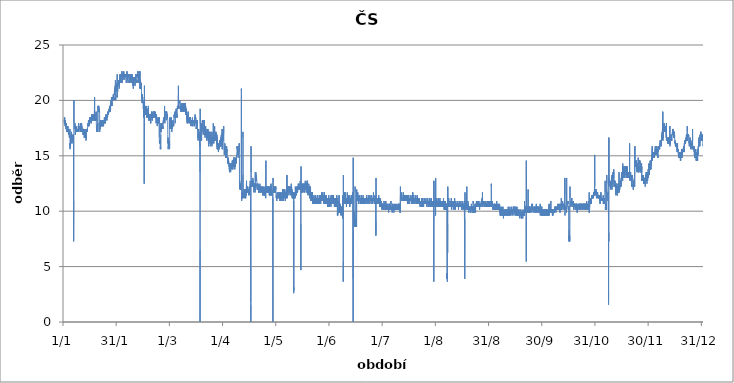
| Category | Series 0 |
|---|---|
| 2012-01-01 01:00:00 | 18.2 |
| 2012-01-01 02:00:00 | 18.2 |
| 2012-01-01 03:00:00 | 18.2 |
| 2012-01-01 04:00:00 | 18.2 |
| 2012-01-01 05:00:00 | 18.2 |
| 2012-01-01 06:00:00 | 17.94 |
| 2012-01-01 07:00:00 | 18.46 |
| 2012-01-01 08:00:00 | 18.46 |
| 2012-01-01 09:00:00 | 17.94 |
| 2012-01-01 10:00:00 | 18.46 |
| 2012-01-01 11:00:00 | 17.94 |
| 2012-01-01 12:00:00 | 17.94 |
| 2012-01-01 13:00:00 | 17.94 |
| 2012-01-01 14:00:00 | 18.2 |
| 2012-01-01 15:00:00 | 17.94 |
| 2012-01-01 16:00:00 | 17.68 |
| 2012-01-01 17:00:00 | 18.2 |
| 2012-01-01 18:00:00 | 17.94 |
| 2012-01-01 19:00:00 | 18.2 |
| 2012-01-01 20:00:00 | 17.94 |
| 2012-01-01 21:00:00 | 17.94 |
| 2012-01-01 22:00:00 | 17.68 |
| 2012-01-01 23:00:00 | 17.68 |
| 2012-01-02 | 17.94 |
| 2012-01-02 01:00:00 | 17.68 |
| 2012-01-02 02:00:00 | 17.94 |
| 2012-01-02 03:00:00 | 17.68 |
| 2012-01-02 04:00:00 | 17.42 |
| 2012-01-02 05:00:00 | 17.68 |
| 2012-01-02 06:00:00 | 17.94 |
| 2012-01-02 07:00:00 | 17.68 |
| 2012-01-02 08:00:00 | 17.68 |
| 2012-01-02 09:00:00 | 17.42 |
| 2012-01-02 10:00:00 | 17.42 |
| 2012-01-02 11:00:00 | 17.42 |
| 2012-01-02 12:00:00 | 17.16 |
| 2012-01-02 13:00:00 | 17.42 |
| 2012-01-02 14:00:00 | 17.16 |
| 2012-01-02 15:00:00 | 17.16 |
| 2012-01-02 16:00:00 | 17.16 |
| 2012-01-02 17:00:00 | 17.16 |
| 2012-01-02 18:00:00 | 17.42 |
| 2012-01-02 19:00:00 | 17.42 |
| 2012-01-02 20:00:00 | 17.42 |
| 2012-01-02 21:00:00 | 17.42 |
| 2012-01-02 22:00:00 | 17.16 |
| 2012-01-02 23:00:00 | 17.68 |
| 2012-01-03 | 17.42 |
| 2012-01-03 01:00:00 | 17.42 |
| 2012-01-03 02:00:00 | 17.68 |
| 2012-01-03 03:00:00 | 17.16 |
| 2012-01-03 04:00:00 | 17.42 |
| 2012-01-03 05:00:00 | 17.42 |
| 2012-01-03 06:00:00 | 17.42 |
| 2012-01-03 07:00:00 | 17.68 |
| 2012-01-03 08:00:00 | 17.42 |
| 2012-01-03 09:00:00 | 17.42 |
| 2012-01-03 10:00:00 | 17.42 |
| 2012-01-03 11:00:00 | 17.16 |
| 2012-01-03 12:00:00 | 17.16 |
| 2012-01-03 13:00:00 | 17.16 |
| 2012-01-03 14:00:00 | 17.16 |
| 2012-01-03 15:00:00 | 16.9 |
| 2012-01-03 16:00:00 | 16.9 |
| 2012-01-03 17:00:00 | 17.16 |
| 2012-01-03 18:00:00 | 17.16 |
| 2012-01-03 19:00:00 | 17.42 |
| 2012-01-03 20:00:00 | 17.42 |
| 2012-01-03 21:00:00 | 16.9 |
| 2012-01-03 22:00:00 | 17.16 |
| 2012-01-03 23:00:00 | 16.9 |
| 2012-01-04 | 17.16 |
| 2012-01-04 01:00:00 | 16.9 |
| 2012-01-04 02:00:00 | 17.16 |
| 2012-01-04 03:00:00 | 16.64 |
| 2012-01-04 04:00:00 | 16.9 |
| 2012-01-04 05:00:00 | 16.64 |
| 2012-01-04 06:00:00 | 16.64 |
| 2012-01-04 07:00:00 | 16.64 |
| 2012-01-04 08:00:00 | 16.9 |
| 2012-01-04 09:00:00 | 16.9 |
| 2012-01-04 10:00:00 | 17.42 |
| 2012-01-04 11:00:00 | 16.9 |
| 2012-01-04 12:00:00 | 15.6 |
| 2012-01-04 13:00:00 | 16.12 |
| 2012-01-04 14:00:00 | 15.86 |
| 2012-01-04 15:00:00 | 16.12 |
| 2012-01-04 16:00:00 | 15.86 |
| 2012-01-04 17:00:00 | 16.12 |
| 2012-01-04 18:00:00 | 15.86 |
| 2012-01-04 19:00:00 | 16.38 |
| 2012-01-04 20:00:00 | 16.38 |
| 2012-01-04 21:00:00 | 16.38 |
| 2012-01-04 22:00:00 | 16.38 |
| 2012-01-04 23:00:00 | 16.12 |
| 2012-01-05 | 16.9 |
| 2012-01-05 01:00:00 | 16.38 |
| 2012-01-05 02:00:00 | 16.64 |
| 2012-01-05 03:00:00 | 16.64 |
| 2012-01-05 04:00:00 | 16.38 |
| 2012-01-05 05:00:00 | 16.64 |
| 2012-01-05 06:00:00 | 16.38 |
| 2012-01-05 07:00:00 | 17.16 |
| 2012-01-05 08:00:00 | 16.9 |
| 2012-01-05 09:00:00 | 16.38 |
| 2012-01-05 10:00:00 | 16.64 |
| 2012-01-05 11:00:00 | 16.38 |
| 2012-01-05 12:00:00 | 16.38 |
| 2012-01-05 13:00:00 | 16.38 |
| 2012-01-05 14:00:00 | 16.9 |
| 2012-01-05 15:00:00 | 16.38 |
| 2012-01-05 16:00:00 | 16.12 |
| 2012-01-05 17:00:00 | 16.38 |
| 2012-01-05 18:00:00 | 16.38 |
| 2012-01-05 19:00:00 | 16.64 |
| 2012-01-05 20:00:00 | 16.38 |
| 2012-01-05 21:00:00 | 16.38 |
| 2012-01-05 22:00:00 | 16.38 |
| 2012-01-05 23:00:00 | 16.38 |
| 2012-01-06 | 16.64 |
| 2012-01-06 01:00:00 | 16.64 |
| 2012-01-06 02:00:00 | 16.9 |
| 2012-01-06 03:00:00 | 16.38 |
| 2012-01-06 04:00:00 | 16.64 |
| 2012-01-06 05:00:00 | 16.64 |
| 2012-01-06 06:00:00 | 16.38 |
| 2012-01-06 07:00:00 | 16.9 |
| 2012-01-06 08:00:00 | 16.64 |
| 2012-01-06 09:00:00 | 16.64 |
| 2012-01-06 10:00:00 | 16.64 |
| 2012-01-06 11:00:00 | 16.38 |
| 2012-01-06 12:00:00 | 16.64 |
| 2012-01-06 13:00:00 | 7.28 |
| 2012-01-06 14:00:00 | 7.28 |
| 2012-01-06 15:00:00 | 10.92 |
| 2012-01-06 16:00:00 | 13.52 |
| 2012-01-06 17:00:00 | 20.02 |
| 2012-01-06 18:00:00 | 17.94 |
| 2012-01-06 19:00:00 | 17.68 |
| 2012-01-06 20:00:00 | 17.68 |
| 2012-01-06 21:00:00 | 17.68 |
| 2012-01-06 22:00:00 | 17.42 |
| 2012-01-06 23:00:00 | 17.42 |
| 2012-01-07 | 17.42 |
| 2012-01-07 01:00:00 | 17.42 |
| 2012-01-07 02:00:00 | 17.68 |
| 2012-01-07 03:00:00 | 17.42 |
| 2012-01-07 04:00:00 | 17.42 |
| 2012-01-07 05:00:00 | 17.68 |
| 2012-01-07 06:00:00 | 17.68 |
| 2012-01-07 07:00:00 | 17.42 |
| 2012-01-07 08:00:00 | 17.68 |
| 2012-01-07 09:00:00 | 17.94 |
| 2012-01-07 10:00:00 | 17.42 |
| 2012-01-07 11:00:00 | 17.42 |
| 2012-01-07 12:00:00 | 17.68 |
| 2012-01-07 13:00:00 | 16.9 |
| 2012-01-07 14:00:00 | 17.42 |
| 2012-01-07 15:00:00 | 16.9 |
| 2012-01-07 16:00:00 | 17.16 |
| 2012-01-07 17:00:00 | 17.42 |
| 2012-01-07 18:00:00 | 17.16 |
| 2012-01-07 19:00:00 | 17.16 |
| 2012-01-07 20:00:00 | 17.42 |
| 2012-01-07 21:00:00 | 17.16 |
| 2012-01-07 22:00:00 | 17.42 |
| 2012-01-07 23:00:00 | 17.16 |
| 2012-01-08 | 17.42 |
| 2012-01-08 01:00:00 | 17.42 |
| 2012-01-08 02:00:00 | 17.42 |
| 2012-01-08 03:00:00 | 17.16 |
| 2012-01-08 04:00:00 | 17.16 |
| 2012-01-08 05:00:00 | 17.42 |
| 2012-01-08 06:00:00 | 17.42 |
| 2012-01-08 07:00:00 | 17.68 |
| 2012-01-08 08:00:00 | 17.42 |
| 2012-01-08 09:00:00 | 17.16 |
| 2012-01-08 10:00:00 | 17.42 |
| 2012-01-08 11:00:00 | 17.16 |
| 2012-01-08 12:00:00 | 17.16 |
| 2012-01-08 13:00:00 | 17.16 |
| 2012-01-08 14:00:00 | 17.16 |
| 2012-01-08 15:00:00 | 17.16 |
| 2012-01-08 16:00:00 | 17.16 |
| 2012-01-08 17:00:00 | 17.42 |
| 2012-01-08 18:00:00 | 17.16 |
| 2012-01-08 19:00:00 | 17.42 |
| 2012-01-08 20:00:00 | 17.42 |
| 2012-01-08 21:00:00 | 17.16 |
| 2012-01-08 22:00:00 | 17.42 |
| 2012-01-08 23:00:00 | 17.42 |
| 2012-01-09 | 17.42 |
| 2012-01-09 01:00:00 | 17.42 |
| 2012-01-09 02:00:00 | 17.42 |
| 2012-01-09 03:00:00 | 17.42 |
| 2012-01-09 04:00:00 | 17.42 |
| 2012-01-09 05:00:00 | 17.16 |
| 2012-01-09 06:00:00 | 17.42 |
| 2012-01-09 07:00:00 | 17.42 |
| 2012-01-09 08:00:00 | 17.94 |
| 2012-01-09 09:00:00 | 17.42 |
| 2012-01-09 10:00:00 | 17.94 |
| 2012-01-09 11:00:00 | 17.42 |
| 2012-01-09 12:00:00 | 17.16 |
| 2012-01-09 13:00:00 | 17.16 |
| 2012-01-09 14:00:00 | 17.16 |
| 2012-01-09 15:00:00 | 17.16 |
| 2012-01-09 16:00:00 | 17.16 |
| 2012-01-09 17:00:00 | 17.42 |
| 2012-01-09 18:00:00 | 17.68 |
| 2012-01-09 19:00:00 | 17.42 |
| 2012-01-09 20:00:00 | 17.68 |
| 2012-01-09 21:00:00 | 17.42 |
| 2012-01-09 22:00:00 | 17.42 |
| 2012-01-09 23:00:00 | 17.42 |
| 2012-01-10 | 17.42 |
| 2012-01-10 01:00:00 | 17.42 |
| 2012-01-10 02:00:00 | 17.68 |
| 2012-01-10 03:00:00 | 17.42 |
| 2012-01-10 04:00:00 | 17.42 |
| 2012-01-10 05:00:00 | 17.42 |
| 2012-01-10 06:00:00 | 17.42 |
| 2012-01-10 07:00:00 | 17.68 |
| 2012-01-10 08:00:00 | 17.42 |
| 2012-01-10 09:00:00 | 17.68 |
| 2012-01-10 10:00:00 | 17.16 |
| 2012-01-10 11:00:00 | 17.16 |
| 2012-01-10 12:00:00 | 17.94 |
| 2012-01-10 13:00:00 | 17.16 |
| 2012-01-10 14:00:00 | 17.42 |
| 2012-01-10 15:00:00 | 17.42 |
| 2012-01-10 16:00:00 | 17.42 |
| 2012-01-10 17:00:00 | 17.42 |
| 2012-01-10 18:00:00 | 17.68 |
| 2012-01-10 19:00:00 | 17.42 |
| 2012-01-10 20:00:00 | 17.68 |
| 2012-01-10 21:00:00 | 17.42 |
| 2012-01-10 22:00:00 | 17.68 |
| 2012-01-10 23:00:00 | 17.16 |
| 2012-01-11 | 17.68 |
| 2012-01-11 01:00:00 | 17.42 |
| 2012-01-11 02:00:00 | 17.68 |
| 2012-01-11 03:00:00 | 17.94 |
| 2012-01-11 04:00:00 | 17.42 |
| 2012-01-11 05:00:00 | 17.68 |
| 2012-01-11 06:00:00 | 17.68 |
| 2012-01-11 07:00:00 | 17.68 |
| 2012-01-11 08:00:00 | 17.42 |
| 2012-01-11 09:00:00 | 17.42 |
| 2012-01-11 10:00:00 | 17.42 |
| 2012-01-11 11:00:00 | 17.42 |
| 2012-01-11 12:00:00 | 17.16 |
| 2012-01-11 13:00:00 | 17.16 |
| 2012-01-11 14:00:00 | 17.42 |
| 2012-01-11 15:00:00 | 17.16 |
| 2012-01-11 16:00:00 | 17.42 |
| 2012-01-11 17:00:00 | 17.42 |
| 2012-01-11 18:00:00 | 17.16 |
| 2012-01-11 19:00:00 | 17.42 |
| 2012-01-11 20:00:00 | 17.42 |
| 2012-01-11 21:00:00 | 17.16 |
| 2012-01-11 22:00:00 | 17.42 |
| 2012-01-11 23:00:00 | 16.9 |
| 2012-01-12 | 17.42 |
| 2012-01-12 01:00:00 | 17.16 |
| 2012-01-12 02:00:00 | 17.42 |
| 2012-01-12 03:00:00 | 17.16 |
| 2012-01-12 04:00:00 | 17.42 |
| 2012-01-12 05:00:00 | 17.16 |
| 2012-01-12 06:00:00 | 17.16 |
| 2012-01-12 07:00:00 | 17.42 |
| 2012-01-12 08:00:00 | 17.16 |
| 2012-01-12 09:00:00 | 16.9 |
| 2012-01-12 10:00:00 | 16.9 |
| 2012-01-12 11:00:00 | 17.42 |
| 2012-01-12 12:00:00 | 16.9 |
| 2012-01-12 13:00:00 | 17.16 |
| 2012-01-12 14:00:00 | 16.9 |
| 2012-01-12 15:00:00 | 16.64 |
| 2012-01-12 16:00:00 | 16.64 |
| 2012-01-12 17:00:00 | 17.42 |
| 2012-01-12 18:00:00 | 16.9 |
| 2012-01-12 19:00:00 | 17.16 |
| 2012-01-12 20:00:00 | 16.9 |
| 2012-01-12 21:00:00 | 16.9 |
| 2012-01-12 22:00:00 | 16.9 |
| 2012-01-12 23:00:00 | 16.64 |
| 2012-01-13 | 16.64 |
| 2012-01-13 01:00:00 | 16.64 |
| 2012-01-13 02:00:00 | 16.9 |
| 2012-01-13 03:00:00 | 16.9 |
| 2012-01-13 04:00:00 | 16.64 |
| 2012-01-13 05:00:00 | 16.9 |
| 2012-01-13 06:00:00 | 16.64 |
| 2012-01-13 07:00:00 | 17.16 |
| 2012-01-13 08:00:00 | 16.9 |
| 2012-01-13 09:00:00 | 16.64 |
| 2012-01-13 10:00:00 | 16.64 |
| 2012-01-13 11:00:00 | 16.9 |
| 2012-01-13 12:00:00 | 16.64 |
| 2012-01-13 13:00:00 | 17.42 |
| 2012-01-13 14:00:00 | 16.9 |
| 2012-01-13 15:00:00 | 16.9 |
| 2012-01-13 16:00:00 | 16.38 |
| 2012-01-13 17:00:00 | 16.9 |
| 2012-01-13 18:00:00 | 16.9 |
| 2012-01-13 19:00:00 | 17.42 |
| 2012-01-13 20:00:00 | 17.16 |
| 2012-01-13 21:00:00 | 16.9 |
| 2012-01-13 22:00:00 | 17.16 |
| 2012-01-13 23:00:00 | 17.16 |
| 2012-01-14 | 17.16 |
| 2012-01-14 01:00:00 | 17.16 |
| 2012-01-14 02:00:00 | 17.42 |
| 2012-01-14 03:00:00 | 17.16 |
| 2012-01-14 04:00:00 | 17.42 |
| 2012-01-14 05:00:00 | 17.42 |
| 2012-01-14 06:00:00 | 17.42 |
| 2012-01-14 07:00:00 | 17.42 |
| 2012-01-14 08:00:00 | 17.42 |
| 2012-01-14 09:00:00 | 17.42 |
| 2012-01-14 10:00:00 | 17.16 |
| 2012-01-14 11:00:00 | 17.42 |
| 2012-01-14 12:00:00 | 17.42 |
| 2012-01-14 13:00:00 | 17.42 |
| 2012-01-14 14:00:00 | 17.42 |
| 2012-01-14 15:00:00 | 17.42 |
| 2012-01-14 16:00:00 | 17.68 |
| 2012-01-14 17:00:00 | 17.68 |
| 2012-01-14 18:00:00 | 17.68 |
| 2012-01-14 19:00:00 | 17.94 |
| 2012-01-14 20:00:00 | 17.68 |
| 2012-01-14 21:00:00 | 17.68 |
| 2012-01-14 22:00:00 | 17.94 |
| 2012-01-14 23:00:00 | 17.68 |
| 2012-01-15 | 17.68 |
| 2012-01-15 01:00:00 | 18.2 |
| 2012-01-15 02:00:00 | 17.94 |
| 2012-01-15 03:00:00 | 18.2 |
| 2012-01-15 04:00:00 | 17.94 |
| 2012-01-15 05:00:00 | 17.68 |
| 2012-01-15 06:00:00 | 18.2 |
| 2012-01-15 07:00:00 | 18.2 |
| 2012-01-15 08:00:00 | 17.94 |
| 2012-01-15 09:00:00 | 17.94 |
| 2012-01-15 10:00:00 | 17.68 |
| 2012-01-15 11:00:00 | 17.68 |
| 2012-01-15 12:00:00 | 17.94 |
| 2012-01-15 13:00:00 | 18.2 |
| 2012-01-15 14:00:00 | 17.94 |
| 2012-01-15 15:00:00 | 17.94 |
| 2012-01-15 16:00:00 | 17.94 |
| 2012-01-15 17:00:00 | 17.94 |
| 2012-01-15 18:00:00 | 18.2 |
| 2012-01-15 19:00:00 | 18.2 |
| 2012-01-15 20:00:00 | 18.46 |
| 2012-01-15 21:00:00 | 18.2 |
| 2012-01-15 22:00:00 | 18.46 |
| 2012-01-15 23:00:00 | 18.2 |
| 2012-01-16 | 18.2 |
| 2012-01-16 01:00:00 | 18.46 |
| 2012-01-16 02:00:00 | 18.46 |
| 2012-01-16 03:00:00 | 18.46 |
| 2012-01-16 04:00:00 | 18.2 |
| 2012-01-16 05:00:00 | 18.2 |
| 2012-01-16 06:00:00 | 18.2 |
| 2012-01-16 07:00:00 | 18.46 |
| 2012-01-16 08:00:00 | 18.46 |
| 2012-01-16 09:00:00 | 18.2 |
| 2012-01-16 10:00:00 | 18.2 |
| 2012-01-16 11:00:00 | 18.2 |
| 2012-01-16 12:00:00 | 17.94 |
| 2012-01-16 13:00:00 | 18.46 |
| 2012-01-16 14:00:00 | 18.46 |
| 2012-01-16 15:00:00 | 18.2 |
| 2012-01-16 16:00:00 | 17.94 |
| 2012-01-16 17:00:00 | 18.2 |
| 2012-01-16 18:00:00 | 18.2 |
| 2012-01-16 19:00:00 | 18.72 |
| 2012-01-16 20:00:00 | 18.46 |
| 2012-01-16 21:00:00 | 18.46 |
| 2012-01-16 22:00:00 | 18.2 |
| 2012-01-16 23:00:00 | 18.46 |
| 2012-01-17 | 18.46 |
| 2012-01-17 01:00:00 | 18.72 |
| 2012-01-17 02:00:00 | 18.72 |
| 2012-01-17 03:00:00 | 18.46 |
| 2012-01-17 04:00:00 | 18.46 |
| 2012-01-17 05:00:00 | 18.46 |
| 2012-01-17 06:00:00 | 18.72 |
| 2012-01-17 07:00:00 | 18.72 |
| 2012-01-17 08:00:00 | 18.72 |
| 2012-01-17 09:00:00 | 18.2 |
| 2012-01-17 10:00:00 | 18.2 |
| 2012-01-17 11:00:00 | 18.46 |
| 2012-01-17 12:00:00 | 18.2 |
| 2012-01-17 13:00:00 | 18.46 |
| 2012-01-17 14:00:00 | 18.2 |
| 2012-01-17 15:00:00 | 18.2 |
| 2012-01-17 16:00:00 | 18.2 |
| 2012-01-17 17:00:00 | 18.46 |
| 2012-01-17 18:00:00 | 18.2 |
| 2012-01-17 19:00:00 | 18.46 |
| 2012-01-17 20:00:00 | 18.46 |
| 2012-01-17 21:00:00 | 18.46 |
| 2012-01-17 22:00:00 | 18.46 |
| 2012-01-17 23:00:00 | 18.46 |
| 2012-01-18 | 18.46 |
| 2012-01-18 01:00:00 | 18.46 |
| 2012-01-18 02:00:00 | 18.72 |
| 2012-01-18 03:00:00 | 18.46 |
| 2012-01-18 04:00:00 | 18.72 |
| 2012-01-18 05:00:00 | 18.46 |
| 2012-01-18 06:00:00 | 18.46 |
| 2012-01-18 07:00:00 | 18.46 |
| 2012-01-18 08:00:00 | 18.46 |
| 2012-01-18 09:00:00 | 18.2 |
| 2012-01-18 10:00:00 | 18.2 |
| 2012-01-18 11:00:00 | 18.2 |
| 2012-01-18 12:00:00 | 19.76 |
| 2012-01-18 13:00:00 | 20.28 |
| 2012-01-18 14:00:00 | 18.2 |
| 2012-01-18 15:00:00 | 18.46 |
| 2012-01-18 16:00:00 | 18.2 |
| 2012-01-18 17:00:00 | 18.46 |
| 2012-01-18 18:00:00 | 18.46 |
| 2012-01-18 19:00:00 | 18.46 |
| 2012-01-18 20:00:00 | 18.72 |
| 2012-01-18 21:00:00 | 18.46 |
| 2012-01-18 22:00:00 | 18.46 |
| 2012-01-18 23:00:00 | 18.72 |
| 2012-01-19 | 18.2 |
| 2012-01-19 01:00:00 | 18.72 |
| 2012-01-19 02:00:00 | 18.72 |
| 2012-01-19 03:00:00 | 18.46 |
| 2012-01-19 04:00:00 | 18.2 |
| 2012-01-19 05:00:00 | 18.72 |
| 2012-01-19 06:00:00 | 18.2 |
| 2012-01-19 07:00:00 | 18.46 |
| 2012-01-19 08:00:00 | 18.46 |
| 2012-01-19 09:00:00 | 18.2 |
| 2012-01-19 10:00:00 | 18.98 |
| 2012-01-19 11:00:00 | 18.72 |
| 2012-01-19 12:00:00 | 18.2 |
| 2012-01-19 13:00:00 | 17.94 |
| 2012-01-19 14:00:00 | 17.68 |
| 2012-01-19 15:00:00 | 17.42 |
| 2012-01-19 16:00:00 | 17.16 |
| 2012-01-19 17:00:00 | 17.68 |
| 2012-01-19 18:00:00 | 17.68 |
| 2012-01-19 19:00:00 | 17.68 |
| 2012-01-19 20:00:00 | 17.42 |
| 2012-01-19 21:00:00 | 17.68 |
| 2012-01-19 22:00:00 | 17.68 |
| 2012-01-19 23:00:00 | 17.42 |
| 2012-01-20 | 17.68 |
| 2012-01-20 01:00:00 | 17.68 |
| 2012-01-20 02:00:00 | 17.68 |
| 2012-01-20 03:00:00 | 17.42 |
| 2012-01-20 04:00:00 | 17.42 |
| 2012-01-20 05:00:00 | 17.94 |
| 2012-01-20 06:00:00 | 17.68 |
| 2012-01-20 07:00:00 | 17.68 |
| 2012-01-20 08:00:00 | 17.94 |
| 2012-01-20 09:00:00 | 17.16 |
| 2012-01-20 10:00:00 | 19.24 |
| 2012-01-20 11:00:00 | 19.24 |
| 2012-01-20 12:00:00 | 19.24 |
| 2012-01-20 13:00:00 | 19.5 |
| 2012-01-20 14:00:00 | 19.24 |
| 2012-01-20 15:00:00 | 19.5 |
| 2012-01-20 16:00:00 | 19.24 |
| 2012-01-20 17:00:00 | 18.98 |
| 2012-01-20 18:00:00 | 19.5 |
| 2012-01-20 19:00:00 | 19.5 |
| 2012-01-20 20:00:00 | 19.5 |
| 2012-01-20 21:00:00 | 19.24 |
| 2012-01-20 22:00:00 | 19.5 |
| 2012-01-20 23:00:00 | 19.24 |
| 2012-01-21 | 18.98 |
| 2012-01-21 01:00:00 | 19.24 |
| 2012-01-21 02:00:00 | 19.24 |
| 2012-01-21 03:00:00 | 19.24 |
| 2012-01-21 04:00:00 | 19.24 |
| 2012-01-21 05:00:00 | 19.24 |
| 2012-01-21 06:00:00 | 19.24 |
| 2012-01-21 07:00:00 | 18.98 |
| 2012-01-21 08:00:00 | 19.24 |
| 2012-01-21 09:00:00 | 18.98 |
| 2012-01-21 10:00:00 | 18.72 |
| 2012-01-21 11:00:00 | 17.16 |
| 2012-01-21 12:00:00 | 17.42 |
| 2012-01-21 13:00:00 | 17.42 |
| 2012-01-21 14:00:00 | 17.94 |
| 2012-01-21 15:00:00 | 17.42 |
| 2012-01-21 16:00:00 | 17.68 |
| 2012-01-21 17:00:00 | 17.68 |
| 2012-01-21 18:00:00 | 17.94 |
| 2012-01-21 19:00:00 | 17.94 |
| 2012-01-21 20:00:00 | 18.2 |
| 2012-01-21 21:00:00 | 17.68 |
| 2012-01-21 22:00:00 | 17.94 |
| 2012-01-21 23:00:00 | 17.94 |
| 2012-01-22 | 17.94 |
| 2012-01-22 01:00:00 | 17.68 |
| 2012-01-22 02:00:00 | 18.2 |
| 2012-01-22 03:00:00 | 17.94 |
| 2012-01-22 04:00:00 | 17.94 |
| 2012-01-22 05:00:00 | 17.94 |
| 2012-01-22 06:00:00 | 17.68 |
| 2012-01-22 07:00:00 | 18.2 |
| 2012-01-22 08:00:00 | 17.94 |
| 2012-01-22 09:00:00 | 17.94 |
| 2012-01-22 10:00:00 | 17.68 |
| 2012-01-22 11:00:00 | 17.94 |
| 2012-01-22 12:00:00 | 17.94 |
| 2012-01-22 13:00:00 | 17.94 |
| 2012-01-22 14:00:00 | 17.94 |
| 2012-01-22 15:00:00 | 17.68 |
| 2012-01-22 16:00:00 | 17.68 |
| 2012-01-22 17:00:00 | 17.94 |
| 2012-01-22 18:00:00 | 17.68 |
| 2012-01-22 19:00:00 | 17.94 |
| 2012-01-22 20:00:00 | 18.2 |
| 2012-01-22 21:00:00 | 17.68 |
| 2012-01-22 22:00:00 | 17.94 |
| 2012-01-22 23:00:00 | 17.68 |
| 2012-01-23 | 17.94 |
| 2012-01-23 01:00:00 | 17.94 |
| 2012-01-23 02:00:00 | 17.94 |
| 2012-01-23 03:00:00 | 17.94 |
| 2012-01-23 04:00:00 | 17.68 |
| 2012-01-23 05:00:00 | 17.94 |
| 2012-01-23 06:00:00 | 17.68 |
| 2012-01-23 07:00:00 | 17.94 |
| 2012-01-23 08:00:00 | 18.2 |
| 2012-01-23 09:00:00 | 17.94 |
| 2012-01-23 10:00:00 | 17.94 |
| 2012-01-23 11:00:00 | 18.2 |
| 2012-01-23 12:00:00 | 17.68 |
| 2012-01-23 13:00:00 | 18.2 |
| 2012-01-23 14:00:00 | 17.94 |
| 2012-01-23 15:00:00 | 17.94 |
| 2012-01-23 16:00:00 | 17.68 |
| 2012-01-23 17:00:00 | 18.2 |
| 2012-01-23 18:00:00 | 18.2 |
| 2012-01-23 19:00:00 | 17.94 |
| 2012-01-23 20:00:00 | 17.94 |
| 2012-01-23 21:00:00 | 17.94 |
| 2012-01-23 22:00:00 | 17.94 |
| 2012-01-23 23:00:00 | 17.94 |
| 2012-01-24 | 17.94 |
| 2012-01-24 01:00:00 | 18.2 |
| 2012-01-24 02:00:00 | 18.2 |
| 2012-01-24 03:00:00 | 18.46 |
| 2012-01-24 04:00:00 | 18.2 |
| 2012-01-24 05:00:00 | 18.2 |
| 2012-01-24 06:00:00 | 18.2 |
| 2012-01-24 07:00:00 | 18.2 |
| 2012-01-24 08:00:00 | 18.2 |
| 2012-01-24 09:00:00 | 17.94 |
| 2012-01-24 10:00:00 | 17.94 |
| 2012-01-24 11:00:00 | 18.46 |
| 2012-01-24 12:00:00 | 17.94 |
| 2012-01-24 13:00:00 | 17.94 |
| 2012-01-24 14:00:00 | 18.2 |
| 2012-01-24 15:00:00 | 17.94 |
| 2012-01-24 16:00:00 | 17.94 |
| 2012-01-24 17:00:00 | 17.94 |
| 2012-01-24 18:00:00 | 18.46 |
| 2012-01-24 19:00:00 | 18.2 |
| 2012-01-24 20:00:00 | 18.46 |
| 2012-01-24 21:00:00 | 18.46 |
| 2012-01-24 22:00:00 | 18.46 |
| 2012-01-24 23:00:00 | 18.46 |
| 2012-01-25 | 18.2 |
| 2012-01-25 01:00:00 | 18.46 |
| 2012-01-25 02:00:00 | 18.72 |
| 2012-01-25 03:00:00 | 18.46 |
| 2012-01-25 04:00:00 | 18.72 |
| 2012-01-25 05:00:00 | 18.46 |
| 2012-01-25 06:00:00 | 18.46 |
| 2012-01-25 07:00:00 | 18.46 |
| 2012-01-25 08:00:00 | 18.46 |
| 2012-01-25 09:00:00 | 18.46 |
| 2012-01-25 10:00:00 | 18.46 |
| 2012-01-25 11:00:00 | 18.46 |
| 2012-01-25 12:00:00 | 18.46 |
| 2012-01-25 13:00:00 | 18.46 |
| 2012-01-25 14:00:00 | 18.46 |
| 2012-01-25 15:00:00 | 18.2 |
| 2012-01-25 16:00:00 | 18.46 |
| 2012-01-25 17:00:00 | 18.46 |
| 2012-01-25 18:00:00 | 18.46 |
| 2012-01-25 19:00:00 | 18.72 |
| 2012-01-25 20:00:00 | 18.72 |
| 2012-01-25 21:00:00 | 18.72 |
| 2012-01-25 22:00:00 | 18.72 |
| 2012-01-25 23:00:00 | 18.46 |
| 2012-01-26 | 18.72 |
| 2012-01-26 01:00:00 | 18.98 |
| 2012-01-26 02:00:00 | 18.98 |
| 2012-01-26 03:00:00 | 18.72 |
| 2012-01-26 04:00:00 | 18.72 |
| 2012-01-26 05:00:00 | 18.72 |
| 2012-01-26 06:00:00 | 18.72 |
| 2012-01-26 07:00:00 | 18.72 |
| 2012-01-26 08:00:00 | 18.98 |
| 2012-01-26 09:00:00 | 18.72 |
| 2012-01-26 10:00:00 | 18.72 |
| 2012-01-26 11:00:00 | 18.72 |
| 2012-01-26 12:00:00 | 18.72 |
| 2012-01-26 13:00:00 | 18.72 |
| 2012-01-26 14:00:00 | 18.72 |
| 2012-01-26 15:00:00 | 18.72 |
| 2012-01-26 16:00:00 | 18.72 |
| 2012-01-26 17:00:00 | 18.72 |
| 2012-01-26 18:00:00 | 18.98 |
| 2012-01-26 19:00:00 | 19.24 |
| 2012-01-26 20:00:00 | 18.98 |
| 2012-01-26 21:00:00 | 18.98 |
| 2012-01-26 22:00:00 | 18.98 |
| 2012-01-26 23:00:00 | 18.98 |
| 2012-01-27 | 19.24 |
| 2012-01-27 01:00:00 | 19.24 |
| 2012-01-27 02:00:00 | 19.5 |
| 2012-01-27 03:00:00 | 19.24 |
| 2012-01-27 04:00:00 | 19.24 |
| 2012-01-27 05:00:00 | 19.5 |
| 2012-01-27 06:00:00 | 19.24 |
| 2012-01-27 07:00:00 | 19.5 |
| 2012-01-27 08:00:00 | 19.5 |
| 2012-01-27 09:00:00 | 19.24 |
| 2012-01-27 10:00:00 | 19.5 |
| 2012-01-27 11:00:00 | 19.5 |
| 2012-01-27 12:00:00 | 19.24 |
| 2012-01-27 13:00:00 | 19.24 |
| 2012-01-27 14:00:00 | 19.24 |
| 2012-01-27 15:00:00 | 18.98 |
| 2012-01-27 16:00:00 | 19.24 |
| 2012-01-27 17:00:00 | 19.24 |
| 2012-01-27 18:00:00 | 19.5 |
| 2012-01-27 19:00:00 | 19.5 |
| 2012-01-27 20:00:00 | 19.76 |
| 2012-01-27 21:00:00 | 19.5 |
| 2012-01-27 22:00:00 | 19.76 |
| 2012-01-27 23:00:00 | 19.5 |
| 2012-01-28 | 20.02 |
| 2012-01-28 01:00:00 | 19.76 |
| 2012-01-28 02:00:00 | 20.02 |
| 2012-01-28 03:00:00 | 20.02 |
| 2012-01-28 04:00:00 | 20.02 |
| 2012-01-28 05:00:00 | 20.02 |
| 2012-01-28 06:00:00 | 20.28 |
| 2012-01-28 07:00:00 | 20.02 |
| 2012-01-28 08:00:00 | 20.02 |
| 2012-01-28 09:00:00 | 20.02 |
| 2012-01-28 10:00:00 | 19.76 |
| 2012-01-28 11:00:00 | 19.76 |
| 2012-01-28 12:00:00 | 19.76 |
| 2012-01-28 13:00:00 | 19.76 |
| 2012-01-28 14:00:00 | 19.5 |
| 2012-01-28 15:00:00 | 19.5 |
| 2012-01-28 16:00:00 | 19.76 |
| 2012-01-28 17:00:00 | 19.76 |
| 2012-01-28 18:00:00 | 20.02 |
| 2012-01-28 19:00:00 | 20.02 |
| 2012-01-28 20:00:00 | 20.28 |
| 2012-01-28 21:00:00 | 20.02 |
| 2012-01-28 22:00:00 | 20.28 |
| 2012-01-28 23:00:00 | 20.02 |
| 2012-01-29 | 20.02 |
| 2012-01-29 01:00:00 | 20.02 |
| 2012-01-29 02:00:00 | 20.28 |
| 2012-01-29 03:00:00 | 20.28 |
| 2012-01-29 04:00:00 | 20.28 |
| 2012-01-29 05:00:00 | 20.28 |
| 2012-01-29 06:00:00 | 20.54 |
| 2012-01-29 07:00:00 | 20.28 |
| 2012-01-29 08:00:00 | 20.54 |
| 2012-01-29 09:00:00 | 20.54 |
| 2012-01-29 10:00:00 | 20.28 |
| 2012-01-29 11:00:00 | 20.28 |
| 2012-01-29 12:00:00 | 20.28 |
| 2012-01-29 13:00:00 | 20.02 |
| 2012-01-29 14:00:00 | 20.28 |
| 2012-01-29 15:00:00 | 20.02 |
| 2012-01-29 16:00:00 | 20.02 |
| 2012-01-29 17:00:00 | 20.28 |
| 2012-01-29 18:00:00 | 20.54 |
| 2012-01-29 19:00:00 | 20.54 |
| 2012-01-29 20:00:00 | 20.54 |
| 2012-01-29 21:00:00 | 20.8 |
| 2012-01-29 22:00:00 | 20.54 |
| 2012-01-29 23:00:00 | 20.8 |
| 2012-01-30 | 20.54 |
| 2012-01-30 01:00:00 | 21.06 |
| 2012-01-30 02:00:00 | 21.06 |
| 2012-01-30 03:00:00 | 20.8 |
| 2012-01-30 04:00:00 | 21.06 |
| 2012-01-30 05:00:00 | 21.06 |
| 2012-01-30 06:00:00 | 21.06 |
| 2012-01-30 07:00:00 | 21.32 |
| 2012-01-30 08:00:00 | 21.06 |
| 2012-01-30 09:00:00 | 21.06 |
| 2012-01-30 10:00:00 | 20.8 |
| 2012-01-30 11:00:00 | 21.84 |
| 2012-01-30 12:00:00 | 21.32 |
| 2012-01-30 13:00:00 | 20.54 |
| 2012-01-30 14:00:00 | 20.28 |
| 2012-01-30 15:00:00 | 20.02 |
| 2012-01-30 16:00:00 | 20.54 |
| 2012-01-30 17:00:00 | 20.28 |
| 2012-01-30 18:00:00 | 20.54 |
| 2012-01-30 19:00:00 | 20.8 |
| 2012-01-30 20:00:00 | 21.06 |
| 2012-01-30 21:00:00 | 20.8 |
| 2012-01-30 22:00:00 | 21.32 |
| 2012-01-30 23:00:00 | 21.06 |
| 2012-01-31 | 21.06 |
| 2012-01-31 01:00:00 | 21.06 |
| 2012-01-31 02:00:00 | 21.32 |
| 2012-01-31 03:00:00 | 21.06 |
| 2012-01-31 04:00:00 | 21.32 |
| 2012-01-31 05:00:00 | 21.32 |
| 2012-01-31 06:00:00 | 21.32 |
| 2012-01-31 07:00:00 | 21.58 |
| 2012-01-31 08:00:00 | 21.32 |
| 2012-01-31 09:00:00 | 21.06 |
| 2012-01-31 10:00:00 | 21.32 |
| 2012-01-31 11:00:00 | 22.36 |
| 2012-01-31 12:00:00 | 21.06 |
| 2012-01-31 13:00:00 | 20.54 |
| 2012-01-31 14:00:00 | 20.8 |
| 2012-01-31 15:00:00 | 20.28 |
| 2012-01-31 16:00:00 | 21.06 |
| 2012-01-31 17:00:00 | 20.8 |
| 2012-01-31 18:00:00 | 21.06 |
| 2012-01-31 19:00:00 | 21.06 |
| 2012-01-31 20:00:00 | 21.32 |
| 2012-01-31 21:00:00 | 21.32 |
| 2012-01-31 22:00:00 | 21.32 |
| 2012-01-31 23:00:00 | 21.32 |
| 2012-02-01 | 21.32 |
| 2012-02-01 01:00:00 | 21.58 |
| 2012-02-01 02:00:00 | 21.58 |
| 2012-02-01 03:00:00 | 21.84 |
| 2012-02-01 04:00:00 | 21.32 |
| 2012-02-01 05:00:00 | 21.84 |
| 2012-02-01 06:00:00 | 21.58 |
| 2012-02-01 07:00:00 | 21.58 |
| 2012-02-01 08:00:00 | 21.58 |
| 2012-02-01 09:00:00 | 21.32 |
| 2012-02-01 10:00:00 | 21.84 |
| 2012-02-01 11:00:00 | 21.32 |
| 2012-02-01 12:00:00 | 21.58 |
| 2012-02-01 13:00:00 | 21.32 |
| 2012-02-01 14:00:00 | 21.32 |
| 2012-02-01 15:00:00 | 21.06 |
| 2012-02-01 16:00:00 | 21.58 |
| 2012-02-01 17:00:00 | 21.32 |
| 2012-02-01 18:00:00 | 21.58 |
| 2012-02-01 19:00:00 | 21.84 |
| 2012-02-01 20:00:00 | 21.84 |
| 2012-02-01 21:00:00 | 22.1 |
| 2012-02-01 22:00:00 | 21.84 |
| 2012-02-01 23:00:00 | 21.58 |
| 2012-02-02 | 22.1 |
| 2012-02-02 01:00:00 | 22.1 |
| 2012-02-02 02:00:00 | 22.36 |
| 2012-02-02 03:00:00 | 21.84 |
| 2012-02-02 04:00:00 | 22.1 |
| 2012-02-02 05:00:00 | 22.36 |
| 2012-02-02 06:00:00 | 22.1 |
| 2012-02-02 07:00:00 | 22.1 |
| 2012-02-02 08:00:00 | 21.58 |
| 2012-02-02 09:00:00 | 21.84 |
| 2012-02-02 10:00:00 | 21.58 |
| 2012-02-02 11:00:00 | 21.84 |
| 2012-02-02 12:00:00 | 21.84 |
| 2012-02-02 13:00:00 | 21.84 |
| 2012-02-02 14:00:00 | 21.84 |
| 2012-02-02 15:00:00 | 21.58 |
| 2012-02-02 16:00:00 | 21.58 |
| 2012-02-02 17:00:00 | 21.84 |
| 2012-02-02 18:00:00 | 22.1 |
| 2012-02-02 19:00:00 | 22.1 |
| 2012-02-02 20:00:00 | 22.1 |
| 2012-02-02 21:00:00 | 22.1 |
| 2012-02-02 22:00:00 | 22.1 |
| 2012-02-02 23:00:00 | 22.1 |
| 2012-02-03 | 22.1 |
| 2012-02-03 01:00:00 | 22.62 |
| 2012-02-03 02:00:00 | 22.1 |
| 2012-02-03 03:00:00 | 22.1 |
| 2012-02-03 04:00:00 | 22.36 |
| 2012-02-03 05:00:00 | 22.36 |
| 2012-02-03 06:00:00 | 22.1 |
| 2012-02-03 07:00:00 | 22.1 |
| 2012-02-03 08:00:00 | 21.84 |
| 2012-02-03 09:00:00 | 22.1 |
| 2012-02-03 10:00:00 | 21.58 |
| 2012-02-03 11:00:00 | 22.1 |
| 2012-02-03 12:00:00 | 22.1 |
| 2012-02-03 13:00:00 | 22.1 |
| 2012-02-03 14:00:00 | 21.84 |
| 2012-02-03 15:00:00 | 21.84 |
| 2012-02-03 16:00:00 | 21.84 |
| 2012-02-03 17:00:00 | 22.36 |
| 2012-02-03 18:00:00 | 22.1 |
| 2012-02-03 19:00:00 | 22.36 |
| 2012-02-03 20:00:00 | 22.1 |
| 2012-02-03 21:00:00 | 22.62 |
| 2012-02-03 22:00:00 | 22.62 |
| 2012-02-03 23:00:00 | 22.1 |
| 2012-02-04 | 22.36 |
| 2012-02-04 01:00:00 | 22.62 |
| 2012-02-04 02:00:00 | 22.62 |
| 2012-02-04 03:00:00 | 22.36 |
| 2012-02-04 04:00:00 | 22.62 |
| 2012-02-04 05:00:00 | 22.62 |
| 2012-02-04 06:00:00 | 22.62 |
| 2012-02-04 07:00:00 | 22.62 |
| 2012-02-04 08:00:00 | 22.62 |
| 2012-02-04 09:00:00 | 22.36 |
| 2012-02-04 10:00:00 | 21.84 |
| 2012-02-04 11:00:00 | 22.36 |
| 2012-02-04 12:00:00 | 22.1 |
| 2012-02-04 13:00:00 | 22.1 |
| 2012-02-04 14:00:00 | 22.1 |
| 2012-02-04 15:00:00 | 22.1 |
| 2012-02-04 16:00:00 | 22.1 |
| 2012-02-04 17:00:00 | 22.1 |
| 2012-02-04 18:00:00 | 22.1 |
| 2012-02-04 19:00:00 | 22.36 |
| 2012-02-04 20:00:00 | 22.36 |
| 2012-02-04 21:00:00 | 22.36 |
| 2012-02-04 22:00:00 | 22.36 |
| 2012-02-04 23:00:00 | 22.36 |
| 2012-02-05 | 22.1 |
| 2012-02-05 01:00:00 | 22.36 |
| 2012-02-05 02:00:00 | 22.36 |
| 2012-02-05 03:00:00 | 22.36 |
| 2012-02-05 04:00:00 | 22.1 |
| 2012-02-05 05:00:00 | 22.1 |
| 2012-02-05 06:00:00 | 22.36 |
| 2012-02-05 07:00:00 | 22.36 |
| 2012-02-05 08:00:00 | 22.1 |
| 2012-02-05 09:00:00 | 22.1 |
| 2012-02-05 10:00:00 | 22.1 |
| 2012-02-05 11:00:00 | 22.1 |
| 2012-02-05 12:00:00 | 21.84 |
| 2012-02-05 13:00:00 | 21.84 |
| 2012-02-05 14:00:00 | 21.84 |
| 2012-02-05 15:00:00 | 21.84 |
| 2012-02-05 16:00:00 | 21.58 |
| 2012-02-05 17:00:00 | 21.84 |
| 2012-02-05 18:00:00 | 22.1 |
| 2012-02-05 19:00:00 | 22.36 |
| 2012-02-05 20:00:00 | 22.1 |
| 2012-02-05 21:00:00 | 22.36 |
| 2012-02-05 22:00:00 | 22.36 |
| 2012-02-05 23:00:00 | 22.36 |
| 2012-02-06 | 22.1 |
| 2012-02-06 01:00:00 | 22.62 |
| 2012-02-06 02:00:00 | 22.62 |
| 2012-02-06 03:00:00 | 22.36 |
| 2012-02-06 04:00:00 | 22.36 |
| 2012-02-06 05:00:00 | 22.36 |
| 2012-02-06 06:00:00 | 22.36 |
| 2012-02-06 07:00:00 | 22.1 |
| 2012-02-06 08:00:00 | 22.1 |
| 2012-02-06 09:00:00 | 21.84 |
| 2012-02-06 10:00:00 | 22.1 |
| 2012-02-06 11:00:00 | 21.84 |
| 2012-02-06 12:00:00 | 21.84 |
| 2012-02-06 13:00:00 | 21.84 |
| 2012-02-06 14:00:00 | 21.84 |
| 2012-02-06 15:00:00 | 21.84 |
| 2012-02-06 16:00:00 | 21.58 |
| 2012-02-06 17:00:00 | 21.84 |
| 2012-02-06 18:00:00 | 22.36 |
| 2012-02-06 19:00:00 | 22.1 |
| 2012-02-06 20:00:00 | 22.1 |
| 2012-02-06 21:00:00 | 22.1 |
| 2012-02-06 22:00:00 | 22.36 |
| 2012-02-06 23:00:00 | 22.1 |
| 2012-02-07 | 22.1 |
| 2012-02-07 01:00:00 | 22.36 |
| 2012-02-07 02:00:00 | 22.36 |
| 2012-02-07 03:00:00 | 22.1 |
| 2012-02-07 04:00:00 | 22.1 |
| 2012-02-07 05:00:00 | 22.36 |
| 2012-02-07 06:00:00 | 22.1 |
| 2012-02-07 07:00:00 | 22.1 |
| 2012-02-07 08:00:00 | 21.84 |
| 2012-02-07 09:00:00 | 21.84 |
| 2012-02-07 10:00:00 | 21.58 |
| 2012-02-07 11:00:00 | 21.84 |
| 2012-02-07 12:00:00 | 21.58 |
| 2012-02-07 13:00:00 | 21.84 |
| 2012-02-07 14:00:00 | 21.84 |
| 2012-02-07 15:00:00 | 21.58 |
| 2012-02-07 16:00:00 | 21.58 |
| 2012-02-07 17:00:00 | 21.58 |
| 2012-02-07 18:00:00 | 21.84 |
| 2012-02-07 19:00:00 | 22.1 |
| 2012-02-07 20:00:00 | 21.84 |
| 2012-02-07 21:00:00 | 21.84 |
| 2012-02-07 22:00:00 | 22.1 |
| 2012-02-07 23:00:00 | 22.1 |
| 2012-02-08 | 21.84 |
| 2012-02-08 01:00:00 | 22.1 |
| 2012-02-08 02:00:00 | 22.36 |
| 2012-02-08 03:00:00 | 22.1 |
| 2012-02-08 04:00:00 | 22.1 |
| 2012-02-08 05:00:00 | 21.84 |
| 2012-02-08 06:00:00 | 22.1 |
| 2012-02-08 07:00:00 | 22.36 |
| 2012-02-08 08:00:00 | 21.84 |
| 2012-02-08 09:00:00 | 21.58 |
| 2012-02-08 10:00:00 | 21.58 |
| 2012-02-08 11:00:00 | 21.58 |
| 2012-02-08 12:00:00 | 21.84 |
| 2012-02-08 13:00:00 | 22.1 |
| 2012-02-08 14:00:00 | 22.1 |
| 2012-02-08 15:00:00 | 21.84 |
| 2012-02-08 16:00:00 | 21.84 |
| 2012-02-08 17:00:00 | 22.1 |
| 2012-02-08 18:00:00 | 21.58 |
| 2012-02-08 19:00:00 | 22.1 |
| 2012-02-08 20:00:00 | 22.1 |
| 2012-02-08 21:00:00 | 22.1 |
| 2012-02-08 22:00:00 | 22.1 |
| 2012-02-08 23:00:00 | 21.84 |
| 2012-02-09 | 22.36 |
| 2012-02-09 01:00:00 | 22.1 |
| 2012-02-09 02:00:00 | 22.1 |
| 2012-02-09 03:00:00 | 22.1 |
| 2012-02-09 04:00:00 | 21.84 |
| 2012-02-09 05:00:00 | 22.1 |
| 2012-02-09 06:00:00 | 21.84 |
| 2012-02-09 07:00:00 | 22.1 |
| 2012-02-09 08:00:00 | 21.58 |
| 2012-02-09 09:00:00 | 21.58 |
| 2012-02-09 10:00:00 | 21.84 |
| 2012-02-09 11:00:00 | 21.32 |
| 2012-02-09 12:00:00 | 21.32 |
| 2012-02-09 13:00:00 | 21.32 |
| 2012-02-09 14:00:00 | 21.58 |
| 2012-02-09 15:00:00 | 21.32 |
| 2012-02-09 16:00:00 | 21.06 |
| 2012-02-09 17:00:00 | 21.32 |
| 2012-02-09 18:00:00 | 21.58 |
| 2012-02-09 19:00:00 | 21.84 |
| 2012-02-09 20:00:00 | 21.84 |
| 2012-02-09 21:00:00 | 21.58 |
| 2012-02-09 22:00:00 | 21.32 |
| 2012-02-09 23:00:00 | 21.84 |
| 2012-02-10 | 22.1 |
| 2012-02-10 01:00:00 | 22.1 |
| 2012-02-10 02:00:00 | 21.84 |
| 2012-02-10 03:00:00 | 21.84 |
| 2012-02-10 04:00:00 | 22.1 |
| 2012-02-10 05:00:00 | 22.1 |
| 2012-02-10 06:00:00 | 21.84 |
| 2012-02-10 07:00:00 | 22.1 |
| 2012-02-10 08:00:00 | 21.58 |
| 2012-02-10 09:00:00 | 21.84 |
| 2012-02-10 10:00:00 | 21.58 |
| 2012-02-10 11:00:00 | 21.58 |
| 2012-02-10 12:00:00 | 21.84 |
| 2012-02-10 13:00:00 | 21.58 |
| 2012-02-10 14:00:00 | 21.58 |
| 2012-02-10 15:00:00 | 21.58 |
| 2012-02-10 16:00:00 | 21.58 |
| 2012-02-10 17:00:00 | 21.32 |
| 2012-02-10 18:00:00 | 21.84 |
| 2012-02-10 19:00:00 | 21.84 |
| 2012-02-10 20:00:00 | 22.1 |
| 2012-02-10 21:00:00 | 21.84 |
| 2012-02-10 22:00:00 | 21.84 |
| 2012-02-10 23:00:00 | 22.1 |
| 2012-02-11 | 22.1 |
| 2012-02-11 01:00:00 | 22.1 |
| 2012-02-11 02:00:00 | 22.1 |
| 2012-02-11 03:00:00 | 22.1 |
| 2012-02-11 04:00:00 | 22.36 |
| 2012-02-11 05:00:00 | 22.1 |
| 2012-02-11 06:00:00 | 22.1 |
| 2012-02-11 07:00:00 | 22.36 |
| 2012-02-11 08:00:00 | 22.1 |
| 2012-02-11 09:00:00 | 21.84 |
| 2012-02-11 10:00:00 | 21.84 |
| 2012-02-11 11:00:00 | 21.84 |
| 2012-02-11 12:00:00 | 21.58 |
| 2012-02-11 13:00:00 | 21.58 |
| 2012-02-11 14:00:00 | 21.58 |
| 2012-02-11 15:00:00 | 21.58 |
| 2012-02-11 16:00:00 | 21.84 |
| 2012-02-11 17:00:00 | 21.58 |
| 2012-02-11 18:00:00 | 21.84 |
| 2012-02-11 19:00:00 | 22.1 |
| 2012-02-11 20:00:00 | 22.1 |
| 2012-02-11 21:00:00 | 22.1 |
| 2012-02-11 22:00:00 | 22.36 |
| 2012-02-11 23:00:00 | 22.1 |
| 2012-02-12 | 22.1 |
| 2012-02-12 01:00:00 | 22.36 |
| 2012-02-12 02:00:00 | 22.36 |
| 2012-02-12 03:00:00 | 22.36 |
| 2012-02-12 04:00:00 | 22.62 |
| 2012-02-12 05:00:00 | 22.1 |
| 2012-02-12 06:00:00 | 22.36 |
| 2012-02-12 07:00:00 | 22.62 |
| 2012-02-12 08:00:00 | 22.36 |
| 2012-02-12 09:00:00 | 22.1 |
| 2012-02-12 10:00:00 | 21.84 |
| 2012-02-12 11:00:00 | 21.84 |
| 2012-02-12 12:00:00 | 21.58 |
| 2012-02-12 13:00:00 | 21.58 |
| 2012-02-12 14:00:00 | 21.58 |
| 2012-02-12 15:00:00 | 21.84 |
| 2012-02-12 16:00:00 | 21.58 |
| 2012-02-12 17:00:00 | 21.58 |
| 2012-02-12 18:00:00 | 21.84 |
| 2012-02-12 19:00:00 | 22.1 |
| 2012-02-12 20:00:00 | 22.36 |
| 2012-02-12 21:00:00 | 21.84 |
| 2012-02-12 22:00:00 | 22.36 |
| 2012-02-12 23:00:00 | 22.36 |
| 2012-02-13 | 22.1 |
| 2012-02-13 01:00:00 | 22.36 |
| 2012-02-13 02:00:00 | 22.62 |
| 2012-02-13 03:00:00 | 22.36 |
| 2012-02-13 04:00:00 | 22.1 |
| 2012-02-13 05:00:00 | 22.1 |
| 2012-02-13 06:00:00 | 22.36 |
| 2012-02-13 07:00:00 | 22.1 |
| 2012-02-13 08:00:00 | 21.58 |
| 2012-02-13 09:00:00 | 21.58 |
| 2012-02-13 10:00:00 | 21.58 |
| 2012-02-13 11:00:00 | 22.62 |
| 2012-02-13 12:00:00 | 21.06 |
| 2012-02-13 13:00:00 | 21.32 |
| 2012-02-13 14:00:00 | 21.58 |
| 2012-02-13 15:00:00 | 21.32 |
| 2012-02-13 16:00:00 | 21.06 |
| 2012-02-13 17:00:00 | 21.32 |
| 2012-02-13 18:00:00 | 21.32 |
| 2012-02-13 19:00:00 | 21.84 |
| 2012-02-13 20:00:00 | 21.58 |
| 2012-02-13 21:00:00 | 21.32 |
| 2012-02-13 22:00:00 | 21.32 |
| 2012-02-13 23:00:00 | 21.58 |
| 2012-02-14 | 21.32 |
| 2012-02-14 01:00:00 | 21.32 |
| 2012-02-14 02:00:00 | 21.58 |
| 2012-02-14 03:00:00 | 21.58 |
| 2012-02-14 04:00:00 | 21.06 |
| 2012-02-14 05:00:00 | 21.06 |
| 2012-02-14 06:00:00 | 21.32 |
| 2012-02-14 07:00:00 | 21.06 |
| 2012-02-14 08:00:00 | 21.06 |
| 2012-02-14 09:00:00 | 20.8 |
| 2012-02-14 10:00:00 | 20.8 |
| 2012-02-14 11:00:00 | 20.28 |
| 2012-02-14 12:00:00 | 20.28 |
| 2012-02-14 13:00:00 | 20.54 |
| 2012-02-14 14:00:00 | 20.02 |
| 2012-02-14 15:00:00 | 19.76 |
| 2012-02-14 16:00:00 | 19.76 |
| 2012-02-14 17:00:00 | 19.76 |
| 2012-02-14 18:00:00 | 20.02 |
| 2012-02-14 19:00:00 | 20.28 |
| 2012-02-14 20:00:00 | 20.54 |
| 2012-02-14 21:00:00 | 20.02 |
| 2012-02-14 22:00:00 | 20.02 |
| 2012-02-14 23:00:00 | 20.02 |
| 2012-02-15 | 20.02 |
| 2012-02-15 01:00:00 | 20.28 |
| 2012-02-15 02:00:00 | 20.28 |
| 2012-02-15 03:00:00 | 19.76 |
| 2012-02-15 04:00:00 | 19.76 |
| 2012-02-15 05:00:00 | 20.02 |
| 2012-02-15 06:00:00 | 20.02 |
| 2012-02-15 07:00:00 | 19.76 |
| 2012-02-15 08:00:00 | 19.76 |
| 2012-02-15 09:00:00 | 19.5 |
| 2012-02-15 10:00:00 | 19.24 |
| 2012-02-15 11:00:00 | 19.5 |
| 2012-02-15 12:00:00 | 19.76 |
| 2012-02-15 13:00:00 | 19.76 |
| 2012-02-15 14:00:00 | 18.72 |
| 2012-02-15 15:00:00 | 18.46 |
| 2012-02-15 16:00:00 | 18.72 |
| 2012-02-15 17:00:00 | 18.46 |
| 2012-02-15 18:00:00 | 18.72 |
| 2012-02-15 19:00:00 | 19.24 |
| 2012-02-15 20:00:00 | 18.98 |
| 2012-02-15 21:00:00 | 12.74 |
| 2012-02-15 22:00:00 | 12.48 |
| 2012-02-15 23:00:00 | 12.48 |
| 2012-02-16 | 12.48 |
| 2012-02-16 01:00:00 | 21.32 |
| 2012-02-16 02:00:00 | 20.28 |
| 2012-02-16 03:00:00 | 19.76 |
| 2012-02-16 04:00:00 | 18.98 |
| 2012-02-16 05:00:00 | 19.24 |
| 2012-02-16 06:00:00 | 18.98 |
| 2012-02-16 07:00:00 | 19.24 |
| 2012-02-16 08:00:00 | 18.98 |
| 2012-02-16 09:00:00 | 18.98 |
| 2012-02-16 10:00:00 | 18.72 |
| 2012-02-16 11:00:00 | 18.98 |
| 2012-02-16 12:00:00 | 18.72 |
| 2012-02-16 13:00:00 | 18.98 |
| 2012-02-16 14:00:00 | 19.24 |
| 2012-02-16 15:00:00 | 18.98 |
| 2012-02-16 16:00:00 | 18.72 |
| 2012-02-16 17:00:00 | 18.98 |
| 2012-02-16 18:00:00 | 18.98 |
| 2012-02-16 19:00:00 | 19.5 |
| 2012-02-16 20:00:00 | 19.5 |
| 2012-02-16 21:00:00 | 18.98 |
| 2012-02-16 22:00:00 | 19.24 |
| 2012-02-16 23:00:00 | 18.98 |
| 2012-02-17 | 19.24 |
| 2012-02-17 01:00:00 | 19.5 |
| 2012-02-17 02:00:00 | 18.98 |
| 2012-02-17 03:00:00 | 19.24 |
| 2012-02-17 04:00:00 | 19.24 |
| 2012-02-17 05:00:00 | 18.98 |
| 2012-02-17 06:00:00 | 18.98 |
| 2012-02-17 07:00:00 | 19.24 |
| 2012-02-17 08:00:00 | 18.98 |
| 2012-02-17 09:00:00 | 18.72 |
| 2012-02-17 10:00:00 | 18.72 |
| 2012-02-17 11:00:00 | 18.98 |
| 2012-02-17 12:00:00 | 18.46 |
| 2012-02-17 13:00:00 | 18.98 |
| 2012-02-17 14:00:00 | 18.98 |
| 2012-02-17 15:00:00 | 18.46 |
| 2012-02-17 16:00:00 | 18.72 |
| 2012-02-17 17:00:00 | 18.72 |
| 2012-02-17 18:00:00 | 18.72 |
| 2012-02-17 19:00:00 | 19.24 |
| 2012-02-17 20:00:00 | 18.98 |
| 2012-02-17 21:00:00 | 18.72 |
| 2012-02-17 22:00:00 | 18.98 |
| 2012-02-17 23:00:00 | 18.98 |
| 2012-02-18 | 18.72 |
| 2012-02-18 01:00:00 | 19.24 |
| 2012-02-18 02:00:00 | 19.24 |
| 2012-02-18 03:00:00 | 18.98 |
| 2012-02-18 04:00:00 | 18.72 |
| 2012-02-18 05:00:00 | 18.98 |
| 2012-02-18 06:00:00 | 18.72 |
| 2012-02-18 07:00:00 | 19.5 |
| 2012-02-18 08:00:00 | 18.98 |
| 2012-02-18 09:00:00 | 18.46 |
| 2012-02-18 10:00:00 | 18.46 |
| 2012-02-18 11:00:00 | 18.46 |
| 2012-02-18 12:00:00 | 18.46 |
| 2012-02-18 13:00:00 | 18.2 |
| 2012-02-18 14:00:00 | 18.72 |
| 2012-02-18 15:00:00 | 18.2 |
| 2012-02-18 16:00:00 | 18.2 |
| 2012-02-18 17:00:00 | 18.46 |
| 2012-02-18 18:00:00 | 18.2 |
| 2012-02-18 19:00:00 | 18.72 |
| 2012-02-18 20:00:00 | 18.72 |
| 2012-02-18 21:00:00 | 18.72 |
| 2012-02-18 22:00:00 | 18.46 |
| 2012-02-18 23:00:00 | 18.46 |
| 2012-02-19 | 18.72 |
| 2012-02-19 01:00:00 | 18.72 |
| 2012-02-19 02:00:00 | 18.72 |
| 2012-02-19 03:00:00 | 18.46 |
| 2012-02-19 04:00:00 | 18.72 |
| 2012-02-19 05:00:00 | 18.46 |
| 2012-02-19 06:00:00 | 18.72 |
| 2012-02-19 07:00:00 | 18.46 |
| 2012-02-19 08:00:00 | 18.46 |
| 2012-02-19 09:00:00 | 18.46 |
| 2012-02-19 10:00:00 | 18.46 |
| 2012-02-19 11:00:00 | 18.2 |
| 2012-02-19 12:00:00 | 17.94 |
| 2012-02-19 13:00:00 | 18.46 |
| 2012-02-19 14:00:00 | 18.46 |
| 2012-02-19 15:00:00 | 17.94 |
| 2012-02-19 16:00:00 | 18.2 |
| 2012-02-19 17:00:00 | 18.2 |
| 2012-02-19 18:00:00 | 18.2 |
| 2012-02-19 19:00:00 | 18.72 |
| 2012-02-19 20:00:00 | 18.46 |
| 2012-02-19 21:00:00 | 18.72 |
| 2012-02-19 22:00:00 | 18.46 |
| 2012-02-19 23:00:00 | 18.46 |
| 2012-02-20 | 18.46 |
| 2012-02-20 01:00:00 | 18.46 |
| 2012-02-20 02:00:00 | 18.98 |
| 2012-02-20 03:00:00 | 18.46 |
| 2012-02-20 04:00:00 | 18.46 |
| 2012-02-20 05:00:00 | 18.46 |
| 2012-02-20 06:00:00 | 18.46 |
| 2012-02-20 07:00:00 | 18.72 |
| 2012-02-20 08:00:00 | 18.46 |
| 2012-02-20 09:00:00 | 18.46 |
| 2012-02-20 10:00:00 | 18.46 |
| 2012-02-20 11:00:00 | 18.2 |
| 2012-02-20 12:00:00 | 18.2 |
| 2012-02-20 13:00:00 | 18.46 |
| 2012-02-20 14:00:00 | 18.2 |
| 2012-02-20 15:00:00 | 18.2 |
| 2012-02-20 16:00:00 | 18.2 |
| 2012-02-20 17:00:00 | 18.2 |
| 2012-02-20 18:00:00 | 18.2 |
| 2012-02-20 19:00:00 | 18.72 |
| 2012-02-20 20:00:00 | 18.72 |
| 2012-02-20 21:00:00 | 18.72 |
| 2012-02-20 22:00:00 | 18.46 |
| 2012-02-20 23:00:00 | 18.98 |
| 2012-02-21 | 18.46 |
| 2012-02-21 01:00:00 | 18.72 |
| 2012-02-21 02:00:00 | 18.72 |
| 2012-02-21 03:00:00 | 18.98 |
| 2012-02-21 04:00:00 | 18.72 |
| 2012-02-21 05:00:00 | 18.72 |
| 2012-02-21 06:00:00 | 18.72 |
| 2012-02-21 07:00:00 | 18.72 |
| 2012-02-21 08:00:00 | 18.98 |
| 2012-02-21 09:00:00 | 18.72 |
| 2012-02-21 10:00:00 | 18.72 |
| 2012-02-21 11:00:00 | 18.46 |
| 2012-02-21 12:00:00 | 18.46 |
| 2012-02-21 13:00:00 | 18.72 |
| 2012-02-21 14:00:00 | 18.72 |
| 2012-02-21 15:00:00 | 18.46 |
| 2012-02-21 16:00:00 | 18.46 |
| 2012-02-21 17:00:00 | 18.46 |
| 2012-02-21 18:00:00 | 18.72 |
| 2012-02-21 19:00:00 | 18.72 |
| 2012-02-21 20:00:00 | 18.98 |
| 2012-02-21 21:00:00 | 18.98 |
| 2012-02-21 22:00:00 | 18.72 |
| 2012-02-21 23:00:00 | 18.98 |
| 2012-02-22 | 18.46 |
| 2012-02-22 01:00:00 | 18.98 |
| 2012-02-22 02:00:00 | 18.98 |
| 2012-02-22 03:00:00 | 18.72 |
| 2012-02-22 04:00:00 | 18.72 |
| 2012-02-22 05:00:00 | 18.46 |
| 2012-02-22 06:00:00 | 18.72 |
| 2012-02-22 07:00:00 | 18.46 |
| 2012-02-22 08:00:00 | 18.72 |
| 2012-02-22 09:00:00 | 18.46 |
| 2012-02-22 10:00:00 | 18.46 |
| 2012-02-22 11:00:00 | 18.46 |
| 2012-02-22 12:00:00 | 18.72 |
| 2012-02-22 13:00:00 | 18.72 |
| 2012-02-22 14:00:00 | 18.72 |
| 2012-02-22 15:00:00 | 18.46 |
| 2012-02-22 16:00:00 | 18.2 |
| 2012-02-22 17:00:00 | 17.94 |
| 2012-02-22 18:00:00 | 18.46 |
| 2012-02-22 19:00:00 | 18.72 |
| 2012-02-22 20:00:00 | 18.72 |
| 2012-02-22 21:00:00 | 18.46 |
| 2012-02-22 22:00:00 | 18.2 |
| 2012-02-22 23:00:00 | 18.72 |
| 2012-02-23 | 18.2 |
| 2012-02-23 01:00:00 | 18.46 |
| 2012-02-23 02:00:00 | 18.46 |
| 2012-02-23 03:00:00 | 18.46 |
| 2012-02-23 04:00:00 | 18.2 |
| 2012-02-23 05:00:00 | 18.2 |
| 2012-02-23 06:00:00 | 18.2 |
| 2012-02-23 07:00:00 | 18.2 |
| 2012-02-23 08:00:00 | 18.2 |
| 2012-02-23 09:00:00 | 17.68 |
| 2012-02-23 10:00:00 | 17.94 |
| 2012-02-23 11:00:00 | 17.94 |
| 2012-02-23 12:00:00 | 17.94 |
| 2012-02-23 13:00:00 | 18.2 |
| 2012-02-23 14:00:00 | 17.94 |
| 2012-02-23 15:00:00 | 17.94 |
| 2012-02-23 16:00:00 | 17.94 |
| 2012-02-23 17:00:00 | 18.2 |
| 2012-02-23 18:00:00 | 17.94 |
| 2012-02-23 19:00:00 | 18.2 |
| 2012-02-23 20:00:00 | 18.46 |
| 2012-02-23 21:00:00 | 17.94 |
| 2012-02-23 22:00:00 | 18.2 |
| 2012-02-23 23:00:00 | 18.2 |
| 2012-02-24 | 18.46 |
| 2012-02-24 01:00:00 | 18.46 |
| 2012-02-24 02:00:00 | 18.46 |
| 2012-02-24 03:00:00 | 18.2 |
| 2012-02-24 04:00:00 | 18.2 |
| 2012-02-24 05:00:00 | 18.46 |
| 2012-02-24 06:00:00 | 18.46 |
| 2012-02-24 07:00:00 | 18.2 |
| 2012-02-24 08:00:00 | 17.94 |
| 2012-02-24 09:00:00 | 17.94 |
| 2012-02-24 10:00:00 | 17.94 |
| 2012-02-24 11:00:00 | 18.2 |
| 2012-02-24 12:00:00 | 18.46 |
| 2012-02-24 13:00:00 | 16.64 |
| 2012-02-24 14:00:00 | 16.38 |
| 2012-02-24 15:00:00 | 16.12 |
| 2012-02-24 16:00:00 | 16.12 |
| 2012-02-24 17:00:00 | 16.12 |
| 2012-02-24 18:00:00 | 16.38 |
| 2012-02-24 19:00:00 | 16.38 |
| 2012-02-24 20:00:00 | 16.38 |
| 2012-02-24 21:00:00 | 16.12 |
| 2012-02-24 22:00:00 | 16.12 |
| 2012-02-24 23:00:00 | 16.12 |
| 2012-02-25 | 16.38 |
| 2012-02-25 01:00:00 | 16.12 |
| 2012-02-25 02:00:00 | 15.6 |
| 2012-02-25 03:00:00 | 15.6 |
| 2012-02-25 04:00:00 | 15.6 |
| 2012-02-25 05:00:00 | 15.6 |
| 2012-02-25 06:00:00 | 15.86 |
| 2012-02-25 07:00:00 | 15.86 |
| 2012-02-25 08:00:00 | 15.6 |
| 2012-02-25 09:00:00 | 16.9 |
| 2012-02-25 10:00:00 | 17.94 |
| 2012-02-25 11:00:00 | 17.42 |
| 2012-02-25 12:00:00 | 17.68 |
| 2012-02-25 13:00:00 | 17.16 |
| 2012-02-25 14:00:00 | 17.68 |
| 2012-02-25 15:00:00 | 17.16 |
| 2012-02-25 16:00:00 | 17.42 |
| 2012-02-25 17:00:00 | 17.42 |
| 2012-02-25 18:00:00 | 17.68 |
| 2012-02-25 19:00:00 | 17.68 |
| 2012-02-25 20:00:00 | 17.68 |
| 2012-02-25 21:00:00 | 17.42 |
| 2012-02-25 22:00:00 | 17.68 |
| 2012-02-25 23:00:00 | 17.42 |
| 2012-02-26 | 17.42 |
| 2012-02-26 01:00:00 | 17.94 |
| 2012-02-26 02:00:00 | 17.42 |
| 2012-02-26 03:00:00 | 17.42 |
| 2012-02-26 04:00:00 | 17.94 |
| 2012-02-26 05:00:00 | 17.68 |
| 2012-02-26 06:00:00 | 17.68 |
| 2012-02-26 07:00:00 | 17.68 |
| 2012-02-26 08:00:00 | 17.68 |
| 2012-02-26 09:00:00 | 17.68 |
| 2012-02-26 10:00:00 | 17.68 |
| 2012-02-26 11:00:00 | 17.42 |
| 2012-02-26 12:00:00 | 17.42 |
| 2012-02-26 13:00:00 | 17.68 |
| 2012-02-26 14:00:00 | 17.68 |
| 2012-02-26 15:00:00 | 17.68 |
| 2012-02-26 16:00:00 | 17.42 |
| 2012-02-26 17:00:00 | 17.68 |
| 2012-02-26 18:00:00 | 17.94 |
| 2012-02-26 19:00:00 | 17.94 |
| 2012-02-26 20:00:00 | 18.2 |
| 2012-02-26 21:00:00 | 17.94 |
| 2012-02-26 22:00:00 | 18.2 |
| 2012-02-26 23:00:00 | 18.2 |
| 2012-02-27 | 18.2 |
| 2012-02-27 01:00:00 | 18.2 |
| 2012-02-27 02:00:00 | 18.46 |
| 2012-02-27 03:00:00 | 18.46 |
| 2012-02-27 04:00:00 | 18.46 |
| 2012-02-27 05:00:00 | 18.2 |
| 2012-02-27 06:00:00 | 18.46 |
| 2012-02-27 07:00:00 | 18.46 |
| 2012-02-27 08:00:00 | 18.2 |
| 2012-02-27 09:00:00 | 18.46 |
| 2012-02-27 10:00:00 | 18.2 |
| 2012-02-27 11:00:00 | 18.2 |
| 2012-02-27 12:00:00 | 18.46 |
| 2012-02-27 13:00:00 | 19.5 |
| 2012-02-27 14:00:00 | 18.2 |
| 2012-02-27 15:00:00 | 18.2 |
| 2012-02-27 16:00:00 | 18.2 |
| 2012-02-27 17:00:00 | 17.94 |
| 2012-02-27 18:00:00 | 18.46 |
| 2012-02-27 19:00:00 | 18.72 |
| 2012-02-27 20:00:00 | 18.72 |
| 2012-02-27 21:00:00 | 18.72 |
| 2012-02-27 22:00:00 | 18.72 |
| 2012-02-27 23:00:00 | 18.72 |
| 2012-02-28 | 18.72 |
| 2012-02-28 01:00:00 | 18.72 |
| 2012-02-28 02:00:00 | 18.98 |
| 2012-02-28 03:00:00 | 18.72 |
| 2012-02-28 04:00:00 | 18.98 |
| 2012-02-28 05:00:00 | 18.72 |
| 2012-02-28 06:00:00 | 18.72 |
| 2012-02-28 07:00:00 | 18.72 |
| 2012-02-28 08:00:00 | 18.72 |
| 2012-02-28 09:00:00 | 18.46 |
| 2012-02-28 10:00:00 | 18.46 |
| 2012-02-28 11:00:00 | 18.2 |
| 2012-02-28 12:00:00 | 18.72 |
| 2012-02-28 13:00:00 | 18.72 |
| 2012-02-28 14:00:00 | 18.98 |
| 2012-02-28 15:00:00 | 18.46 |
| 2012-02-28 16:00:00 | 18.46 |
| 2012-02-28 17:00:00 | 18.46 |
| 2012-02-28 18:00:00 | 18.46 |
| 2012-02-28 19:00:00 | 18.98 |
| 2012-02-28 20:00:00 | 18.72 |
| 2012-02-28 21:00:00 | 18.72 |
| 2012-02-28 22:00:00 | 18.46 |
| 2012-02-28 23:00:00 | 18.72 |
| 2012-02-29 | 18.72 |
| 2012-02-29 01:00:00 | 18.46 |
| 2012-02-29 02:00:00 | 18.72 |
| 2012-02-29 03:00:00 | 18.46 |
| 2012-02-29 04:00:00 | 18.72 |
| 2012-02-29 05:00:00 | 18.46 |
| 2012-02-29 06:00:00 | 18.46 |
| 2012-02-29 07:00:00 | 18.46 |
| 2012-02-29 08:00:00 | 18.46 |
| 2012-02-29 09:00:00 | 18.2 |
| 2012-02-29 10:00:00 | 16.9 |
| 2012-02-29 11:00:00 | 16.12 |
| 2012-02-29 12:00:00 | 16.38 |
| 2012-02-29 13:00:00 | 16.64 |
| 2012-02-29 14:00:00 | 16.12 |
| 2012-02-29 15:00:00 | 15.6 |
| 2012-02-29 16:00:00 | 15.86 |
| 2012-02-29 17:00:00 | 15.86 |
| 2012-02-29 18:00:00 | 16.12 |
| 2012-02-29 19:00:00 | 16.12 |
| 2012-02-29 20:00:00 | 15.86 |
| 2012-02-29 21:00:00 | 16.12 |
| 2012-02-29 22:00:00 | 16.12 |
| 2012-02-29 23:00:00 | 16.12 |
| 2012-03-01 | 15.86 |
| 2012-03-01 01:00:00 | 16.38 |
| 2012-03-01 02:00:00 | 15.86 |
| 2012-03-01 03:00:00 | 15.86 |
| 2012-03-01 04:00:00 | 16.12 |
| 2012-03-01 05:00:00 | 15.86 |
| 2012-03-01 06:00:00 | 15.86 |
| 2012-03-01 07:00:00 | 15.86 |
| 2012-03-01 08:00:00 | 15.86 |
| 2012-03-01 09:00:00 | 15.86 |
| 2012-03-01 10:00:00 | 15.6 |
| 2012-03-01 11:00:00 | 16.12 |
| 2012-03-01 12:00:00 | 18.2 |
| 2012-03-01 13:00:00 | 17.68 |
| 2012-03-01 14:00:00 | 17.42 |
| 2012-03-01 15:00:00 | 18.46 |
| 2012-03-01 16:00:00 | 17.68 |
| 2012-03-01 17:00:00 | 17.68 |
| 2012-03-01 18:00:00 | 17.94 |
| 2012-03-01 19:00:00 | 17.94 |
| 2012-03-01 20:00:00 | 17.94 |
| 2012-03-01 21:00:00 | 17.94 |
| 2012-03-01 22:00:00 | 17.68 |
| 2012-03-01 23:00:00 | 17.94 |
| 2012-03-02 | 17.68 |
| 2012-03-02 01:00:00 | 17.68 |
| 2012-03-02 02:00:00 | 17.68 |
| 2012-03-02 03:00:00 | 17.94 |
| 2012-03-02 04:00:00 | 17.42 |
| 2012-03-02 05:00:00 | 17.68 |
| 2012-03-02 06:00:00 | 17.68 |
| 2012-03-02 07:00:00 | 17.68 |
| 2012-03-02 08:00:00 | 17.42 |
| 2012-03-02 09:00:00 | 18.46 |
| 2012-03-02 10:00:00 | 17.68 |
| 2012-03-02 11:00:00 | 17.94 |
| 2012-03-02 12:00:00 | 17.42 |
| 2012-03-02 13:00:00 | 17.68 |
| 2012-03-02 14:00:00 | 17.42 |
| 2012-03-02 15:00:00 | 17.42 |
| 2012-03-02 16:00:00 | 17.16 |
| 2012-03-02 17:00:00 | 17.42 |
| 2012-03-02 18:00:00 | 17.68 |
| 2012-03-02 19:00:00 | 17.42 |
| 2012-03-02 20:00:00 | 17.68 |
| 2012-03-02 21:00:00 | 17.94 |
| 2012-03-02 22:00:00 | 17.94 |
| 2012-03-02 23:00:00 | 17.68 |
| 2012-03-03 | 17.94 |
| 2012-03-03 01:00:00 | 17.94 |
| 2012-03-03 02:00:00 | 17.94 |
| 2012-03-03 03:00:00 | 17.94 |
| 2012-03-03 04:00:00 | 17.94 |
| 2012-03-03 05:00:00 | 17.94 |
| 2012-03-03 06:00:00 | 18.2 |
| 2012-03-03 07:00:00 | 18.2 |
| 2012-03-03 08:00:00 | 17.94 |
| 2012-03-03 09:00:00 | 17.94 |
| 2012-03-03 10:00:00 | 17.68 |
| 2012-03-03 11:00:00 | 17.68 |
| 2012-03-03 12:00:00 | 17.94 |
| 2012-03-03 13:00:00 | 17.68 |
| 2012-03-03 14:00:00 | 17.94 |
| 2012-03-03 15:00:00 | 17.68 |
| 2012-03-03 16:00:00 | 17.68 |
| 2012-03-03 17:00:00 | 17.94 |
| 2012-03-03 18:00:00 | 17.68 |
| 2012-03-03 19:00:00 | 18.2 |
| 2012-03-03 20:00:00 | 18.2 |
| 2012-03-03 21:00:00 | 18.2 |
| 2012-03-03 22:00:00 | 18.2 |
| 2012-03-03 23:00:00 | 18.46 |
| 2012-03-04 | 18.46 |
| 2012-03-04 01:00:00 | 18.72 |
| 2012-03-04 02:00:00 | 18.46 |
| 2012-03-04 03:00:00 | 18.46 |
| 2012-03-04 04:00:00 | 18.46 |
| 2012-03-04 05:00:00 | 18.72 |
| 2012-03-04 06:00:00 | 18.46 |
| 2012-03-04 07:00:00 | 18.46 |
| 2012-03-04 08:00:00 | 18.46 |
| 2012-03-04 09:00:00 | 18.72 |
| 2012-03-04 10:00:00 | 18.98 |
| 2012-03-04 11:00:00 | 18.46 |
| 2012-03-04 12:00:00 | 18.72 |
| 2012-03-04 13:00:00 | 18.46 |
| 2012-03-04 14:00:00 | 18.2 |
| 2012-03-04 15:00:00 | 18.2 |
| 2012-03-04 16:00:00 | 17.94 |
| 2012-03-04 17:00:00 | 18.2 |
| 2012-03-04 18:00:00 | 18.46 |
| 2012-03-04 19:00:00 | 18.46 |
| 2012-03-04 20:00:00 | 18.72 |
| 2012-03-04 21:00:00 | 18.98 |
| 2012-03-04 22:00:00 | 18.72 |
| 2012-03-04 23:00:00 | 18.98 |
| 2012-03-05 | 18.98 |
| 2012-03-05 01:00:00 | 18.72 |
| 2012-03-05 02:00:00 | 18.98 |
| 2012-03-05 03:00:00 | 19.24 |
| 2012-03-05 04:00:00 | 19.24 |
| 2012-03-05 05:00:00 | 18.98 |
| 2012-03-05 06:00:00 | 18.98 |
| 2012-03-05 07:00:00 | 18.98 |
| 2012-03-05 08:00:00 | 18.72 |
| 2012-03-05 09:00:00 | 18.98 |
| 2012-03-05 10:00:00 | 19.24 |
| 2012-03-05 11:00:00 | 18.72 |
| 2012-03-05 12:00:00 | 18.72 |
| 2012-03-05 13:00:00 | 18.72 |
| 2012-03-05 14:00:00 | 18.46 |
| 2012-03-05 15:00:00 | 18.72 |
| 2012-03-05 16:00:00 | 18.46 |
| 2012-03-05 17:00:00 | 18.72 |
| 2012-03-05 18:00:00 | 18.98 |
| 2012-03-05 19:00:00 | 19.24 |
| 2012-03-05 20:00:00 | 19.24 |
| 2012-03-05 21:00:00 | 19.24 |
| 2012-03-05 22:00:00 | 19.5 |
| 2012-03-05 23:00:00 | 19.24 |
| 2012-03-06 | 19.24 |
| 2012-03-06 01:00:00 | 19.5 |
| 2012-03-06 02:00:00 | 19.5 |
| 2012-03-06 03:00:00 | 19.5 |
| 2012-03-06 04:00:00 | 19.5 |
| 2012-03-06 05:00:00 | 19.5 |
| 2012-03-06 06:00:00 | 19.24 |
| 2012-03-06 07:00:00 | 19.5 |
| 2012-03-06 08:00:00 | 19.5 |
| 2012-03-06 09:00:00 | 19.24 |
| 2012-03-06 10:00:00 | 20.54 |
| 2012-03-06 11:00:00 | 21.32 |
| 2012-03-06 12:00:00 | 20.8 |
| 2012-03-06 13:00:00 | 19.5 |
| 2012-03-06 14:00:00 | 19.5 |
| 2012-03-06 15:00:00 | 19.24 |
| 2012-03-06 16:00:00 | 19.24 |
| 2012-03-06 17:00:00 | 19.5 |
| 2012-03-06 18:00:00 | 19.5 |
| 2012-03-06 19:00:00 | 19.76 |
| 2012-03-06 20:00:00 | 19.76 |
| 2012-03-06 21:00:00 | 19.76 |
| 2012-03-06 22:00:00 | 19.76 |
| 2012-03-06 23:00:00 | 19.76 |
| 2012-03-07 | 19.76 |
| 2012-03-07 01:00:00 | 20.02 |
| 2012-03-07 02:00:00 | 20.02 |
| 2012-03-07 03:00:00 | 20.02 |
| 2012-03-07 04:00:00 | 19.76 |
| 2012-03-07 05:00:00 | 20.02 |
| 2012-03-07 06:00:00 | 20.02 |
| 2012-03-07 07:00:00 | 19.76 |
| 2012-03-07 08:00:00 | 19.76 |
| 2012-03-07 09:00:00 | 19.76 |
| 2012-03-07 10:00:00 | 19.5 |
| 2012-03-07 11:00:00 | 19.24 |
| 2012-03-07 12:00:00 | 19.5 |
| 2012-03-07 13:00:00 | 19.24 |
| 2012-03-07 14:00:00 | 19.24 |
| 2012-03-07 15:00:00 | 19.24 |
| 2012-03-07 16:00:00 | 19.24 |
| 2012-03-07 17:00:00 | 18.98 |
| 2012-03-07 18:00:00 | 18.98 |
| 2012-03-07 19:00:00 | 19.24 |
| 2012-03-07 20:00:00 | 19.5 |
| 2012-03-07 21:00:00 | 19.5 |
| 2012-03-07 22:00:00 | 19.5 |
| 2012-03-07 23:00:00 | 19.5 |
| 2012-03-08 | 19.5 |
| 2012-03-08 01:00:00 | 19.5 |
| 2012-03-08 02:00:00 | 19.76 |
| 2012-03-08 03:00:00 | 19.24 |
| 2012-03-08 04:00:00 | 19.76 |
| 2012-03-08 05:00:00 | 19.5 |
| 2012-03-08 06:00:00 | 19.5 |
| 2012-03-08 07:00:00 | 19.5 |
| 2012-03-08 08:00:00 | 19.24 |
| 2012-03-08 09:00:00 | 18.98 |
| 2012-03-08 10:00:00 | 19.76 |
| 2012-03-08 11:00:00 | 19.5 |
| 2012-03-08 12:00:00 | 19.24 |
| 2012-03-08 13:00:00 | 19.5 |
| 2012-03-08 14:00:00 | 19.24 |
| 2012-03-08 15:00:00 | 18.98 |
| 2012-03-08 16:00:00 | 19.24 |
| 2012-03-08 17:00:00 | 19.24 |
| 2012-03-08 18:00:00 | 19.24 |
| 2012-03-08 19:00:00 | 19.24 |
| 2012-03-08 20:00:00 | 19.5 |
| 2012-03-08 21:00:00 | 19.24 |
| 2012-03-08 22:00:00 | 19.24 |
| 2012-03-08 23:00:00 | 19.5 |
| 2012-03-09 | 19.24 |
| 2012-03-09 01:00:00 | 19.76 |
| 2012-03-09 02:00:00 | 19.5 |
| 2012-03-09 03:00:00 | 19.24 |
| 2012-03-09 04:00:00 | 19.5 |
| 2012-03-09 05:00:00 | 19.24 |
| 2012-03-09 06:00:00 | 19.24 |
| 2012-03-09 07:00:00 | 19.24 |
| 2012-03-09 08:00:00 | 19.5 |
| 2012-03-09 09:00:00 | 18.98 |
| 2012-03-09 10:00:00 | 19.24 |
| 2012-03-09 11:00:00 | 18.98 |
| 2012-03-09 12:00:00 | 18.98 |
| 2012-03-09 13:00:00 | 19.24 |
| 2012-03-09 14:00:00 | 19.76 |
| 2012-03-09 15:00:00 | 19.5 |
| 2012-03-09 16:00:00 | 19.24 |
| 2012-03-09 17:00:00 | 19.24 |
| 2012-03-09 18:00:00 | 18.98 |
| 2012-03-09 19:00:00 | 19.76 |
| 2012-03-09 20:00:00 | 19.5 |
| 2012-03-09 21:00:00 | 19.5 |
| 2012-03-09 22:00:00 | 19.5 |
| 2012-03-09 23:00:00 | 19.24 |
| 2012-03-10 | 19.5 |
| 2012-03-10 01:00:00 | 19.76 |
| 2012-03-10 02:00:00 | 19.76 |
| 2012-03-10 03:00:00 | 19.5 |
| 2012-03-10 04:00:00 | 19.5 |
| 2012-03-10 05:00:00 | 19.24 |
| 2012-03-10 06:00:00 | 19.76 |
| 2012-03-10 07:00:00 | 19.5 |
| 2012-03-10 08:00:00 | 19.5 |
| 2012-03-10 09:00:00 | 19.5 |
| 2012-03-10 10:00:00 | 19.24 |
| 2012-03-10 11:00:00 | 18.98 |
| 2012-03-10 12:00:00 | 19.24 |
| 2012-03-10 13:00:00 | 18.98 |
| 2012-03-10 14:00:00 | 19.5 |
| 2012-03-10 15:00:00 | 18.72 |
| 2012-03-10 16:00:00 | 18.98 |
| 2012-03-10 17:00:00 | 18.72 |
| 2012-03-10 18:00:00 | 18.98 |
| 2012-03-10 19:00:00 | 19.24 |
| 2012-03-10 20:00:00 | 18.98 |
| 2012-03-10 21:00:00 | 19.24 |
| 2012-03-10 22:00:00 | 18.72 |
| 2012-03-10 23:00:00 | 18.98 |
| 2012-03-11 | 18.98 |
| 2012-03-11 01:00:00 | 18.98 |
| 2012-03-11 02:00:00 | 19.24 |
| 2012-03-11 03:00:00 | 18.98 |
| 2012-03-11 04:00:00 | 18.72 |
| 2012-03-11 05:00:00 | 18.72 |
| 2012-03-11 06:00:00 | 18.46 |
| 2012-03-11 07:00:00 | 18.72 |
| 2012-03-11 08:00:00 | 18.46 |
| 2012-03-11 09:00:00 | 18.72 |
| 2012-03-11 10:00:00 | 18.2 |
| 2012-03-11 11:00:00 | 18.46 |
| 2012-03-11 12:00:00 | 17.94 |
| 2012-03-11 13:00:00 | 18.72 |
| 2012-03-11 14:00:00 | 18.2 |
| 2012-03-11 15:00:00 | 18.46 |
| 2012-03-11 16:00:00 | 17.94 |
| 2012-03-11 17:00:00 | 18.2 |
| 2012-03-11 18:00:00 | 18.2 |
| 2012-03-11 19:00:00 | 18.72 |
| 2012-03-11 20:00:00 | 18.72 |
| 2012-03-11 21:00:00 | 18.46 |
| 2012-03-11 22:00:00 | 18.46 |
| 2012-03-11 23:00:00 | 18.46 |
| 2012-03-12 | 18.46 |
| 2012-03-12 01:00:00 | 18.98 |
| 2012-03-12 02:00:00 | 18.46 |
| 2012-03-12 03:00:00 | 18.46 |
| 2012-03-12 04:00:00 | 18.46 |
| 2012-03-12 05:00:00 | 18.46 |
| 2012-03-12 06:00:00 | 18.46 |
| 2012-03-12 07:00:00 | 18.46 |
| 2012-03-12 08:00:00 | 18.46 |
| 2012-03-12 09:00:00 | 18.2 |
| 2012-03-12 10:00:00 | 18.2 |
| 2012-03-12 11:00:00 | 18.2 |
| 2012-03-12 12:00:00 | 17.94 |
| 2012-03-12 13:00:00 | 18.46 |
| 2012-03-12 14:00:00 | 18.46 |
| 2012-03-12 15:00:00 | 18.2 |
| 2012-03-12 16:00:00 | 18.2 |
| 2012-03-12 17:00:00 | 17.94 |
| 2012-03-12 18:00:00 | 18.46 |
| 2012-03-12 19:00:00 | 18.46 |
| 2012-03-12 20:00:00 | 18.46 |
| 2012-03-12 21:00:00 | 18.46 |
| 2012-03-12 22:00:00 | 18.46 |
| 2012-03-12 23:00:00 | 18.2 |
| 2012-03-13 | 18.46 |
| 2012-03-13 01:00:00 | 18.46 |
| 2012-03-13 02:00:00 | 18.46 |
| 2012-03-13 03:00:00 | 18.46 |
| 2012-03-13 04:00:00 | 18.2 |
| 2012-03-13 05:00:00 | 18.2 |
| 2012-03-13 06:00:00 | 18.2 |
| 2012-03-13 07:00:00 | 18.2 |
| 2012-03-13 08:00:00 | 18.46 |
| 2012-03-13 09:00:00 | 18.2 |
| 2012-03-13 10:00:00 | 17.94 |
| 2012-03-13 11:00:00 | 17.94 |
| 2012-03-13 12:00:00 | 17.94 |
| 2012-03-13 13:00:00 | 18.2 |
| 2012-03-13 14:00:00 | 18.2 |
| 2012-03-13 15:00:00 | 17.68 |
| 2012-03-13 16:00:00 | 17.94 |
| 2012-03-13 17:00:00 | 17.94 |
| 2012-03-13 18:00:00 | 17.94 |
| 2012-03-13 19:00:00 | 18.2 |
| 2012-03-13 20:00:00 | 18.2 |
| 2012-03-13 21:00:00 | 17.94 |
| 2012-03-13 22:00:00 | 18.2 |
| 2012-03-13 23:00:00 | 17.94 |
| 2012-03-14 | 18.2 |
| 2012-03-14 01:00:00 | 18.2 |
| 2012-03-14 02:00:00 | 18.2 |
| 2012-03-14 03:00:00 | 18.2 |
| 2012-03-14 04:00:00 | 18.2 |
| 2012-03-14 05:00:00 | 17.94 |
| 2012-03-14 06:00:00 | 18.2 |
| 2012-03-14 07:00:00 | 18.2 |
| 2012-03-14 08:00:00 | 17.94 |
| 2012-03-14 09:00:00 | 17.68 |
| 2012-03-14 10:00:00 | 18.2 |
| 2012-03-14 11:00:00 | 18.46 |
| 2012-03-14 12:00:00 | 17.68 |
| 2012-03-14 13:00:00 | 18.2 |
| 2012-03-14 14:00:00 | 17.94 |
| 2012-03-14 15:00:00 | 17.94 |
| 2012-03-14 16:00:00 | 17.68 |
| 2012-03-14 17:00:00 | 17.68 |
| 2012-03-14 18:00:00 | 17.94 |
| 2012-03-14 19:00:00 | 18.2 |
| 2012-03-14 20:00:00 | 18.2 |
| 2012-03-14 21:00:00 | 17.94 |
| 2012-03-14 22:00:00 | 17.94 |
| 2012-03-14 23:00:00 | 18.2 |
| 2012-03-15 | 18.2 |
| 2012-03-15 01:00:00 | 18.2 |
| 2012-03-15 02:00:00 | 18.2 |
| 2012-03-15 03:00:00 | 18.2 |
| 2012-03-15 04:00:00 | 18.2 |
| 2012-03-15 05:00:00 | 18.2 |
| 2012-03-15 06:00:00 | 18.2 |
| 2012-03-15 07:00:00 | 18.2 |
| 2012-03-15 08:00:00 | 18.2 |
| 2012-03-15 09:00:00 | 17.94 |
| 2012-03-15 10:00:00 | 17.94 |
| 2012-03-15 11:00:00 | 17.94 |
| 2012-03-15 12:00:00 | 17.68 |
| 2012-03-15 13:00:00 | 17.94 |
| 2012-03-15 14:00:00 | 17.94 |
| 2012-03-15 15:00:00 | 17.68 |
| 2012-03-15 16:00:00 | 17.94 |
| 2012-03-15 17:00:00 | 17.68 |
| 2012-03-15 18:00:00 | 17.68 |
| 2012-03-15 19:00:00 | 17.94 |
| 2012-03-15 20:00:00 | 18.46 |
| 2012-03-15 21:00:00 | 17.94 |
| 2012-03-15 22:00:00 | 18.2 |
| 2012-03-15 23:00:00 | 18.46 |
| 2012-03-16 | 18.2 |
| 2012-03-16 01:00:00 | 18.72 |
| 2012-03-16 02:00:00 | 18.46 |
| 2012-03-16 03:00:00 | 18.46 |
| 2012-03-16 04:00:00 | 18.2 |
| 2012-03-16 05:00:00 | 18.46 |
| 2012-03-16 06:00:00 | 18.46 |
| 2012-03-16 07:00:00 | 18.2 |
| 2012-03-16 08:00:00 | 18.46 |
| 2012-03-16 09:00:00 | 18.2 |
| 2012-03-16 10:00:00 | 17.94 |
| 2012-03-16 11:00:00 | 17.94 |
| 2012-03-16 12:00:00 | 18.2 |
| 2012-03-16 13:00:00 | 17.94 |
| 2012-03-16 14:00:00 | 17.68 |
| 2012-03-16 15:00:00 | 17.42 |
| 2012-03-16 16:00:00 | 17.42 |
| 2012-03-16 17:00:00 | 17.68 |
| 2012-03-16 18:00:00 | 17.68 |
| 2012-03-16 19:00:00 | 17.94 |
| 2012-03-16 20:00:00 | 17.94 |
| 2012-03-16 21:00:00 | 17.94 |
| 2012-03-16 22:00:00 | 17.68 |
| 2012-03-16 23:00:00 | 17.94 |
| 2012-03-17 | 17.94 |
| 2012-03-17 01:00:00 | 17.68 |
| 2012-03-17 02:00:00 | 18.2 |
| 2012-03-17 03:00:00 | 17.94 |
| 2012-03-17 04:00:00 | 17.94 |
| 2012-03-17 05:00:00 | 18.2 |
| 2012-03-17 06:00:00 | 17.94 |
| 2012-03-17 07:00:00 | 17.94 |
| 2012-03-17 08:00:00 | 17.94 |
| 2012-03-17 09:00:00 | 17.42 |
| 2012-03-17 10:00:00 | 17.16 |
| 2012-03-17 11:00:00 | 17.16 |
| 2012-03-17 12:00:00 | 17.16 |
| 2012-03-17 13:00:00 | 17.16 |
| 2012-03-17 14:00:00 | 16.64 |
| 2012-03-17 15:00:00 | 16.9 |
| 2012-03-17 16:00:00 | 16.64 |
| 2012-03-17 17:00:00 | 16.38 |
| 2012-03-17 18:00:00 | 16.38 |
| 2012-03-17 19:00:00 | 16.9 |
| 2012-03-17 20:00:00 | 16.9 |
| 2012-03-17 21:00:00 | 16.9 |
| 2012-03-17 22:00:00 | 16.64 |
| 2012-03-17 23:00:00 | 16.9 |
| 2012-03-18 | 16.9 |
| 2012-03-18 01:00:00 | 17.16 |
| 2012-03-18 02:00:00 | 17.42 |
| 2012-03-18 03:00:00 | 16.9 |
| 2012-03-18 04:00:00 | 17.16 |
| 2012-03-18 05:00:00 | 17.16 |
| 2012-03-18 06:00:00 | 17.16 |
| 2012-03-18 07:00:00 | 17.16 |
| 2012-03-18 08:00:00 | 17.16 |
| 2012-03-18 09:00:00 | 16.9 |
| 2012-03-18 10:00:00 | 16.9 |
| 2012-03-18 11:00:00 | 16.38 |
| 2012-03-18 12:00:00 | 16.9 |
| 2012-03-18 13:00:00 | 16.38 |
| 2012-03-18 14:00:00 | 16.12 |
| 2012-03-18 15:00:00 | 16.38 |
| 2012-03-18 16:00:00 | 16.12 |
| 2012-03-18 17:00:00 | 15.86 |
| 2012-03-18 18:00:00 | 16.12 |
| 2012-03-18 19:00:00 | 13.52 |
| 2012-03-18 20:00:00 | 0 |
| 2012-03-18 21:00:00 | 6.5 |
| 2012-03-18 22:00:00 | 19.24 |
| 2012-03-18 23:00:00 | 17.94 |
| 2012-03-19 | 17.68 |
| 2012-03-19 01:00:00 | 17.16 |
| 2012-03-19 02:00:00 | 16.64 |
| 2012-03-19 03:00:00 | 16.9 |
| 2012-03-19 04:00:00 | 16.64 |
| 2012-03-19 05:00:00 | 16.64 |
| 2012-03-19 06:00:00 | 16.64 |
| 2012-03-19 07:00:00 | 16.64 |
| 2012-03-19 08:00:00 | 16.64 |
| 2012-03-19 09:00:00 | 16.38 |
| 2012-03-19 10:00:00 | 17.94 |
| 2012-03-19 11:00:00 | 16.38 |
| 2012-03-19 12:00:00 | 16.9 |
| 2012-03-19 13:00:00 | 16.64 |
| 2012-03-19 14:00:00 | 16.9 |
| 2012-03-19 15:00:00 | 16.64 |
| 2012-03-19 16:00:00 | 16.64 |
| 2012-03-19 17:00:00 | 16.38 |
| 2012-03-19 18:00:00 | 16.64 |
| 2012-03-19 19:00:00 | 16.9 |
| 2012-03-19 20:00:00 | 17.42 |
| 2012-03-19 21:00:00 | 17.16 |
| 2012-03-19 22:00:00 | 17.16 |
| 2012-03-19 23:00:00 | 17.42 |
| 2012-03-20 | 17.42 |
| 2012-03-20 01:00:00 | 17.94 |
| 2012-03-20 02:00:00 | 17.94 |
| 2012-03-20 03:00:00 | 17.42 |
| 2012-03-20 04:00:00 | 18.2 |
| 2012-03-20 05:00:00 | 18.2 |
| 2012-03-20 06:00:00 | 17.94 |
| 2012-03-20 07:00:00 | 17.94 |
| 2012-03-20 08:00:00 | 18.2 |
| 2012-03-20 09:00:00 | 17.94 |
| 2012-03-20 10:00:00 | 18.2 |
| 2012-03-20 11:00:00 | 17.42 |
| 2012-03-20 12:00:00 | 17.42 |
| 2012-03-20 13:00:00 | 17.42 |
| 2012-03-20 14:00:00 | 17.42 |
| 2012-03-20 15:00:00 | 17.16 |
| 2012-03-20 16:00:00 | 16.9 |
| 2012-03-20 17:00:00 | 17.16 |
| 2012-03-20 18:00:00 | 17.16 |
| 2012-03-20 19:00:00 | 17.42 |
| 2012-03-20 20:00:00 | 17.42 |
| 2012-03-20 21:00:00 | 17.16 |
| 2012-03-20 22:00:00 | 17.68 |
| 2012-03-20 23:00:00 | 17.42 |
| 2012-03-21 | 17.68 |
| 2012-03-21 01:00:00 | 17.68 |
| 2012-03-21 02:00:00 | 17.94 |
| 2012-03-21 03:00:00 | 17.94 |
| 2012-03-21 04:00:00 | 17.94 |
| 2012-03-21 05:00:00 | 18.2 |
| 2012-03-21 06:00:00 | 17.94 |
| 2012-03-21 07:00:00 | 17.68 |
| 2012-03-21 08:00:00 | 18.2 |
| 2012-03-21 09:00:00 | 17.68 |
| 2012-03-21 10:00:00 | 17.42 |
| 2012-03-21 11:00:00 | 17.42 |
| 2012-03-21 12:00:00 | 16.9 |
| 2012-03-21 13:00:00 | 17.42 |
| 2012-03-21 14:00:00 | 17.16 |
| 2012-03-21 15:00:00 | 16.9 |
| 2012-03-21 16:00:00 | 16.9 |
| 2012-03-21 17:00:00 | 16.64 |
| 2012-03-21 18:00:00 | 16.64 |
| 2012-03-21 19:00:00 | 17.42 |
| 2012-03-21 20:00:00 | 17.16 |
| 2012-03-21 21:00:00 | 17.42 |
| 2012-03-21 22:00:00 | 17.16 |
| 2012-03-21 23:00:00 | 16.9 |
| 2012-03-22 | 17.42 |
| 2012-03-22 01:00:00 | 17.68 |
| 2012-03-22 02:00:00 | 17.16 |
| 2012-03-22 03:00:00 | 17.42 |
| 2012-03-22 04:00:00 | 17.16 |
| 2012-03-22 05:00:00 | 16.9 |
| 2012-03-22 06:00:00 | 17.42 |
| 2012-03-22 07:00:00 | 17.42 |
| 2012-03-22 08:00:00 | 16.9 |
| 2012-03-22 09:00:00 | 16.9 |
| 2012-03-22 10:00:00 | 16.9 |
| 2012-03-22 11:00:00 | 16.9 |
| 2012-03-22 12:00:00 | 16.64 |
| 2012-03-22 13:00:00 | 16.9 |
| 2012-03-22 14:00:00 | 16.64 |
| 2012-03-22 15:00:00 | 16.64 |
| 2012-03-22 16:00:00 | 16.38 |
| 2012-03-22 17:00:00 | 16.38 |
| 2012-03-22 18:00:00 | 16.38 |
| 2012-03-22 19:00:00 | 16.64 |
| 2012-03-22 20:00:00 | 16.9 |
| 2012-03-22 21:00:00 | 16.9 |
| 2012-03-22 22:00:00 | 16.64 |
| 2012-03-22 23:00:00 | 17.16 |
| 2012-03-23 | 16.64 |
| 2012-03-23 01:00:00 | 17.16 |
| 2012-03-23 02:00:00 | 17.42 |
| 2012-03-23 03:00:00 | 17.16 |
| 2012-03-23 04:00:00 | 16.9 |
| 2012-03-23 05:00:00 | 17.16 |
| 2012-03-23 06:00:00 | 17.16 |
| 2012-03-23 07:00:00 | 16.9 |
| 2012-03-23 08:00:00 | 17.42 |
| 2012-03-23 09:00:00 | 16.9 |
| 2012-03-23 10:00:00 | 16.9 |
| 2012-03-23 11:00:00 | 16.64 |
| 2012-03-23 12:00:00 | 16.38 |
| 2012-03-23 13:00:00 | 17.16 |
| 2012-03-23 14:00:00 | 16.64 |
| 2012-03-23 15:00:00 | 16.12 |
| 2012-03-23 16:00:00 | 16.12 |
| 2012-03-23 17:00:00 | 15.86 |
| 2012-03-23 18:00:00 | 16.12 |
| 2012-03-23 19:00:00 | 16.64 |
| 2012-03-23 20:00:00 | 16.64 |
| 2012-03-23 21:00:00 | 16.64 |
| 2012-03-23 22:00:00 | 16.38 |
| 2012-03-23 23:00:00 | 16.64 |
| 2012-03-24 | 16.38 |
| 2012-03-24 01:00:00 | 16.9 |
| 2012-03-24 02:00:00 | 16.9 |
| 2012-03-24 03:00:00 | 17.16 |
| 2012-03-24 04:00:00 | 16.38 |
| 2012-03-24 05:00:00 | 17.16 |
| 2012-03-24 06:00:00 | 16.64 |
| 2012-03-24 07:00:00 | 16.9 |
| 2012-03-24 08:00:00 | 16.9 |
| 2012-03-24 09:00:00 | 16.64 |
| 2012-03-24 10:00:00 | 16.38 |
| 2012-03-24 11:00:00 | 16.38 |
| 2012-03-24 12:00:00 | 16.12 |
| 2012-03-24 13:00:00 | 16.38 |
| 2012-03-24 14:00:00 | 16.12 |
| 2012-03-24 15:00:00 | 16.12 |
| 2012-03-24 16:00:00 | 16.12 |
| 2012-03-24 17:00:00 | 15.86 |
| 2012-03-24 18:00:00 | 15.86 |
| 2012-03-24 19:00:00 | 16.38 |
| 2012-03-24 20:00:00 | 16.64 |
| 2012-03-24 21:00:00 | 16.38 |
| 2012-03-24 22:00:00 | 16.12 |
| 2012-03-24 23:00:00 | 16.38 |
| 2012-03-25 | 16.64 |
| 2012-03-25 01:00:00 | 16.64 |
| 2012-03-25 03:00:00 | 17.16 |
| 2012-03-25 04:00:00 | 16.64 |
| 2012-03-25 05:00:00 | 16.64 |
| 2012-03-25 06:00:00 | 16.9 |
| 2012-03-25 07:00:00 | 17.16 |
| 2012-03-25 08:00:00 | 16.9 |
| 2012-03-25 09:00:00 | 16.64 |
| 2012-03-25 10:00:00 | 16.38 |
| 2012-03-25 11:00:00 | 16.38 |
| 2012-03-25 12:00:00 | 16.12 |
| 2012-03-25 13:00:00 | 16.64 |
| 2012-03-25 14:00:00 | 16.12 |
| 2012-03-25 15:00:00 | 16.12 |
| 2012-03-25 16:00:00 | 15.86 |
| 2012-03-25 17:00:00 | 16.12 |
| 2012-03-25 18:00:00 | 16.12 |
| 2012-03-25 19:00:00 | 16.38 |
| 2012-03-25 20:00:00 | 16.38 |
| 2012-03-25 21:00:00 | 16.12 |
| 2012-03-25 22:00:00 | 16.38 |
| 2012-03-25 23:00:00 | 16.12 |
| 2012-03-26 | 16.12 |
| 2012-03-26 01:00:00 | 16.64 |
| 2012-03-26 02:00:00 | 16.64 |
| 2012-03-26 03:00:00 | 16.38 |
| 2012-03-26 04:00:00 | 16.38 |
| 2012-03-26 05:00:00 | 16.64 |
| 2012-03-26 06:00:00 | 16.64 |
| 2012-03-26 07:00:00 | 16.64 |
| 2012-03-26 08:00:00 | 17.16 |
| 2012-03-26 09:00:00 | 16.38 |
| 2012-03-26 10:00:00 | 16.9 |
| 2012-03-26 11:00:00 | 17.94 |
| 2012-03-26 12:00:00 | 17.16 |
| 2012-03-26 13:00:00 | 16.64 |
| 2012-03-26 14:00:00 | 16.64 |
| 2012-03-26 15:00:00 | 16.38 |
| 2012-03-26 16:00:00 | 16.64 |
| 2012-03-26 17:00:00 | 16.12 |
| 2012-03-26 18:00:00 | 16.38 |
| 2012-03-26 19:00:00 | 16.38 |
| 2012-03-26 20:00:00 | 16.9 |
| 2012-03-26 21:00:00 | 16.64 |
| 2012-03-26 22:00:00 | 16.64 |
| 2012-03-26 23:00:00 | 16.9 |
| 2012-03-27 | 16.9 |
| 2012-03-27 01:00:00 | 17.42 |
| 2012-03-27 02:00:00 | 17.42 |
| 2012-03-27 03:00:00 | 17.16 |
| 2012-03-27 04:00:00 | 17.42 |
| 2012-03-27 05:00:00 | 17.68 |
| 2012-03-27 06:00:00 | 17.42 |
| 2012-03-27 07:00:00 | 17.42 |
| 2012-03-27 08:00:00 | 17.42 |
| 2012-03-27 09:00:00 | 17.16 |
| 2012-03-27 10:00:00 | 17.16 |
| 2012-03-27 11:00:00 | 16.38 |
| 2012-03-27 12:00:00 | 16.9 |
| 2012-03-27 13:00:00 | 17.16 |
| 2012-03-27 14:00:00 | 16.38 |
| 2012-03-27 15:00:00 | 16.64 |
| 2012-03-27 16:00:00 | 16.38 |
| 2012-03-27 17:00:00 | 16.38 |
| 2012-03-27 18:00:00 | 16.38 |
| 2012-03-27 19:00:00 | 16.38 |
| 2012-03-27 20:00:00 | 16.9 |
| 2012-03-27 21:00:00 | 16.64 |
| 2012-03-27 22:00:00 | 16.38 |
| 2012-03-27 23:00:00 | 16.64 |
| 2012-03-28 | 16.64 |
| 2012-03-28 01:00:00 | 17.16 |
| 2012-03-28 02:00:00 | 17.16 |
| 2012-03-28 03:00:00 | 16.64 |
| 2012-03-28 04:00:00 | 16.9 |
| 2012-03-28 05:00:00 | 16.64 |
| 2012-03-28 06:00:00 | 16.9 |
| 2012-03-28 07:00:00 | 16.64 |
| 2012-03-28 08:00:00 | 16.9 |
| 2012-03-28 09:00:00 | 16.64 |
| 2012-03-28 10:00:00 | 16.12 |
| 2012-03-28 11:00:00 | 16.9 |
| 2012-03-28 12:00:00 | 16.12 |
| 2012-03-28 13:00:00 | 16.64 |
| 2012-03-28 14:00:00 | 16.12 |
| 2012-03-28 15:00:00 | 15.86 |
| 2012-03-28 16:00:00 | 16.12 |
| 2012-03-28 17:00:00 | 15.6 |
| 2012-03-28 18:00:00 | 15.86 |
| 2012-03-28 19:00:00 | 15.86 |
| 2012-03-28 20:00:00 | 15.6 |
| 2012-03-28 21:00:00 | 16.12 |
| 2012-03-28 22:00:00 | 15.6 |
| 2012-03-28 23:00:00 | 16.12 |
| 2012-03-29 | 15.86 |
| 2012-03-29 01:00:00 | 16.12 |
| 2012-03-29 02:00:00 | 16.12 |
| 2012-03-29 03:00:00 | 15.86 |
| 2012-03-29 04:00:00 | 16.12 |
| 2012-03-29 05:00:00 | 15.86 |
| 2012-03-29 06:00:00 | 15.86 |
| 2012-03-29 07:00:00 | 16.12 |
| 2012-03-29 08:00:00 | 15.86 |
| 2012-03-29 09:00:00 | 15.34 |
| 2012-03-29 10:00:00 | 15.86 |
| 2012-03-29 11:00:00 | 15.6 |
| 2012-03-29 12:00:00 | 15.6 |
| 2012-03-29 13:00:00 | 16.12 |
| 2012-03-29 14:00:00 | 15.6 |
| 2012-03-29 15:00:00 | 15.6 |
| 2012-03-29 16:00:00 | 15.86 |
| 2012-03-29 17:00:00 | 15.6 |
| 2012-03-29 18:00:00 | 15.6 |
| 2012-03-29 19:00:00 | 15.86 |
| 2012-03-29 20:00:00 | 15.86 |
| 2012-03-29 21:00:00 | 16.12 |
| 2012-03-29 22:00:00 | 16.12 |
| 2012-03-29 23:00:00 | 15.6 |
| 2012-03-30 | 16.12 |
| 2012-03-30 01:00:00 | 16.12 |
| 2012-03-30 02:00:00 | 16.38 |
| 2012-03-30 03:00:00 | 16.12 |
| 2012-03-30 04:00:00 | 16.12 |
| 2012-03-30 05:00:00 | 16.38 |
| 2012-03-30 06:00:00 | 16.38 |
| 2012-03-30 07:00:00 | 16.38 |
| 2012-03-30 08:00:00 | 16.38 |
| 2012-03-30 09:00:00 | 16.12 |
| 2012-03-30 10:00:00 | 16.12 |
| 2012-03-30 11:00:00 | 16.12 |
| 2012-03-30 12:00:00 | 16.12 |
| 2012-03-30 13:00:00 | 16.38 |
| 2012-03-30 14:00:00 | 16.38 |
| 2012-03-30 15:00:00 | 15.86 |
| 2012-03-30 16:00:00 | 16.12 |
| 2012-03-30 17:00:00 | 15.86 |
| 2012-03-30 18:00:00 | 16.12 |
| 2012-03-30 19:00:00 | 15.86 |
| 2012-03-30 20:00:00 | 16.64 |
| 2012-03-30 21:00:00 | 16.38 |
| 2012-03-30 22:00:00 | 16.38 |
| 2012-03-30 23:00:00 | 16.38 |
| 2012-03-31 | 16.38 |
| 2012-03-31 01:00:00 | 16.38 |
| 2012-03-31 02:00:00 | 16.9 |
| 2012-03-31 03:00:00 | 16.64 |
| 2012-03-31 04:00:00 | 16.12 |
| 2012-03-31 05:00:00 | 16.64 |
| 2012-03-31 06:00:00 | 16.38 |
| 2012-03-31 07:00:00 | 16.64 |
| 2012-03-31 08:00:00 | 16.12 |
| 2012-03-31 09:00:00 | 16.38 |
| 2012-03-31 10:00:00 | 16.38 |
| 2012-03-31 11:00:00 | 16.12 |
| 2012-03-31 12:00:00 | 16.12 |
| 2012-03-31 13:00:00 | 17.42 |
| 2012-03-31 14:00:00 | 15.6 |
| 2012-03-31 15:00:00 | 16.12 |
| 2012-03-31 16:00:00 | 15.86 |
| 2012-03-31 17:00:00 | 15.6 |
| 2012-03-31 18:00:00 | 16.12 |
| 2012-03-31 19:00:00 | 16.12 |
| 2012-03-31 20:00:00 | 16.64 |
| 2012-03-31 21:00:00 | 16.38 |
| 2012-03-31 22:00:00 | 16.9 |
| 2012-03-31 23:00:00 | 16.38 |
| 2012-04-01 | 16.9 |
| 2012-04-01 01:00:00 | 16.9 |
| 2012-04-01 02:00:00 | 16.9 |
| 2012-04-01 03:00:00 | 17.16 |
| 2012-04-01 04:00:00 | 16.64 |
| 2012-04-01 05:00:00 | 17.16 |
| 2012-04-01 06:00:00 | 17.16 |
| 2012-04-01 07:00:00 | 17.42 |
| 2012-04-01 08:00:00 | 17.16 |
| 2012-04-01 09:00:00 | 17.68 |
| 2012-04-01 10:00:00 | 16.9 |
| 2012-04-01 11:00:00 | 16.64 |
| 2012-04-01 12:00:00 | 15.6 |
| 2012-04-01 13:00:00 | 15.6 |
| 2012-04-01 14:00:00 | 15.6 |
| 2012-04-01 15:00:00 | 15.6 |
| 2012-04-01 16:00:00 | 15.34 |
| 2012-04-01 17:00:00 | 15.34 |
| 2012-04-01 18:00:00 | 15.08 |
| 2012-04-01 19:00:00 | 15.34 |
| 2012-04-01 20:00:00 | 15.6 |
| 2012-04-01 21:00:00 | 15.6 |
| 2012-04-01 22:00:00 | 15.6 |
| 2012-04-01 23:00:00 | 15.6 |
| 2012-04-02 | 15.34 |
| 2012-04-02 01:00:00 | 15.86 |
| 2012-04-02 02:00:00 | 16.12 |
| 2012-04-02 03:00:00 | 15.6 |
| 2012-04-02 04:00:00 | 15.6 |
| 2012-04-02 05:00:00 | 15.6 |
| 2012-04-02 06:00:00 | 15.6 |
| 2012-04-02 07:00:00 | 15.86 |
| 2012-04-02 08:00:00 | 15.08 |
| 2012-04-02 09:00:00 | 15.6 |
| 2012-04-02 10:00:00 | 15.86 |
| 2012-04-02 11:00:00 | 15.34 |
| 2012-04-02 12:00:00 | 15.34 |
| 2012-04-02 13:00:00 | 15.86 |
| 2012-04-02 14:00:00 | 15.6 |
| 2012-04-02 15:00:00 | 15.34 |
| 2012-04-02 16:00:00 | 14.82 |
| 2012-04-02 17:00:00 | 15.34 |
| 2012-04-02 18:00:00 | 14.82 |
| 2012-04-02 19:00:00 | 15.34 |
| 2012-04-02 20:00:00 | 15.34 |
| 2012-04-02 21:00:00 | 15.34 |
| 2012-04-02 22:00:00 | 15.08 |
| 2012-04-02 23:00:00 | 15.34 |
| 2012-04-03 | 15.08 |
| 2012-04-03 01:00:00 | 15.6 |
| 2012-04-03 02:00:00 | 15.86 |
| 2012-04-03 03:00:00 | 15.34 |
| 2012-04-03 04:00:00 | 15.34 |
| 2012-04-03 05:00:00 | 15.34 |
| 2012-04-03 06:00:00 | 15.34 |
| 2012-04-03 07:00:00 | 15.6 |
| 2012-04-03 08:00:00 | 15.08 |
| 2012-04-03 09:00:00 | 15.08 |
| 2012-04-03 10:00:00 | 15.08 |
| 2012-04-03 11:00:00 | 15.08 |
| 2012-04-03 12:00:00 | 15.08 |
| 2012-04-03 13:00:00 | 15.08 |
| 2012-04-03 14:00:00 | 15.08 |
| 2012-04-03 15:00:00 | 14.82 |
| 2012-04-03 16:00:00 | 14.3 |
| 2012-04-03 17:00:00 | 14.56 |
| 2012-04-03 18:00:00 | 14.56 |
| 2012-04-03 19:00:00 | 14.82 |
| 2012-04-03 20:00:00 | 14.3 |
| 2012-04-03 21:00:00 | 14.3 |
| 2012-04-03 22:00:00 | 14.56 |
| 2012-04-03 23:00:00 | 14.56 |
| 2012-04-04 | 14.3 |
| 2012-04-04 01:00:00 | 14.82 |
| 2012-04-04 02:00:00 | 14.82 |
| 2012-04-04 03:00:00 | 14.56 |
| 2012-04-04 04:00:00 | 14.3 |
| 2012-04-04 05:00:00 | 14.56 |
| 2012-04-04 06:00:00 | 14.56 |
| 2012-04-04 07:00:00 | 14.56 |
| 2012-04-04 08:00:00 | 14.3 |
| 2012-04-04 09:00:00 | 14.3 |
| 2012-04-04 10:00:00 | 14.3 |
| 2012-04-04 11:00:00 | 14.04 |
| 2012-04-04 12:00:00 | 14.04 |
| 2012-04-04 13:00:00 | 14.3 |
| 2012-04-04 14:00:00 | 13.78 |
| 2012-04-04 15:00:00 | 13.78 |
| 2012-04-04 16:00:00 | 13.78 |
| 2012-04-04 17:00:00 | 13.52 |
| 2012-04-04 18:00:00 | 13.78 |
| 2012-04-04 19:00:00 | 13.78 |
| 2012-04-04 20:00:00 | 14.04 |
| 2012-04-04 21:00:00 | 13.78 |
| 2012-04-04 22:00:00 | 14.04 |
| 2012-04-04 23:00:00 | 13.78 |
| 2012-04-05 | 13.78 |
| 2012-04-05 01:00:00 | 14.3 |
| 2012-04-05 02:00:00 | 14.3 |
| 2012-04-05 03:00:00 | 14.04 |
| 2012-04-05 04:00:00 | 13.78 |
| 2012-04-05 05:00:00 | 13.78 |
| 2012-04-05 06:00:00 | 13.78 |
| 2012-04-05 07:00:00 | 14.04 |
| 2012-04-05 08:00:00 | 13.78 |
| 2012-04-05 09:00:00 | 13.52 |
| 2012-04-05 10:00:00 | 13.78 |
| 2012-04-05 11:00:00 | 13.78 |
| 2012-04-05 12:00:00 | 13.78 |
| 2012-04-05 13:00:00 | 14.3 |
| 2012-04-05 14:00:00 | 13.78 |
| 2012-04-05 15:00:00 | 13.78 |
| 2012-04-05 16:00:00 | 13.78 |
| 2012-04-05 17:00:00 | 13.78 |
| 2012-04-05 18:00:00 | 13.78 |
| 2012-04-05 19:00:00 | 14.3 |
| 2012-04-05 20:00:00 | 14.3 |
| 2012-04-05 21:00:00 | 14.04 |
| 2012-04-05 22:00:00 | 14.04 |
| 2012-04-05 23:00:00 | 14.04 |
| 2012-04-06 | 14.3 |
| 2012-04-06 01:00:00 | 14.3 |
| 2012-04-06 02:00:00 | 14.04 |
| 2012-04-06 03:00:00 | 14.3 |
| 2012-04-06 04:00:00 | 14.04 |
| 2012-04-06 05:00:00 | 14.3 |
| 2012-04-06 06:00:00 | 14.3 |
| 2012-04-06 07:00:00 | 14.56 |
| 2012-04-06 08:00:00 | 14.3 |
| 2012-04-06 09:00:00 | 13.78 |
| 2012-04-06 10:00:00 | 14.3 |
| 2012-04-06 11:00:00 | 14.04 |
| 2012-04-06 12:00:00 | 14.04 |
| 2012-04-06 13:00:00 | 14.56 |
| 2012-04-06 14:00:00 | 14.56 |
| 2012-04-06 15:00:00 | 13.78 |
| 2012-04-06 16:00:00 | 14.3 |
| 2012-04-06 17:00:00 | 14.04 |
| 2012-04-06 18:00:00 | 14.56 |
| 2012-04-06 19:00:00 | 14.3 |
| 2012-04-06 20:00:00 | 14.3 |
| 2012-04-06 21:00:00 | 14.3 |
| 2012-04-06 22:00:00 | 14.3 |
| 2012-04-06 23:00:00 | 14.3 |
| 2012-04-07 | 14.3 |
| 2012-04-07 01:00:00 | 14.82 |
| 2012-04-07 02:00:00 | 14.82 |
| 2012-04-07 03:00:00 | 14.56 |
| 2012-04-07 04:00:00 | 14.04 |
| 2012-04-07 05:00:00 | 14.56 |
| 2012-04-07 06:00:00 | 14.3 |
| 2012-04-07 07:00:00 | 14.82 |
| 2012-04-07 08:00:00 | 14.56 |
| 2012-04-07 09:00:00 | 14.3 |
| 2012-04-07 10:00:00 | 14.04 |
| 2012-04-07 11:00:00 | 14.04 |
| 2012-04-07 12:00:00 | 14.82 |
| 2012-04-07 13:00:00 | 14.56 |
| 2012-04-07 14:00:00 | 14.56 |
| 2012-04-07 15:00:00 | 14.3 |
| 2012-04-07 16:00:00 | 14.04 |
| 2012-04-07 17:00:00 | 14.04 |
| 2012-04-07 18:00:00 | 13.78 |
| 2012-04-07 19:00:00 | 14.56 |
| 2012-04-07 20:00:00 | 14.04 |
| 2012-04-07 21:00:00 | 14.3 |
| 2012-04-07 22:00:00 | 14.04 |
| 2012-04-07 23:00:00 | 14.56 |
| 2012-04-08 | 14.3 |
| 2012-04-08 01:00:00 | 14.56 |
| 2012-04-08 02:00:00 | 14.56 |
| 2012-04-08 03:00:00 | 14.56 |
| 2012-04-08 04:00:00 | 14.56 |
| 2012-04-08 05:00:00 | 14.3 |
| 2012-04-08 06:00:00 | 14.56 |
| 2012-04-08 07:00:00 | 14.82 |
| 2012-04-08 08:00:00 | 14.56 |
| 2012-04-08 09:00:00 | 14.56 |
| 2012-04-08 10:00:00 | 14.82 |
| 2012-04-08 11:00:00 | 14.3 |
| 2012-04-08 12:00:00 | 14.56 |
| 2012-04-08 13:00:00 | 14.82 |
| 2012-04-08 14:00:00 | 14.56 |
| 2012-04-08 15:00:00 | 14.56 |
| 2012-04-08 16:00:00 | 14.56 |
| 2012-04-08 17:00:00 | 14.82 |
| 2012-04-08 18:00:00 | 14.82 |
| 2012-04-08 19:00:00 | 15.08 |
| 2012-04-08 20:00:00 | 15.08 |
| 2012-04-08 21:00:00 | 15.08 |
| 2012-04-08 22:00:00 | 15.08 |
| 2012-04-08 23:00:00 | 15.08 |
| 2012-04-09 | 15.34 |
| 2012-04-09 01:00:00 | 15.6 |
| 2012-04-09 02:00:00 | 15.86 |
| 2012-04-09 03:00:00 | 15.6 |
| 2012-04-09 04:00:00 | 15.6 |
| 2012-04-09 05:00:00 | 15.86 |
| 2012-04-09 06:00:00 | 15.6 |
| 2012-04-09 07:00:00 | 15.86 |
| 2012-04-09 08:00:00 | 15.6 |
| 2012-04-09 09:00:00 | 15.6 |
| 2012-04-09 10:00:00 | 15.6 |
| 2012-04-09 11:00:00 | 15.08 |
| 2012-04-09 12:00:00 | 15.34 |
| 2012-04-09 13:00:00 | 15.86 |
| 2012-04-09 14:00:00 | 15.34 |
| 2012-04-09 15:00:00 | 15.34 |
| 2012-04-09 16:00:00 | 15.08 |
| 2012-04-09 17:00:00 | 14.82 |
| 2012-04-09 18:00:00 | 15.08 |
| 2012-04-09 19:00:00 | 15.08 |
| 2012-04-09 20:00:00 | 15.08 |
| 2012-04-09 21:00:00 | 15.08 |
| 2012-04-09 22:00:00 | 15.34 |
| 2012-04-09 23:00:00 | 15.34 |
| 2012-04-10 | 15.34 |
| 2012-04-10 01:00:00 | 15.6 |
| 2012-04-10 02:00:00 | 15.34 |
| 2012-04-10 03:00:00 | 15.6 |
| 2012-04-10 04:00:00 | 15.6 |
| 2012-04-10 05:00:00 | 15.6 |
| 2012-04-10 06:00:00 | 15.34 |
| 2012-04-10 07:00:00 | 16.12 |
| 2012-04-10 08:00:00 | 15.6 |
| 2012-04-10 09:00:00 | 15.08 |
| 2012-04-10 10:00:00 | 12.48 |
| 2012-04-10 11:00:00 | 12.22 |
| 2012-04-10 12:00:00 | 12.48 |
| 2012-04-10 13:00:00 | 12.74 |
| 2012-04-10 14:00:00 | 12.48 |
| 2012-04-10 15:00:00 | 12.22 |
| 2012-04-10 16:00:00 | 12.22 |
| 2012-04-10 17:00:00 | 12.22 |
| 2012-04-10 18:00:00 | 11.96 |
| 2012-04-10 19:00:00 | 12.48 |
| 2012-04-10 20:00:00 | 11.96 |
| 2012-04-10 21:00:00 | 11.96 |
| 2012-04-10 22:00:00 | 12.22 |
| 2012-04-10 23:00:00 | 12.22 |
| 2012-04-11 | 12.22 |
| 2012-04-11 01:00:00 | 12.48 |
| 2012-04-11 02:00:00 | 12.48 |
| 2012-04-11 03:00:00 | 11.96 |
| 2012-04-11 04:00:00 | 12.22 |
| 2012-04-11 05:00:00 | 12.22 |
| 2012-04-11 06:00:00 | 12.22 |
| 2012-04-11 07:00:00 | 12.22 |
| 2012-04-11 08:00:00 | 12.22 |
| 2012-04-11 09:00:00 | 12.48 |
| 2012-04-11 10:00:00 | 14.56 |
| 2012-04-11 11:00:00 | 20.02 |
| 2012-04-11 12:00:00 | 21.06 |
| 2012-04-11 13:00:00 | 20.8 |
| 2012-04-11 14:00:00 | 13.78 |
| 2012-04-11 15:00:00 | 11.44 |
| 2012-04-11 16:00:00 | 10.92 |
| 2012-04-11 17:00:00 | 11.18 |
| 2012-04-11 18:00:00 | 11.44 |
| 2012-04-11 19:00:00 | 11.44 |
| 2012-04-11 20:00:00 | 11.18 |
| 2012-04-11 21:00:00 | 11.44 |
| 2012-04-11 22:00:00 | 11.44 |
| 2012-04-11 23:00:00 | 11.44 |
| 2012-04-12 | 11.44 |
| 2012-04-12 01:00:00 | 11.7 |
| 2012-04-12 02:00:00 | 11.7 |
| 2012-04-12 03:00:00 | 11.18 |
| 2012-04-12 04:00:00 | 11.7 |
| 2012-04-12 05:00:00 | 11.44 |
| 2012-04-12 06:00:00 | 11.44 |
| 2012-04-12 07:00:00 | 11.7 |
| 2012-04-12 08:00:00 | 11.18 |
| 2012-04-12 09:00:00 | 13.26 |
| 2012-04-12 10:00:00 | 17.16 |
| 2012-04-12 11:00:00 | 16.64 |
| 2012-04-12 12:00:00 | 15.08 |
| 2012-04-12 13:00:00 | 12.48 |
| 2012-04-12 14:00:00 | 11.7 |
| 2012-04-12 15:00:00 | 11.7 |
| 2012-04-12 16:00:00 | 11.18 |
| 2012-04-12 17:00:00 | 11.18 |
| 2012-04-12 18:00:00 | 11.18 |
| 2012-04-12 19:00:00 | 11.7 |
| 2012-04-12 20:00:00 | 11.44 |
| 2012-04-12 21:00:00 | 11.44 |
| 2012-04-12 22:00:00 | 11.7 |
| 2012-04-12 23:00:00 | 11.44 |
| 2012-04-13 | 11.7 |
| 2012-04-13 01:00:00 | 11.7 |
| 2012-04-13 02:00:00 | 11.7 |
| 2012-04-13 03:00:00 | 11.44 |
| 2012-04-13 04:00:00 | 11.96 |
| 2012-04-13 05:00:00 | 11.44 |
| 2012-04-13 06:00:00 | 11.44 |
| 2012-04-13 07:00:00 | 11.7 |
| 2012-04-13 08:00:00 | 11.7 |
| 2012-04-13 09:00:00 | 11.44 |
| 2012-04-13 10:00:00 | 11.18 |
| 2012-04-13 11:00:00 | 11.96 |
| 2012-04-13 12:00:00 | 11.44 |
| 2012-04-13 13:00:00 | 11.44 |
| 2012-04-13 14:00:00 | 11.44 |
| 2012-04-13 15:00:00 | 11.44 |
| 2012-04-13 16:00:00 | 11.18 |
| 2012-04-13 17:00:00 | 11.44 |
| 2012-04-13 18:00:00 | 11.18 |
| 2012-04-13 19:00:00 | 11.7 |
| 2012-04-13 20:00:00 | 11.44 |
| 2012-04-13 21:00:00 | 11.44 |
| 2012-04-13 22:00:00 | 11.96 |
| 2012-04-13 23:00:00 | 11.18 |
| 2012-04-14 | 11.44 |
| 2012-04-14 01:00:00 | 11.7 |
| 2012-04-14 02:00:00 | 11.96 |
| 2012-04-14 03:00:00 | 11.44 |
| 2012-04-14 04:00:00 | 11.44 |
| 2012-04-14 05:00:00 | 11.44 |
| 2012-04-14 06:00:00 | 11.7 |
| 2012-04-14 07:00:00 | 11.44 |
| 2012-04-14 08:00:00 | 11.44 |
| 2012-04-14 09:00:00 | 11.44 |
| 2012-04-14 10:00:00 | 11.44 |
| 2012-04-14 11:00:00 | 12.74 |
| 2012-04-14 12:00:00 | 11.7 |
| 2012-04-14 13:00:00 | 12.22 |
| 2012-04-14 14:00:00 | 11.96 |
| 2012-04-14 15:00:00 | 11.7 |
| 2012-04-14 16:00:00 | 11.96 |
| 2012-04-14 17:00:00 | 11.7 |
| 2012-04-14 18:00:00 | 11.7 |
| 2012-04-14 19:00:00 | 11.7 |
| 2012-04-14 20:00:00 | 11.96 |
| 2012-04-14 21:00:00 | 11.7 |
| 2012-04-14 22:00:00 | 11.96 |
| 2012-04-14 23:00:00 | 11.96 |
| 2012-04-15 | 11.7 |
| 2012-04-15 01:00:00 | 12.22 |
| 2012-04-15 02:00:00 | 11.96 |
| 2012-04-15 03:00:00 | 11.96 |
| 2012-04-15 04:00:00 | 11.7 |
| 2012-04-15 05:00:00 | 11.7 |
| 2012-04-15 06:00:00 | 11.96 |
| 2012-04-15 07:00:00 | 11.96 |
| 2012-04-15 08:00:00 | 11.7 |
| 2012-04-15 09:00:00 | 11.7 |
| 2012-04-15 10:00:00 | 11.7 |
| 2012-04-15 11:00:00 | 11.7 |
| 2012-04-15 12:00:00 | 11.7 |
| 2012-04-15 13:00:00 | 11.96 |
| 2012-04-15 14:00:00 | 11.96 |
| 2012-04-15 15:00:00 | 11.7 |
| 2012-04-15 16:00:00 | 11.44 |
| 2012-04-15 17:00:00 | 11.7 |
| 2012-04-15 18:00:00 | 11.96 |
| 2012-04-15 19:00:00 | 11.7 |
| 2012-04-15 20:00:00 | 11.96 |
| 2012-04-15 21:00:00 | 11.96 |
| 2012-04-15 22:00:00 | 11.96 |
| 2012-04-15 23:00:00 | 11.96 |
| 2012-04-16 | 11.96 |
| 2012-04-16 01:00:00 | 12.22 |
| 2012-04-16 02:00:00 | 11.96 |
| 2012-04-16 03:00:00 | 11.96 |
| 2012-04-16 04:00:00 | 12.22 |
| 2012-04-16 05:00:00 | 11.7 |
| 2012-04-16 06:00:00 | 11.96 |
| 2012-04-16 07:00:00 | 12.22 |
| 2012-04-16 08:00:00 | 12.22 |
| 2012-04-16 09:00:00 | 11.44 |
| 2012-04-16 10:00:00 | 11.96 |
| 2012-04-16 11:00:00 | 11.7 |
| 2012-04-16 12:00:00 | 11.7 |
| 2012-04-16 13:00:00 | 12.48 |
| 2012-04-16 14:00:00 | 12.74 |
| 2012-04-16 15:00:00 | 11.96 |
| 2012-04-16 16:00:00 | 11.96 |
| 2012-04-16 17:00:00 | 11.96 |
| 2012-04-16 18:00:00 | 11.96 |
| 2012-04-16 19:00:00 | 12.22 |
| 2012-04-16 20:00:00 | 12.22 |
| 2012-04-16 21:00:00 | 1.82 |
| 2012-04-16 22:00:00 | 0 |
| 2012-04-16 23:00:00 | 1.56 |
| 2012-04-17 | 10.92 |
| 2012-04-17 01:00:00 | 15.86 |
| 2012-04-17 02:00:00 | 13.52 |
| 2012-04-17 03:00:00 | 13 |
| 2012-04-17 04:00:00 | 13 |
| 2012-04-17 05:00:00 | 12.74 |
| 2012-04-17 06:00:00 | 12.48 |
| 2012-04-17 07:00:00 | 12.74 |
| 2012-04-17 08:00:00 | 12.22 |
| 2012-04-17 09:00:00 | 12.48 |
| 2012-04-17 10:00:00 | 12.22 |
| 2012-04-17 11:00:00 | 12.48 |
| 2012-04-17 12:00:00 | 12.22 |
| 2012-04-17 13:00:00 | 12.48 |
| 2012-04-17 14:00:00 | 12.48 |
| 2012-04-17 15:00:00 | 12.22 |
| 2012-04-17 16:00:00 | 12.22 |
| 2012-04-17 17:00:00 | 12.22 |
| 2012-04-17 18:00:00 | 12.22 |
| 2012-04-17 19:00:00 | 12.48 |
| 2012-04-17 20:00:00 | 12.48 |
| 2012-04-17 21:00:00 | 12.48 |
| 2012-04-17 22:00:00 | 12.48 |
| 2012-04-17 23:00:00 | 12.74 |
| 2012-04-18 | 12.48 |
| 2012-04-18 01:00:00 | 12.74 |
| 2012-04-18 02:00:00 | 13 |
| 2012-04-18 03:00:00 | 12.22 |
| 2012-04-18 04:00:00 | 12.74 |
| 2012-04-18 05:00:00 | 12.74 |
| 2012-04-18 06:00:00 | 12.48 |
| 2012-04-18 07:00:00 | 12.48 |
| 2012-04-18 08:00:00 | 12.74 |
| 2012-04-18 09:00:00 | 12.48 |
| 2012-04-18 10:00:00 | 12.48 |
| 2012-04-18 11:00:00 | 12.74 |
| 2012-04-18 12:00:00 | 12.22 |
| 2012-04-18 13:00:00 | 12.48 |
| 2012-04-18 14:00:00 | 12.22 |
| 2012-04-18 15:00:00 | 12.22 |
| 2012-04-18 16:00:00 | 11.7 |
| 2012-04-18 17:00:00 | 11.96 |
| 2012-04-18 18:00:00 | 11.96 |
| 2012-04-18 19:00:00 | 11.96 |
| 2012-04-18 20:00:00 | 12.22 |
| 2012-04-18 21:00:00 | 11.96 |
| 2012-04-18 22:00:00 | 11.96 |
| 2012-04-18 23:00:00 | 11.96 |
| 2012-04-19 | 12.48 |
| 2012-04-19 01:00:00 | 11.96 |
| 2012-04-19 02:00:00 | 12.48 |
| 2012-04-19 03:00:00 | 12.22 |
| 2012-04-19 04:00:00 | 11.96 |
| 2012-04-19 05:00:00 | 11.96 |
| 2012-04-19 06:00:00 | 11.96 |
| 2012-04-19 07:00:00 | 12.22 |
| 2012-04-19 08:00:00 | 11.96 |
| 2012-04-19 09:00:00 | 11.7 |
| 2012-04-19 10:00:00 | 12.48 |
| 2012-04-19 11:00:00 | 12.22 |
| 2012-04-19 12:00:00 | 13.52 |
| 2012-04-19 13:00:00 | 12.74 |
| 2012-04-19 14:00:00 | 13.26 |
| 2012-04-19 15:00:00 | 13 |
| 2012-04-19 16:00:00 | 13 |
| 2012-04-19 17:00:00 | 12.74 |
| 2012-04-19 18:00:00 | 13 |
| 2012-04-19 19:00:00 | 13.52 |
| 2012-04-19 20:00:00 | 13 |
| 2012-04-19 21:00:00 | 12.74 |
| 2012-04-19 22:00:00 | 13.26 |
| 2012-04-19 23:00:00 | 13 |
| 2012-04-20 | 13 |
| 2012-04-20 01:00:00 | 13.26 |
| 2012-04-20 02:00:00 | 13.26 |
| 2012-04-20 03:00:00 | 13.26 |
| 2012-04-20 04:00:00 | 13.26 |
| 2012-04-20 05:00:00 | 13 |
| 2012-04-20 06:00:00 | 13 |
| 2012-04-20 07:00:00 | 13 |
| 2012-04-20 08:00:00 | 13 |
| 2012-04-20 09:00:00 | 13 |
| 2012-04-20 10:00:00 | 12.48 |
| 2012-04-20 11:00:00 | 12.22 |
| 2012-04-20 12:00:00 | 12.48 |
| 2012-04-20 13:00:00 | 12.48 |
| 2012-04-20 14:00:00 | 11.96 |
| 2012-04-20 15:00:00 | 11.96 |
| 2012-04-20 16:00:00 | 12.48 |
| 2012-04-20 17:00:00 | 11.96 |
| 2012-04-20 18:00:00 | 12.22 |
| 2012-04-20 19:00:00 | 12.22 |
| 2012-04-20 20:00:00 | 12.22 |
| 2012-04-20 21:00:00 | 11.96 |
| 2012-04-20 22:00:00 | 12.22 |
| 2012-04-20 23:00:00 | 12.22 |
| 2012-04-21 | 12.22 |
| 2012-04-21 01:00:00 | 12.22 |
| 2012-04-21 02:00:00 | 12.48 |
| 2012-04-21 03:00:00 | 11.96 |
| 2012-04-21 04:00:00 | 12.22 |
| 2012-04-21 05:00:00 | 11.96 |
| 2012-04-21 06:00:00 | 12.22 |
| 2012-04-21 07:00:00 | 12.22 |
| 2012-04-21 08:00:00 | 12.22 |
| 2012-04-21 09:00:00 | 11.7 |
| 2012-04-21 10:00:00 | 11.96 |
| 2012-04-21 11:00:00 | 11.96 |
| 2012-04-21 12:00:00 | 11.7 |
| 2012-04-21 13:00:00 | 12.22 |
| 2012-04-21 14:00:00 | 11.96 |
| 2012-04-21 15:00:00 | 11.96 |
| 2012-04-21 16:00:00 | 11.7 |
| 2012-04-21 17:00:00 | 11.96 |
| 2012-04-21 18:00:00 | 11.96 |
| 2012-04-21 19:00:00 | 12.22 |
| 2012-04-21 20:00:00 | 12.22 |
| 2012-04-21 21:00:00 | 11.96 |
| 2012-04-21 22:00:00 | 11.96 |
| 2012-04-21 23:00:00 | 11.96 |
| 2012-04-22 | 11.96 |
| 2012-04-22 01:00:00 | 12.22 |
| 2012-04-22 02:00:00 | 12.48 |
| 2012-04-22 03:00:00 | 11.96 |
| 2012-04-22 04:00:00 | 12.22 |
| 2012-04-22 05:00:00 | 11.96 |
| 2012-04-22 06:00:00 | 11.96 |
| 2012-04-22 07:00:00 | 11.96 |
| 2012-04-22 08:00:00 | 12.22 |
| 2012-04-22 09:00:00 | 11.7 |
| 2012-04-22 10:00:00 | 11.96 |
| 2012-04-22 11:00:00 | 11.7 |
| 2012-04-22 12:00:00 | 11.96 |
| 2012-04-22 13:00:00 | 11.96 |
| 2012-04-22 14:00:00 | 11.96 |
| 2012-04-22 15:00:00 | 11.7 |
| 2012-04-22 16:00:00 | 11.7 |
| 2012-04-22 17:00:00 | 11.7 |
| 2012-04-22 18:00:00 | 11.7 |
| 2012-04-22 19:00:00 | 12.22 |
| 2012-04-22 20:00:00 | 11.96 |
| 2012-04-22 21:00:00 | 11.96 |
| 2012-04-22 22:00:00 | 11.7 |
| 2012-04-22 23:00:00 | 11.96 |
| 2012-04-23 | 11.96 |
| 2012-04-23 01:00:00 | 12.22 |
| 2012-04-23 02:00:00 | 12.22 |
| 2012-04-23 03:00:00 | 11.96 |
| 2012-04-23 04:00:00 | 11.96 |
| 2012-04-23 05:00:00 | 11.96 |
| 2012-04-23 06:00:00 | 11.96 |
| 2012-04-23 07:00:00 | 11.96 |
| 2012-04-23 08:00:00 | 11.96 |
| 2012-04-23 09:00:00 | 11.96 |
| 2012-04-23 10:00:00 | 11.7 |
| 2012-04-23 11:00:00 | 11.7 |
| 2012-04-23 12:00:00 | 11.7 |
| 2012-04-23 13:00:00 | 11.96 |
| 2012-04-23 14:00:00 | 12.22 |
| 2012-04-23 15:00:00 | 11.44 |
| 2012-04-23 16:00:00 | 11.96 |
| 2012-04-23 17:00:00 | 11.7 |
| 2012-04-23 18:00:00 | 11.44 |
| 2012-04-23 19:00:00 | 11.96 |
| 2012-04-23 20:00:00 | 11.7 |
| 2012-04-23 21:00:00 | 11.7 |
| 2012-04-23 22:00:00 | 11.96 |
| 2012-04-23 23:00:00 | 11.7 |
| 2012-04-24 | 11.96 |
| 2012-04-24 01:00:00 | 12.22 |
| 2012-04-24 02:00:00 | 12.22 |
| 2012-04-24 03:00:00 | 11.7 |
| 2012-04-24 04:00:00 | 11.96 |
| 2012-04-24 05:00:00 | 11.7 |
| 2012-04-24 06:00:00 | 11.7 |
| 2012-04-24 07:00:00 | 11.96 |
| 2012-04-24 08:00:00 | 11.7 |
| 2012-04-24 09:00:00 | 11.44 |
| 2012-04-24 10:00:00 | 11.7 |
| 2012-04-24 11:00:00 | 11.7 |
| 2012-04-24 12:00:00 | 11.44 |
| 2012-04-24 13:00:00 | 11.7 |
| 2012-04-24 14:00:00 | 11.96 |
| 2012-04-24 15:00:00 | 11.44 |
| 2012-04-24 16:00:00 | 11.44 |
| 2012-04-24 17:00:00 | 11.7 |
| 2012-04-24 18:00:00 | 11.44 |
| 2012-04-24 19:00:00 | 11.7 |
| 2012-04-24 20:00:00 | 11.7 |
| 2012-04-24 21:00:00 | 11.7 |
| 2012-04-24 22:00:00 | 11.96 |
| 2012-04-24 23:00:00 | 11.7 |
| 2012-04-25 | 11.7 |
| 2012-04-25 01:00:00 | 12.22 |
| 2012-04-25 02:00:00 | 11.96 |
| 2012-04-25 03:00:00 | 11.7 |
| 2012-04-25 04:00:00 | 11.96 |
| 2012-04-25 05:00:00 | 11.7 |
| 2012-04-25 06:00:00 | 11.44 |
| 2012-04-25 07:00:00 | 11.96 |
| 2012-04-25 08:00:00 | 11.96 |
| 2012-04-25 09:00:00 | 11.18 |
| 2012-04-25 10:00:00 | 11.18 |
| 2012-04-25 11:00:00 | 11.7 |
| 2012-04-25 12:00:00 | 14.04 |
| 2012-04-25 13:00:00 | 14.56 |
| 2012-04-25 14:00:00 | 11.96 |
| 2012-04-25 15:00:00 | 11.7 |
| 2012-04-25 16:00:00 | 11.7 |
| 2012-04-25 17:00:00 | 11.7 |
| 2012-04-25 18:00:00 | 11.7 |
| 2012-04-25 19:00:00 | 11.96 |
| 2012-04-25 20:00:00 | 11.96 |
| 2012-04-25 21:00:00 | 11.7 |
| 2012-04-25 22:00:00 | 11.96 |
| 2012-04-25 23:00:00 | 11.96 |
| 2012-04-26 | 11.96 |
| 2012-04-26 01:00:00 | 11.96 |
| 2012-04-26 02:00:00 | 11.96 |
| 2012-04-26 03:00:00 | 12.22 |
| 2012-04-26 04:00:00 | 11.7 |
| 2012-04-26 05:00:00 | 11.96 |
| 2012-04-26 06:00:00 | 11.7 |
| 2012-04-26 07:00:00 | 12.22 |
| 2012-04-26 08:00:00 | 11.96 |
| 2012-04-26 09:00:00 | 11.7 |
| 2012-04-26 10:00:00 | 12.22 |
| 2012-04-26 11:00:00 | 12.22 |
| 2012-04-26 12:00:00 | 11.7 |
| 2012-04-26 13:00:00 | 11.96 |
| 2012-04-26 14:00:00 | 11.7 |
| 2012-04-26 15:00:00 | 11.7 |
| 2012-04-26 16:00:00 | 11.7 |
| 2012-04-26 17:00:00 | 11.7 |
| 2012-04-26 18:00:00 | 11.7 |
| 2012-04-26 19:00:00 | 11.7 |
| 2012-04-26 20:00:00 | 11.96 |
| 2012-04-26 21:00:00 | 11.96 |
| 2012-04-26 22:00:00 | 11.7 |
| 2012-04-26 23:00:00 | 11.96 |
| 2012-04-27 | 11.96 |
| 2012-04-27 01:00:00 | 11.96 |
| 2012-04-27 02:00:00 | 12.22 |
| 2012-04-27 03:00:00 | 11.7 |
| 2012-04-27 04:00:00 | 12.22 |
| 2012-04-27 05:00:00 | 11.7 |
| 2012-04-27 06:00:00 | 11.96 |
| 2012-04-27 07:00:00 | 11.7 |
| 2012-04-27 08:00:00 | 11.96 |
| 2012-04-27 09:00:00 | 11.7 |
| 2012-04-27 10:00:00 | 11.7 |
| 2012-04-27 11:00:00 | 11.7 |
| 2012-04-27 12:00:00 | 11.44 |
| 2012-04-27 13:00:00 | 11.96 |
| 2012-04-27 14:00:00 | 11.96 |
| 2012-04-27 15:00:00 | 11.44 |
| 2012-04-27 16:00:00 | 11.7 |
| 2012-04-27 17:00:00 | 11.44 |
| 2012-04-27 18:00:00 | 11.7 |
| 2012-04-27 19:00:00 | 11.44 |
| 2012-04-27 20:00:00 | 12.22 |
| 2012-04-27 21:00:00 | 11.44 |
| 2012-04-27 22:00:00 | 11.96 |
| 2012-04-27 23:00:00 | 11.96 |
| 2012-04-28 | 11.7 |
| 2012-04-28 01:00:00 | 11.96 |
| 2012-04-28 02:00:00 | 12.22 |
| 2012-04-28 03:00:00 | 11.96 |
| 2012-04-28 04:00:00 | 11.96 |
| 2012-04-28 05:00:00 | 11.7 |
| 2012-04-28 06:00:00 | 11.7 |
| 2012-04-28 07:00:00 | 12.22 |
| 2012-04-28 08:00:00 | 11.7 |
| 2012-04-28 09:00:00 | 11.7 |
| 2012-04-28 10:00:00 | 12.48 |
| 2012-04-28 11:00:00 | 11.7 |
| 2012-04-28 12:00:00 | 11.44 |
| 2012-04-28 13:00:00 | 12.22 |
| 2012-04-28 14:00:00 | 11.96 |
| 2012-04-28 15:00:00 | 11.44 |
| 2012-04-28 16:00:00 | 11.44 |
| 2012-04-28 17:00:00 | 11.7 |
| 2012-04-28 18:00:00 | 11.44 |
| 2012-04-28 19:00:00 | 11.7 |
| 2012-04-28 20:00:00 | 11.7 |
| 2012-04-28 21:00:00 | 11.44 |
| 2012-04-28 22:00:00 | 11.7 |
| 2012-04-28 23:00:00 | 11.7 |
| 2012-04-29 | 11.7 |
| 2012-04-29 01:00:00 | 11.96 |
| 2012-04-29 02:00:00 | 11.96 |
| 2012-04-29 03:00:00 | 11.7 |
| 2012-04-29 04:00:00 | 11.7 |
| 2012-04-29 05:00:00 | 11.7 |
| 2012-04-29 06:00:00 | 11.7 |
| 2012-04-29 07:00:00 | 11.7 |
| 2012-04-29 08:00:00 | 11.7 |
| 2012-04-29 09:00:00 | 11.44 |
| 2012-04-29 10:00:00 | 11.44 |
| 2012-04-29 11:00:00 | 11.44 |
| 2012-04-29 12:00:00 | 3.9 |
| 2012-04-29 13:00:00 | 0 |
| 2012-04-29 14:00:00 | 11.18 |
| 2012-04-29 15:00:00 | 13 |
| 2012-04-29 16:00:00 | 11.96 |
| 2012-04-29 17:00:00 | 11.96 |
| 2012-04-29 18:00:00 | 11.96 |
| 2012-04-29 19:00:00 | 11.7 |
| 2012-04-29 20:00:00 | 11.96 |
| 2012-04-29 21:00:00 | 11.7 |
| 2012-04-29 22:00:00 | 11.96 |
| 2012-04-29 23:00:00 | 11.96 |
| 2012-04-30 | 11.7 |
| 2012-04-30 01:00:00 | 12.22 |
| 2012-04-30 02:00:00 | 12.22 |
| 2012-04-30 03:00:00 | 11.7 |
| 2012-04-30 04:00:00 | 11.96 |
| 2012-04-30 05:00:00 | 11.96 |
| 2012-04-30 06:00:00 | 11.7 |
| 2012-04-30 07:00:00 | 11.96 |
| 2012-04-30 08:00:00 | 11.7 |
| 2012-04-30 09:00:00 | 12.22 |
| 2012-04-30 10:00:00 | 11.7 |
| 2012-04-30 11:00:00 | 11.96 |
| 2012-04-30 12:00:00 | 11.7 |
| 2012-04-30 13:00:00 | 11.96 |
| 2012-04-30 14:00:00 | 12.22 |
| 2012-04-30 15:00:00 | 11.7 |
| 2012-04-30 16:00:00 | 11.7 |
| 2012-04-30 17:00:00 | 11.7 |
| 2012-04-30 18:00:00 | 11.7 |
| 2012-04-30 19:00:00 | 11.96 |
| 2012-04-30 20:00:00 | 11.96 |
| 2012-04-30 21:00:00 | 11.7 |
| 2012-04-30 22:00:00 | 11.96 |
| 2012-04-30 23:00:00 | 11.96 |
| 2012-05-01 | 11.96 |
| 2012-05-01 01:00:00 | 12.22 |
| 2012-05-01 02:00:00 | 12.22 |
| 2012-05-01 03:00:00 | 11.96 |
| 2012-05-01 04:00:00 | 12.22 |
| 2012-05-01 05:00:00 | 11.96 |
| 2012-05-01 06:00:00 | 11.96 |
| 2012-05-01 07:00:00 | 11.96 |
| 2012-05-01 08:00:00 | 11.96 |
| 2012-05-01 09:00:00 | 11.44 |
| 2012-05-01 10:00:00 | 11.44 |
| 2012-05-01 11:00:00 | 11.18 |
| 2012-05-01 12:00:00 | 11.18 |
| 2012-05-01 13:00:00 | 11.44 |
| 2012-05-01 14:00:00 | 11.44 |
| 2012-05-01 15:00:00 | 11.18 |
| 2012-05-01 16:00:00 | 11.18 |
| 2012-05-01 17:00:00 | 11.18 |
| 2012-05-01 18:00:00 | 10.92 |
| 2012-05-01 19:00:00 | 11.44 |
| 2012-05-01 20:00:00 | 11.44 |
| 2012-05-01 21:00:00 | 11.18 |
| 2012-05-01 22:00:00 | 11.44 |
| 2012-05-01 23:00:00 | 11.44 |
| 2012-05-02 | 11.44 |
| 2012-05-02 01:00:00 | 11.7 |
| 2012-05-02 02:00:00 | 11.44 |
| 2012-05-02 03:00:00 | 11.44 |
| 2012-05-02 04:00:00 | 11.7 |
| 2012-05-02 05:00:00 | 11.44 |
| 2012-05-02 06:00:00 | 11.44 |
| 2012-05-02 07:00:00 | 11.7 |
| 2012-05-02 08:00:00 | 11.44 |
| 2012-05-02 09:00:00 | 11.18 |
| 2012-05-02 10:00:00 | 11.18 |
| 2012-05-02 11:00:00 | 11.44 |
| 2012-05-02 12:00:00 | 11.18 |
| 2012-05-02 13:00:00 | 11.44 |
| 2012-05-02 14:00:00 | 11.44 |
| 2012-05-02 15:00:00 | 11.18 |
| 2012-05-02 16:00:00 | 11.18 |
| 2012-05-02 17:00:00 | 11.18 |
| 2012-05-02 18:00:00 | 11.18 |
| 2012-05-02 19:00:00 | 11.18 |
| 2012-05-02 20:00:00 | 11.44 |
| 2012-05-02 21:00:00 | 11.18 |
| 2012-05-02 22:00:00 | 11.18 |
| 2012-05-02 23:00:00 | 11.44 |
| 2012-05-03 | 11.44 |
| 2012-05-03 01:00:00 | 11.7 |
| 2012-05-03 02:00:00 | 11.7 |
| 2012-05-03 03:00:00 | 11.44 |
| 2012-05-03 04:00:00 | 11.44 |
| 2012-05-03 05:00:00 | 11.7 |
| 2012-05-03 06:00:00 | 11.18 |
| 2012-05-03 07:00:00 | 11.7 |
| 2012-05-03 08:00:00 | 11.44 |
| 2012-05-03 09:00:00 | 11.44 |
| 2012-05-03 10:00:00 | 11.44 |
| 2012-05-03 11:00:00 | 11.18 |
| 2012-05-03 12:00:00 | 11.18 |
| 2012-05-03 13:00:00 | 11.44 |
| 2012-05-03 14:00:00 | 11.44 |
| 2012-05-03 15:00:00 | 11.18 |
| 2012-05-03 16:00:00 | 10.92 |
| 2012-05-03 17:00:00 | 11.18 |
| 2012-05-03 18:00:00 | 10.92 |
| 2012-05-03 19:00:00 | 11.18 |
| 2012-05-03 20:00:00 | 11.44 |
| 2012-05-03 21:00:00 | 11.18 |
| 2012-05-03 22:00:00 | 11.18 |
| 2012-05-03 23:00:00 | 11.44 |
| 2012-05-04 | 11.44 |
| 2012-05-04 01:00:00 | 11.7 |
| 2012-05-04 02:00:00 | 11.7 |
| 2012-05-04 03:00:00 | 11.44 |
| 2012-05-04 04:00:00 | 11.7 |
| 2012-05-04 05:00:00 | 11.44 |
| 2012-05-04 06:00:00 | 11.18 |
| 2012-05-04 07:00:00 | 11.44 |
| 2012-05-04 08:00:00 | 11.44 |
| 2012-05-04 09:00:00 | 11.44 |
| 2012-05-04 10:00:00 | 11.18 |
| 2012-05-04 11:00:00 | 11.18 |
| 2012-05-04 12:00:00 | 11.18 |
| 2012-05-04 13:00:00 | 11.44 |
| 2012-05-04 14:00:00 | 11.18 |
| 2012-05-04 15:00:00 | 11.18 |
| 2012-05-04 16:00:00 | 11.18 |
| 2012-05-04 17:00:00 | 11.44 |
| 2012-05-04 18:00:00 | 10.92 |
| 2012-05-04 19:00:00 | 11.44 |
| 2012-05-04 20:00:00 | 11.44 |
| 2012-05-04 21:00:00 | 11.44 |
| 2012-05-04 22:00:00 | 11.44 |
| 2012-05-04 23:00:00 | 11.44 |
| 2012-05-05 | 11.44 |
| 2012-05-05 01:00:00 | 11.7 |
| 2012-05-05 02:00:00 | 11.96 |
| 2012-05-05 03:00:00 | 11.7 |
| 2012-05-05 04:00:00 | 11.44 |
| 2012-05-05 05:00:00 | 11.7 |
| 2012-05-05 06:00:00 | 11.18 |
| 2012-05-05 07:00:00 | 11.96 |
| 2012-05-05 08:00:00 | 11.7 |
| 2012-05-05 09:00:00 | 11.18 |
| 2012-05-05 10:00:00 | 11.7 |
| 2012-05-05 11:00:00 | 11.44 |
| 2012-05-05 12:00:00 | 11.18 |
| 2012-05-05 13:00:00 | 11.44 |
| 2012-05-05 14:00:00 | 11.96 |
| 2012-05-05 15:00:00 | 10.92 |
| 2012-05-05 16:00:00 | 11.18 |
| 2012-05-05 17:00:00 | 11.7 |
| 2012-05-05 18:00:00 | 11.18 |
| 2012-05-05 19:00:00 | 11.7 |
| 2012-05-05 20:00:00 | 11.18 |
| 2012-05-05 21:00:00 | 11.7 |
| 2012-05-05 22:00:00 | 11.44 |
| 2012-05-05 23:00:00 | 11.44 |
| 2012-05-06 | 11.44 |
| 2012-05-06 01:00:00 | 11.96 |
| 2012-05-06 02:00:00 | 11.7 |
| 2012-05-06 03:00:00 | 11.7 |
| 2012-05-06 04:00:00 | 11.44 |
| 2012-05-06 05:00:00 | 11.7 |
| 2012-05-06 06:00:00 | 11.7 |
| 2012-05-06 07:00:00 | 11.44 |
| 2012-05-06 08:00:00 | 11.44 |
| 2012-05-06 09:00:00 | 11.44 |
| 2012-05-06 10:00:00 | 11.44 |
| 2012-05-06 11:00:00 | 11.18 |
| 2012-05-06 12:00:00 | 11.18 |
| 2012-05-06 13:00:00 | 11.7 |
| 2012-05-06 14:00:00 | 11.18 |
| 2012-05-06 15:00:00 | 11.18 |
| 2012-05-06 16:00:00 | 10.92 |
| 2012-05-06 17:00:00 | 11.44 |
| 2012-05-06 18:00:00 | 11.18 |
| 2012-05-06 19:00:00 | 11.44 |
| 2012-05-06 20:00:00 | 11.18 |
| 2012-05-06 21:00:00 | 11.44 |
| 2012-05-06 22:00:00 | 11.44 |
| 2012-05-06 23:00:00 | 11.18 |
| 2012-05-07 | 11.7 |
| 2012-05-07 01:00:00 | 11.7 |
| 2012-05-07 02:00:00 | 11.7 |
| 2012-05-07 03:00:00 | 11.44 |
| 2012-05-07 04:00:00 | 11.96 |
| 2012-05-07 05:00:00 | 11.44 |
| 2012-05-07 06:00:00 | 11.44 |
| 2012-05-07 07:00:00 | 11.96 |
| 2012-05-07 08:00:00 | 11.7 |
| 2012-05-07 09:00:00 | 11.18 |
| 2012-05-07 10:00:00 | 11.44 |
| 2012-05-07 11:00:00 | 11.7 |
| 2012-05-07 12:00:00 | 11.18 |
| 2012-05-07 13:00:00 | 13.26 |
| 2012-05-07 14:00:00 | 11.44 |
| 2012-05-07 15:00:00 | 11.7 |
| 2012-05-07 16:00:00 | 11.44 |
| 2012-05-07 17:00:00 | 11.18 |
| 2012-05-07 18:00:00 | 11.7 |
| 2012-05-07 19:00:00 | 11.44 |
| 2012-05-07 20:00:00 | 12.22 |
| 2012-05-07 21:00:00 | 11.44 |
| 2012-05-07 22:00:00 | 11.96 |
| 2012-05-07 23:00:00 | 11.44 |
| 2012-05-08 | 11.96 |
| 2012-05-08 01:00:00 | 11.96 |
| 2012-05-08 02:00:00 | 12.22 |
| 2012-05-08 03:00:00 | 11.7 |
| 2012-05-08 04:00:00 | 11.96 |
| 2012-05-08 05:00:00 | 11.7 |
| 2012-05-08 06:00:00 | 11.7 |
| 2012-05-08 07:00:00 | 12.22 |
| 2012-05-08 08:00:00 | 11.7 |
| 2012-05-08 09:00:00 | 11.7 |
| 2012-05-08 10:00:00 | 11.96 |
| 2012-05-08 11:00:00 | 11.7 |
| 2012-05-08 12:00:00 | 11.7 |
| 2012-05-08 13:00:00 | 11.96 |
| 2012-05-08 14:00:00 | 12.22 |
| 2012-05-08 15:00:00 | 11.7 |
| 2012-05-08 16:00:00 | 11.44 |
| 2012-05-08 17:00:00 | 11.44 |
| 2012-05-08 18:00:00 | 11.7 |
| 2012-05-08 19:00:00 | 11.96 |
| 2012-05-08 20:00:00 | 11.7 |
| 2012-05-08 21:00:00 | 11.96 |
| 2012-05-08 22:00:00 | 11.96 |
| 2012-05-08 23:00:00 | 11.7 |
| 2012-05-09 | 11.96 |
| 2012-05-09 01:00:00 | 12.22 |
| 2012-05-09 02:00:00 | 12.22 |
| 2012-05-09 03:00:00 | 12.22 |
| 2012-05-09 04:00:00 | 11.96 |
| 2012-05-09 05:00:00 | 11.96 |
| 2012-05-09 06:00:00 | 11.96 |
| 2012-05-09 07:00:00 | 11.96 |
| 2012-05-09 08:00:00 | 12.22 |
| 2012-05-09 09:00:00 | 11.96 |
| 2012-05-09 10:00:00 | 11.7 |
| 2012-05-09 11:00:00 | 11.7 |
| 2012-05-09 12:00:00 | 11.7 |
| 2012-05-09 13:00:00 | 11.96 |
| 2012-05-09 14:00:00 | 11.7 |
| 2012-05-09 15:00:00 | 11.7 |
| 2012-05-09 16:00:00 | 11.44 |
| 2012-05-09 17:00:00 | 11.7 |
| 2012-05-09 18:00:00 | 11.7 |
| 2012-05-09 19:00:00 | 11.96 |
| 2012-05-09 20:00:00 | 11.7 |
| 2012-05-09 21:00:00 | 11.96 |
| 2012-05-09 22:00:00 | 11.7 |
| 2012-05-09 23:00:00 | 11.7 |
| 2012-05-10 | 11.96 |
| 2012-05-10 01:00:00 | 12.48 |
| 2012-05-10 02:00:00 | 11.7 |
| 2012-05-10 03:00:00 | 12.22 |
| 2012-05-10 04:00:00 | 11.7 |
| 2012-05-10 05:00:00 | 12.22 |
| 2012-05-10 06:00:00 | 11.44 |
| 2012-05-10 07:00:00 | 11.96 |
| 2012-05-10 08:00:00 | 11.7 |
| 2012-05-10 09:00:00 | 11.96 |
| 2012-05-10 10:00:00 | 11.44 |
| 2012-05-10 11:00:00 | 11.44 |
| 2012-05-10 12:00:00 | 11.44 |
| 2012-05-10 13:00:00 | 11.7 |
| 2012-05-10 14:00:00 | 11.7 |
| 2012-05-10 15:00:00 | 11.18 |
| 2012-05-10 16:00:00 | 11.44 |
| 2012-05-10 17:00:00 | 11.18 |
| 2012-05-10 18:00:00 | 11.18 |
| 2012-05-10 19:00:00 | 11.7 |
| 2012-05-10 20:00:00 | 11.44 |
| 2012-05-10 21:00:00 | 11.18 |
| 2012-05-10 22:00:00 | 11.44 |
| 2012-05-10 23:00:00 | 11.7 |
| 2012-05-11 | 11.18 |
| 2012-05-11 01:00:00 | 11.7 |
| 2012-05-11 02:00:00 | 11.7 |
| 2012-05-11 03:00:00 | 11.7 |
| 2012-05-11 04:00:00 | 11.44 |
| 2012-05-11 05:00:00 | 11.7 |
| 2012-05-11 06:00:00 | 11.18 |
| 2012-05-11 07:00:00 | 11.44 |
| 2012-05-11 08:00:00 | 11.44 |
| 2012-05-11 09:00:00 | 7.54 |
| 2012-05-11 10:00:00 | 2.6 |
| 2012-05-11 11:00:00 | 3.12 |
| 2012-05-11 12:00:00 | 2.86 |
| 2012-05-11 13:00:00 | 10.92 |
| 2012-05-11 14:00:00 | 11.7 |
| 2012-05-11 15:00:00 | 11.18 |
| 2012-05-11 16:00:00 | 11.44 |
| 2012-05-11 17:00:00 | 11.44 |
| 2012-05-11 18:00:00 | 11.44 |
| 2012-05-11 19:00:00 | 11.44 |
| 2012-05-11 20:00:00 | 11.44 |
| 2012-05-11 21:00:00 | 11.18 |
| 2012-05-11 22:00:00 | 11.18 |
| 2012-05-11 23:00:00 | 11.44 |
| 2012-05-12 | 11.44 |
| 2012-05-12 01:00:00 | 11.7 |
| 2012-05-12 02:00:00 | 11.7 |
| 2012-05-12 03:00:00 | 11.18 |
| 2012-05-12 04:00:00 | 11.44 |
| 2012-05-12 05:00:00 | 11.44 |
| 2012-05-12 06:00:00 | 11.18 |
| 2012-05-12 07:00:00 | 11.44 |
| 2012-05-12 08:00:00 | 11.44 |
| 2012-05-12 09:00:00 | 12.22 |
| 2012-05-12 10:00:00 | 12.22 |
| 2012-05-12 11:00:00 | 11.44 |
| 2012-05-12 12:00:00 | 11.44 |
| 2012-05-12 13:00:00 | 11.44 |
| 2012-05-12 14:00:00 | 11.7 |
| 2012-05-12 15:00:00 | 11.7 |
| 2012-05-12 16:00:00 | 11.7 |
| 2012-05-12 17:00:00 | 11.44 |
| 2012-05-12 18:00:00 | 11.44 |
| 2012-05-12 19:00:00 | 11.7 |
| 2012-05-12 20:00:00 | 11.96 |
| 2012-05-12 21:00:00 | 11.44 |
| 2012-05-12 22:00:00 | 11.7 |
| 2012-05-12 23:00:00 | 11.7 |
| 2012-05-13 | 11.96 |
| 2012-05-13 01:00:00 | 11.96 |
| 2012-05-13 02:00:00 | 11.96 |
| 2012-05-13 03:00:00 | 11.96 |
| 2012-05-13 04:00:00 | 11.7 |
| 2012-05-13 05:00:00 | 11.7 |
| 2012-05-13 06:00:00 | 11.96 |
| 2012-05-13 07:00:00 | 11.7 |
| 2012-05-13 08:00:00 | 12.22 |
| 2012-05-13 09:00:00 | 11.7 |
| 2012-05-13 10:00:00 | 12.22 |
| 2012-05-13 11:00:00 | 11.7 |
| 2012-05-13 12:00:00 | 11.96 |
| 2012-05-13 13:00:00 | 11.7 |
| 2012-05-13 14:00:00 | 11.96 |
| 2012-05-13 15:00:00 | 11.7 |
| 2012-05-13 16:00:00 | 11.7 |
| 2012-05-13 17:00:00 | 11.96 |
| 2012-05-13 18:00:00 | 11.96 |
| 2012-05-13 19:00:00 | 11.96 |
| 2012-05-13 20:00:00 | 11.96 |
| 2012-05-13 21:00:00 | 12.22 |
| 2012-05-13 22:00:00 | 12.22 |
| 2012-05-13 23:00:00 | 12.22 |
| 2012-05-14 | 12.22 |
| 2012-05-14 01:00:00 | 12.48 |
| 2012-05-14 02:00:00 | 12.48 |
| 2012-05-14 03:00:00 | 12.22 |
| 2012-05-14 04:00:00 | 12.22 |
| 2012-05-14 05:00:00 | 12.22 |
| 2012-05-14 06:00:00 | 11.96 |
| 2012-05-14 07:00:00 | 12.22 |
| 2012-05-14 08:00:00 | 12.48 |
| 2012-05-14 09:00:00 | 11.96 |
| 2012-05-14 10:00:00 | 11.96 |
| 2012-05-14 11:00:00 | 12.22 |
| 2012-05-14 12:00:00 | 11.96 |
| 2012-05-14 13:00:00 | 12.22 |
| 2012-05-14 14:00:00 | 12.22 |
| 2012-05-14 15:00:00 | 11.96 |
| 2012-05-14 16:00:00 | 11.96 |
| 2012-05-14 17:00:00 | 11.96 |
| 2012-05-14 18:00:00 | 12.22 |
| 2012-05-14 19:00:00 | 12.22 |
| 2012-05-14 20:00:00 | 11.96 |
| 2012-05-14 21:00:00 | 12.22 |
| 2012-05-14 22:00:00 | 12.22 |
| 2012-05-14 23:00:00 | 11.96 |
| 2012-05-15 | 12.22 |
| 2012-05-15 01:00:00 | 12.48 |
| 2012-05-15 02:00:00 | 12.48 |
| 2012-05-15 03:00:00 | 12.48 |
| 2012-05-15 04:00:00 | 11.96 |
| 2012-05-15 05:00:00 | 12.74 |
| 2012-05-15 06:00:00 | 11.96 |
| 2012-05-15 07:00:00 | 12.22 |
| 2012-05-15 08:00:00 | 11.96 |
| 2012-05-15 09:00:00 | 12.22 |
| 2012-05-15 10:00:00 | 11.96 |
| 2012-05-15 11:00:00 | 8.06 |
| 2012-05-15 12:00:00 | 4.94 |
| 2012-05-15 13:00:00 | 4.68 |
| 2012-05-15 14:00:00 | 8.84 |
| 2012-05-15 15:00:00 | 14.04 |
| 2012-05-15 16:00:00 | 11.96 |
| 2012-05-15 17:00:00 | 11.96 |
| 2012-05-15 18:00:00 | 11.96 |
| 2012-05-15 19:00:00 | 11.96 |
| 2012-05-15 20:00:00 | 12.48 |
| 2012-05-15 21:00:00 | 11.7 |
| 2012-05-15 22:00:00 | 11.96 |
| 2012-05-15 23:00:00 | 12.22 |
| 2012-05-16 | 12.22 |
| 2012-05-16 01:00:00 | 12.22 |
| 2012-05-16 02:00:00 | 12.22 |
| 2012-05-16 03:00:00 | 11.96 |
| 2012-05-16 04:00:00 | 12.48 |
| 2012-05-16 05:00:00 | 11.96 |
| 2012-05-16 06:00:00 | 11.7 |
| 2012-05-16 07:00:00 | 12.48 |
| 2012-05-16 08:00:00 | 11.96 |
| 2012-05-16 09:00:00 | 11.7 |
| 2012-05-16 10:00:00 | 11.96 |
| 2012-05-16 11:00:00 | 11.96 |
| 2012-05-16 12:00:00 | 11.96 |
| 2012-05-16 13:00:00 | 12.22 |
| 2012-05-16 14:00:00 | 12.22 |
| 2012-05-16 15:00:00 | 11.96 |
| 2012-05-16 16:00:00 | 11.96 |
| 2012-05-16 17:00:00 | 11.7 |
| 2012-05-16 18:00:00 | 11.96 |
| 2012-05-16 19:00:00 | 12.22 |
| 2012-05-16 20:00:00 | 11.96 |
| 2012-05-16 21:00:00 | 12.22 |
| 2012-05-16 22:00:00 | 12.22 |
| 2012-05-16 23:00:00 | 12.22 |
| 2012-05-17 | 12.22 |
| 2012-05-17 01:00:00 | 12.48 |
| 2012-05-17 02:00:00 | 12.22 |
| 2012-05-17 03:00:00 | 12.22 |
| 2012-05-17 04:00:00 | 12.22 |
| 2012-05-17 05:00:00 | 12.22 |
| 2012-05-17 06:00:00 | 11.96 |
| 2012-05-17 07:00:00 | 12.48 |
| 2012-05-17 08:00:00 | 11.96 |
| 2012-05-17 09:00:00 | 11.96 |
| 2012-05-17 10:00:00 | 12.22 |
| 2012-05-17 11:00:00 | 11.7 |
| 2012-05-17 12:00:00 | 12.22 |
| 2012-05-17 13:00:00 | 12.22 |
| 2012-05-17 14:00:00 | 12.48 |
| 2012-05-17 15:00:00 | 11.96 |
| 2012-05-17 16:00:00 | 11.96 |
| 2012-05-17 17:00:00 | 11.7 |
| 2012-05-17 18:00:00 | 11.96 |
| 2012-05-17 19:00:00 | 11.96 |
| 2012-05-17 20:00:00 | 12.22 |
| 2012-05-17 21:00:00 | 12.22 |
| 2012-05-17 22:00:00 | 11.96 |
| 2012-05-17 23:00:00 | 12.22 |
| 2012-05-18 | 12.22 |
| 2012-05-18 01:00:00 | 12.74 |
| 2012-05-18 02:00:00 | 12.48 |
| 2012-05-18 03:00:00 | 12.48 |
| 2012-05-18 04:00:00 | 12.22 |
| 2012-05-18 05:00:00 | 12.48 |
| 2012-05-18 06:00:00 | 12.22 |
| 2012-05-18 07:00:00 | 12.48 |
| 2012-05-18 08:00:00 | 12.48 |
| 2012-05-18 09:00:00 | 12.22 |
| 2012-05-18 10:00:00 | 11.96 |
| 2012-05-18 11:00:00 | 11.96 |
| 2012-05-18 12:00:00 | 12.48 |
| 2012-05-18 13:00:00 | 12.22 |
| 2012-05-18 14:00:00 | 12.48 |
| 2012-05-18 15:00:00 | 11.96 |
| 2012-05-18 16:00:00 | 11.7 |
| 2012-05-18 17:00:00 | 12.48 |
| 2012-05-18 18:00:00 | 11.7 |
| 2012-05-18 19:00:00 | 12.22 |
| 2012-05-18 20:00:00 | 11.96 |
| 2012-05-18 21:00:00 | 11.96 |
| 2012-05-18 22:00:00 | 12.22 |
| 2012-05-18 23:00:00 | 11.96 |
| 2012-05-19 | 12.22 |
| 2012-05-19 01:00:00 | 12.74 |
| 2012-05-19 02:00:00 | 12.22 |
| 2012-05-19 03:00:00 | 12.22 |
| 2012-05-19 04:00:00 | 12.22 |
| 2012-05-19 05:00:00 | 12.22 |
| 2012-05-19 06:00:00 | 11.96 |
| 2012-05-19 07:00:00 | 11.7 |
| 2012-05-19 08:00:00 | 12.74 |
| 2012-05-19 09:00:00 | 11.96 |
| 2012-05-19 10:00:00 | 12.22 |
| 2012-05-19 11:00:00 | 11.7 |
| 2012-05-19 12:00:00 | 11.96 |
| 2012-05-19 13:00:00 | 11.96 |
| 2012-05-19 14:00:00 | 12.22 |
| 2012-05-19 15:00:00 | 11.44 |
| 2012-05-19 16:00:00 | 11.96 |
| 2012-05-19 17:00:00 | 11.7 |
| 2012-05-19 18:00:00 | 11.7 |
| 2012-05-19 19:00:00 | 11.96 |
| 2012-05-19 20:00:00 | 11.7 |
| 2012-05-19 21:00:00 | 11.96 |
| 2012-05-19 22:00:00 | 11.7 |
| 2012-05-19 23:00:00 | 11.96 |
| 2012-05-20 | 11.96 |
| 2012-05-20 01:00:00 | 12.48 |
| 2012-05-20 02:00:00 | 12.22 |
| 2012-05-20 03:00:00 | 11.7 |
| 2012-05-20 04:00:00 | 12.22 |
| 2012-05-20 05:00:00 | 11.96 |
| 2012-05-20 06:00:00 | 11.7 |
| 2012-05-20 07:00:00 | 12.22 |
| 2012-05-20 08:00:00 | 11.96 |
| 2012-05-20 09:00:00 | 11.7 |
| 2012-05-20 10:00:00 | 11.7 |
| 2012-05-20 11:00:00 | 11.44 |
| 2012-05-20 12:00:00 | 11.7 |
| 2012-05-20 13:00:00 | 11.44 |
| 2012-05-20 14:00:00 | 11.7 |
| 2012-05-20 15:00:00 | 11.7 |
| 2012-05-20 16:00:00 | 11.18 |
| 2012-05-20 17:00:00 | 11.44 |
| 2012-05-20 18:00:00 | 11.18 |
| 2012-05-20 19:00:00 | 11.96 |
| 2012-05-20 20:00:00 | 11.44 |
| 2012-05-20 21:00:00 | 11.44 |
| 2012-05-20 22:00:00 | 11.18 |
| 2012-05-20 23:00:00 | 11.7 |
| 2012-05-21 | 11.18 |
| 2012-05-21 01:00:00 | 12.22 |
| 2012-05-21 02:00:00 | 11.44 |
| 2012-05-21 03:00:00 | 11.44 |
| 2012-05-21 04:00:00 | 11.44 |
| 2012-05-21 05:00:00 | 11.18 |
| 2012-05-21 06:00:00 | 11.7 |
| 2012-05-21 07:00:00 | 11.18 |
| 2012-05-21 08:00:00 | 10.92 |
| 2012-05-21 09:00:00 | 11.7 |
| 2012-05-21 10:00:00 | 11.18 |
| 2012-05-21 11:00:00 | 10.92 |
| 2012-05-21 12:00:00 | 11.44 |
| 2012-05-21 13:00:00 | 11.18 |
| 2012-05-21 14:00:00 | 11.44 |
| 2012-05-21 15:00:00 | 11.18 |
| 2012-05-21 16:00:00 | 10.92 |
| 2012-05-21 17:00:00 | 11.44 |
| 2012-05-21 18:00:00 | 10.92 |
| 2012-05-21 19:00:00 | 11.44 |
| 2012-05-21 20:00:00 | 10.92 |
| 2012-05-21 21:00:00 | 11.7 |
| 2012-05-21 22:00:00 | 10.92 |
| 2012-05-21 23:00:00 | 10.92 |
| 2012-05-22 | 11.18 |
| 2012-05-22 01:00:00 | 11.18 |
| 2012-05-22 02:00:00 | 11.7 |
| 2012-05-22 03:00:00 | 11.18 |
| 2012-05-22 04:00:00 | 11.18 |
| 2012-05-22 05:00:00 | 11.18 |
| 2012-05-22 06:00:00 | 10.92 |
| 2012-05-22 07:00:00 | 11.18 |
| 2012-05-22 08:00:00 | 11.18 |
| 2012-05-22 09:00:00 | 10.66 |
| 2012-05-22 10:00:00 | 10.92 |
| 2012-05-22 11:00:00 | 10.66 |
| 2012-05-22 12:00:00 | 10.92 |
| 2012-05-22 13:00:00 | 11.44 |
| 2012-05-22 14:00:00 | 10.92 |
| 2012-05-22 15:00:00 | 10.66 |
| 2012-05-22 16:00:00 | 10.66 |
| 2012-05-22 17:00:00 | 10.66 |
| 2012-05-22 18:00:00 | 11.18 |
| 2012-05-22 19:00:00 | 10.92 |
| 2012-05-22 20:00:00 | 10.92 |
| 2012-05-22 21:00:00 | 10.92 |
| 2012-05-22 22:00:00 | 10.92 |
| 2012-05-22 23:00:00 | 10.92 |
| 2012-05-23 | 10.92 |
| 2012-05-23 01:00:00 | 11.18 |
| 2012-05-23 02:00:00 | 11.18 |
| 2012-05-23 03:00:00 | 10.92 |
| 2012-05-23 04:00:00 | 10.92 |
| 2012-05-23 05:00:00 | 10.92 |
| 2012-05-23 06:00:00 | 10.92 |
| 2012-05-23 07:00:00 | 10.92 |
| 2012-05-23 08:00:00 | 10.92 |
| 2012-05-23 09:00:00 | 10.66 |
| 2012-05-23 10:00:00 | 10.66 |
| 2012-05-23 11:00:00 | 10.92 |
| 2012-05-23 12:00:00 | 10.66 |
| 2012-05-23 13:00:00 | 11.18 |
| 2012-05-23 14:00:00 | 11.44 |
| 2012-05-23 15:00:00 | 10.66 |
| 2012-05-23 16:00:00 | 10.92 |
| 2012-05-23 17:00:00 | 10.92 |
| 2012-05-23 18:00:00 | 10.66 |
| 2012-05-23 19:00:00 | 11.18 |
| 2012-05-23 20:00:00 | 10.92 |
| 2012-05-23 21:00:00 | 10.92 |
| 2012-05-23 22:00:00 | 10.92 |
| 2012-05-23 23:00:00 | 10.92 |
| 2012-05-24 | 11.18 |
| 2012-05-24 01:00:00 | 11.44 |
| 2012-05-24 02:00:00 | 11.18 |
| 2012-05-24 03:00:00 | 11.18 |
| 2012-05-24 04:00:00 | 10.92 |
| 2012-05-24 05:00:00 | 10.92 |
| 2012-05-24 06:00:00 | 10.92 |
| 2012-05-24 07:00:00 | 11.18 |
| 2012-05-24 08:00:00 | 10.92 |
| 2012-05-24 09:00:00 | 10.92 |
| 2012-05-24 10:00:00 | 10.66 |
| 2012-05-24 11:00:00 | 10.92 |
| 2012-05-24 12:00:00 | 10.66 |
| 2012-05-24 13:00:00 | 10.92 |
| 2012-05-24 14:00:00 | 11.18 |
| 2012-05-24 15:00:00 | 10.66 |
| 2012-05-24 16:00:00 | 10.66 |
| 2012-05-24 17:00:00 | 10.92 |
| 2012-05-24 18:00:00 | 10.66 |
| 2012-05-24 19:00:00 | 11.18 |
| 2012-05-24 20:00:00 | 10.66 |
| 2012-05-24 21:00:00 | 10.92 |
| 2012-05-24 22:00:00 | 10.92 |
| 2012-05-24 23:00:00 | 10.92 |
| 2012-05-25 | 10.92 |
| 2012-05-25 01:00:00 | 11.18 |
| 2012-05-25 02:00:00 | 11.44 |
| 2012-05-25 03:00:00 | 10.92 |
| 2012-05-25 04:00:00 | 10.92 |
| 2012-05-25 05:00:00 | 10.92 |
| 2012-05-25 06:00:00 | 10.92 |
| 2012-05-25 07:00:00 | 10.92 |
| 2012-05-25 08:00:00 | 11.18 |
| 2012-05-25 09:00:00 | 10.66 |
| 2012-05-25 10:00:00 | 10.66 |
| 2012-05-25 11:00:00 | 10.92 |
| 2012-05-25 12:00:00 | 10.66 |
| 2012-05-25 13:00:00 | 10.92 |
| 2012-05-25 14:00:00 | 10.92 |
| 2012-05-25 15:00:00 | 10.66 |
| 2012-05-25 16:00:00 | 10.92 |
| 2012-05-25 17:00:00 | 10.66 |
| 2012-05-25 18:00:00 | 10.66 |
| 2012-05-25 19:00:00 | 10.92 |
| 2012-05-25 20:00:00 | 11.18 |
| 2012-05-25 21:00:00 | 10.66 |
| 2012-05-25 22:00:00 | 10.92 |
| 2012-05-25 23:00:00 | 10.92 |
| 2012-05-26 | 11.18 |
| 2012-05-26 01:00:00 | 11.44 |
| 2012-05-26 02:00:00 | 11.18 |
| 2012-05-26 03:00:00 | 10.92 |
| 2012-05-26 04:00:00 | 10.92 |
| 2012-05-26 05:00:00 | 11.18 |
| 2012-05-26 06:00:00 | 11.18 |
| 2012-05-26 07:00:00 | 10.92 |
| 2012-05-26 08:00:00 | 11.18 |
| 2012-05-26 09:00:00 | 11.18 |
| 2012-05-26 10:00:00 | 11.18 |
| 2012-05-26 11:00:00 | 10.92 |
| 2012-05-26 12:00:00 | 10.66 |
| 2012-05-26 13:00:00 | 11.44 |
| 2012-05-26 14:00:00 | 10.92 |
| 2012-05-26 15:00:00 | 10.66 |
| 2012-05-26 16:00:00 | 11.44 |
| 2012-05-26 17:00:00 | 10.66 |
| 2012-05-26 18:00:00 | 10.66 |
| 2012-05-26 19:00:00 | 11.18 |
| 2012-05-26 20:00:00 | 10.92 |
| 2012-05-26 21:00:00 | 10.66 |
| 2012-05-26 22:00:00 | 11.18 |
| 2012-05-26 23:00:00 | 10.92 |
| 2012-05-27 | 10.92 |
| 2012-05-27 01:00:00 | 11.44 |
| 2012-05-27 02:00:00 | 11.44 |
| 2012-05-27 03:00:00 | 11.18 |
| 2012-05-27 04:00:00 | 11.18 |
| 2012-05-27 05:00:00 | 11.44 |
| 2012-05-27 06:00:00 | 10.92 |
| 2012-05-27 07:00:00 | 11.18 |
| 2012-05-27 08:00:00 | 11.7 |
| 2012-05-27 09:00:00 | 10.92 |
| 2012-05-27 10:00:00 | 10.92 |
| 2012-05-27 11:00:00 | 11.18 |
| 2012-05-27 12:00:00 | 10.92 |
| 2012-05-27 13:00:00 | 11.18 |
| 2012-05-27 14:00:00 | 10.92 |
| 2012-05-27 15:00:00 | 10.92 |
| 2012-05-27 16:00:00 | 10.92 |
| 2012-05-27 17:00:00 | 10.92 |
| 2012-05-27 18:00:00 | 11.18 |
| 2012-05-27 19:00:00 | 10.92 |
| 2012-05-27 20:00:00 | 11.18 |
| 2012-05-27 21:00:00 | 10.92 |
| 2012-05-27 22:00:00 | 10.92 |
| 2012-05-27 23:00:00 | 11.44 |
| 2012-05-28 | 11.18 |
| 2012-05-28 01:00:00 | 11.18 |
| 2012-05-28 02:00:00 | 11.7 |
| 2012-05-28 03:00:00 | 11.18 |
| 2012-05-28 04:00:00 | 11.18 |
| 2012-05-28 05:00:00 | 11.44 |
| 2012-05-28 06:00:00 | 10.92 |
| 2012-05-28 07:00:00 | 11.44 |
| 2012-05-28 08:00:00 | 11.18 |
| 2012-05-28 09:00:00 | 10.92 |
| 2012-05-28 10:00:00 | 11.18 |
| 2012-05-28 11:00:00 | 10.92 |
| 2012-05-28 12:00:00 | 11.18 |
| 2012-05-28 13:00:00 | 10.92 |
| 2012-05-28 14:00:00 | 11.18 |
| 2012-05-28 15:00:00 | 10.92 |
| 2012-05-28 16:00:00 | 10.66 |
| 2012-05-28 17:00:00 | 11.44 |
| 2012-05-28 18:00:00 | 10.92 |
| 2012-05-28 19:00:00 | 10.92 |
| 2012-05-28 20:00:00 | 11.44 |
| 2012-05-28 21:00:00 | 10.66 |
| 2012-05-28 22:00:00 | 11.18 |
| 2012-05-28 23:00:00 | 11.18 |
| 2012-05-29 | 10.92 |
| 2012-05-29 01:00:00 | 11.7 |
| 2012-05-29 02:00:00 | 11.18 |
| 2012-05-29 03:00:00 | 11.18 |
| 2012-05-29 04:00:00 | 11.44 |
| 2012-05-29 05:00:00 | 11.18 |
| 2012-05-29 06:00:00 | 10.92 |
| 2012-05-29 07:00:00 | 11.44 |
| 2012-05-29 08:00:00 | 10.92 |
| 2012-05-29 09:00:00 | 11.18 |
| 2012-05-29 10:00:00 | 11.18 |
| 2012-05-29 11:00:00 | 10.92 |
| 2012-05-29 12:00:00 | 10.92 |
| 2012-05-29 13:00:00 | 11.18 |
| 2012-05-29 14:00:00 | 11.44 |
| 2012-05-29 15:00:00 | 10.66 |
| 2012-05-29 16:00:00 | 10.92 |
| 2012-05-29 17:00:00 | 10.92 |
| 2012-05-29 18:00:00 | 10.66 |
| 2012-05-29 19:00:00 | 11.18 |
| 2012-05-29 20:00:00 | 11.18 |
| 2012-05-29 21:00:00 | 10.66 |
| 2012-05-29 22:00:00 | 10.66 |
| 2012-05-29 23:00:00 | 11.44 |
| 2012-05-30 | 10.92 |
| 2012-05-30 01:00:00 | 11.18 |
| 2012-05-30 02:00:00 | 11.18 |
| 2012-05-30 03:00:00 | 11.18 |
| 2012-05-30 04:00:00 | 10.92 |
| 2012-05-30 05:00:00 | 10.66 |
| 2012-05-30 06:00:00 | 10.66 |
| 2012-05-30 07:00:00 | 10.92 |
| 2012-05-30 08:00:00 | 11.18 |
| 2012-05-30 09:00:00 | 10.92 |
| 2012-05-30 10:00:00 | 10.66 |
| 2012-05-30 11:00:00 | 10.92 |
| 2012-05-30 12:00:00 | 10.66 |
| 2012-05-30 13:00:00 | 10.92 |
| 2012-05-30 14:00:00 | 10.92 |
| 2012-05-30 15:00:00 | 10.66 |
| 2012-05-30 16:00:00 | 10.66 |
| 2012-05-30 17:00:00 | 10.92 |
| 2012-05-30 18:00:00 | 10.4 |
| 2012-05-30 19:00:00 | 10.92 |
| 2012-05-30 20:00:00 | 10.92 |
| 2012-05-30 21:00:00 | 10.66 |
| 2012-05-30 22:00:00 | 10.66 |
| 2012-05-30 23:00:00 | 11.18 |
| 2012-05-31 | 10.92 |
| 2012-05-31 01:00:00 | 11.18 |
| 2012-05-31 02:00:00 | 10.92 |
| 2012-05-31 03:00:00 | 10.92 |
| 2012-05-31 04:00:00 | 10.66 |
| 2012-05-31 05:00:00 | 10.92 |
| 2012-05-31 06:00:00 | 10.92 |
| 2012-05-31 07:00:00 | 10.92 |
| 2012-05-31 08:00:00 | 10.92 |
| 2012-05-31 09:00:00 | 10.4 |
| 2012-05-31 10:00:00 | 10.66 |
| 2012-05-31 11:00:00 | 11.44 |
| 2012-05-31 12:00:00 | 11.18 |
| 2012-05-31 13:00:00 | 10.66 |
| 2012-05-31 14:00:00 | 10.92 |
| 2012-05-31 15:00:00 | 10.4 |
| 2012-05-31 16:00:00 | 11.18 |
| 2012-05-31 17:00:00 | 10.4 |
| 2012-05-31 18:00:00 | 10.66 |
| 2012-05-31 19:00:00 | 10.92 |
| 2012-05-31 20:00:00 | 10.92 |
| 2012-05-31 21:00:00 | 10.92 |
| 2012-05-31 22:00:00 | 10.92 |
| 2012-05-31 23:00:00 | 10.66 |
| 2012-06-01 | 10.92 |
| 2012-06-01 01:00:00 | 11.18 |
| 2012-06-01 02:00:00 | 10.92 |
| 2012-06-01 03:00:00 | 11.18 |
| 2012-06-01 04:00:00 | 10.92 |
| 2012-06-01 05:00:00 | 10.92 |
| 2012-06-01 06:00:00 | 10.92 |
| 2012-06-01 07:00:00 | 10.92 |
| 2012-06-01 08:00:00 | 11.18 |
| 2012-06-01 09:00:00 | 10.66 |
| 2012-06-01 10:00:00 | 10.66 |
| 2012-06-01 11:00:00 | 10.66 |
| 2012-06-01 12:00:00 | 10.92 |
| 2012-06-01 13:00:00 | 10.92 |
| 2012-06-01 14:00:00 | 10.92 |
| 2012-06-01 15:00:00 | 10.92 |
| 2012-06-01 16:00:00 | 10.66 |
| 2012-06-01 17:00:00 | 10.4 |
| 2012-06-01 18:00:00 | 10.66 |
| 2012-06-01 19:00:00 | 11.44 |
| 2012-06-01 20:00:00 | 10.92 |
| 2012-06-01 21:00:00 | 10.92 |
| 2012-06-01 22:00:00 | 11.18 |
| 2012-06-01 23:00:00 | 10.92 |
| 2012-06-02 | 10.66 |
| 2012-06-02 01:00:00 | 11.44 |
| 2012-06-02 02:00:00 | 10.92 |
| 2012-06-02 03:00:00 | 11.18 |
| 2012-06-02 04:00:00 | 11.18 |
| 2012-06-02 05:00:00 | 10.92 |
| 2012-06-02 06:00:00 | 11.18 |
| 2012-06-02 07:00:00 | 10.92 |
| 2012-06-02 08:00:00 | 11.44 |
| 2012-06-02 09:00:00 | 10.66 |
| 2012-06-02 10:00:00 | 11.44 |
| 2012-06-02 11:00:00 | 10.66 |
| 2012-06-02 12:00:00 | 11.18 |
| 2012-06-02 13:00:00 | 10.92 |
| 2012-06-02 14:00:00 | 11.18 |
| 2012-06-02 15:00:00 | 10.92 |
| 2012-06-02 16:00:00 | 10.92 |
| 2012-06-02 17:00:00 | 10.66 |
| 2012-06-02 18:00:00 | 11.18 |
| 2012-06-02 19:00:00 | 10.92 |
| 2012-06-02 20:00:00 | 11.44 |
| 2012-06-02 21:00:00 | 10.66 |
| 2012-06-02 22:00:00 | 11.18 |
| 2012-06-02 23:00:00 | 11.18 |
| 2012-06-03 | 10.92 |
| 2012-06-03 01:00:00 | 11.44 |
| 2012-06-03 02:00:00 | 11.18 |
| 2012-06-03 03:00:00 | 11.44 |
| 2012-06-03 04:00:00 | 11.18 |
| 2012-06-03 05:00:00 | 11.44 |
| 2012-06-03 06:00:00 | 10.92 |
| 2012-06-03 07:00:00 | 11.18 |
| 2012-06-03 08:00:00 | 11.18 |
| 2012-06-03 09:00:00 | 11.18 |
| 2012-06-03 10:00:00 | 10.92 |
| 2012-06-03 11:00:00 | 10.92 |
| 2012-06-03 12:00:00 | 10.66 |
| 2012-06-03 13:00:00 | 11.18 |
| 2012-06-03 14:00:00 | 10.92 |
| 2012-06-03 15:00:00 | 11.18 |
| 2012-06-03 16:00:00 | 10.66 |
| 2012-06-03 17:00:00 | 10.4 |
| 2012-06-03 18:00:00 | 10.92 |
| 2012-06-03 19:00:00 | 10.66 |
| 2012-06-03 20:00:00 | 11.18 |
| 2012-06-03 21:00:00 | 10.66 |
| 2012-06-03 22:00:00 | 11.18 |
| 2012-06-03 23:00:00 | 10.66 |
| 2012-06-04 | 10.92 |
| 2012-06-04 01:00:00 | 11.18 |
| 2012-06-04 02:00:00 | 10.92 |
| 2012-06-04 03:00:00 | 10.92 |
| 2012-06-04 04:00:00 | 10.92 |
| 2012-06-04 05:00:00 | 10.92 |
| 2012-06-04 06:00:00 | 10.66 |
| 2012-06-04 07:00:00 | 11.18 |
| 2012-06-04 08:00:00 | 10.92 |
| 2012-06-04 09:00:00 | 10.4 |
| 2012-06-04 10:00:00 | 10.92 |
| 2012-06-04 11:00:00 | 10.4 |
| 2012-06-04 12:00:00 | 10.4 |
| 2012-06-04 13:00:00 | 11.18 |
| 2012-06-04 14:00:00 | 10.66 |
| 2012-06-04 15:00:00 | 10.66 |
| 2012-06-04 16:00:00 | 10.66 |
| 2012-06-04 17:00:00 | 10.66 |
| 2012-06-04 18:00:00 | 10.4 |
| 2012-06-04 19:00:00 | 10.92 |
| 2012-06-04 20:00:00 | 10.66 |
| 2012-06-04 21:00:00 | 10.66 |
| 2012-06-04 22:00:00 | 10.92 |
| 2012-06-04 23:00:00 | 10.92 |
| 2012-06-05 | 10.4 |
| 2012-06-05 01:00:00 | 11.44 |
| 2012-06-05 02:00:00 | 10.92 |
| 2012-06-05 03:00:00 | 10.66 |
| 2012-06-05 04:00:00 | 11.18 |
| 2012-06-05 05:00:00 | 10.92 |
| 2012-06-05 06:00:00 | 10.4 |
| 2012-06-05 07:00:00 | 11.18 |
| 2012-06-05 08:00:00 | 10.66 |
| 2012-06-05 09:00:00 | 10.66 |
| 2012-06-05 10:00:00 | 9.62 |
| 2012-06-05 11:00:00 | 9.88 |
| 2012-06-05 12:00:00 | 9.88 |
| 2012-06-05 13:00:00 | 9.88 |
| 2012-06-05 14:00:00 | 10.4 |
| 2012-06-05 15:00:00 | 9.62 |
| 2012-06-05 16:00:00 | 10.14 |
| 2012-06-05 17:00:00 | 9.88 |
| 2012-06-05 18:00:00 | 10.14 |
| 2012-06-05 19:00:00 | 10.14 |
| 2012-06-05 20:00:00 | 10.14 |
| 2012-06-05 21:00:00 | 10.66 |
| 2012-06-05 22:00:00 | 10.14 |
| 2012-06-05 23:00:00 | 10.4 |
| 2012-06-06 | 10.14 |
| 2012-06-06 01:00:00 | 10.92 |
| 2012-06-06 02:00:00 | 10.4 |
| 2012-06-06 03:00:00 | 10.66 |
| 2012-06-06 04:00:00 | 10.14 |
| 2012-06-06 05:00:00 | 10.4 |
| 2012-06-06 06:00:00 | 9.88 |
| 2012-06-06 07:00:00 | 10.66 |
| 2012-06-06 08:00:00 | 10.14 |
| 2012-06-06 09:00:00 | 11.44 |
| 2012-06-06 10:00:00 | 10.14 |
| 2012-06-06 11:00:00 | 9.88 |
| 2012-06-06 12:00:00 | 10.14 |
| 2012-06-06 13:00:00 | 10.14 |
| 2012-06-06 14:00:00 | 10.66 |
| 2012-06-06 15:00:00 | 9.88 |
| 2012-06-06 16:00:00 | 10.14 |
| 2012-06-06 17:00:00 | 10.14 |
| 2012-06-06 18:00:00 | 10.14 |
| 2012-06-06 19:00:00 | 10.4 |
| 2012-06-06 20:00:00 | 10.14 |
| 2012-06-06 21:00:00 | 10.14 |
| 2012-06-06 22:00:00 | 10.14 |
| 2012-06-06 23:00:00 | 10.4 |
| 2012-06-07 | 10.14 |
| 2012-06-07 01:00:00 | 10.66 |
| 2012-06-07 02:00:00 | 10.4 |
| 2012-06-07 03:00:00 | 10.4 |
| 2012-06-07 04:00:00 | 10.14 |
| 2012-06-07 05:00:00 | 10.4 |
| 2012-06-07 06:00:00 | 9.88 |
| 2012-06-07 07:00:00 | 10.4 |
| 2012-06-07 08:00:00 | 10.14 |
| 2012-06-07 09:00:00 | 10.14 |
| 2012-06-07 10:00:00 | 9.88 |
| 2012-06-07 11:00:00 | 10.4 |
| 2012-06-07 12:00:00 | 9.62 |
| 2012-06-07 13:00:00 | 10.4 |
| 2012-06-07 14:00:00 | 9.88 |
| 2012-06-07 15:00:00 | 9.88 |
| 2012-06-07 16:00:00 | 9.88 |
| 2012-06-07 17:00:00 | 9.88 |
| 2012-06-07 18:00:00 | 9.88 |
| 2012-06-07 19:00:00 | 9.88 |
| 2012-06-07 20:00:00 | 10.14 |
| 2012-06-07 21:00:00 | 9.88 |
| 2012-06-07 22:00:00 | 9.88 |
| 2012-06-07 23:00:00 | 10.14 |
| 2012-06-08 | 9.88 |
| 2012-06-08 01:00:00 | 10.4 |
| 2012-06-08 02:00:00 | 9.88 |
| 2012-06-08 03:00:00 | 10.14 |
| 2012-06-08 04:00:00 | 10.14 |
| 2012-06-08 05:00:00 | 9.62 |
| 2012-06-08 06:00:00 | 9.62 |
| 2012-06-08 07:00:00 | 9.88 |
| 2012-06-08 08:00:00 | 10.14 |
| 2012-06-08 09:00:00 | 9.36 |
| 2012-06-08 10:00:00 | 10.66 |
| 2012-06-08 11:00:00 | 10.92 |
| 2012-06-08 12:00:00 | 11.44 |
| 2012-06-08 13:00:00 | 10.66 |
| 2012-06-08 14:00:00 | 10.92 |
| 2012-06-08 15:00:00 | 10.66 |
| 2012-06-08 16:00:00 | 11.18 |
| 2012-06-08 17:00:00 | 10.66 |
| 2012-06-08 18:00:00 | 3.64 |
| 2012-06-08 19:00:00 | 5.46 |
| 2012-06-08 20:00:00 | 13.26 |
| 2012-06-08 21:00:00 | 11.18 |
| 2012-06-08 22:00:00 | 10.92 |
| 2012-06-08 23:00:00 | 11.18 |
| 2012-06-09 | 10.92 |
| 2012-06-09 01:00:00 | 11.44 |
| 2012-06-09 02:00:00 | 10.66 |
| 2012-06-09 03:00:00 | 10.92 |
| 2012-06-09 04:00:00 | 10.92 |
| 2012-06-09 05:00:00 | 10.92 |
| 2012-06-09 06:00:00 | 10.66 |
| 2012-06-09 07:00:00 | 11.18 |
| 2012-06-09 08:00:00 | 10.92 |
| 2012-06-09 09:00:00 | 11.7 |
| 2012-06-09 10:00:00 | 10.66 |
| 2012-06-09 11:00:00 | 10.66 |
| 2012-06-09 12:00:00 | 10.92 |
| 2012-06-09 13:00:00 | 10.66 |
| 2012-06-09 14:00:00 | 10.92 |
| 2012-06-09 15:00:00 | 10.66 |
| 2012-06-09 16:00:00 | 10.66 |
| 2012-06-09 17:00:00 | 10.66 |
| 2012-06-09 18:00:00 | 10.66 |
| 2012-06-09 19:00:00 | 11.44 |
| 2012-06-09 20:00:00 | 10.92 |
| 2012-06-09 21:00:00 | 10.66 |
| 2012-06-09 22:00:00 | 10.92 |
| 2012-06-09 23:00:00 | 10.66 |
| 2012-06-10 | 11.18 |
| 2012-06-10 01:00:00 | 11.7 |
| 2012-06-10 02:00:00 | 11.18 |
| 2012-06-10 03:00:00 | 10.92 |
| 2012-06-10 04:00:00 | 11.18 |
| 2012-06-10 05:00:00 | 10.66 |
| 2012-06-10 06:00:00 | 11.18 |
| 2012-06-10 07:00:00 | 10.92 |
| 2012-06-10 08:00:00 | 10.92 |
| 2012-06-10 09:00:00 | 10.66 |
| 2012-06-10 10:00:00 | 11.18 |
| 2012-06-10 11:00:00 | 10.66 |
| 2012-06-10 12:00:00 | 10.66 |
| 2012-06-10 13:00:00 | 10.92 |
| 2012-06-10 14:00:00 | 10.92 |
| 2012-06-10 15:00:00 | 10.4 |
| 2012-06-10 16:00:00 | 10.92 |
| 2012-06-10 17:00:00 | 10.92 |
| 2012-06-10 18:00:00 | 10.92 |
| 2012-06-10 19:00:00 | 10.92 |
| 2012-06-10 20:00:00 | 10.92 |
| 2012-06-10 21:00:00 | 11.18 |
| 2012-06-10 22:00:00 | 10.92 |
| 2012-06-10 23:00:00 | 10.92 |
| 2012-06-11 | 10.92 |
| 2012-06-11 01:00:00 | 11.18 |
| 2012-06-11 02:00:00 | 11.7 |
| 2012-06-11 03:00:00 | 10.92 |
| 2012-06-11 04:00:00 | 10.92 |
| 2012-06-11 05:00:00 | 10.92 |
| 2012-06-11 06:00:00 | 11.44 |
| 2012-06-11 07:00:00 | 10.92 |
| 2012-06-11 08:00:00 | 10.66 |
| 2012-06-11 09:00:00 | 10.66 |
| 2012-06-11 10:00:00 | 10.92 |
| 2012-06-11 11:00:00 | 10.92 |
| 2012-06-11 12:00:00 | 10.66 |
| 2012-06-11 13:00:00 | 10.92 |
| 2012-06-11 14:00:00 | 11.18 |
| 2012-06-11 15:00:00 | 10.66 |
| 2012-06-11 16:00:00 | 10.66 |
| 2012-06-11 17:00:00 | 11.18 |
| 2012-06-11 18:00:00 | 10.66 |
| 2012-06-11 19:00:00 | 11.18 |
| 2012-06-11 20:00:00 | 11.44 |
| 2012-06-11 21:00:00 | 10.66 |
| 2012-06-11 22:00:00 | 10.92 |
| 2012-06-11 23:00:00 | 11.18 |
| 2012-06-12 | 10.92 |
| 2012-06-12 01:00:00 | 11.44 |
| 2012-06-12 02:00:00 | 11.44 |
| 2012-06-12 03:00:00 | 11.18 |
| 2012-06-12 04:00:00 | 10.92 |
| 2012-06-12 05:00:00 | 11.18 |
| 2012-06-12 06:00:00 | 10.92 |
| 2012-06-12 07:00:00 | 10.92 |
| 2012-06-12 08:00:00 | 11.18 |
| 2012-06-12 09:00:00 | 10.66 |
| 2012-06-12 10:00:00 | 10.66 |
| 2012-06-12 11:00:00 | 10.92 |
| 2012-06-12 12:00:00 | 10.4 |
| 2012-06-12 13:00:00 | 11.18 |
| 2012-06-12 14:00:00 | 10.92 |
| 2012-06-12 15:00:00 | 10.66 |
| 2012-06-12 16:00:00 | 10.92 |
| 2012-06-12 17:00:00 | 10.66 |
| 2012-06-12 18:00:00 | 10.66 |
| 2012-06-12 19:00:00 | 11.18 |
| 2012-06-12 20:00:00 | 10.66 |
| 2012-06-12 21:00:00 | 11.18 |
| 2012-06-12 22:00:00 | 10.92 |
| 2012-06-12 23:00:00 | 10.66 |
| 2012-06-13 | 11.18 |
| 2012-06-13 01:00:00 | 11.18 |
| 2012-06-13 02:00:00 | 11.18 |
| 2012-06-13 03:00:00 | 11.18 |
| 2012-06-13 04:00:00 | 10.92 |
| 2012-06-13 05:00:00 | 10.92 |
| 2012-06-13 06:00:00 | 11.18 |
| 2012-06-13 07:00:00 | 11.44 |
| 2012-06-13 08:00:00 | 10.66 |
| 2012-06-13 09:00:00 | 11.18 |
| 2012-06-13 10:00:00 | 10.66 |
| 2012-06-13 11:00:00 | 10.66 |
| 2012-06-13 12:00:00 | 11.18 |
| 2012-06-13 13:00:00 | 11.44 |
| 2012-06-13 14:00:00 | 11.44 |
| 2012-06-13 15:00:00 | 10.92 |
| 2012-06-13 16:00:00 | 10.66 |
| 2012-06-13 17:00:00 | 11.18 |
| 2012-06-13 18:00:00 | 10.92 |
| 2012-06-13 19:00:00 | 10.92 |
| 2012-06-13 20:00:00 | 11.18 |
| 2012-06-13 21:00:00 | 11.18 |
| 2012-06-13 22:00:00 | 10.92 |
| 2012-06-13 23:00:00 | 11.18 |
| 2012-06-14 | 11.18 |
| 2012-06-14 01:00:00 | 11.18 |
| 2012-06-14 02:00:00 | 11.7 |
| 2012-06-14 03:00:00 | 10.92 |
| 2012-06-14 04:00:00 | 11.18 |
| 2012-06-14 05:00:00 | 11.7 |
| 2012-06-14 06:00:00 | 10.92 |
| 2012-06-14 07:00:00 | 11.18 |
| 2012-06-14 08:00:00 | 11.7 |
| 2012-06-14 09:00:00 | 3.9 |
| 2012-06-14 10:00:00 | 0 |
| 2012-06-14 11:00:00 | 0 |
| 2012-06-14 12:00:00 | 14.82 |
| 2012-06-14 13:00:00 | 11.18 |
| 2012-06-14 14:00:00 | 9.62 |
| 2012-06-14 15:00:00 | 9.36 |
| 2012-06-14 16:00:00 | 9.36 |
| 2012-06-14 17:00:00 | 8.84 |
| 2012-06-14 18:00:00 | 8.58 |
| 2012-06-14 19:00:00 | 9.62 |
| 2012-06-14 20:00:00 | 8.84 |
| 2012-06-14 21:00:00 | 9.62 |
| 2012-06-14 22:00:00 | 8.84 |
| 2012-06-14 23:00:00 | 9.1 |
| 2012-06-15 | 9.36 |
| 2012-06-15 01:00:00 | 9.1 |
| 2012-06-15 02:00:00 | 9.88 |
| 2012-06-15 03:00:00 | 8.84 |
| 2012-06-15 04:00:00 | 9.36 |
| 2012-06-15 05:00:00 | 9.1 |
| 2012-06-15 06:00:00 | 8.84 |
| 2012-06-15 07:00:00 | 9.1 |
| 2012-06-15 08:00:00 | 9.1 |
| 2012-06-15 09:00:00 | 9.36 |
| 2012-06-15 10:00:00 | 8.58 |
| 2012-06-15 11:00:00 | 9.62 |
| 2012-06-15 12:00:00 | 11.96 |
| 2012-06-15 13:00:00 | 12.22 |
| 2012-06-15 14:00:00 | 11.7 |
| 2012-06-15 15:00:00 | 9.1 |
| 2012-06-15 16:00:00 | 8.58 |
| 2012-06-15 17:00:00 | 9.1 |
| 2012-06-15 18:00:00 | 8.84 |
| 2012-06-15 19:00:00 | 8.84 |
| 2012-06-15 20:00:00 | 8.84 |
| 2012-06-15 21:00:00 | 8.58 |
| 2012-06-15 22:00:00 | 9.36 |
| 2012-06-15 23:00:00 | 8.84 |
| 2012-06-16 | 8.84 |
| 2012-06-16 01:00:00 | 9.36 |
| 2012-06-16 02:00:00 | 9.1 |
| 2012-06-16 03:00:00 | 8.84 |
| 2012-06-16 04:00:00 | 9.36 |
| 2012-06-16 05:00:00 | 8.84 |
| 2012-06-16 06:00:00 | 8.58 |
| 2012-06-16 07:00:00 | 9.36 |
| 2012-06-16 08:00:00 | 9.1 |
| 2012-06-16 09:00:00 | 8.58 |
| 2012-06-16 10:00:00 | 10.92 |
| 2012-06-16 11:00:00 | 11.96 |
| 2012-06-16 12:00:00 | 11.18 |
| 2012-06-16 13:00:00 | 11.7 |
| 2012-06-16 14:00:00 | 11.18 |
| 2012-06-16 15:00:00 | 10.92 |
| 2012-06-16 16:00:00 | 11.18 |
| 2012-06-16 17:00:00 | 11.18 |
| 2012-06-16 18:00:00 | 10.92 |
| 2012-06-16 19:00:00 | 11.18 |
| 2012-06-16 20:00:00 | 10.92 |
| 2012-06-16 21:00:00 | 11.18 |
| 2012-06-16 22:00:00 | 10.92 |
| 2012-06-16 23:00:00 | 11.18 |
| 2012-06-17 | 10.92 |
| 2012-06-17 01:00:00 | 11.7 |
| 2012-06-17 02:00:00 | 11.18 |
| 2012-06-17 03:00:00 | 11.44 |
| 2012-06-17 04:00:00 | 11.18 |
| 2012-06-17 05:00:00 | 10.92 |
| 2012-06-17 06:00:00 | 10.92 |
| 2012-06-17 07:00:00 | 10.92 |
| 2012-06-17 08:00:00 | 11.18 |
| 2012-06-17 09:00:00 | 10.92 |
| 2012-06-17 10:00:00 | 10.92 |
| 2012-06-17 11:00:00 | 10.66 |
| 2012-06-17 12:00:00 | 10.92 |
| 2012-06-17 13:00:00 | 11.18 |
| 2012-06-17 14:00:00 | 11.18 |
| 2012-06-17 15:00:00 | 10.92 |
| 2012-06-17 16:00:00 | 10.92 |
| 2012-06-17 17:00:00 | 10.66 |
| 2012-06-17 18:00:00 | 10.92 |
| 2012-06-17 19:00:00 | 11.18 |
| 2012-06-17 20:00:00 | 11.18 |
| 2012-06-17 21:00:00 | 10.92 |
| 2012-06-17 22:00:00 | 10.92 |
| 2012-06-17 23:00:00 | 11.18 |
| 2012-06-18 | 11.18 |
| 2012-06-18 01:00:00 | 11.44 |
| 2012-06-18 02:00:00 | 11.18 |
| 2012-06-18 03:00:00 | 11.18 |
| 2012-06-18 04:00:00 | 11.18 |
| 2012-06-18 05:00:00 | 10.92 |
| 2012-06-18 06:00:00 | 10.92 |
| 2012-06-18 07:00:00 | 10.92 |
| 2012-06-18 08:00:00 | 11.18 |
| 2012-06-18 09:00:00 | 10.92 |
| 2012-06-18 10:00:00 | 10.92 |
| 2012-06-18 11:00:00 | 10.92 |
| 2012-06-18 12:00:00 | 10.92 |
| 2012-06-18 13:00:00 | 11.18 |
| 2012-06-18 14:00:00 | 11.18 |
| 2012-06-18 15:00:00 | 10.92 |
| 2012-06-18 16:00:00 | 10.66 |
| 2012-06-18 17:00:00 | 10.92 |
| 2012-06-18 18:00:00 | 10.92 |
| 2012-06-18 19:00:00 | 10.92 |
| 2012-06-18 20:00:00 | 11.18 |
| 2012-06-18 21:00:00 | 10.66 |
| 2012-06-18 22:00:00 | 11.18 |
| 2012-06-18 23:00:00 | 11.18 |
| 2012-06-19 | 10.92 |
| 2012-06-19 01:00:00 | 11.44 |
| 2012-06-19 02:00:00 | 11.18 |
| 2012-06-19 03:00:00 | 11.18 |
| 2012-06-19 04:00:00 | 11.18 |
| 2012-06-19 05:00:00 | 11.18 |
| 2012-06-19 06:00:00 | 10.66 |
| 2012-06-19 07:00:00 | 11.18 |
| 2012-06-19 08:00:00 | 11.18 |
| 2012-06-19 09:00:00 | 10.66 |
| 2012-06-19 10:00:00 | 10.92 |
| 2012-06-19 11:00:00 | 10.92 |
| 2012-06-19 12:00:00 | 10.66 |
| 2012-06-19 13:00:00 | 10.92 |
| 2012-06-19 14:00:00 | 10.92 |
| 2012-06-19 15:00:00 | 10.92 |
| 2012-06-19 16:00:00 | 10.66 |
| 2012-06-19 17:00:00 | 10.92 |
| 2012-06-19 18:00:00 | 10.66 |
| 2012-06-19 19:00:00 | 11.18 |
| 2012-06-19 20:00:00 | 10.92 |
| 2012-06-19 21:00:00 | 10.92 |
| 2012-06-19 22:00:00 | 10.92 |
| 2012-06-19 23:00:00 | 10.92 |
| 2012-06-20 | 11.18 |
| 2012-06-20 01:00:00 | 11.18 |
| 2012-06-20 02:00:00 | 11.44 |
| 2012-06-20 03:00:00 | 10.92 |
| 2012-06-20 04:00:00 | 11.18 |
| 2012-06-20 05:00:00 | 10.92 |
| 2012-06-20 06:00:00 | 10.92 |
| 2012-06-20 07:00:00 | 10.92 |
| 2012-06-20 08:00:00 | 11.18 |
| 2012-06-20 09:00:00 | 10.92 |
| 2012-06-20 10:00:00 | 10.92 |
| 2012-06-20 11:00:00 | 10.66 |
| 2012-06-20 12:00:00 | 10.66 |
| 2012-06-20 13:00:00 | 10.92 |
| 2012-06-20 14:00:00 | 11.18 |
| 2012-06-20 15:00:00 | 10.66 |
| 2012-06-20 16:00:00 | 10.92 |
| 2012-06-20 17:00:00 | 10.66 |
| 2012-06-20 18:00:00 | 10.92 |
| 2012-06-20 19:00:00 | 10.92 |
| 2012-06-20 20:00:00 | 10.92 |
| 2012-06-20 21:00:00 | 10.92 |
| 2012-06-20 22:00:00 | 10.92 |
| 2012-06-20 23:00:00 | 10.92 |
| 2012-06-21 | 11.18 |
| 2012-06-21 01:00:00 | 11.18 |
| 2012-06-21 02:00:00 | 11.18 |
| 2012-06-21 03:00:00 | 11.18 |
| 2012-06-21 04:00:00 | 10.92 |
| 2012-06-21 05:00:00 | 11.18 |
| 2012-06-21 06:00:00 | 10.92 |
| 2012-06-21 07:00:00 | 11.18 |
| 2012-06-21 08:00:00 | 10.92 |
| 2012-06-21 09:00:00 | 10.92 |
| 2012-06-21 10:00:00 | 10.66 |
| 2012-06-21 11:00:00 | 10.92 |
| 2012-06-21 12:00:00 | 10.66 |
| 2012-06-21 13:00:00 | 11.18 |
| 2012-06-21 14:00:00 | 10.92 |
| 2012-06-21 15:00:00 | 10.92 |
| 2012-06-21 16:00:00 | 10.92 |
| 2012-06-21 17:00:00 | 10.66 |
| 2012-06-21 18:00:00 | 10.92 |
| 2012-06-21 19:00:00 | 11.18 |
| 2012-06-21 20:00:00 | 10.92 |
| 2012-06-21 21:00:00 | 10.92 |
| 2012-06-21 22:00:00 | 10.92 |
| 2012-06-21 23:00:00 | 11.18 |
| 2012-06-22 | 11.18 |
| 2012-06-22 01:00:00 | 11.44 |
| 2012-06-22 02:00:00 | 11.18 |
| 2012-06-22 03:00:00 | 11.18 |
| 2012-06-22 04:00:00 | 11.18 |
| 2012-06-22 05:00:00 | 11.18 |
| 2012-06-22 06:00:00 | 10.92 |
| 2012-06-22 07:00:00 | 11.18 |
| 2012-06-22 08:00:00 | 11.18 |
| 2012-06-22 09:00:00 | 10.92 |
| 2012-06-22 10:00:00 | 10.92 |
| 2012-06-22 11:00:00 | 10.92 |
| 2012-06-22 12:00:00 | 10.66 |
| 2012-06-22 13:00:00 | 11.18 |
| 2012-06-22 14:00:00 | 11.18 |
| 2012-06-22 15:00:00 | 10.92 |
| 2012-06-22 16:00:00 | 10.92 |
| 2012-06-22 17:00:00 | 10.92 |
| 2012-06-22 18:00:00 | 10.66 |
| 2012-06-22 19:00:00 | 11.18 |
| 2012-06-22 20:00:00 | 11.18 |
| 2012-06-22 21:00:00 | 10.92 |
| 2012-06-22 22:00:00 | 11.18 |
| 2012-06-22 23:00:00 | 10.92 |
| 2012-06-23 | 11.18 |
| 2012-06-23 01:00:00 | 11.44 |
| 2012-06-23 02:00:00 | 11.18 |
| 2012-06-23 03:00:00 | 11.18 |
| 2012-06-23 04:00:00 | 11.18 |
| 2012-06-23 05:00:00 | 11.18 |
| 2012-06-23 06:00:00 | 10.92 |
| 2012-06-23 07:00:00 | 11.18 |
| 2012-06-23 08:00:00 | 11.18 |
| 2012-06-23 09:00:00 | 10.92 |
| 2012-06-23 10:00:00 | 10.92 |
| 2012-06-23 11:00:00 | 10.66 |
| 2012-06-23 12:00:00 | 10.92 |
| 2012-06-23 13:00:00 | 11.18 |
| 2012-06-23 14:00:00 | 11.18 |
| 2012-06-23 15:00:00 | 10.92 |
| 2012-06-23 16:00:00 | 10.92 |
| 2012-06-23 17:00:00 | 10.92 |
| 2012-06-23 18:00:00 | 10.66 |
| 2012-06-23 19:00:00 | 11.18 |
| 2012-06-23 20:00:00 | 11.18 |
| 2012-06-23 21:00:00 | 10.92 |
| 2012-06-23 22:00:00 | 10.92 |
| 2012-06-23 23:00:00 | 11.18 |
| 2012-06-24 | 10.92 |
| 2012-06-24 01:00:00 | 11.44 |
| 2012-06-24 02:00:00 | 11.44 |
| 2012-06-24 03:00:00 | 10.92 |
| 2012-06-24 04:00:00 | 11.18 |
| 2012-06-24 05:00:00 | 11.18 |
| 2012-06-24 06:00:00 | 10.92 |
| 2012-06-24 07:00:00 | 11.18 |
| 2012-06-24 08:00:00 | 10.92 |
| 2012-06-24 09:00:00 | 10.92 |
| 2012-06-24 10:00:00 | 10.92 |
| 2012-06-24 11:00:00 | 10.92 |
| 2012-06-24 12:00:00 | 10.92 |
| 2012-06-24 13:00:00 | 10.92 |
| 2012-06-24 14:00:00 | 11.18 |
| 2012-06-24 15:00:00 | 10.92 |
| 2012-06-24 16:00:00 | 10.92 |
| 2012-06-24 17:00:00 | 10.66 |
| 2012-06-24 18:00:00 | 10.92 |
| 2012-06-24 19:00:00 | 11.18 |
| 2012-06-24 20:00:00 | 11.18 |
| 2012-06-24 21:00:00 | 10.92 |
| 2012-06-24 22:00:00 | 11.18 |
| 2012-06-24 23:00:00 | 11.18 |
| 2012-06-25 | 11.18 |
| 2012-06-25 01:00:00 | 11.44 |
| 2012-06-25 02:00:00 | 11.44 |
| 2012-06-25 03:00:00 | 11.18 |
| 2012-06-25 04:00:00 | 11.18 |
| 2012-06-25 05:00:00 | 11.18 |
| 2012-06-25 06:00:00 | 11.18 |
| 2012-06-25 07:00:00 | 11.18 |
| 2012-06-25 08:00:00 | 11.18 |
| 2012-06-25 09:00:00 | 10.92 |
| 2012-06-25 10:00:00 | 11.18 |
| 2012-06-25 11:00:00 | 10.92 |
| 2012-06-25 12:00:00 | 10.66 |
| 2012-06-25 13:00:00 | 11.18 |
| 2012-06-25 14:00:00 | 11.18 |
| 2012-06-25 15:00:00 | 11.18 |
| 2012-06-25 16:00:00 | 10.92 |
| 2012-06-25 17:00:00 | 10.92 |
| 2012-06-25 18:00:00 | 10.92 |
| 2012-06-25 19:00:00 | 11.18 |
| 2012-06-25 20:00:00 | 11.18 |
| 2012-06-25 21:00:00 | 10.92 |
| 2012-06-25 22:00:00 | 11.18 |
| 2012-06-25 23:00:00 | 10.92 |
| 2012-06-26 | 11.18 |
| 2012-06-26 01:00:00 | 11.7 |
| 2012-06-26 02:00:00 | 11.44 |
| 2012-06-26 03:00:00 | 10.92 |
| 2012-06-26 04:00:00 | 11.18 |
| 2012-06-26 05:00:00 | 11.18 |
| 2012-06-26 06:00:00 | 10.92 |
| 2012-06-26 07:00:00 | 11.44 |
| 2012-06-26 08:00:00 | 10.92 |
| 2012-06-26 09:00:00 | 10.92 |
| 2012-06-26 10:00:00 | 10.92 |
| 2012-06-26 11:00:00 | 10.92 |
| 2012-06-26 12:00:00 | 10.66 |
| 2012-06-26 13:00:00 | 11.18 |
| 2012-06-26 14:00:00 | 10.92 |
| 2012-06-26 15:00:00 | 10.66 |
| 2012-06-26 16:00:00 | 10.66 |
| 2012-06-26 17:00:00 | 10.66 |
| 2012-06-26 18:00:00 | 10.66 |
| 2012-06-26 19:00:00 | 10.92 |
| 2012-06-26 20:00:00 | 10.92 |
| 2012-06-26 21:00:00 | 10.66 |
| 2012-06-26 22:00:00 | 10.92 |
| 2012-06-26 23:00:00 | 10.66 |
| 2012-06-27 | 10.92 |
| 2012-06-27 01:00:00 | 10.92 |
| 2012-06-27 02:00:00 | 11.18 |
| 2012-06-27 03:00:00 | 10.92 |
| 2012-06-27 04:00:00 | 10.92 |
| 2012-06-27 05:00:00 | 10.92 |
| 2012-06-27 06:00:00 | 10.66 |
| 2012-06-27 07:00:00 | 10.92 |
| 2012-06-27 08:00:00 | 10.92 |
| 2012-06-27 09:00:00 | 11.44 |
| 2012-06-27 10:00:00 | 7.8 |
| 2012-06-27 11:00:00 | 9.1 |
| 2012-06-27 12:00:00 | 13 |
| 2012-06-27 13:00:00 | 11.18 |
| 2012-06-27 14:00:00 | 10.92 |
| 2012-06-27 15:00:00 | 10.66 |
| 2012-06-27 16:00:00 | 10.66 |
| 2012-06-27 17:00:00 | 10.92 |
| 2012-06-27 18:00:00 | 10.66 |
| 2012-06-27 19:00:00 | 10.92 |
| 2012-06-27 20:00:00 | 10.92 |
| 2012-06-27 21:00:00 | 10.92 |
| 2012-06-27 22:00:00 | 10.92 |
| 2012-06-27 23:00:00 | 10.92 |
| 2012-06-28 | 11.18 |
| 2012-06-28 01:00:00 | 11.18 |
| 2012-06-28 02:00:00 | 11.18 |
| 2012-06-28 03:00:00 | 11.18 |
| 2012-06-28 04:00:00 | 10.92 |
| 2012-06-28 05:00:00 | 10.92 |
| 2012-06-28 06:00:00 | 10.92 |
| 2012-06-28 07:00:00 | 11.18 |
| 2012-06-28 08:00:00 | 10.92 |
| 2012-06-28 09:00:00 | 10.92 |
| 2012-06-28 10:00:00 | 10.66 |
| 2012-06-28 11:00:00 | 10.66 |
| 2012-06-28 12:00:00 | 10.92 |
| 2012-06-28 13:00:00 | 10.92 |
| 2012-06-28 14:00:00 | 10.92 |
| 2012-06-28 15:00:00 | 10.92 |
| 2012-06-28 16:00:00 | 10.66 |
| 2012-06-28 17:00:00 | 10.92 |
| 2012-06-28 18:00:00 | 10.66 |
| 2012-06-28 19:00:00 | 10.92 |
| 2012-06-28 20:00:00 | 10.92 |
| 2012-06-28 21:00:00 | 10.66 |
| 2012-06-28 22:00:00 | 10.92 |
| 2012-06-28 23:00:00 | 10.92 |
| 2012-06-29 | 11.18 |
| 2012-06-29 01:00:00 | 11.44 |
| 2012-06-29 02:00:00 | 11.18 |
| 2012-06-29 03:00:00 | 10.92 |
| 2012-06-29 04:00:00 | 10.92 |
| 2012-06-29 05:00:00 | 11.18 |
| 2012-06-29 06:00:00 | 10.66 |
| 2012-06-29 07:00:00 | 10.92 |
| 2012-06-29 08:00:00 | 10.92 |
| 2012-06-29 09:00:00 | 10.92 |
| 2012-06-29 10:00:00 | 10.66 |
| 2012-06-29 11:00:00 | 10.66 |
| 2012-06-29 12:00:00 | 10.92 |
| 2012-06-29 13:00:00 | 11.18 |
| 2012-06-29 14:00:00 | 10.92 |
| 2012-06-29 15:00:00 | 10.4 |
| 2012-06-29 16:00:00 | 10.66 |
| 2012-06-29 17:00:00 | 10.66 |
| 2012-06-29 18:00:00 | 10.66 |
| 2012-06-29 19:00:00 | 10.66 |
| 2012-06-29 20:00:00 | 10.92 |
| 2012-06-29 21:00:00 | 10.4 |
| 2012-06-29 22:00:00 | 10.66 |
| 2012-06-29 23:00:00 | 10.92 |
| 2012-06-30 | 10.66 |
| 2012-06-30 01:00:00 | 10.92 |
| 2012-06-30 02:00:00 | 11.18 |
| 2012-06-30 03:00:00 | 10.92 |
| 2012-06-30 04:00:00 | 10.66 |
| 2012-06-30 05:00:00 | 10.92 |
| 2012-06-30 06:00:00 | 10.66 |
| 2012-06-30 07:00:00 | 10.92 |
| 2012-06-30 08:00:00 | 10.66 |
| 2012-06-30 09:00:00 | 10.66 |
| 2012-06-30 10:00:00 | 10.66 |
| 2012-06-30 11:00:00 | 10.4 |
| 2012-06-30 12:00:00 | 10.66 |
| 2012-06-30 13:00:00 | 10.66 |
| 2012-06-30 14:00:00 | 10.66 |
| 2012-06-30 15:00:00 | 10.66 |
| 2012-06-30 16:00:00 | 10.4 |
| 2012-06-30 17:00:00 | 10.4 |
| 2012-06-30 18:00:00 | 10.4 |
| 2012-06-30 19:00:00 | 10.4 |
| 2012-06-30 20:00:00 | 10.4 |
| 2012-06-30 21:00:00 | 10.14 |
| 2012-06-30 22:00:00 | 10.4 |
| 2012-06-30 23:00:00 | 10.4 |
| 2012-07-01 | 10.4 |
| 2012-07-01 01:00:00 | 10.66 |
| 2012-07-01 02:00:00 | 10.4 |
| 2012-07-01 03:00:00 | 10.66 |
| 2012-07-01 04:00:00 | 10.4 |
| 2012-07-01 05:00:00 | 10.4 |
| 2012-07-01 06:00:00 | 10.4 |
| 2012-07-01 07:00:00 | 10.66 |
| 2012-07-01 08:00:00 | 10.4 |
| 2012-07-01 09:00:00 | 10.4 |
| 2012-07-01 10:00:00 | 10.14 |
| 2012-07-01 11:00:00 | 10.4 |
| 2012-07-01 12:00:00 | 10.14 |
| 2012-07-01 13:00:00 | 10.66 |
| 2012-07-01 14:00:00 | 10.4 |
| 2012-07-01 15:00:00 | 10.14 |
| 2012-07-01 16:00:00 | 10.14 |
| 2012-07-01 17:00:00 | 10.14 |
| 2012-07-01 18:00:00 | 10.14 |
| 2012-07-01 19:00:00 | 10.66 |
| 2012-07-01 20:00:00 | 10.14 |
| 2012-07-01 21:00:00 | 10.4 |
| 2012-07-01 22:00:00 | 10.4 |
| 2012-07-01 23:00:00 | 10.66 |
| 2012-07-02 | 10.4 |
| 2012-07-02 01:00:00 | 10.66 |
| 2012-07-02 02:00:00 | 10.92 |
| 2012-07-02 03:00:00 | 10.66 |
| 2012-07-02 04:00:00 | 10.4 |
| 2012-07-02 05:00:00 | 10.66 |
| 2012-07-02 06:00:00 | 10.4 |
| 2012-07-02 07:00:00 | 10.4 |
| 2012-07-02 08:00:00 | 10.4 |
| 2012-07-02 09:00:00 | 10.4 |
| 2012-07-02 10:00:00 | 10.66 |
| 2012-07-02 11:00:00 | 10.4 |
| 2012-07-02 12:00:00 | 10.4 |
| 2012-07-02 13:00:00 | 10.4 |
| 2012-07-02 14:00:00 | 10.4 |
| 2012-07-02 15:00:00 | 10.14 |
| 2012-07-02 16:00:00 | 10.4 |
| 2012-07-02 17:00:00 | 10.14 |
| 2012-07-02 18:00:00 | 10.14 |
| 2012-07-02 19:00:00 | 10.4 |
| 2012-07-02 20:00:00 | 10.4 |
| 2012-07-02 21:00:00 | 10.14 |
| 2012-07-02 22:00:00 | 10.4 |
| 2012-07-02 23:00:00 | 10.4 |
| 2012-07-03 | 10.4 |
| 2012-07-03 01:00:00 | 10.66 |
| 2012-07-03 02:00:00 | 10.92 |
| 2012-07-03 03:00:00 | 10.4 |
| 2012-07-03 04:00:00 | 10.4 |
| 2012-07-03 05:00:00 | 10.4 |
| 2012-07-03 06:00:00 | 10.4 |
| 2012-07-03 07:00:00 | 10.4 |
| 2012-07-03 08:00:00 | 10.66 |
| 2012-07-03 09:00:00 | 10.14 |
| 2012-07-03 10:00:00 | 10.4 |
| 2012-07-03 11:00:00 | 10.4 |
| 2012-07-03 12:00:00 | 10.14 |
| 2012-07-03 13:00:00 | 10.66 |
| 2012-07-03 14:00:00 | 10.4 |
| 2012-07-03 15:00:00 | 10.14 |
| 2012-07-03 16:00:00 | 10.14 |
| 2012-07-03 17:00:00 | 10.14 |
| 2012-07-03 18:00:00 | 10.14 |
| 2012-07-03 19:00:00 | 10.4 |
| 2012-07-03 20:00:00 | 10.4 |
| 2012-07-03 21:00:00 | 10.14 |
| 2012-07-03 22:00:00 | 10.4 |
| 2012-07-03 23:00:00 | 10.4 |
| 2012-07-04 | 10.66 |
| 2012-07-04 01:00:00 | 10.66 |
| 2012-07-04 02:00:00 | 10.66 |
| 2012-07-04 03:00:00 | 10.4 |
| 2012-07-04 04:00:00 | 10.4 |
| 2012-07-04 05:00:00 | 10.4 |
| 2012-07-04 06:00:00 | 10.4 |
| 2012-07-04 07:00:00 | 10.4 |
| 2012-07-04 08:00:00 | 10.66 |
| 2012-07-04 09:00:00 | 10.4 |
| 2012-07-04 10:00:00 | 10.4 |
| 2012-07-04 11:00:00 | 10.14 |
| 2012-07-04 12:00:00 | 10.14 |
| 2012-07-04 13:00:00 | 10.4 |
| 2012-07-04 14:00:00 | 10.4 |
| 2012-07-04 15:00:00 | 10.14 |
| 2012-07-04 16:00:00 | 10.14 |
| 2012-07-04 17:00:00 | 9.88 |
| 2012-07-04 18:00:00 | 10.14 |
| 2012-07-04 19:00:00 | 10.4 |
| 2012-07-04 20:00:00 | 10.4 |
| 2012-07-04 21:00:00 | 10.4 |
| 2012-07-04 22:00:00 | 10.14 |
| 2012-07-04 23:00:00 | 10.4 |
| 2012-07-05 | 10.4 |
| 2012-07-05 01:00:00 | 10.66 |
| 2012-07-05 02:00:00 | 10.66 |
| 2012-07-05 03:00:00 | 10.66 |
| 2012-07-05 04:00:00 | 10.4 |
| 2012-07-05 05:00:00 | 10.4 |
| 2012-07-05 06:00:00 | 10.14 |
| 2012-07-05 07:00:00 | 10.66 |
| 2012-07-05 08:00:00 | 10.4 |
| 2012-07-05 09:00:00 | 10.4 |
| 2012-07-05 10:00:00 | 10.14 |
| 2012-07-05 11:00:00 | 10.14 |
| 2012-07-05 12:00:00 | 10.4 |
| 2012-07-05 13:00:00 | 10.66 |
| 2012-07-05 14:00:00 | 10.4 |
| 2012-07-05 15:00:00 | 10.14 |
| 2012-07-05 16:00:00 | 10.14 |
| 2012-07-05 17:00:00 | 10.14 |
| 2012-07-05 18:00:00 | 10.14 |
| 2012-07-05 19:00:00 | 10.4 |
| 2012-07-05 20:00:00 | 10.4 |
| 2012-07-05 21:00:00 | 10.14 |
| 2012-07-05 22:00:00 | 10.4 |
| 2012-07-05 23:00:00 | 10.4 |
| 2012-07-06 | 10.4 |
| 2012-07-06 01:00:00 | 10.92 |
| 2012-07-06 02:00:00 | 10.92 |
| 2012-07-06 03:00:00 | 10.4 |
| 2012-07-06 04:00:00 | 10.4 |
| 2012-07-06 05:00:00 | 10.4 |
| 2012-07-06 06:00:00 | 10.4 |
| 2012-07-06 07:00:00 | 10.4 |
| 2012-07-06 08:00:00 | 10.4 |
| 2012-07-06 09:00:00 | 10.4 |
| 2012-07-06 10:00:00 | 10.14 |
| 2012-07-06 11:00:00 | 10.14 |
| 2012-07-06 12:00:00 | 10.14 |
| 2012-07-06 13:00:00 | 10.14 |
| 2012-07-06 14:00:00 | 10.4 |
| 2012-07-06 15:00:00 | 10.14 |
| 2012-07-06 16:00:00 | 10.14 |
| 2012-07-06 17:00:00 | 10.14 |
| 2012-07-06 18:00:00 | 9.88 |
| 2012-07-06 19:00:00 | 10.4 |
| 2012-07-06 20:00:00 | 10.4 |
| 2012-07-06 21:00:00 | 10.4 |
| 2012-07-06 22:00:00 | 10.14 |
| 2012-07-06 23:00:00 | 10.4 |
| 2012-07-07 | 10.4 |
| 2012-07-07 01:00:00 | 10.66 |
| 2012-07-07 02:00:00 | 10.66 |
| 2012-07-07 03:00:00 | 10.4 |
| 2012-07-07 04:00:00 | 10.4 |
| 2012-07-07 05:00:00 | 10.66 |
| 2012-07-07 06:00:00 | 10.14 |
| 2012-07-07 07:00:00 | 10.4 |
| 2012-07-07 08:00:00 | 10.4 |
| 2012-07-07 09:00:00 | 10.4 |
| 2012-07-07 10:00:00 | 10.14 |
| 2012-07-07 11:00:00 | 10.14 |
| 2012-07-07 12:00:00 | 10.14 |
| 2012-07-07 13:00:00 | 10.14 |
| 2012-07-07 14:00:00 | 10.4 |
| 2012-07-07 15:00:00 | 10.14 |
| 2012-07-07 16:00:00 | 10.14 |
| 2012-07-07 17:00:00 | 10.14 |
| 2012-07-07 18:00:00 | 9.88 |
| 2012-07-07 19:00:00 | 10.4 |
| 2012-07-07 20:00:00 | 10.4 |
| 2012-07-07 21:00:00 | 10.14 |
| 2012-07-07 22:00:00 | 10.4 |
| 2012-07-07 23:00:00 | 10.14 |
| 2012-07-08 | 10.4 |
| 2012-07-08 01:00:00 | 10.66 |
| 2012-07-08 02:00:00 | 10.66 |
| 2012-07-08 03:00:00 | 10.4 |
| 2012-07-08 04:00:00 | 10.14 |
| 2012-07-08 05:00:00 | 10.4 |
| 2012-07-08 06:00:00 | 10.4 |
| 2012-07-08 07:00:00 | 10.4 |
| 2012-07-08 08:00:00 | 10.4 |
| 2012-07-08 09:00:00 | 10.14 |
| 2012-07-08 10:00:00 | 10.14 |
| 2012-07-08 11:00:00 | 10.14 |
| 2012-07-08 12:00:00 | 10.14 |
| 2012-07-08 13:00:00 | 10.14 |
| 2012-07-08 14:00:00 | 10.4 |
| 2012-07-08 15:00:00 | 10.14 |
| 2012-07-08 16:00:00 | 10.14 |
| 2012-07-08 17:00:00 | 10.14 |
| 2012-07-08 18:00:00 | 10.14 |
| 2012-07-08 19:00:00 | 10.4 |
| 2012-07-08 20:00:00 | 10.66 |
| 2012-07-08 21:00:00 | 10.14 |
| 2012-07-08 22:00:00 | 10.4 |
| 2012-07-08 23:00:00 | 10.4 |
| 2012-07-09 | 10.4 |
| 2012-07-09 01:00:00 | 10.66 |
| 2012-07-09 02:00:00 | 10.66 |
| 2012-07-09 03:00:00 | 10.4 |
| 2012-07-09 04:00:00 | 10.4 |
| 2012-07-09 05:00:00 | 10.4 |
| 2012-07-09 06:00:00 | 10.14 |
| 2012-07-09 07:00:00 | 10.4 |
| 2012-07-09 08:00:00 | 10.14 |
| 2012-07-09 09:00:00 | 10.14 |
| 2012-07-09 10:00:00 | 10.14 |
| 2012-07-09 11:00:00 | 10.14 |
| 2012-07-09 12:00:00 | 10.14 |
| 2012-07-09 13:00:00 | 10.4 |
| 2012-07-09 14:00:00 | 10.14 |
| 2012-07-09 15:00:00 | 10.14 |
| 2012-07-09 16:00:00 | 10.14 |
| 2012-07-09 17:00:00 | 10.14 |
| 2012-07-09 18:00:00 | 10.14 |
| 2012-07-09 19:00:00 | 10.4 |
| 2012-07-09 20:00:00 | 10.14 |
| 2012-07-09 21:00:00 | 10.14 |
| 2012-07-09 22:00:00 | 10.4 |
| 2012-07-09 23:00:00 | 10.14 |
| 2012-07-10 | 10.4 |
| 2012-07-10 01:00:00 | 10.66 |
| 2012-07-10 02:00:00 | 10.66 |
| 2012-07-10 03:00:00 | 10.14 |
| 2012-07-10 04:00:00 | 10.4 |
| 2012-07-10 05:00:00 | 10.4 |
| 2012-07-10 06:00:00 | 10.14 |
| 2012-07-10 07:00:00 | 10.4 |
| 2012-07-10 08:00:00 | 10.4 |
| 2012-07-10 09:00:00 | 10.66 |
| 2012-07-10 10:00:00 | 10.4 |
| 2012-07-10 11:00:00 | 10.4 |
| 2012-07-10 12:00:00 | 10.14 |
| 2012-07-10 13:00:00 | 10.66 |
| 2012-07-10 14:00:00 | 10.66 |
| 2012-07-10 15:00:00 | 10.4 |
| 2012-07-10 16:00:00 | 10.14 |
| 2012-07-10 17:00:00 | 10.4 |
| 2012-07-10 18:00:00 | 10.4 |
| 2012-07-10 19:00:00 | 10.66 |
| 2012-07-10 20:00:00 | 10.4 |
| 2012-07-10 21:00:00 | 10.14 |
| 2012-07-10 22:00:00 | 10.14 |
| 2012-07-10 23:00:00 | 10.14 |
| 2012-07-11 | 10.14 |
| 2012-07-11 01:00:00 | 10.66 |
| 2012-07-11 02:00:00 | 10.4 |
| 2012-07-11 03:00:00 | 10.14 |
| 2012-07-11 04:00:00 | 10.14 |
| 2012-07-11 05:00:00 | 10.4 |
| 2012-07-11 06:00:00 | 9.88 |
| 2012-07-11 07:00:00 | 10.4 |
| 2012-07-11 08:00:00 | 10.14 |
| 2012-07-11 09:00:00 | 9.88 |
| 2012-07-11 10:00:00 | 11.44 |
| 2012-07-11 11:00:00 | 12.22 |
| 2012-07-11 12:00:00 | 11.44 |
| 2012-07-11 13:00:00 | 11.18 |
| 2012-07-11 14:00:00 | 11.44 |
| 2012-07-11 15:00:00 | 10.92 |
| 2012-07-11 16:00:00 | 10.92 |
| 2012-07-11 17:00:00 | 11.18 |
| 2012-07-11 18:00:00 | 11.18 |
| 2012-07-11 19:00:00 | 11.18 |
| 2012-07-11 20:00:00 | 11.18 |
| 2012-07-11 21:00:00 | 11.18 |
| 2012-07-11 22:00:00 | 11.18 |
| 2012-07-11 23:00:00 | 11.44 |
| 2012-07-12 | 11.18 |
| 2012-07-12 01:00:00 | 11.44 |
| 2012-07-12 02:00:00 | 11.7 |
| 2012-07-12 03:00:00 | 11.18 |
| 2012-07-12 04:00:00 | 11.18 |
| 2012-07-12 05:00:00 | 11.44 |
| 2012-07-12 06:00:00 | 11.18 |
| 2012-07-12 07:00:00 | 11.18 |
| 2012-07-12 08:00:00 | 11.18 |
| 2012-07-12 09:00:00 | 11.18 |
| 2012-07-12 10:00:00 | 10.92 |
| 2012-07-12 11:00:00 | 10.92 |
| 2012-07-12 12:00:00 | 10.92 |
| 2012-07-12 13:00:00 | 11.18 |
| 2012-07-12 14:00:00 | 11.18 |
| 2012-07-12 15:00:00 | 11.18 |
| 2012-07-12 16:00:00 | 10.92 |
| 2012-07-12 17:00:00 | 10.92 |
| 2012-07-12 18:00:00 | 10.92 |
| 2012-07-12 19:00:00 | 11.18 |
| 2012-07-12 20:00:00 | 11.18 |
| 2012-07-12 21:00:00 | 10.92 |
| 2012-07-12 22:00:00 | 11.18 |
| 2012-07-12 23:00:00 | 11.18 |
| 2012-07-13 | 11.18 |
| 2012-07-13 01:00:00 | 11.18 |
| 2012-07-13 02:00:00 | 11.7 |
| 2012-07-13 03:00:00 | 11.18 |
| 2012-07-13 04:00:00 | 11.18 |
| 2012-07-13 05:00:00 | 11.18 |
| 2012-07-13 06:00:00 | 10.92 |
| 2012-07-13 07:00:00 | 11.44 |
| 2012-07-13 08:00:00 | 11.18 |
| 2012-07-13 09:00:00 | 10.92 |
| 2012-07-13 10:00:00 | 10.92 |
| 2012-07-13 11:00:00 | 11.18 |
| 2012-07-13 12:00:00 | 11.44 |
| 2012-07-13 13:00:00 | 11.18 |
| 2012-07-13 14:00:00 | 11.18 |
| 2012-07-13 15:00:00 | 11.18 |
| 2012-07-13 16:00:00 | 10.92 |
| 2012-07-13 17:00:00 | 11.18 |
| 2012-07-13 18:00:00 | 10.92 |
| 2012-07-13 19:00:00 | 11.44 |
| 2012-07-13 20:00:00 | 11.18 |
| 2012-07-13 21:00:00 | 10.92 |
| 2012-07-13 22:00:00 | 11.44 |
| 2012-07-13 23:00:00 | 11.18 |
| 2012-07-14 | 11.18 |
| 2012-07-14 01:00:00 | 11.44 |
| 2012-07-14 02:00:00 | 11.44 |
| 2012-07-14 03:00:00 | 11.44 |
| 2012-07-14 04:00:00 | 11.18 |
| 2012-07-14 05:00:00 | 11.18 |
| 2012-07-14 06:00:00 | 11.44 |
| 2012-07-14 07:00:00 | 11.18 |
| 2012-07-14 08:00:00 | 11.44 |
| 2012-07-14 09:00:00 | 11.18 |
| 2012-07-14 10:00:00 | 10.92 |
| 2012-07-14 11:00:00 | 11.18 |
| 2012-07-14 12:00:00 | 10.92 |
| 2012-07-14 13:00:00 | 11.18 |
| 2012-07-14 14:00:00 | 11.44 |
| 2012-07-14 15:00:00 | 10.92 |
| 2012-07-14 16:00:00 | 10.92 |
| 2012-07-14 17:00:00 | 11.18 |
| 2012-07-14 18:00:00 | 10.92 |
| 2012-07-14 19:00:00 | 11.44 |
| 2012-07-14 20:00:00 | 11.18 |
| 2012-07-14 21:00:00 | 11.44 |
| 2012-07-14 22:00:00 | 11.18 |
| 2012-07-14 23:00:00 | 11.18 |
| 2012-07-15 | 11.18 |
| 2012-07-15 01:00:00 | 11.44 |
| 2012-07-15 02:00:00 | 11.18 |
| 2012-07-15 03:00:00 | 11.44 |
| 2012-07-15 04:00:00 | 11.18 |
| 2012-07-15 05:00:00 | 11.44 |
| 2012-07-15 06:00:00 | 10.92 |
| 2012-07-15 07:00:00 | 11.44 |
| 2012-07-15 08:00:00 | 11.18 |
| 2012-07-15 09:00:00 | 10.92 |
| 2012-07-15 10:00:00 | 10.92 |
| 2012-07-15 11:00:00 | 10.92 |
| 2012-07-15 12:00:00 | 10.66 |
| 2012-07-15 13:00:00 | 11.18 |
| 2012-07-15 14:00:00 | 11.18 |
| 2012-07-15 15:00:00 | 10.92 |
| 2012-07-15 16:00:00 | 10.66 |
| 2012-07-15 17:00:00 | 10.92 |
| 2012-07-15 18:00:00 | 10.92 |
| 2012-07-15 19:00:00 | 11.18 |
| 2012-07-15 20:00:00 | 11.18 |
| 2012-07-15 21:00:00 | 10.92 |
| 2012-07-15 22:00:00 | 11.18 |
| 2012-07-15 23:00:00 | 10.92 |
| 2012-07-16 | 11.18 |
| 2012-07-16 01:00:00 | 11.18 |
| 2012-07-16 02:00:00 | 11.44 |
| 2012-07-16 03:00:00 | 10.92 |
| 2012-07-16 04:00:00 | 11.18 |
| 2012-07-16 05:00:00 | 11.18 |
| 2012-07-16 06:00:00 | 10.92 |
| 2012-07-16 07:00:00 | 11.18 |
| 2012-07-16 08:00:00 | 11.18 |
| 2012-07-16 09:00:00 | 10.66 |
| 2012-07-16 10:00:00 | 11.18 |
| 2012-07-16 11:00:00 | 10.92 |
| 2012-07-16 12:00:00 | 10.92 |
| 2012-07-16 13:00:00 | 11.18 |
| 2012-07-16 14:00:00 | 11.18 |
| 2012-07-16 15:00:00 | 10.92 |
| 2012-07-16 16:00:00 | 10.66 |
| 2012-07-16 17:00:00 | 10.92 |
| 2012-07-16 18:00:00 | 10.92 |
| 2012-07-16 19:00:00 | 11.18 |
| 2012-07-16 20:00:00 | 10.92 |
| 2012-07-16 21:00:00 | 11.18 |
| 2012-07-16 22:00:00 | 11.18 |
| 2012-07-16 23:00:00 | 10.92 |
| 2012-07-17 | 11.18 |
| 2012-07-17 01:00:00 | 11.44 |
| 2012-07-17 02:00:00 | 11.44 |
| 2012-07-17 03:00:00 | 11.18 |
| 2012-07-17 04:00:00 | 11.18 |
| 2012-07-17 05:00:00 | 11.18 |
| 2012-07-17 06:00:00 | 10.92 |
| 2012-07-17 07:00:00 | 10.92 |
| 2012-07-17 08:00:00 | 11.18 |
| 2012-07-17 09:00:00 | 10.92 |
| 2012-07-17 10:00:00 | 10.92 |
| 2012-07-17 11:00:00 | 10.92 |
| 2012-07-17 12:00:00 | 10.92 |
| 2012-07-17 13:00:00 | 11.18 |
| 2012-07-17 14:00:00 | 10.92 |
| 2012-07-17 15:00:00 | 10.92 |
| 2012-07-17 16:00:00 | 10.92 |
| 2012-07-17 17:00:00 | 10.92 |
| 2012-07-17 18:00:00 | 10.66 |
| 2012-07-17 19:00:00 | 11.18 |
| 2012-07-17 20:00:00 | 11.18 |
| 2012-07-17 21:00:00 | 10.92 |
| 2012-07-17 22:00:00 | 10.92 |
| 2012-07-17 23:00:00 | 10.92 |
| 2012-07-18 | 11.18 |
| 2012-07-18 01:00:00 | 11.44 |
| 2012-07-18 02:00:00 | 11.44 |
| 2012-07-18 03:00:00 | 10.92 |
| 2012-07-18 04:00:00 | 11.18 |
| 2012-07-18 05:00:00 | 11.18 |
| 2012-07-18 06:00:00 | 10.92 |
| 2012-07-18 07:00:00 | 10.92 |
| 2012-07-18 08:00:00 | 11.18 |
| 2012-07-18 09:00:00 | 10.92 |
| 2012-07-18 10:00:00 | 11.44 |
| 2012-07-18 11:00:00 | 10.66 |
| 2012-07-18 12:00:00 | 11.7 |
| 2012-07-18 13:00:00 | 11.44 |
| 2012-07-18 14:00:00 | 11.18 |
| 2012-07-18 15:00:00 | 10.92 |
| 2012-07-18 16:00:00 | 10.92 |
| 2012-07-18 17:00:00 | 10.66 |
| 2012-07-18 18:00:00 | 10.92 |
| 2012-07-18 19:00:00 | 11.18 |
| 2012-07-18 20:00:00 | 10.92 |
| 2012-07-18 21:00:00 | 11.18 |
| 2012-07-18 22:00:00 | 10.92 |
| 2012-07-18 23:00:00 | 11.18 |
| 2012-07-19 | 11.18 |
| 2012-07-19 01:00:00 | 11.18 |
| 2012-07-19 02:00:00 | 11.44 |
| 2012-07-19 03:00:00 | 11.18 |
| 2012-07-19 04:00:00 | 11.18 |
| 2012-07-19 05:00:00 | 11.18 |
| 2012-07-19 06:00:00 | 10.92 |
| 2012-07-19 07:00:00 | 11.18 |
| 2012-07-19 08:00:00 | 11.18 |
| 2012-07-19 09:00:00 | 10.92 |
| 2012-07-19 10:00:00 | 11.18 |
| 2012-07-19 11:00:00 | 10.92 |
| 2012-07-19 12:00:00 | 11.18 |
| 2012-07-19 13:00:00 | 11.18 |
| 2012-07-19 14:00:00 | 11.18 |
| 2012-07-19 15:00:00 | 10.92 |
| 2012-07-19 16:00:00 | 10.66 |
| 2012-07-19 17:00:00 | 10.92 |
| 2012-07-19 18:00:00 | 10.92 |
| 2012-07-19 19:00:00 | 10.92 |
| 2012-07-19 20:00:00 | 11.18 |
| 2012-07-19 21:00:00 | 10.92 |
| 2012-07-19 22:00:00 | 10.92 |
| 2012-07-19 23:00:00 | 10.92 |
| 2012-07-20 | 11.18 |
| 2012-07-20 01:00:00 | 11.44 |
| 2012-07-20 02:00:00 | 11.18 |
| 2012-07-20 03:00:00 | 11.18 |
| 2012-07-20 04:00:00 | 10.92 |
| 2012-07-20 05:00:00 | 11.18 |
| 2012-07-20 06:00:00 | 10.92 |
| 2012-07-20 07:00:00 | 10.92 |
| 2012-07-20 08:00:00 | 11.18 |
| 2012-07-20 09:00:00 | 10.92 |
| 2012-07-20 10:00:00 | 10.66 |
| 2012-07-20 11:00:00 | 10.92 |
| 2012-07-20 12:00:00 | 10.92 |
| 2012-07-20 13:00:00 | 10.92 |
| 2012-07-20 14:00:00 | 10.92 |
| 2012-07-20 15:00:00 | 10.92 |
| 2012-07-20 16:00:00 | 10.66 |
| 2012-07-20 17:00:00 | 10.66 |
| 2012-07-20 18:00:00 | 10.92 |
| 2012-07-20 19:00:00 | 11.18 |
| 2012-07-20 20:00:00 | 10.92 |
| 2012-07-20 21:00:00 | 10.92 |
| 2012-07-20 22:00:00 | 11.18 |
| 2012-07-20 23:00:00 | 10.92 |
| 2012-07-21 | 10.92 |
| 2012-07-21 01:00:00 | 11.44 |
| 2012-07-21 02:00:00 | 11.44 |
| 2012-07-21 03:00:00 | 10.92 |
| 2012-07-21 04:00:00 | 11.18 |
| 2012-07-21 05:00:00 | 10.92 |
| 2012-07-21 06:00:00 | 10.92 |
| 2012-07-21 07:00:00 | 11.18 |
| 2012-07-21 08:00:00 | 11.18 |
| 2012-07-21 09:00:00 | 10.66 |
| 2012-07-21 10:00:00 | 10.92 |
| 2012-07-21 11:00:00 | 10.92 |
| 2012-07-21 12:00:00 | 10.66 |
| 2012-07-21 13:00:00 | 11.18 |
| 2012-07-21 14:00:00 | 10.92 |
| 2012-07-21 15:00:00 | 10.92 |
| 2012-07-21 16:00:00 | 10.66 |
| 2012-07-21 17:00:00 | 10.92 |
| 2012-07-21 18:00:00 | 10.66 |
| 2012-07-21 19:00:00 | 10.92 |
| 2012-07-21 20:00:00 | 11.18 |
| 2012-07-21 21:00:00 | 10.92 |
| 2012-07-21 22:00:00 | 10.92 |
| 2012-07-21 23:00:00 | 10.92 |
| 2012-07-22 | 11.18 |
| 2012-07-22 01:00:00 | 11.18 |
| 2012-07-22 02:00:00 | 11.18 |
| 2012-07-22 03:00:00 | 11.18 |
| 2012-07-22 04:00:00 | 10.92 |
| 2012-07-22 05:00:00 | 11.18 |
| 2012-07-22 06:00:00 | 10.92 |
| 2012-07-22 07:00:00 | 10.92 |
| 2012-07-22 08:00:00 | 11.18 |
| 2012-07-22 09:00:00 | 10.66 |
| 2012-07-22 10:00:00 | 10.92 |
| 2012-07-22 11:00:00 | 10.66 |
| 2012-07-22 12:00:00 | 10.92 |
| 2012-07-22 13:00:00 | 10.92 |
| 2012-07-22 14:00:00 | 10.92 |
| 2012-07-22 15:00:00 | 10.66 |
| 2012-07-22 16:00:00 | 10.66 |
| 2012-07-22 17:00:00 | 10.92 |
| 2012-07-22 18:00:00 | 10.4 |
| 2012-07-22 19:00:00 | 10.92 |
| 2012-07-22 20:00:00 | 10.92 |
| 2012-07-22 21:00:00 | 10.66 |
| 2012-07-22 22:00:00 | 10.66 |
| 2012-07-22 23:00:00 | 10.66 |
| 2012-07-23 | 10.92 |
| 2012-07-23 01:00:00 | 10.92 |
| 2012-07-23 02:00:00 | 10.92 |
| 2012-07-23 03:00:00 | 10.92 |
| 2012-07-23 04:00:00 | 10.66 |
| 2012-07-23 05:00:00 | 10.92 |
| 2012-07-23 06:00:00 | 10.66 |
| 2012-07-23 07:00:00 | 10.66 |
| 2012-07-23 08:00:00 | 10.92 |
| 2012-07-23 09:00:00 | 10.4 |
| 2012-07-23 10:00:00 | 10.66 |
| 2012-07-23 11:00:00 | 10.4 |
| 2012-07-23 12:00:00 | 10.66 |
| 2012-07-23 13:00:00 | 11.18 |
| 2012-07-23 14:00:00 | 11.18 |
| 2012-07-23 15:00:00 | 10.66 |
| 2012-07-23 16:00:00 | 10.4 |
| 2012-07-23 17:00:00 | 10.4 |
| 2012-07-23 18:00:00 | 10.66 |
| 2012-07-23 19:00:00 | 10.66 |
| 2012-07-23 20:00:00 | 10.66 |
| 2012-07-23 21:00:00 | 10.66 |
| 2012-07-23 22:00:00 | 10.92 |
| 2012-07-23 23:00:00 | 10.66 |
| 2012-07-24 | 10.66 |
| 2012-07-24 01:00:00 | 11.18 |
| 2012-07-24 02:00:00 | 10.92 |
| 2012-07-24 03:00:00 | 10.92 |
| 2012-07-24 04:00:00 | 10.66 |
| 2012-07-24 05:00:00 | 10.92 |
| 2012-07-24 06:00:00 | 10.4 |
| 2012-07-24 07:00:00 | 10.92 |
| 2012-07-24 08:00:00 | 10.92 |
| 2012-07-24 09:00:00 | 10.66 |
| 2012-07-24 10:00:00 | 10.4 |
| 2012-07-24 11:00:00 | 10.66 |
| 2012-07-24 12:00:00 | 10.66 |
| 2012-07-24 13:00:00 | 10.66 |
| 2012-07-24 14:00:00 | 10.92 |
| 2012-07-24 15:00:00 | 10.66 |
| 2012-07-24 16:00:00 | 10.66 |
| 2012-07-24 17:00:00 | 10.4 |
| 2012-07-24 18:00:00 | 10.66 |
| 2012-07-24 19:00:00 | 10.92 |
| 2012-07-24 20:00:00 | 10.66 |
| 2012-07-24 21:00:00 | 10.66 |
| 2012-07-24 22:00:00 | 10.66 |
| 2012-07-24 23:00:00 | 10.92 |
| 2012-07-25 | 10.66 |
| 2012-07-25 01:00:00 | 11.18 |
| 2012-07-25 02:00:00 | 11.18 |
| 2012-07-25 03:00:00 | 10.92 |
| 2012-07-25 04:00:00 | 10.92 |
| 2012-07-25 05:00:00 | 10.92 |
| 2012-07-25 06:00:00 | 10.92 |
| 2012-07-25 07:00:00 | 10.92 |
| 2012-07-25 08:00:00 | 10.66 |
| 2012-07-25 09:00:00 | 10.66 |
| 2012-07-25 10:00:00 | 10.66 |
| 2012-07-25 11:00:00 | 10.66 |
| 2012-07-25 12:00:00 | 10.66 |
| 2012-07-25 13:00:00 | 10.66 |
| 2012-07-25 14:00:00 | 10.92 |
| 2012-07-25 15:00:00 | 10.66 |
| 2012-07-25 16:00:00 | 10.66 |
| 2012-07-25 17:00:00 | 10.66 |
| 2012-07-25 18:00:00 | 10.66 |
| 2012-07-25 19:00:00 | 10.92 |
| 2012-07-25 20:00:00 | 10.66 |
| 2012-07-25 21:00:00 | 10.92 |
| 2012-07-25 22:00:00 | 10.92 |
| 2012-07-25 23:00:00 | 10.66 |
| 2012-07-26 | 10.92 |
| 2012-07-26 01:00:00 | 11.18 |
| 2012-07-26 02:00:00 | 11.18 |
| 2012-07-26 03:00:00 | 10.92 |
| 2012-07-26 04:00:00 | 10.92 |
| 2012-07-26 05:00:00 | 10.92 |
| 2012-07-26 06:00:00 | 10.92 |
| 2012-07-26 07:00:00 | 10.92 |
| 2012-07-26 08:00:00 | 10.92 |
| 2012-07-26 09:00:00 | 10.66 |
| 2012-07-26 10:00:00 | 10.66 |
| 2012-07-26 11:00:00 | 10.66 |
| 2012-07-26 12:00:00 | 10.66 |
| 2012-07-26 13:00:00 | 10.92 |
| 2012-07-26 14:00:00 | 10.92 |
| 2012-07-26 15:00:00 | 10.4 |
| 2012-07-26 16:00:00 | 10.66 |
| 2012-07-26 17:00:00 | 10.66 |
| 2012-07-26 18:00:00 | 10.66 |
| 2012-07-26 19:00:00 | 10.92 |
| 2012-07-26 20:00:00 | 10.92 |
| 2012-07-26 21:00:00 | 10.66 |
| 2012-07-26 22:00:00 | 10.92 |
| 2012-07-26 23:00:00 | 10.66 |
| 2012-07-27 | 10.92 |
| 2012-07-27 01:00:00 | 11.18 |
| 2012-07-27 02:00:00 | 11.18 |
| 2012-07-27 03:00:00 | 10.92 |
| 2012-07-27 04:00:00 | 10.92 |
| 2012-07-27 05:00:00 | 10.92 |
| 2012-07-27 06:00:00 | 10.66 |
| 2012-07-27 07:00:00 | 10.66 |
| 2012-07-27 08:00:00 | 10.92 |
| 2012-07-27 09:00:00 | 10.92 |
| 2012-07-27 10:00:00 | 10.92 |
| 2012-07-27 11:00:00 | 10.92 |
| 2012-07-27 12:00:00 | 10.66 |
| 2012-07-27 13:00:00 | 10.92 |
| 2012-07-27 14:00:00 | 10.66 |
| 2012-07-27 15:00:00 | 10.92 |
| 2012-07-27 16:00:00 | 10.4 |
| 2012-07-27 17:00:00 | 10.66 |
| 2012-07-27 18:00:00 | 10.4 |
| 2012-07-27 19:00:00 | 10.92 |
| 2012-07-27 20:00:00 | 10.92 |
| 2012-07-27 21:00:00 | 10.66 |
| 2012-07-27 22:00:00 | 10.92 |
| 2012-07-27 23:00:00 | 10.92 |
| 2012-07-28 | 10.92 |
| 2012-07-28 01:00:00 | 11.18 |
| 2012-07-28 02:00:00 | 11.18 |
| 2012-07-28 03:00:00 | 10.92 |
| 2012-07-28 04:00:00 | 10.92 |
| 2012-07-28 05:00:00 | 10.92 |
| 2012-07-28 06:00:00 | 10.92 |
| 2012-07-28 07:00:00 | 10.92 |
| 2012-07-28 08:00:00 | 10.92 |
| 2012-07-28 09:00:00 | 10.66 |
| 2012-07-28 10:00:00 | 10.66 |
| 2012-07-28 11:00:00 | 10.92 |
| 2012-07-28 12:00:00 | 10.4 |
| 2012-07-28 13:00:00 | 10.92 |
| 2012-07-28 14:00:00 | 10.92 |
| 2012-07-28 15:00:00 | 10.66 |
| 2012-07-28 16:00:00 | 10.66 |
| 2012-07-28 17:00:00 | 10.66 |
| 2012-07-28 18:00:00 | 10.66 |
| 2012-07-28 19:00:00 | 10.92 |
| 2012-07-28 20:00:00 | 10.92 |
| 2012-07-28 21:00:00 | 10.92 |
| 2012-07-28 22:00:00 | 10.92 |
| 2012-07-28 23:00:00 | 10.92 |
| 2012-07-29 | 10.92 |
| 2012-07-29 01:00:00 | 11.18 |
| 2012-07-29 02:00:00 | 10.92 |
| 2012-07-29 03:00:00 | 10.92 |
| 2012-07-29 04:00:00 | 11.18 |
| 2012-07-29 05:00:00 | 10.92 |
| 2012-07-29 06:00:00 | 10.66 |
| 2012-07-29 07:00:00 | 10.92 |
| 2012-07-29 08:00:00 | 10.92 |
| 2012-07-29 09:00:00 | 10.66 |
| 2012-07-29 10:00:00 | 10.4 |
| 2012-07-29 11:00:00 | 10.66 |
| 2012-07-29 12:00:00 | 10.66 |
| 2012-07-29 13:00:00 | 10.66 |
| 2012-07-29 14:00:00 | 10.92 |
| 2012-07-29 15:00:00 | 10.4 |
| 2012-07-29 16:00:00 | 10.66 |
| 2012-07-29 17:00:00 | 10.4 |
| 2012-07-29 18:00:00 | 10.66 |
| 2012-07-29 19:00:00 | 10.66 |
| 2012-07-29 20:00:00 | 10.66 |
| 2012-07-29 21:00:00 | 10.66 |
| 2012-07-29 22:00:00 | 10.92 |
| 2012-07-29 23:00:00 | 10.4 |
| 2012-07-30 | 10.92 |
| 2012-07-30 01:00:00 | 10.92 |
| 2012-07-30 02:00:00 | 10.92 |
| 2012-07-30 03:00:00 | 10.66 |
| 2012-07-30 04:00:00 | 10.66 |
| 2012-07-30 05:00:00 | 10.66 |
| 2012-07-30 06:00:00 | 10.92 |
| 2012-07-30 07:00:00 | 10.66 |
| 2012-07-30 08:00:00 | 10.66 |
| 2012-07-30 09:00:00 | 10.4 |
| 2012-07-30 10:00:00 | 10.4 |
| 2012-07-30 11:00:00 | 10.66 |
| 2012-07-30 12:00:00 | 9.1 |
| 2012-07-30 13:00:00 | 3.64 |
| 2012-07-30 14:00:00 | 12.74 |
| 2012-07-30 15:00:00 | 10.92 |
| 2012-07-30 16:00:00 | 10.4 |
| 2012-07-30 17:00:00 | 10.66 |
| 2012-07-30 18:00:00 | 10.66 |
| 2012-07-30 19:00:00 | 10.66 |
| 2012-07-30 20:00:00 | 10.66 |
| 2012-07-30 21:00:00 | 10.66 |
| 2012-07-30 22:00:00 | 10.66 |
| 2012-07-30 23:00:00 | 10.92 |
| 2012-07-31 | 10.92 |
| 2012-07-31 01:00:00 | 10.92 |
| 2012-07-31 02:00:00 | 10.92 |
| 2012-07-31 03:00:00 | 10.92 |
| 2012-07-31 04:00:00 | 10.66 |
| 2012-07-31 05:00:00 | 10.66 |
| 2012-07-31 06:00:00 | 10.66 |
| 2012-07-31 07:00:00 | 10.66 |
| 2012-07-31 08:00:00 | 10.92 |
| 2012-07-31 09:00:00 | 10.4 |
| 2012-07-31 10:00:00 | 10.4 |
| 2012-07-31 11:00:00 | 10.4 |
| 2012-07-31 12:00:00 | 10.92 |
| 2012-07-31 13:00:00 | 9.62 |
| 2012-07-31 14:00:00 | 13 |
| 2012-07-31 15:00:00 | 10.66 |
| 2012-07-31 16:00:00 | 10.66 |
| 2012-07-31 17:00:00 | 10.66 |
| 2012-07-31 18:00:00 | 10.66 |
| 2012-07-31 19:00:00 | 10.66 |
| 2012-07-31 20:00:00 | 10.92 |
| 2012-07-31 21:00:00 | 10.92 |
| 2012-07-31 22:00:00 | 10.66 |
| 2012-07-31 23:00:00 | 10.92 |
| 2012-08-01 | 10.92 |
| 2012-08-01 01:00:00 | 11.18 |
| 2012-08-01 02:00:00 | 11.18 |
| 2012-08-01 03:00:00 | 10.66 |
| 2012-08-01 04:00:00 | 11.18 |
| 2012-08-01 05:00:00 | 10.92 |
| 2012-08-01 06:00:00 | 10.66 |
| 2012-08-01 07:00:00 | 10.92 |
| 2012-08-01 08:00:00 | 10.92 |
| 2012-08-01 09:00:00 | 10.4 |
| 2012-08-01 10:00:00 | 10.66 |
| 2012-08-01 11:00:00 | 10.66 |
| 2012-08-01 12:00:00 | 10.4 |
| 2012-08-01 13:00:00 | 10.92 |
| 2012-08-01 14:00:00 | 10.92 |
| 2012-08-01 15:00:00 | 10.4 |
| 2012-08-01 16:00:00 | 10.66 |
| 2012-08-01 17:00:00 | 10.4 |
| 2012-08-01 18:00:00 | 10.66 |
| 2012-08-01 19:00:00 | 10.66 |
| 2012-08-01 20:00:00 | 10.92 |
| 2012-08-01 21:00:00 | 10.4 |
| 2012-08-01 22:00:00 | 10.92 |
| 2012-08-01 23:00:00 | 10.92 |
| 2012-08-02 | 10.92 |
| 2012-08-02 01:00:00 | 10.92 |
| 2012-08-02 02:00:00 | 11.18 |
| 2012-08-02 03:00:00 | 10.92 |
| 2012-08-02 04:00:00 | 10.92 |
| 2012-08-02 05:00:00 | 10.92 |
| 2012-08-02 06:00:00 | 10.92 |
| 2012-08-02 07:00:00 | 10.92 |
| 2012-08-02 08:00:00 | 10.66 |
| 2012-08-02 09:00:00 | 10.66 |
| 2012-08-02 10:00:00 | 10.66 |
| 2012-08-02 11:00:00 | 10.4 |
| 2012-08-02 12:00:00 | 10.66 |
| 2012-08-02 13:00:00 | 10.66 |
| 2012-08-02 14:00:00 | 10.92 |
| 2012-08-02 15:00:00 | 10.66 |
| 2012-08-02 16:00:00 | 10.4 |
| 2012-08-02 17:00:00 | 10.66 |
| 2012-08-02 18:00:00 | 10.4 |
| 2012-08-02 19:00:00 | 10.66 |
| 2012-08-02 20:00:00 | 10.92 |
| 2012-08-02 21:00:00 | 10.66 |
| 2012-08-02 22:00:00 | 10.66 |
| 2012-08-02 23:00:00 | 10.66 |
| 2012-08-03 | 10.92 |
| 2012-08-03 01:00:00 | 11.18 |
| 2012-08-03 02:00:00 | 11.18 |
| 2012-08-03 03:00:00 | 10.66 |
| 2012-08-03 04:00:00 | 10.92 |
| 2012-08-03 05:00:00 | 10.92 |
| 2012-08-03 06:00:00 | 10.66 |
| 2012-08-03 07:00:00 | 10.92 |
| 2012-08-03 08:00:00 | 10.92 |
| 2012-08-03 09:00:00 | 10.4 |
| 2012-08-03 10:00:00 | 10.92 |
| 2012-08-03 11:00:00 | 10.4 |
| 2012-08-03 12:00:00 | 10.66 |
| 2012-08-03 13:00:00 | 10.92 |
| 2012-08-03 14:00:00 | 10.66 |
| 2012-08-03 15:00:00 | 10.66 |
| 2012-08-03 16:00:00 | 10.4 |
| 2012-08-03 17:00:00 | 10.4 |
| 2012-08-03 18:00:00 | 10.66 |
| 2012-08-03 19:00:00 | 10.66 |
| 2012-08-03 20:00:00 | 10.92 |
| 2012-08-03 21:00:00 | 10.66 |
| 2012-08-03 22:00:00 | 10.66 |
| 2012-08-03 23:00:00 | 10.4 |
| 2012-08-04 | 10.92 |
| 2012-08-04 01:00:00 | 10.92 |
| 2012-08-04 02:00:00 | 10.92 |
| 2012-08-04 03:00:00 | 10.66 |
| 2012-08-04 04:00:00 | 10.66 |
| 2012-08-04 05:00:00 | 10.66 |
| 2012-08-04 06:00:00 | 10.66 |
| 2012-08-04 07:00:00 | 10.66 |
| 2012-08-04 08:00:00 | 10.66 |
| 2012-08-04 09:00:00 | 10.66 |
| 2012-08-04 10:00:00 | 10.66 |
| 2012-08-04 11:00:00 | 10.66 |
| 2012-08-04 12:00:00 | 10.4 |
| 2012-08-04 13:00:00 | 10.92 |
| 2012-08-04 14:00:00 | 10.66 |
| 2012-08-04 15:00:00 | 10.66 |
| 2012-08-04 16:00:00 | 10.4 |
| 2012-08-04 17:00:00 | 10.4 |
| 2012-08-04 18:00:00 | 10.66 |
| 2012-08-04 19:00:00 | 10.66 |
| 2012-08-04 20:00:00 | 10.66 |
| 2012-08-04 21:00:00 | 10.66 |
| 2012-08-04 22:00:00 | 10.92 |
| 2012-08-04 23:00:00 | 10.66 |
| 2012-08-05 | 10.92 |
| 2012-08-05 01:00:00 | 10.92 |
| 2012-08-05 02:00:00 | 11.18 |
| 2012-08-05 03:00:00 | 10.92 |
| 2012-08-05 04:00:00 | 10.66 |
| 2012-08-05 05:00:00 | 10.92 |
| 2012-08-05 06:00:00 | 10.66 |
| 2012-08-05 07:00:00 | 10.92 |
| 2012-08-05 08:00:00 | 10.92 |
| 2012-08-05 09:00:00 | 10.4 |
| 2012-08-05 10:00:00 | 10.66 |
| 2012-08-05 11:00:00 | 10.14 |
| 2012-08-05 12:00:00 | 10.4 |
| 2012-08-05 13:00:00 | 10.66 |
| 2012-08-05 14:00:00 | 10.4 |
| 2012-08-05 15:00:00 | 10.4 |
| 2012-08-05 16:00:00 | 10.4 |
| 2012-08-05 17:00:00 | 10.14 |
| 2012-08-05 18:00:00 | 10.4 |
| 2012-08-05 19:00:00 | 10.66 |
| 2012-08-05 20:00:00 | 10.66 |
| 2012-08-05 21:00:00 | 10.4 |
| 2012-08-05 22:00:00 | 10.4 |
| 2012-08-05 23:00:00 | 10.66 |
| 2012-08-06 | 10.4 |
| 2012-08-06 01:00:00 | 10.92 |
| 2012-08-06 02:00:00 | 10.66 |
| 2012-08-06 03:00:00 | 10.66 |
| 2012-08-06 04:00:00 | 10.66 |
| 2012-08-06 05:00:00 | 10.4 |
| 2012-08-06 06:00:00 | 10.66 |
| 2012-08-06 07:00:00 | 10.4 |
| 2012-08-06 08:00:00 | 10.66 |
| 2012-08-06 09:00:00 | 10.14 |
| 2012-08-06 10:00:00 | 10.4 |
| 2012-08-06 11:00:00 | 10.14 |
| 2012-08-06 12:00:00 | 10.4 |
| 2012-08-06 13:00:00 | 10.66 |
| 2012-08-06 14:00:00 | 10.66 |
| 2012-08-06 15:00:00 | 10.4 |
| 2012-08-06 16:00:00 | 10.4 |
| 2012-08-06 17:00:00 | 10.4 |
| 2012-08-06 18:00:00 | 10.4 |
| 2012-08-06 19:00:00 | 10.66 |
| 2012-08-06 20:00:00 | 10.14 |
| 2012-08-06 21:00:00 | 10.66 |
| 2012-08-06 22:00:00 | 10.66 |
| 2012-08-06 23:00:00 | 10.4 |
| 2012-08-07 | 5.46 |
| 2012-08-07 01:00:00 | 3.9 |
| 2012-08-07 02:00:00 | 4.42 |
| 2012-08-07 03:00:00 | 3.9 |
| 2012-08-07 04:00:00 | 3.9 |
| 2012-08-07 05:00:00 | 4.16 |
| 2012-08-07 06:00:00 | 3.9 |
| 2012-08-07 07:00:00 | 3.64 |
| 2012-08-07 08:00:00 | 4.16 |
| 2012-08-07 09:00:00 | 11.96 |
| 2012-08-07 10:00:00 | 11.44 |
| 2012-08-07 11:00:00 | 6.24 |
| 2012-08-07 12:00:00 | 8.84 |
| 2012-08-07 13:00:00 | 12.22 |
| 2012-08-07 14:00:00 | 10.66 |
| 2012-08-07 15:00:00 | 10.4 |
| 2012-08-07 16:00:00 | 10.66 |
| 2012-08-07 17:00:00 | 10.4 |
| 2012-08-07 18:00:00 | 10.4 |
| 2012-08-07 19:00:00 | 10.92 |
| 2012-08-07 20:00:00 | 10.66 |
| 2012-08-07 21:00:00 | 10.66 |
| 2012-08-07 22:00:00 | 10.92 |
| 2012-08-07 23:00:00 | 10.66 |
| 2012-08-08 | 10.66 |
| 2012-08-08 01:00:00 | 10.92 |
| 2012-08-08 02:00:00 | 11.18 |
| 2012-08-08 03:00:00 | 10.66 |
| 2012-08-08 04:00:00 | 10.92 |
| 2012-08-08 05:00:00 | 10.66 |
| 2012-08-08 06:00:00 | 10.66 |
| 2012-08-08 07:00:00 | 10.66 |
| 2012-08-08 08:00:00 | 10.66 |
| 2012-08-08 09:00:00 | 10.66 |
| 2012-08-08 10:00:00 | 10.4 |
| 2012-08-08 11:00:00 | 10.4 |
| 2012-08-08 12:00:00 | 10.4 |
| 2012-08-08 13:00:00 | 10.66 |
| 2012-08-08 14:00:00 | 10.66 |
| 2012-08-08 15:00:00 | 10.4 |
| 2012-08-08 16:00:00 | 10.4 |
| 2012-08-08 17:00:00 | 10.66 |
| 2012-08-08 18:00:00 | 10.4 |
| 2012-08-08 19:00:00 | 10.66 |
| 2012-08-08 20:00:00 | 10.4 |
| 2012-08-08 21:00:00 | 10.66 |
| 2012-08-08 22:00:00 | 10.66 |
| 2012-08-08 23:00:00 | 10.66 |
| 2012-08-09 | 10.66 |
| 2012-08-09 01:00:00 | 10.92 |
| 2012-08-09 02:00:00 | 10.92 |
| 2012-08-09 03:00:00 | 10.66 |
| 2012-08-09 04:00:00 | 10.92 |
| 2012-08-09 05:00:00 | 10.66 |
| 2012-08-09 06:00:00 | 10.4 |
| 2012-08-09 07:00:00 | 10.66 |
| 2012-08-09 08:00:00 | 10.4 |
| 2012-08-09 09:00:00 | 10.4 |
| 2012-08-09 10:00:00 | 10.4 |
| 2012-08-09 11:00:00 | 10.4 |
| 2012-08-09 12:00:00 | 10.66 |
| 2012-08-09 13:00:00 | 11.18 |
| 2012-08-09 14:00:00 | 10.66 |
| 2012-08-09 15:00:00 | 10.14 |
| 2012-08-09 16:00:00 | 10.4 |
| 2012-08-09 17:00:00 | 10.4 |
| 2012-08-09 18:00:00 | 10.4 |
| 2012-08-09 19:00:00 | 10.92 |
| 2012-08-09 20:00:00 | 10.66 |
| 2012-08-09 21:00:00 | 10.4 |
| 2012-08-09 22:00:00 | 10.66 |
| 2012-08-09 23:00:00 | 10.66 |
| 2012-08-10 | 10.66 |
| 2012-08-10 01:00:00 | 10.66 |
| 2012-08-10 02:00:00 | 10.92 |
| 2012-08-10 03:00:00 | 10.66 |
| 2012-08-10 04:00:00 | 10.92 |
| 2012-08-10 05:00:00 | 10.4 |
| 2012-08-10 06:00:00 | 10.66 |
| 2012-08-10 07:00:00 | 10.66 |
| 2012-08-10 08:00:00 | 10.66 |
| 2012-08-10 09:00:00 | 10.4 |
| 2012-08-10 10:00:00 | 10.4 |
| 2012-08-10 11:00:00 | 10.4 |
| 2012-08-10 12:00:00 | 10.4 |
| 2012-08-10 13:00:00 | 10.92 |
| 2012-08-10 14:00:00 | 10.4 |
| 2012-08-10 15:00:00 | 10.4 |
| 2012-08-10 16:00:00 | 10.4 |
| 2012-08-10 17:00:00 | 10.14 |
| 2012-08-10 18:00:00 | 10.4 |
| 2012-08-10 19:00:00 | 10.4 |
| 2012-08-10 20:00:00 | 10.4 |
| 2012-08-10 21:00:00 | 10.66 |
| 2012-08-10 22:00:00 | 10.4 |
| 2012-08-10 23:00:00 | 10.66 |
| 2012-08-11 | 10.4 |
| 2012-08-11 01:00:00 | 10.92 |
| 2012-08-11 02:00:00 | 10.66 |
| 2012-08-11 03:00:00 | 10.66 |
| 2012-08-11 04:00:00 | 10.4 |
| 2012-08-11 05:00:00 | 10.66 |
| 2012-08-11 06:00:00 | 10.4 |
| 2012-08-11 07:00:00 | 10.92 |
| 2012-08-11 08:00:00 | 10.4 |
| 2012-08-11 09:00:00 | 10.4 |
| 2012-08-11 10:00:00 | 10.92 |
| 2012-08-11 11:00:00 | 11.18 |
| 2012-08-11 12:00:00 | 10.4 |
| 2012-08-11 13:00:00 | 10.4 |
| 2012-08-11 14:00:00 | 10.4 |
| 2012-08-11 15:00:00 | 10.4 |
| 2012-08-11 16:00:00 | 10.14 |
| 2012-08-11 17:00:00 | 10.4 |
| 2012-08-11 18:00:00 | 10.14 |
| 2012-08-11 19:00:00 | 10.66 |
| 2012-08-11 20:00:00 | 10.4 |
| 2012-08-11 21:00:00 | 10.66 |
| 2012-08-11 22:00:00 | 10.4 |
| 2012-08-11 23:00:00 | 10.66 |
| 2012-08-12 | 10.4 |
| 2012-08-12 01:00:00 | 10.66 |
| 2012-08-12 02:00:00 | 10.92 |
| 2012-08-12 03:00:00 | 10.4 |
| 2012-08-12 04:00:00 | 10.66 |
| 2012-08-12 05:00:00 | 10.66 |
| 2012-08-12 06:00:00 | 10.4 |
| 2012-08-12 07:00:00 | 10.66 |
| 2012-08-12 08:00:00 | 10.4 |
| 2012-08-12 09:00:00 | 10.66 |
| 2012-08-12 10:00:00 | 10.4 |
| 2012-08-12 11:00:00 | 10.4 |
| 2012-08-12 12:00:00 | 10.4 |
| 2012-08-12 13:00:00 | 10.66 |
| 2012-08-12 14:00:00 | 10.66 |
| 2012-08-12 15:00:00 | 10.4 |
| 2012-08-12 16:00:00 | 10.4 |
| 2012-08-12 17:00:00 | 10.4 |
| 2012-08-12 18:00:00 | 10.4 |
| 2012-08-12 19:00:00 | 10.66 |
| 2012-08-12 20:00:00 | 10.66 |
| 2012-08-12 21:00:00 | 10.66 |
| 2012-08-12 22:00:00 | 10.66 |
| 2012-08-12 23:00:00 | 10.66 |
| 2012-08-13 | 10.66 |
| 2012-08-13 01:00:00 | 10.92 |
| 2012-08-13 02:00:00 | 10.92 |
| 2012-08-13 03:00:00 | 10.66 |
| 2012-08-13 04:00:00 | 10.66 |
| 2012-08-13 05:00:00 | 10.66 |
| 2012-08-13 06:00:00 | 10.66 |
| 2012-08-13 07:00:00 | 10.66 |
| 2012-08-13 08:00:00 | 10.66 |
| 2012-08-13 09:00:00 | 10.4 |
| 2012-08-13 10:00:00 | 10.4 |
| 2012-08-13 11:00:00 | 10.4 |
| 2012-08-13 12:00:00 | 10.4 |
| 2012-08-13 13:00:00 | 10.66 |
| 2012-08-13 14:00:00 | 10.66 |
| 2012-08-13 15:00:00 | 10.4 |
| 2012-08-13 16:00:00 | 10.14 |
| 2012-08-13 17:00:00 | 10.4 |
| 2012-08-13 18:00:00 | 10.4 |
| 2012-08-13 19:00:00 | 10.66 |
| 2012-08-13 20:00:00 | 10.66 |
| 2012-08-13 21:00:00 | 10.4 |
| 2012-08-13 22:00:00 | 10.66 |
| 2012-08-13 23:00:00 | 10.4 |
| 2012-08-14 | 10.66 |
| 2012-08-14 01:00:00 | 10.92 |
| 2012-08-14 02:00:00 | 10.92 |
| 2012-08-14 03:00:00 | 10.4 |
| 2012-08-14 04:00:00 | 10.66 |
| 2012-08-14 05:00:00 | 10.66 |
| 2012-08-14 06:00:00 | 10.66 |
| 2012-08-14 07:00:00 | 10.66 |
| 2012-08-14 08:00:00 | 10.4 |
| 2012-08-14 09:00:00 | 10.4 |
| 2012-08-14 10:00:00 | 10.4 |
| 2012-08-14 11:00:00 | 10.4 |
| 2012-08-14 12:00:00 | 10.4 |
| 2012-08-14 13:00:00 | 10.66 |
| 2012-08-14 14:00:00 | 10.66 |
| 2012-08-14 15:00:00 | 10.4 |
| 2012-08-14 16:00:00 | 10.4 |
| 2012-08-14 17:00:00 | 10.4 |
| 2012-08-14 18:00:00 | 10.4 |
| 2012-08-14 19:00:00 | 10.66 |
| 2012-08-14 20:00:00 | 10.66 |
| 2012-08-14 21:00:00 | 10.4 |
| 2012-08-14 22:00:00 | 10.66 |
| 2012-08-14 23:00:00 | 10.66 |
| 2012-08-15 | 10.66 |
| 2012-08-15 01:00:00 | 10.92 |
| 2012-08-15 02:00:00 | 10.92 |
| 2012-08-15 03:00:00 | 10.66 |
| 2012-08-15 04:00:00 | 10.66 |
| 2012-08-15 05:00:00 | 10.66 |
| 2012-08-15 06:00:00 | 10.4 |
| 2012-08-15 07:00:00 | 10.66 |
| 2012-08-15 08:00:00 | 10.66 |
| 2012-08-15 09:00:00 | 10.14 |
| 2012-08-15 10:00:00 | 10.4 |
| 2012-08-15 11:00:00 | 10.4 |
| 2012-08-15 12:00:00 | 10.4 |
| 2012-08-15 13:00:00 | 10.4 |
| 2012-08-15 14:00:00 | 10.66 |
| 2012-08-15 15:00:00 | 10.4 |
| 2012-08-15 16:00:00 | 10.4 |
| 2012-08-15 17:00:00 | 10.14 |
| 2012-08-15 18:00:00 | 10.4 |
| 2012-08-15 19:00:00 | 10.66 |
| 2012-08-15 20:00:00 | 10.66 |
| 2012-08-15 21:00:00 | 10.4 |
| 2012-08-15 22:00:00 | 10.66 |
| 2012-08-15 23:00:00 | 10.66 |
| 2012-08-16 | 10.66 |
| 2012-08-16 01:00:00 | 10.92 |
| 2012-08-16 02:00:00 | 10.66 |
| 2012-08-16 03:00:00 | 10.66 |
| 2012-08-16 04:00:00 | 10.66 |
| 2012-08-16 05:00:00 | 10.66 |
| 2012-08-16 06:00:00 | 10.66 |
| 2012-08-16 07:00:00 | 10.66 |
| 2012-08-16 08:00:00 | 10.4 |
| 2012-08-16 09:00:00 | 10.66 |
| 2012-08-16 10:00:00 | 10.14 |
| 2012-08-16 11:00:00 | 10.4 |
| 2012-08-16 12:00:00 | 10.4 |
| 2012-08-16 13:00:00 | 10.4 |
| 2012-08-16 14:00:00 | 10.66 |
| 2012-08-16 15:00:00 | 10.4 |
| 2012-08-16 16:00:00 | 10.14 |
| 2012-08-16 17:00:00 | 10.4 |
| 2012-08-16 18:00:00 | 10.4 |
| 2012-08-16 19:00:00 | 10.4 |
| 2012-08-16 20:00:00 | 10.66 |
| 2012-08-16 21:00:00 | 10.4 |
| 2012-08-16 22:00:00 | 10.66 |
| 2012-08-16 23:00:00 | 10.4 |
| 2012-08-17 | 10.66 |
| 2012-08-17 01:00:00 | 10.92 |
| 2012-08-17 02:00:00 | 9.36 |
| 2012-08-17 03:00:00 | 8.58 |
| 2012-08-17 04:00:00 | 4.94 |
| 2012-08-17 05:00:00 | 4.16 |
| 2012-08-17 06:00:00 | 3.9 |
| 2012-08-17 07:00:00 | 3.9 |
| 2012-08-17 08:00:00 | 9.36 |
| 2012-08-17 09:00:00 | 11.7 |
| 2012-08-17 10:00:00 | 10.92 |
| 2012-08-17 11:00:00 | 10.4 |
| 2012-08-17 12:00:00 | 10.14 |
| 2012-08-17 13:00:00 | 10.66 |
| 2012-08-17 14:00:00 | 10.4 |
| 2012-08-17 15:00:00 | 10.4 |
| 2012-08-17 16:00:00 | 10.4 |
| 2012-08-17 17:00:00 | 10.14 |
| 2012-08-17 18:00:00 | 10.4 |
| 2012-08-17 19:00:00 | 10.66 |
| 2012-08-17 20:00:00 | 10.4 |
| 2012-08-17 21:00:00 | 10.66 |
| 2012-08-17 22:00:00 | 10.4 |
| 2012-08-17 23:00:00 | 10.66 |
| 2012-08-18 | 10.4 |
| 2012-08-18 01:00:00 | 10.92 |
| 2012-08-18 02:00:00 | 10.92 |
| 2012-08-18 03:00:00 | 10.4 |
| 2012-08-18 04:00:00 | 10.66 |
| 2012-08-18 05:00:00 | 10.4 |
| 2012-08-18 06:00:00 | 10.66 |
| 2012-08-18 07:00:00 | 10.4 |
| 2012-08-18 08:00:00 | 10.66 |
| 2012-08-18 09:00:00 | 10.92 |
| 2012-08-18 10:00:00 | 12.22 |
| 2012-08-18 11:00:00 | 10.4 |
| 2012-08-18 12:00:00 | 10.14 |
| 2012-08-18 13:00:00 | 10.4 |
| 2012-08-18 14:00:00 | 10.66 |
| 2012-08-18 15:00:00 | 10.14 |
| 2012-08-18 16:00:00 | 10.4 |
| 2012-08-18 17:00:00 | 10.14 |
| 2012-08-18 18:00:00 | 10.4 |
| 2012-08-18 19:00:00 | 10.66 |
| 2012-08-18 20:00:00 | 10.66 |
| 2012-08-18 21:00:00 | 10.4 |
| 2012-08-18 22:00:00 | 10.66 |
| 2012-08-18 23:00:00 | 10.4 |
| 2012-08-19 | 10.66 |
| 2012-08-19 01:00:00 | 10.66 |
| 2012-08-19 02:00:00 | 10.92 |
| 2012-08-19 03:00:00 | 10.66 |
| 2012-08-19 04:00:00 | 10.66 |
| 2012-08-19 05:00:00 | 10.4 |
| 2012-08-19 06:00:00 | 10.4 |
| 2012-08-19 07:00:00 | 10.66 |
| 2012-08-19 08:00:00 | 10.66 |
| 2012-08-19 09:00:00 | 10.14 |
| 2012-08-19 10:00:00 | 10.14 |
| 2012-08-19 11:00:00 | 9.88 |
| 2012-08-19 12:00:00 | 10.14 |
| 2012-08-19 13:00:00 | 10.4 |
| 2012-08-19 14:00:00 | 10.14 |
| 2012-08-19 15:00:00 | 10.14 |
| 2012-08-19 16:00:00 | 10.14 |
| 2012-08-19 17:00:00 | 10.14 |
| 2012-08-19 18:00:00 | 10.14 |
| 2012-08-19 19:00:00 | 10.14 |
| 2012-08-19 20:00:00 | 10.4 |
| 2012-08-19 21:00:00 | 10.4 |
| 2012-08-19 22:00:00 | 10.14 |
| 2012-08-19 23:00:00 | 10.4 |
| 2012-08-20 | 10.4 |
| 2012-08-20 01:00:00 | 10.4 |
| 2012-08-20 02:00:00 | 10.4 |
| 2012-08-20 03:00:00 | 10.4 |
| 2012-08-20 04:00:00 | 10.4 |
| 2012-08-20 05:00:00 | 10.4 |
| 2012-08-20 06:00:00 | 10.14 |
| 2012-08-20 07:00:00 | 10.4 |
| 2012-08-20 08:00:00 | 10.4 |
| 2012-08-20 09:00:00 | 9.88 |
| 2012-08-20 10:00:00 | 10.14 |
| 2012-08-20 11:00:00 | 10.14 |
| 2012-08-20 12:00:00 | 9.88 |
| 2012-08-20 13:00:00 | 10.4 |
| 2012-08-20 14:00:00 | 10.14 |
| 2012-08-20 15:00:00 | 10.14 |
| 2012-08-20 16:00:00 | 9.88 |
| 2012-08-20 17:00:00 | 10.14 |
| 2012-08-20 18:00:00 | 10.14 |
| 2012-08-20 19:00:00 | 10.14 |
| 2012-08-20 20:00:00 | 10.14 |
| 2012-08-20 21:00:00 | 10.14 |
| 2012-08-20 22:00:00 | 10.4 |
| 2012-08-20 23:00:00 | 10.14 |
| 2012-08-21 | 10.4 |
| 2012-08-21 01:00:00 | 10.66 |
| 2012-08-21 02:00:00 | 10.4 |
| 2012-08-21 03:00:00 | 10.4 |
| 2012-08-21 04:00:00 | 10.4 |
| 2012-08-21 05:00:00 | 10.4 |
| 2012-08-21 06:00:00 | 10.14 |
| 2012-08-21 07:00:00 | 10.4 |
| 2012-08-21 08:00:00 | 10.14 |
| 2012-08-21 09:00:00 | 10.14 |
| 2012-08-21 10:00:00 | 10.14 |
| 2012-08-21 11:00:00 | 9.88 |
| 2012-08-21 12:00:00 | 10.14 |
| 2012-08-21 13:00:00 | 10.4 |
| 2012-08-21 14:00:00 | 10.4 |
| 2012-08-21 15:00:00 | 10.14 |
| 2012-08-21 16:00:00 | 10.14 |
| 2012-08-21 17:00:00 | 9.88 |
| 2012-08-21 18:00:00 | 10.14 |
| 2012-08-21 19:00:00 | 10.4 |
| 2012-08-21 20:00:00 | 10.14 |
| 2012-08-21 21:00:00 | 10.4 |
| 2012-08-21 22:00:00 | 10.4 |
| 2012-08-21 23:00:00 | 10.14 |
| 2012-08-22 | 10.4 |
| 2012-08-22 01:00:00 | 10.92 |
| 2012-08-22 02:00:00 | 10.66 |
| 2012-08-22 03:00:00 | 10.14 |
| 2012-08-22 04:00:00 | 10.4 |
| 2012-08-22 05:00:00 | 10.4 |
| 2012-08-22 06:00:00 | 10.4 |
| 2012-08-22 07:00:00 | 10.14 |
| 2012-08-22 08:00:00 | 10.4 |
| 2012-08-22 09:00:00 | 10.14 |
| 2012-08-22 10:00:00 | 9.88 |
| 2012-08-22 11:00:00 | 10.14 |
| 2012-08-22 12:00:00 | 9.88 |
| 2012-08-22 13:00:00 | 10.4 |
| 2012-08-22 14:00:00 | 10.14 |
| 2012-08-22 15:00:00 | 10.14 |
| 2012-08-22 16:00:00 | 10.14 |
| 2012-08-22 17:00:00 | 9.88 |
| 2012-08-22 18:00:00 | 10.14 |
| 2012-08-22 19:00:00 | 10.14 |
| 2012-08-22 20:00:00 | 10.4 |
| 2012-08-22 21:00:00 | 10.14 |
| 2012-08-22 22:00:00 | 10.14 |
| 2012-08-22 23:00:00 | 10.14 |
| 2012-08-23 | 10.4 |
| 2012-08-23 01:00:00 | 10.4 |
| 2012-08-23 02:00:00 | 10.66 |
| 2012-08-23 03:00:00 | 10.4 |
| 2012-08-23 04:00:00 | 10.4 |
| 2012-08-23 05:00:00 | 10.4 |
| 2012-08-23 06:00:00 | 10.14 |
| 2012-08-23 07:00:00 | 10.4 |
| 2012-08-23 08:00:00 | 10.14 |
| 2012-08-23 09:00:00 | 10.14 |
| 2012-08-23 10:00:00 | 9.88 |
| 2012-08-23 11:00:00 | 10.14 |
| 2012-08-23 12:00:00 | 10.66 |
| 2012-08-23 13:00:00 | 10.4 |
| 2012-08-23 14:00:00 | 10.66 |
| 2012-08-23 15:00:00 | 10.4 |
| 2012-08-23 16:00:00 | 10.4 |
| 2012-08-23 17:00:00 | 10.4 |
| 2012-08-23 18:00:00 | 10.66 |
| 2012-08-23 19:00:00 | 10.4 |
| 2012-08-23 20:00:00 | 10.4 |
| 2012-08-23 21:00:00 | 10.66 |
| 2012-08-23 22:00:00 | 10.92 |
| 2012-08-23 23:00:00 | 10.66 |
| 2012-08-24 | 10.92 |
| 2012-08-24 01:00:00 | 10.66 |
| 2012-08-24 02:00:00 | 10.92 |
| 2012-08-24 03:00:00 | 10.66 |
| 2012-08-24 04:00:00 | 10.92 |
| 2012-08-24 05:00:00 | 10.66 |
| 2012-08-24 06:00:00 | 10.92 |
| 2012-08-24 07:00:00 | 10.4 |
| 2012-08-24 08:00:00 | 10.4 |
| 2012-08-24 09:00:00 | 10.66 |
| 2012-08-24 10:00:00 | 10.4 |
| 2012-08-24 11:00:00 | 10.66 |
| 2012-08-24 12:00:00 | 10.4 |
| 2012-08-24 13:00:00 | 10.4 |
| 2012-08-24 14:00:00 | 10.4 |
| 2012-08-24 15:00:00 | 10.4 |
| 2012-08-24 16:00:00 | 10.4 |
| 2012-08-24 17:00:00 | 10.4 |
| 2012-08-24 18:00:00 | 10.66 |
| 2012-08-24 19:00:00 | 10.4 |
| 2012-08-24 20:00:00 | 10.4 |
| 2012-08-24 21:00:00 | 10.66 |
| 2012-08-24 22:00:00 | 10.66 |
| 2012-08-24 23:00:00 | 10.66 |
| 2012-08-25 | 10.66 |
| 2012-08-25 01:00:00 | 10.92 |
| 2012-08-25 02:00:00 | 10.66 |
| 2012-08-25 03:00:00 | 10.66 |
| 2012-08-25 04:00:00 | 10.92 |
| 2012-08-25 05:00:00 | 10.66 |
| 2012-08-25 06:00:00 | 10.92 |
| 2012-08-25 07:00:00 | 10.4 |
| 2012-08-25 08:00:00 | 10.66 |
| 2012-08-25 09:00:00 | 10.4 |
| 2012-08-25 10:00:00 | 10.4 |
| 2012-08-25 11:00:00 | 10.66 |
| 2012-08-25 12:00:00 | 10.4 |
| 2012-08-25 13:00:00 | 10.4 |
| 2012-08-25 14:00:00 | 10.4 |
| 2012-08-25 15:00:00 | 10.66 |
| 2012-08-25 16:00:00 | 10.4 |
| 2012-08-25 17:00:00 | 10.14 |
| 2012-08-25 18:00:00 | 10.4 |
| 2012-08-25 19:00:00 | 10.66 |
| 2012-08-25 20:00:00 | 10.4 |
| 2012-08-25 21:00:00 | 10.66 |
| 2012-08-25 22:00:00 | 10.66 |
| 2012-08-25 23:00:00 | 10.66 |
| 2012-08-26 | 10.66 |
| 2012-08-26 01:00:00 | 10.66 |
| 2012-08-26 02:00:00 | 10.66 |
| 2012-08-26 03:00:00 | 10.66 |
| 2012-08-26 04:00:00 | 10.66 |
| 2012-08-26 05:00:00 | 10.66 |
| 2012-08-26 06:00:00 | 10.66 |
| 2012-08-26 07:00:00 | 10.4 |
| 2012-08-26 08:00:00 | 10.66 |
| 2012-08-26 09:00:00 | 10.4 |
| 2012-08-26 10:00:00 | 10.66 |
| 2012-08-26 11:00:00 | 10.4 |
| 2012-08-26 12:00:00 | 10.66 |
| 2012-08-26 13:00:00 | 10.66 |
| 2012-08-26 14:00:00 | 10.66 |
| 2012-08-26 15:00:00 | 10.66 |
| 2012-08-26 16:00:00 | 10.66 |
| 2012-08-26 17:00:00 | 10.92 |
| 2012-08-26 18:00:00 | 10.66 |
| 2012-08-26 19:00:00 | 10.66 |
| 2012-08-26 20:00:00 | 10.66 |
| 2012-08-26 21:00:00 | 10.92 |
| 2012-08-26 22:00:00 | 10.92 |
| 2012-08-26 23:00:00 | 10.66 |
| 2012-08-27 | 10.92 |
| 2012-08-27 01:00:00 | 10.92 |
| 2012-08-27 02:00:00 | 10.92 |
| 2012-08-27 03:00:00 | 11.18 |
| 2012-08-27 04:00:00 | 10.92 |
| 2012-08-27 05:00:00 | 10.92 |
| 2012-08-27 06:00:00 | 10.92 |
| 2012-08-27 07:00:00 | 10.66 |
| 2012-08-27 08:00:00 | 10.66 |
| 2012-08-27 09:00:00 | 11.7 |
| 2012-08-27 10:00:00 | 10.92 |
| 2012-08-27 11:00:00 | 10.66 |
| 2012-08-27 12:00:00 | 10.4 |
| 2012-08-27 13:00:00 | 10.66 |
| 2012-08-27 14:00:00 | 10.66 |
| 2012-08-27 15:00:00 | 10.66 |
| 2012-08-27 16:00:00 | 10.66 |
| 2012-08-27 17:00:00 | 10.66 |
| 2012-08-27 18:00:00 | 10.66 |
| 2012-08-27 19:00:00 | 10.66 |
| 2012-08-27 20:00:00 | 10.66 |
| 2012-08-27 21:00:00 | 10.66 |
| 2012-08-27 22:00:00 | 10.66 |
| 2012-08-27 23:00:00 | 10.92 |
| 2012-08-28 | 10.66 |
| 2012-08-28 01:00:00 | 10.92 |
| 2012-08-28 02:00:00 | 10.66 |
| 2012-08-28 03:00:00 | 10.92 |
| 2012-08-28 04:00:00 | 10.92 |
| 2012-08-28 05:00:00 | 10.66 |
| 2012-08-28 06:00:00 | 10.66 |
| 2012-08-28 07:00:00 | 10.66 |
| 2012-08-28 08:00:00 | 10.66 |
| 2012-08-28 09:00:00 | 10.4 |
| 2012-08-28 10:00:00 | 10.66 |
| 2012-08-28 11:00:00 | 10.4 |
| 2012-08-28 12:00:00 | 10.66 |
| 2012-08-28 13:00:00 | 10.4 |
| 2012-08-28 14:00:00 | 10.66 |
| 2012-08-28 15:00:00 | 10.4 |
| 2012-08-28 16:00:00 | 10.4 |
| 2012-08-28 17:00:00 | 10.66 |
| 2012-08-28 18:00:00 | 10.4 |
| 2012-08-28 19:00:00 | 10.4 |
| 2012-08-28 20:00:00 | 10.66 |
| 2012-08-28 21:00:00 | 10.66 |
| 2012-08-28 22:00:00 | 10.66 |
| 2012-08-28 23:00:00 | 10.4 |
| 2012-08-29 | 10.92 |
| 2012-08-29 01:00:00 | 10.66 |
| 2012-08-29 02:00:00 | 10.66 |
| 2012-08-29 03:00:00 | 10.66 |
| 2012-08-29 04:00:00 | 10.66 |
| 2012-08-29 05:00:00 | 10.92 |
| 2012-08-29 06:00:00 | 10.66 |
| 2012-08-29 07:00:00 | 10.4 |
| 2012-08-29 08:00:00 | 10.4 |
| 2012-08-29 09:00:00 | 10.66 |
| 2012-08-29 10:00:00 | 10.4 |
| 2012-08-29 11:00:00 | 10.4 |
| 2012-08-29 12:00:00 | 10.4 |
| 2012-08-29 13:00:00 | 10.66 |
| 2012-08-29 14:00:00 | 10.4 |
| 2012-08-29 15:00:00 | 10.4 |
| 2012-08-29 16:00:00 | 10.4 |
| 2012-08-29 17:00:00 | 10.66 |
| 2012-08-29 18:00:00 | 10.4 |
| 2012-08-29 19:00:00 | 10.4 |
| 2012-08-29 20:00:00 | 10.4 |
| 2012-08-29 21:00:00 | 10.66 |
| 2012-08-29 22:00:00 | 10.66 |
| 2012-08-29 23:00:00 | 10.66 |
| 2012-08-30 | 10.66 |
| 2012-08-30 01:00:00 | 10.66 |
| 2012-08-30 02:00:00 | 10.92 |
| 2012-08-30 03:00:00 | 10.66 |
| 2012-08-30 04:00:00 | 10.66 |
| 2012-08-30 05:00:00 | 10.66 |
| 2012-08-30 06:00:00 | 10.66 |
| 2012-08-30 07:00:00 | 10.4 |
| 2012-08-30 08:00:00 | 10.4 |
| 2012-08-30 09:00:00 | 10.66 |
| 2012-08-30 10:00:00 | 10.4 |
| 2012-08-30 11:00:00 | 10.4 |
| 2012-08-30 12:00:00 | 10.4 |
| 2012-08-30 13:00:00 | 10.66 |
| 2012-08-30 14:00:00 | 10.4 |
| 2012-08-30 15:00:00 | 10.4 |
| 2012-08-30 16:00:00 | 10.4 |
| 2012-08-30 17:00:00 | 10.4 |
| 2012-08-30 18:00:00 | 10.66 |
| 2012-08-30 19:00:00 | 10.4 |
| 2012-08-30 20:00:00 | 10.4 |
| 2012-08-30 21:00:00 | 10.66 |
| 2012-08-30 22:00:00 | 10.66 |
| 2012-08-30 23:00:00 | 10.66 |
| 2012-08-31 | 10.66 |
| 2012-08-31 01:00:00 | 10.66 |
| 2012-08-31 02:00:00 | 10.92 |
| 2012-08-31 03:00:00 | 10.66 |
| 2012-08-31 04:00:00 | 10.92 |
| 2012-08-31 05:00:00 | 10.66 |
| 2012-08-31 06:00:00 | 10.92 |
| 2012-08-31 07:00:00 | 10.4 |
| 2012-08-31 08:00:00 | 10.4 |
| 2012-08-31 09:00:00 | 10.4 |
| 2012-08-31 10:00:00 | 10.66 |
| 2012-08-31 11:00:00 | 10.4 |
| 2012-08-31 12:00:00 | 10.4 |
| 2012-08-31 13:00:00 | 10.4 |
| 2012-08-31 14:00:00 | 10.4 |
| 2012-08-31 15:00:00 | 10.66 |
| 2012-08-31 16:00:00 | 10.4 |
| 2012-08-31 17:00:00 | 10.4 |
| 2012-08-31 18:00:00 | 10.4 |
| 2012-08-31 19:00:00 | 10.66 |
| 2012-08-31 20:00:00 | 10.66 |
| 2012-08-31 21:00:00 | 10.66 |
| 2012-08-31 22:00:00 | 10.66 |
| 2012-08-31 23:00:00 | 10.92 |
| 2012-09-01 | 10.66 |
| 2012-09-01 01:00:00 | 10.66 |
| 2012-09-01 02:00:00 | 10.92 |
| 2012-09-01 03:00:00 | 10.66 |
| 2012-09-01 04:00:00 | 10.92 |
| 2012-09-01 05:00:00 | 10.66 |
| 2012-09-01 06:00:00 | 10.66 |
| 2012-09-01 07:00:00 | 10.66 |
| 2012-09-01 08:00:00 | 10.4 |
| 2012-09-01 09:00:00 | 10.66 |
| 2012-09-01 10:00:00 | 12.48 |
| 2012-09-01 11:00:00 | 12.22 |
| 2012-09-01 12:00:00 | 10.4 |
| 2012-09-01 13:00:00 | 10.4 |
| 2012-09-01 14:00:00 | 10.66 |
| 2012-09-01 15:00:00 | 10.4 |
| 2012-09-01 16:00:00 | 10.4 |
| 2012-09-01 17:00:00 | 10.4 |
| 2012-09-01 18:00:00 | 10.4 |
| 2012-09-01 19:00:00 | 10.4 |
| 2012-09-01 20:00:00 | 10.66 |
| 2012-09-01 21:00:00 | 10.66 |
| 2012-09-01 22:00:00 | 10.92 |
| 2012-09-01 23:00:00 | 10.66 |
| 2012-09-02 | 10.66 |
| 2012-09-02 01:00:00 | 10.66 |
| 2012-09-02 02:00:00 | 10.66 |
| 2012-09-02 03:00:00 | 10.66 |
| 2012-09-02 04:00:00 | 10.66 |
| 2012-09-02 05:00:00 | 10.66 |
| 2012-09-02 06:00:00 | 10.66 |
| 2012-09-02 07:00:00 | 10.66 |
| 2012-09-02 08:00:00 | 10.4 |
| 2012-09-02 09:00:00 | 10.4 |
| 2012-09-02 10:00:00 | 10.14 |
| 2012-09-02 11:00:00 | 10.4 |
| 2012-09-02 12:00:00 | 10.4 |
| 2012-09-02 13:00:00 | 10.14 |
| 2012-09-02 14:00:00 | 10.4 |
| 2012-09-02 15:00:00 | 10.14 |
| 2012-09-02 16:00:00 | 10.14 |
| 2012-09-02 17:00:00 | 10.4 |
| 2012-09-02 18:00:00 | 10.14 |
| 2012-09-02 19:00:00 | 10.4 |
| 2012-09-02 20:00:00 | 10.4 |
| 2012-09-02 21:00:00 | 10.4 |
| 2012-09-02 22:00:00 | 10.4 |
| 2012-09-02 23:00:00 | 10.66 |
| 2012-09-03 | 10.66 |
| 2012-09-03 01:00:00 | 10.4 |
| 2012-09-03 02:00:00 | 10.4 |
| 2012-09-03 03:00:00 | 10.66 |
| 2012-09-03 04:00:00 | 10.4 |
| 2012-09-03 05:00:00 | 10.66 |
| 2012-09-03 06:00:00 | 10.4 |
| 2012-09-03 07:00:00 | 10.4 |
| 2012-09-03 08:00:00 | 10.14 |
| 2012-09-03 09:00:00 | 10.4 |
| 2012-09-03 10:00:00 | 10.4 |
| 2012-09-03 11:00:00 | 10.14 |
| 2012-09-03 12:00:00 | 10.14 |
| 2012-09-03 13:00:00 | 10.14 |
| 2012-09-03 14:00:00 | 10.4 |
| 2012-09-03 15:00:00 | 10.14 |
| 2012-09-03 16:00:00 | 10.14 |
| 2012-09-03 17:00:00 | 10.14 |
| 2012-09-03 18:00:00 | 10.4 |
| 2012-09-03 19:00:00 | 10.14 |
| 2012-09-03 20:00:00 | 10.4 |
| 2012-09-03 21:00:00 | 10.14 |
| 2012-09-03 22:00:00 | 10.4 |
| 2012-09-03 23:00:00 | 10.4 |
| 2012-09-04 | 10.66 |
| 2012-09-04 01:00:00 | 10.4 |
| 2012-09-04 02:00:00 | 10.4 |
| 2012-09-04 03:00:00 | 10.4 |
| 2012-09-04 04:00:00 | 10.66 |
| 2012-09-04 05:00:00 | 10.4 |
| 2012-09-04 06:00:00 | 10.4 |
| 2012-09-04 07:00:00 | 10.14 |
| 2012-09-04 08:00:00 | 10.4 |
| 2012-09-04 09:00:00 | 10.14 |
| 2012-09-04 10:00:00 | 10.14 |
| 2012-09-04 11:00:00 | 10.4 |
| 2012-09-04 12:00:00 | 10.92 |
| 2012-09-04 13:00:00 | 10.14 |
| 2012-09-04 14:00:00 | 10.14 |
| 2012-09-04 15:00:00 | 10.14 |
| 2012-09-04 16:00:00 | 10.14 |
| 2012-09-04 17:00:00 | 10.14 |
| 2012-09-04 18:00:00 | 10.14 |
| 2012-09-04 19:00:00 | 10.4 |
| 2012-09-04 20:00:00 | 10.14 |
| 2012-09-04 21:00:00 | 10.14 |
| 2012-09-04 22:00:00 | 10.4 |
| 2012-09-04 23:00:00 | 10.4 |
| 2012-09-05 | 10.4 |
| 2012-09-05 01:00:00 | 10.4 |
| 2012-09-05 02:00:00 | 10.4 |
| 2012-09-05 03:00:00 | 10.66 |
| 2012-09-05 04:00:00 | 10.4 |
| 2012-09-05 05:00:00 | 10.4 |
| 2012-09-05 06:00:00 | 10.4 |
| 2012-09-05 07:00:00 | 10.14 |
| 2012-09-05 08:00:00 | 10.14 |
| 2012-09-05 09:00:00 | 10.14 |
| 2012-09-05 10:00:00 | 10.66 |
| 2012-09-05 11:00:00 | 10.14 |
| 2012-09-05 12:00:00 | 10.14 |
| 2012-09-05 13:00:00 | 10.4 |
| 2012-09-05 14:00:00 | 10.14 |
| 2012-09-05 15:00:00 | 10.14 |
| 2012-09-05 16:00:00 | 10.14 |
| 2012-09-05 17:00:00 | 10.14 |
| 2012-09-05 18:00:00 | 10.4 |
| 2012-09-05 19:00:00 | 10.14 |
| 2012-09-05 20:00:00 | 10.14 |
| 2012-09-05 21:00:00 | 10.4 |
| 2012-09-05 22:00:00 | 10.4 |
| 2012-09-05 23:00:00 | 10.4 |
| 2012-09-06 | 10.4 |
| 2012-09-06 01:00:00 | 10.4 |
| 2012-09-06 02:00:00 | 10.4 |
| 2012-09-06 03:00:00 | 10.4 |
| 2012-09-06 04:00:00 | 10.66 |
| 2012-09-06 05:00:00 | 10.4 |
| 2012-09-06 06:00:00 | 10.4 |
| 2012-09-06 07:00:00 | 10.4 |
| 2012-09-06 08:00:00 | 10.14 |
| 2012-09-06 09:00:00 | 9.88 |
| 2012-09-06 10:00:00 | 10.4 |
| 2012-09-06 11:00:00 | 9.88 |
| 2012-09-06 12:00:00 | 9.62 |
| 2012-09-06 13:00:00 | 10.14 |
| 2012-09-06 14:00:00 | 9.88 |
| 2012-09-06 15:00:00 | 9.62 |
| 2012-09-06 16:00:00 | 9.88 |
| 2012-09-06 17:00:00 | 9.88 |
| 2012-09-06 18:00:00 | 9.62 |
| 2012-09-06 19:00:00 | 9.88 |
| 2012-09-06 20:00:00 | 10.14 |
| 2012-09-06 21:00:00 | 9.88 |
| 2012-09-06 22:00:00 | 9.88 |
| 2012-09-06 23:00:00 | 9.88 |
| 2012-09-07 | 9.88 |
| 2012-09-07 01:00:00 | 10.4 |
| 2012-09-07 02:00:00 | 9.88 |
| 2012-09-07 03:00:00 | 10.14 |
| 2012-09-07 04:00:00 | 9.88 |
| 2012-09-07 05:00:00 | 9.88 |
| 2012-09-07 06:00:00 | 9.88 |
| 2012-09-07 07:00:00 | 10.14 |
| 2012-09-07 08:00:00 | 9.88 |
| 2012-09-07 09:00:00 | 9.62 |
| 2012-09-07 10:00:00 | 9.62 |
| 2012-09-07 11:00:00 | 9.88 |
| 2012-09-07 12:00:00 | 9.62 |
| 2012-09-07 13:00:00 | 9.88 |
| 2012-09-07 14:00:00 | 9.88 |
| 2012-09-07 15:00:00 | 9.62 |
| 2012-09-07 16:00:00 | 9.88 |
| 2012-09-07 17:00:00 | 9.62 |
| 2012-09-07 18:00:00 | 9.62 |
| 2012-09-07 19:00:00 | 9.88 |
| 2012-09-07 20:00:00 | 10.14 |
| 2012-09-07 21:00:00 | 9.88 |
| 2012-09-07 22:00:00 | 9.88 |
| 2012-09-07 23:00:00 | 9.88 |
| 2012-09-08 | 9.88 |
| 2012-09-08 01:00:00 | 10.4 |
| 2012-09-08 02:00:00 | 9.88 |
| 2012-09-08 03:00:00 | 9.88 |
| 2012-09-08 04:00:00 | 9.88 |
| 2012-09-08 05:00:00 | 9.88 |
| 2012-09-08 06:00:00 | 9.88 |
| 2012-09-08 07:00:00 | 10.14 |
| 2012-09-08 08:00:00 | 9.88 |
| 2012-09-08 09:00:00 | 9.36 |
| 2012-09-08 10:00:00 | 9.88 |
| 2012-09-08 11:00:00 | 9.62 |
| 2012-09-08 12:00:00 | 9.62 |
| 2012-09-08 13:00:00 | 9.88 |
| 2012-09-08 14:00:00 | 9.88 |
| 2012-09-08 15:00:00 | 9.62 |
| 2012-09-08 16:00:00 | 9.62 |
| 2012-09-08 17:00:00 | 9.62 |
| 2012-09-08 18:00:00 | 9.62 |
| 2012-09-08 19:00:00 | 10.14 |
| 2012-09-08 20:00:00 | 9.62 |
| 2012-09-08 21:00:00 | 9.88 |
| 2012-09-08 22:00:00 | 9.88 |
| 2012-09-08 23:00:00 | 9.88 |
| 2012-09-09 | 9.88 |
| 2012-09-09 01:00:00 | 10.14 |
| 2012-09-09 02:00:00 | 10.14 |
| 2012-09-09 03:00:00 | 10.14 |
| 2012-09-09 04:00:00 | 9.88 |
| 2012-09-09 05:00:00 | 9.88 |
| 2012-09-09 06:00:00 | 9.88 |
| 2012-09-09 07:00:00 | 10.14 |
| 2012-09-09 08:00:00 | 9.88 |
| 2012-09-09 09:00:00 | 9.62 |
| 2012-09-09 10:00:00 | 9.88 |
| 2012-09-09 11:00:00 | 9.62 |
| 2012-09-09 12:00:00 | 9.88 |
| 2012-09-09 13:00:00 | 9.88 |
| 2012-09-09 14:00:00 | 9.88 |
| 2012-09-09 15:00:00 | 9.62 |
| 2012-09-09 16:00:00 | 9.62 |
| 2012-09-09 17:00:00 | 9.88 |
| 2012-09-09 18:00:00 | 9.62 |
| 2012-09-09 19:00:00 | 10.14 |
| 2012-09-09 20:00:00 | 10.14 |
| 2012-09-09 21:00:00 | 9.88 |
| 2012-09-09 22:00:00 | 9.88 |
| 2012-09-09 23:00:00 | 9.88 |
| 2012-09-10 | 10.14 |
| 2012-09-10 01:00:00 | 10.14 |
| 2012-09-10 02:00:00 | 10.14 |
| 2012-09-10 03:00:00 | 10.14 |
| 2012-09-10 04:00:00 | 10.14 |
| 2012-09-10 05:00:00 | 9.88 |
| 2012-09-10 06:00:00 | 9.88 |
| 2012-09-10 07:00:00 | 10.14 |
| 2012-09-10 08:00:00 | 9.88 |
| 2012-09-10 09:00:00 | 9.88 |
| 2012-09-10 10:00:00 | 9.62 |
| 2012-09-10 11:00:00 | 9.88 |
| 2012-09-10 12:00:00 | 9.62 |
| 2012-09-10 13:00:00 | 9.88 |
| 2012-09-10 14:00:00 | 9.88 |
| 2012-09-10 15:00:00 | 9.62 |
| 2012-09-10 16:00:00 | 9.62 |
| 2012-09-10 17:00:00 | 9.88 |
| 2012-09-10 18:00:00 | 9.62 |
| 2012-09-10 19:00:00 | 9.88 |
| 2012-09-10 20:00:00 | 10.14 |
| 2012-09-10 21:00:00 | 9.88 |
| 2012-09-10 22:00:00 | 9.88 |
| 2012-09-10 23:00:00 | 9.88 |
| 2012-09-11 | 10.14 |
| 2012-09-11 01:00:00 | 10.14 |
| 2012-09-11 02:00:00 | 10.4 |
| 2012-09-11 03:00:00 | 10.14 |
| 2012-09-11 04:00:00 | 9.88 |
| 2012-09-11 05:00:00 | 9.88 |
| 2012-09-11 06:00:00 | 10.14 |
| 2012-09-11 07:00:00 | 9.88 |
| 2012-09-11 08:00:00 | 10.14 |
| 2012-09-11 09:00:00 | 9.62 |
| 2012-09-11 10:00:00 | 9.88 |
| 2012-09-11 11:00:00 | 9.62 |
| 2012-09-11 12:00:00 | 9.88 |
| 2012-09-11 13:00:00 | 9.88 |
| 2012-09-11 14:00:00 | 9.88 |
| 2012-09-11 15:00:00 | 9.88 |
| 2012-09-11 16:00:00 | 9.62 |
| 2012-09-11 17:00:00 | 9.62 |
| 2012-09-11 18:00:00 | 9.62 |
| 2012-09-11 19:00:00 | 9.88 |
| 2012-09-11 20:00:00 | 10.14 |
| 2012-09-11 21:00:00 | 9.88 |
| 2012-09-11 22:00:00 | 9.88 |
| 2012-09-11 23:00:00 | 10.14 |
| 2012-09-12 | 10.14 |
| 2012-09-12 01:00:00 | 10.14 |
| 2012-09-12 02:00:00 | 10.4 |
| 2012-09-12 03:00:00 | 9.88 |
| 2012-09-12 04:00:00 | 10.14 |
| 2012-09-12 05:00:00 | 9.88 |
| 2012-09-12 06:00:00 | 9.88 |
| 2012-09-12 07:00:00 | 10.14 |
| 2012-09-12 08:00:00 | 9.88 |
| 2012-09-12 09:00:00 | 9.88 |
| 2012-09-12 10:00:00 | 9.88 |
| 2012-09-12 11:00:00 | 9.62 |
| 2012-09-12 12:00:00 | 10.14 |
| 2012-09-12 13:00:00 | 10.14 |
| 2012-09-12 14:00:00 | 9.88 |
| 2012-09-12 15:00:00 | 9.88 |
| 2012-09-12 16:00:00 | 9.62 |
| 2012-09-12 17:00:00 | 9.88 |
| 2012-09-12 18:00:00 | 9.88 |
| 2012-09-12 19:00:00 | 10.14 |
| 2012-09-12 20:00:00 | 10.14 |
| 2012-09-12 21:00:00 | 10.14 |
| 2012-09-12 22:00:00 | 9.88 |
| 2012-09-12 23:00:00 | 10.14 |
| 2012-09-13 | 9.88 |
| 2012-09-13 01:00:00 | 10.14 |
| 2012-09-13 02:00:00 | 10.4 |
| 2012-09-13 03:00:00 | 9.88 |
| 2012-09-13 04:00:00 | 10.14 |
| 2012-09-13 05:00:00 | 9.88 |
| 2012-09-13 06:00:00 | 10.14 |
| 2012-09-13 07:00:00 | 10.14 |
| 2012-09-13 08:00:00 | 10.14 |
| 2012-09-13 09:00:00 | 9.88 |
| 2012-09-13 10:00:00 | 9.88 |
| 2012-09-13 11:00:00 | 9.88 |
| 2012-09-13 12:00:00 | 9.62 |
| 2012-09-13 13:00:00 | 10.14 |
| 2012-09-13 14:00:00 | 10.14 |
| 2012-09-13 15:00:00 | 9.88 |
| 2012-09-13 16:00:00 | 9.88 |
| 2012-09-13 17:00:00 | 9.88 |
| 2012-09-13 18:00:00 | 9.88 |
| 2012-09-13 19:00:00 | 10.14 |
| 2012-09-13 20:00:00 | 10.14 |
| 2012-09-13 21:00:00 | 10.14 |
| 2012-09-13 22:00:00 | 10.14 |
| 2012-09-13 23:00:00 | 9.88 |
| 2012-09-14 | 10.14 |
| 2012-09-14 01:00:00 | 10.4 |
| 2012-09-14 02:00:00 | 10.4 |
| 2012-09-14 03:00:00 | 10.14 |
| 2012-09-14 04:00:00 | 10.14 |
| 2012-09-14 05:00:00 | 10.14 |
| 2012-09-14 06:00:00 | 9.88 |
| 2012-09-14 07:00:00 | 10.4 |
| 2012-09-14 08:00:00 | 10.14 |
| 2012-09-14 09:00:00 | 9.62 |
| 2012-09-14 10:00:00 | 9.88 |
| 2012-09-14 11:00:00 | 9.88 |
| 2012-09-14 12:00:00 | 9.88 |
| 2012-09-14 13:00:00 | 9.88 |
| 2012-09-14 14:00:00 | 10.14 |
| 2012-09-14 15:00:00 | 9.88 |
| 2012-09-14 16:00:00 | 9.88 |
| 2012-09-14 17:00:00 | 9.88 |
| 2012-09-14 18:00:00 | 9.88 |
| 2012-09-14 19:00:00 | 9.88 |
| 2012-09-14 20:00:00 | 10.4 |
| 2012-09-14 21:00:00 | 9.88 |
| 2012-09-14 22:00:00 | 10.14 |
| 2012-09-14 23:00:00 | 10.14 |
| 2012-09-15 | 9.88 |
| 2012-09-15 01:00:00 | 10.4 |
| 2012-09-15 02:00:00 | 10.14 |
| 2012-09-15 03:00:00 | 10.14 |
| 2012-09-15 04:00:00 | 10.14 |
| 2012-09-15 05:00:00 | 9.88 |
| 2012-09-15 06:00:00 | 9.88 |
| 2012-09-15 07:00:00 | 10.14 |
| 2012-09-15 08:00:00 | 10.14 |
| 2012-09-15 09:00:00 | 9.88 |
| 2012-09-15 10:00:00 | 10.14 |
| 2012-09-15 11:00:00 | 9.62 |
| 2012-09-15 12:00:00 | 9.88 |
| 2012-09-15 13:00:00 | 9.88 |
| 2012-09-15 14:00:00 | 10.14 |
| 2012-09-15 15:00:00 | 9.62 |
| 2012-09-15 16:00:00 | 9.88 |
| 2012-09-15 17:00:00 | 9.88 |
| 2012-09-15 18:00:00 | 9.62 |
| 2012-09-15 19:00:00 | 10.14 |
| 2012-09-15 20:00:00 | 10.14 |
| 2012-09-15 21:00:00 | 10.14 |
| 2012-09-15 22:00:00 | 9.88 |
| 2012-09-15 23:00:00 | 10.14 |
| 2012-09-16 | 9.88 |
| 2012-09-16 01:00:00 | 10.4 |
| 2012-09-16 02:00:00 | 10.14 |
| 2012-09-16 03:00:00 | 10.14 |
| 2012-09-16 04:00:00 | 9.88 |
| 2012-09-16 05:00:00 | 10.14 |
| 2012-09-16 06:00:00 | 10.14 |
| 2012-09-16 07:00:00 | 10.14 |
| 2012-09-16 08:00:00 | 9.88 |
| 2012-09-16 09:00:00 | 9.62 |
| 2012-09-16 10:00:00 | 10.14 |
| 2012-09-16 11:00:00 | 9.62 |
| 2012-09-16 12:00:00 | 9.62 |
| 2012-09-16 13:00:00 | 9.62 |
| 2012-09-16 14:00:00 | 9.88 |
| 2012-09-16 15:00:00 | 9.62 |
| 2012-09-16 16:00:00 | 9.62 |
| 2012-09-16 17:00:00 | 9.62 |
| 2012-09-16 18:00:00 | 9.62 |
| 2012-09-16 19:00:00 | 9.88 |
| 2012-09-16 20:00:00 | 10.14 |
| 2012-09-16 21:00:00 | 9.62 |
| 2012-09-16 22:00:00 | 9.88 |
| 2012-09-16 23:00:00 | 9.88 |
| 2012-09-17 | 9.62 |
| 2012-09-17 01:00:00 | 10.14 |
| 2012-09-17 02:00:00 | 10.14 |
| 2012-09-17 03:00:00 | 9.88 |
| 2012-09-17 04:00:00 | 9.62 |
| 2012-09-17 05:00:00 | 9.88 |
| 2012-09-17 06:00:00 | 9.88 |
| 2012-09-17 07:00:00 | 9.88 |
| 2012-09-17 08:00:00 | 9.62 |
| 2012-09-17 09:00:00 | 9.62 |
| 2012-09-17 10:00:00 | 9.62 |
| 2012-09-17 11:00:00 | 9.62 |
| 2012-09-17 12:00:00 | 9.62 |
| 2012-09-17 13:00:00 | 9.62 |
| 2012-09-17 14:00:00 | 9.62 |
| 2012-09-17 15:00:00 | 9.62 |
| 2012-09-17 16:00:00 | 9.62 |
| 2012-09-17 17:00:00 | 9.36 |
| 2012-09-17 18:00:00 | 9.62 |
| 2012-09-17 19:00:00 | 10.14 |
| 2012-09-17 20:00:00 | 9.88 |
| 2012-09-17 21:00:00 | 9.88 |
| 2012-09-17 22:00:00 | 9.62 |
| 2012-09-17 23:00:00 | 9.88 |
| 2012-09-18 | 9.88 |
| 2012-09-18 01:00:00 | 9.88 |
| 2012-09-18 02:00:00 | 10.14 |
| 2012-09-18 03:00:00 | 9.62 |
| 2012-09-18 04:00:00 | 9.88 |
| 2012-09-18 05:00:00 | 9.62 |
| 2012-09-18 06:00:00 | 9.88 |
| 2012-09-18 07:00:00 | 9.62 |
| 2012-09-18 08:00:00 | 9.88 |
| 2012-09-18 09:00:00 | 9.62 |
| 2012-09-18 10:00:00 | 9.62 |
| 2012-09-18 11:00:00 | 9.62 |
| 2012-09-18 12:00:00 | 9.62 |
| 2012-09-18 13:00:00 | 9.88 |
| 2012-09-18 14:00:00 | 9.88 |
| 2012-09-18 15:00:00 | 9.36 |
| 2012-09-18 16:00:00 | 9.88 |
| 2012-09-18 17:00:00 | 9.36 |
| 2012-09-18 18:00:00 | 9.62 |
| 2012-09-18 19:00:00 | 9.88 |
| 2012-09-18 20:00:00 | 9.88 |
| 2012-09-18 21:00:00 | 9.88 |
| 2012-09-18 22:00:00 | 9.62 |
| 2012-09-18 23:00:00 | 9.62 |
| 2012-09-19 | 9.88 |
| 2012-09-19 01:00:00 | 10.14 |
| 2012-09-19 02:00:00 | 10.14 |
| 2012-09-19 03:00:00 | 9.62 |
| 2012-09-19 04:00:00 | 9.88 |
| 2012-09-19 05:00:00 | 9.62 |
| 2012-09-19 06:00:00 | 9.88 |
| 2012-09-19 07:00:00 | 9.62 |
| 2012-09-19 08:00:00 | 9.88 |
| 2012-09-19 09:00:00 | 9.36 |
| 2012-09-19 10:00:00 | 9.88 |
| 2012-09-19 11:00:00 | 9.62 |
| 2012-09-19 12:00:00 | 9.62 |
| 2012-09-19 13:00:00 | 9.62 |
| 2012-09-19 14:00:00 | 9.88 |
| 2012-09-19 15:00:00 | 9.62 |
| 2012-09-19 16:00:00 | 9.62 |
| 2012-09-19 17:00:00 | 9.62 |
| 2012-09-19 18:00:00 | 9.62 |
| 2012-09-19 19:00:00 | 9.88 |
| 2012-09-19 20:00:00 | 9.88 |
| 2012-09-19 21:00:00 | 9.88 |
| 2012-09-19 22:00:00 | 9.62 |
| 2012-09-19 23:00:00 | 9.88 |
| 2012-09-20 | 9.62 |
| 2012-09-20 01:00:00 | 10.14 |
| 2012-09-20 02:00:00 | 9.88 |
| 2012-09-20 03:00:00 | 9.88 |
| 2012-09-20 04:00:00 | 9.88 |
| 2012-09-20 05:00:00 | 9.62 |
| 2012-09-20 06:00:00 | 9.88 |
| 2012-09-20 07:00:00 | 9.88 |
| 2012-09-20 08:00:00 | 9.88 |
| 2012-09-20 09:00:00 | 9.62 |
| 2012-09-20 10:00:00 | 10.4 |
| 2012-09-20 11:00:00 | 10.92 |
| 2012-09-20 12:00:00 | 10.4 |
| 2012-09-20 13:00:00 | 9.88 |
| 2012-09-20 14:00:00 | 10.14 |
| 2012-09-20 15:00:00 | 10.14 |
| 2012-09-20 16:00:00 | 9.88 |
| 2012-09-20 17:00:00 | 10.14 |
| 2012-09-20 18:00:00 | 9.88 |
| 2012-09-20 19:00:00 | 10.14 |
| 2012-09-20 20:00:00 | 10.14 |
| 2012-09-20 21:00:00 | 10.14 |
| 2012-09-20 22:00:00 | 10.4 |
| 2012-09-20 23:00:00 | 10.14 |
| 2012-09-21 | 10.4 |
| 2012-09-21 01:00:00 | 10.4 |
| 2012-09-21 02:00:00 | 10.14 |
| 2012-09-21 03:00:00 | 10.14 |
| 2012-09-21 04:00:00 | 10.4 |
| 2012-09-21 05:00:00 | 10.14 |
| 2012-09-21 06:00:00 | 10.4 |
| 2012-09-21 07:00:00 | 10.14 |
| 2012-09-21 08:00:00 | 9.88 |
| 2012-09-21 09:00:00 | 9.88 |
| 2012-09-21 10:00:00 | 5.46 |
| 2012-09-21 11:00:00 | 14.56 |
| 2012-09-21 12:00:00 | 10.92 |
| 2012-09-21 13:00:00 | 10.14 |
| 2012-09-21 14:00:00 | 10.14 |
| 2012-09-21 15:00:00 | 9.88 |
| 2012-09-21 16:00:00 | 9.88 |
| 2012-09-21 17:00:00 | 10.14 |
| 2012-09-21 18:00:00 | 9.88 |
| 2012-09-21 19:00:00 | 9.88 |
| 2012-09-21 20:00:00 | 10.4 |
| 2012-09-21 21:00:00 | 10.14 |
| 2012-09-21 22:00:00 | 10.14 |
| 2012-09-21 23:00:00 | 10.4 |
| 2012-09-22 | 10.4 |
| 2012-09-22 01:00:00 | 10.14 |
| 2012-09-22 02:00:00 | 10.14 |
| 2012-09-22 03:00:00 | 10.4 |
| 2012-09-22 04:00:00 | 10.14 |
| 2012-09-22 05:00:00 | 10.14 |
| 2012-09-22 06:00:00 | 10.4 |
| 2012-09-22 07:00:00 | 10.14 |
| 2012-09-22 08:00:00 | 10.14 |
| 2012-09-22 09:00:00 | 9.88 |
| 2012-09-22 10:00:00 | 10.4 |
| 2012-09-22 11:00:00 | 11.96 |
| 2012-09-22 12:00:00 | 9.88 |
| 2012-09-22 13:00:00 | 10.14 |
| 2012-09-22 14:00:00 | 9.88 |
| 2012-09-22 15:00:00 | 9.88 |
| 2012-09-22 16:00:00 | 9.88 |
| 2012-09-22 17:00:00 | 9.88 |
| 2012-09-22 18:00:00 | 10.14 |
| 2012-09-22 19:00:00 | 9.88 |
| 2012-09-22 20:00:00 | 10.14 |
| 2012-09-22 21:00:00 | 10.4 |
| 2012-09-22 22:00:00 | 10.14 |
| 2012-09-22 23:00:00 | 10.14 |
| 2012-09-23 | 10.14 |
| 2012-09-23 01:00:00 | 10.4 |
| 2012-09-23 02:00:00 | 10.14 |
| 2012-09-23 03:00:00 | 10.14 |
| 2012-09-23 04:00:00 | 10.4 |
| 2012-09-23 05:00:00 | 10.14 |
| 2012-09-23 06:00:00 | 10.4 |
| 2012-09-23 07:00:00 | 10.14 |
| 2012-09-23 08:00:00 | 9.88 |
| 2012-09-23 09:00:00 | 10.14 |
| 2012-09-23 10:00:00 | 10.14 |
| 2012-09-23 11:00:00 | 10.14 |
| 2012-09-23 12:00:00 | 9.88 |
| 2012-09-23 13:00:00 | 10.14 |
| 2012-09-23 14:00:00 | 10.14 |
| 2012-09-23 15:00:00 | 9.88 |
| 2012-09-23 16:00:00 | 10.14 |
| 2012-09-23 17:00:00 | 10.14 |
| 2012-09-23 18:00:00 | 10.14 |
| 2012-09-23 19:00:00 | 10.14 |
| 2012-09-23 20:00:00 | 10.14 |
| 2012-09-23 21:00:00 | 10.4 |
| 2012-09-23 22:00:00 | 10.4 |
| 2012-09-23 23:00:00 | 10.4 |
| 2012-09-24 | 10.4 |
| 2012-09-24 01:00:00 | 10.4 |
| 2012-09-24 02:00:00 | 10.4 |
| 2012-09-24 03:00:00 | 10.14 |
| 2012-09-24 04:00:00 | 10.4 |
| 2012-09-24 05:00:00 | 10.4 |
| 2012-09-24 06:00:00 | 10.4 |
| 2012-09-24 07:00:00 | 10.4 |
| 2012-09-24 08:00:00 | 10.14 |
| 2012-09-24 09:00:00 | 10.14 |
| 2012-09-24 10:00:00 | 10.4 |
| 2012-09-24 11:00:00 | 10.66 |
| 2012-09-24 12:00:00 | 10.14 |
| 2012-09-24 13:00:00 | 10.14 |
| 2012-09-24 14:00:00 | 10.14 |
| 2012-09-24 15:00:00 | 9.88 |
| 2012-09-24 16:00:00 | 10.14 |
| 2012-09-24 17:00:00 | 10.14 |
| 2012-09-24 18:00:00 | 10.14 |
| 2012-09-24 19:00:00 | 10.14 |
| 2012-09-24 20:00:00 | 10.4 |
| 2012-09-24 21:00:00 | 10.4 |
| 2012-09-24 22:00:00 | 10.4 |
| 2012-09-24 23:00:00 | 10.14 |
| 2012-09-25 | 10.66 |
| 2012-09-25 01:00:00 | 10.14 |
| 2012-09-25 02:00:00 | 10.4 |
| 2012-09-25 03:00:00 | 10.4 |
| 2012-09-25 04:00:00 | 10.4 |
| 2012-09-25 05:00:00 | 10.4 |
| 2012-09-25 06:00:00 | 10.4 |
| 2012-09-25 07:00:00 | 10.14 |
| 2012-09-25 08:00:00 | 10.14 |
| 2012-09-25 09:00:00 | 10.14 |
| 2012-09-25 10:00:00 | 10.14 |
| 2012-09-25 11:00:00 | 10.14 |
| 2012-09-25 12:00:00 | 10.14 |
| 2012-09-25 13:00:00 | 9.88 |
| 2012-09-25 14:00:00 | 10.14 |
| 2012-09-25 15:00:00 | 10.14 |
| 2012-09-25 16:00:00 | 10.14 |
| 2012-09-25 17:00:00 | 10.14 |
| 2012-09-25 18:00:00 | 10.14 |
| 2012-09-25 19:00:00 | 10.14 |
| 2012-09-25 20:00:00 | 10.14 |
| 2012-09-25 21:00:00 | 10.4 |
| 2012-09-25 22:00:00 | 10.4 |
| 2012-09-25 23:00:00 | 10.14 |
| 2012-09-26 | 10.4 |
| 2012-09-26 01:00:00 | 10.4 |
| 2012-09-26 02:00:00 | 10.4 |
| 2012-09-26 03:00:00 | 10.4 |
| 2012-09-26 04:00:00 | 10.14 |
| 2012-09-26 05:00:00 | 10.4 |
| 2012-09-26 06:00:00 | 10.4 |
| 2012-09-26 07:00:00 | 10.4 |
| 2012-09-26 08:00:00 | 10.14 |
| 2012-09-26 09:00:00 | 10.14 |
| 2012-09-26 10:00:00 | 9.88 |
| 2012-09-26 11:00:00 | 10.14 |
| 2012-09-26 12:00:00 | 10.4 |
| 2012-09-26 13:00:00 | 9.88 |
| 2012-09-26 14:00:00 | 10.14 |
| 2012-09-26 15:00:00 | 10.14 |
| 2012-09-26 16:00:00 | 9.88 |
| 2012-09-26 17:00:00 | 10.14 |
| 2012-09-26 18:00:00 | 9.88 |
| 2012-09-26 19:00:00 | 10.14 |
| 2012-09-26 20:00:00 | 10.4 |
| 2012-09-26 21:00:00 | 10.4 |
| 2012-09-26 22:00:00 | 10.14 |
| 2012-09-26 23:00:00 | 10.4 |
| 2012-09-27 | 10.4 |
| 2012-09-27 01:00:00 | 10.4 |
| 2012-09-27 02:00:00 | 10.4 |
| 2012-09-27 03:00:00 | 10.4 |
| 2012-09-27 04:00:00 | 10.66 |
| 2012-09-27 05:00:00 | 10.4 |
| 2012-09-27 06:00:00 | 10.14 |
| 2012-09-27 07:00:00 | 10.4 |
| 2012-09-27 08:00:00 | 10.14 |
| 2012-09-27 09:00:00 | 9.88 |
| 2012-09-27 10:00:00 | 10.14 |
| 2012-09-27 11:00:00 | 10.14 |
| 2012-09-27 12:00:00 | 10.14 |
| 2012-09-27 13:00:00 | 9.88 |
| 2012-09-27 14:00:00 | 10.14 |
| 2012-09-27 15:00:00 | 10.14 |
| 2012-09-27 16:00:00 | 10.14 |
| 2012-09-27 17:00:00 | 10.14 |
| 2012-09-27 18:00:00 | 10.14 |
| 2012-09-27 19:00:00 | 10.14 |
| 2012-09-27 20:00:00 | 10.14 |
| 2012-09-27 21:00:00 | 10.4 |
| 2012-09-27 22:00:00 | 10.14 |
| 2012-09-27 23:00:00 | 10.4 |
| 2012-09-28 | 10.14 |
| 2012-09-28 01:00:00 | 10.4 |
| 2012-09-28 02:00:00 | 10.14 |
| 2012-09-28 03:00:00 | 10.4 |
| 2012-09-28 04:00:00 | 10.14 |
| 2012-09-28 05:00:00 | 10.4 |
| 2012-09-28 06:00:00 | 10.14 |
| 2012-09-28 07:00:00 | 10.14 |
| 2012-09-28 08:00:00 | 10.14 |
| 2012-09-28 09:00:00 | 9.88 |
| 2012-09-28 10:00:00 | 9.88 |
| 2012-09-28 11:00:00 | 10.14 |
| 2012-09-28 12:00:00 | 9.88 |
| 2012-09-28 13:00:00 | 10.14 |
| 2012-09-28 14:00:00 | 9.88 |
| 2012-09-28 15:00:00 | 9.88 |
| 2012-09-28 16:00:00 | 10.14 |
| 2012-09-28 17:00:00 | 9.88 |
| 2012-09-28 18:00:00 | 9.88 |
| 2012-09-28 19:00:00 | 10.14 |
| 2012-09-28 20:00:00 | 10.14 |
| 2012-09-28 21:00:00 | 10.14 |
| 2012-09-28 22:00:00 | 10.14 |
| 2012-09-28 23:00:00 | 10.14 |
| 2012-09-29 | 10.14 |
| 2012-09-29 01:00:00 | 10.14 |
| 2012-09-29 02:00:00 | 10.14 |
| 2012-09-29 03:00:00 | 10.14 |
| 2012-09-29 04:00:00 | 10.14 |
| 2012-09-29 05:00:00 | 10.4 |
| 2012-09-29 06:00:00 | 10.14 |
| 2012-09-29 07:00:00 | 10.14 |
| 2012-09-29 08:00:00 | 9.88 |
| 2012-09-29 09:00:00 | 9.88 |
| 2012-09-29 10:00:00 | 10.66 |
| 2012-09-29 11:00:00 | 9.62 |
| 2012-09-29 12:00:00 | 9.88 |
| 2012-09-29 13:00:00 | 10.14 |
| 2012-09-29 14:00:00 | 9.88 |
| 2012-09-29 15:00:00 | 9.88 |
| 2012-09-29 16:00:00 | 10.14 |
| 2012-09-29 17:00:00 | 9.88 |
| 2012-09-29 18:00:00 | 9.88 |
| 2012-09-29 19:00:00 | 9.88 |
| 2012-09-29 20:00:00 | 10.14 |
| 2012-09-29 21:00:00 | 10.14 |
| 2012-09-29 22:00:00 | 10.14 |
| 2012-09-29 23:00:00 | 10.14 |
| 2012-09-30 | 10.4 |
| 2012-09-30 01:00:00 | 10.14 |
| 2012-09-30 02:00:00 | 10.14 |
| 2012-09-30 03:00:00 | 10.14 |
| 2012-09-30 04:00:00 | 10.14 |
| 2012-09-30 05:00:00 | 10.14 |
| 2012-09-30 06:00:00 | 10.14 |
| 2012-09-30 07:00:00 | 10.4 |
| 2012-09-30 08:00:00 | 9.62 |
| 2012-09-30 09:00:00 | 10.14 |
| 2012-09-30 10:00:00 | 9.62 |
| 2012-09-30 11:00:00 | 9.88 |
| 2012-09-30 12:00:00 | 9.62 |
| 2012-09-30 13:00:00 | 9.88 |
| 2012-09-30 14:00:00 | 9.88 |
| 2012-09-30 15:00:00 | 9.62 |
| 2012-09-30 16:00:00 | 9.88 |
| 2012-09-30 17:00:00 | 9.62 |
| 2012-09-30 18:00:00 | 9.88 |
| 2012-09-30 19:00:00 | 9.88 |
| 2012-09-30 20:00:00 | 10.14 |
| 2012-09-30 21:00:00 | 9.88 |
| 2012-09-30 22:00:00 | 9.88 |
| 2012-09-30 23:00:00 | 10.14 |
| 2012-10-01 | 10.14 |
| 2012-10-01 01:00:00 | 10.14 |
| 2012-10-01 02:00:00 | 9.88 |
| 2012-10-01 03:00:00 | 10.14 |
| 2012-10-01 04:00:00 | 10.14 |
| 2012-10-01 05:00:00 | 9.88 |
| 2012-10-01 06:00:00 | 10.14 |
| 2012-10-01 07:00:00 | 9.88 |
| 2012-10-01 08:00:00 | 9.88 |
| 2012-10-01 09:00:00 | 9.62 |
| 2012-10-01 10:00:00 | 9.88 |
| 2012-10-01 11:00:00 | 9.88 |
| 2012-10-01 12:00:00 | 9.62 |
| 2012-10-01 13:00:00 | 9.88 |
| 2012-10-01 14:00:00 | 9.88 |
| 2012-10-01 15:00:00 | 9.62 |
| 2012-10-01 16:00:00 | 9.88 |
| 2012-10-01 17:00:00 | 9.88 |
| 2012-10-01 18:00:00 | 9.62 |
| 2012-10-01 19:00:00 | 9.88 |
| 2012-10-01 20:00:00 | 10.14 |
| 2012-10-01 21:00:00 | 9.88 |
| 2012-10-01 22:00:00 | 9.88 |
| 2012-10-01 23:00:00 | 9.88 |
| 2012-10-02 | 10.14 |
| 2012-10-02 01:00:00 | 9.88 |
| 2012-10-02 02:00:00 | 10.14 |
| 2012-10-02 03:00:00 | 9.88 |
| 2012-10-02 04:00:00 | 10.14 |
| 2012-10-02 05:00:00 | 9.88 |
| 2012-10-02 06:00:00 | 10.14 |
| 2012-10-02 07:00:00 | 9.88 |
| 2012-10-02 08:00:00 | 9.62 |
| 2012-10-02 09:00:00 | 9.88 |
| 2012-10-02 10:00:00 | 9.62 |
| 2012-10-02 11:00:00 | 9.88 |
| 2012-10-02 12:00:00 | 9.62 |
| 2012-10-02 13:00:00 | 9.62 |
| 2012-10-02 14:00:00 | 9.88 |
| 2012-10-02 15:00:00 | 9.88 |
| 2012-10-02 16:00:00 | 9.88 |
| 2012-10-02 17:00:00 | 9.62 |
| 2012-10-02 18:00:00 | 9.88 |
| 2012-10-02 19:00:00 | 10.14 |
| 2012-10-02 20:00:00 | 9.62 |
| 2012-10-02 21:00:00 | 10.14 |
| 2012-10-02 22:00:00 | 9.88 |
| 2012-10-02 23:00:00 | 10.14 |
| 2012-10-03 | 9.88 |
| 2012-10-03 01:00:00 | 10.14 |
| 2012-10-03 02:00:00 | 9.88 |
| 2012-10-03 03:00:00 | 10.14 |
| 2012-10-03 04:00:00 | 9.88 |
| 2012-10-03 05:00:00 | 9.88 |
| 2012-10-03 06:00:00 | 9.88 |
| 2012-10-03 07:00:00 | 9.88 |
| 2012-10-03 08:00:00 | 9.88 |
| 2012-10-03 09:00:00 | 9.62 |
| 2012-10-03 10:00:00 | 9.62 |
| 2012-10-03 11:00:00 | 9.88 |
| 2012-10-03 12:00:00 | 9.88 |
| 2012-10-03 13:00:00 | 9.88 |
| 2012-10-03 14:00:00 | 9.88 |
| 2012-10-03 15:00:00 | 9.88 |
| 2012-10-03 16:00:00 | 9.62 |
| 2012-10-03 17:00:00 | 9.88 |
| 2012-10-03 18:00:00 | 9.88 |
| 2012-10-03 19:00:00 | 9.62 |
| 2012-10-03 20:00:00 | 10.14 |
| 2012-10-03 21:00:00 | 9.88 |
| 2012-10-03 22:00:00 | 9.88 |
| 2012-10-03 23:00:00 | 10.14 |
| 2012-10-04 | 9.88 |
| 2012-10-04 01:00:00 | 10.14 |
| 2012-10-04 02:00:00 | 9.88 |
| 2012-10-04 03:00:00 | 10.14 |
| 2012-10-04 04:00:00 | 9.88 |
| 2012-10-04 05:00:00 | 10.14 |
| 2012-10-04 06:00:00 | 9.88 |
| 2012-10-04 07:00:00 | 10.14 |
| 2012-10-04 08:00:00 | 9.62 |
| 2012-10-04 09:00:00 | 9.88 |
| 2012-10-04 10:00:00 | 9.62 |
| 2012-10-04 11:00:00 | 10.66 |
| 2012-10-04 12:00:00 | 10.14 |
| 2012-10-04 13:00:00 | 10.4 |
| 2012-10-04 14:00:00 | 10.14 |
| 2012-10-04 15:00:00 | 9.88 |
| 2012-10-04 16:00:00 | 10.14 |
| 2012-10-04 17:00:00 | 9.88 |
| 2012-10-04 18:00:00 | 9.88 |
| 2012-10-04 19:00:00 | 10.4 |
| 2012-10-04 20:00:00 | 10.14 |
| 2012-10-04 21:00:00 | 9.88 |
| 2012-10-04 22:00:00 | 10.14 |
| 2012-10-04 23:00:00 | 10.4 |
| 2012-10-05 | 10.14 |
| 2012-10-05 01:00:00 | 10.14 |
| 2012-10-05 02:00:00 | 10.4 |
| 2012-10-05 03:00:00 | 10.14 |
| 2012-10-05 04:00:00 | 10.14 |
| 2012-10-05 05:00:00 | 10.4 |
| 2012-10-05 06:00:00 | 10.14 |
| 2012-10-05 07:00:00 | 10.14 |
| 2012-10-05 08:00:00 | 9.88 |
| 2012-10-05 09:00:00 | 9.88 |
| 2012-10-05 10:00:00 | 10.14 |
| 2012-10-05 11:00:00 | 10.92 |
| 2012-10-05 12:00:00 | 9.88 |
| 2012-10-05 13:00:00 | 10.14 |
| 2012-10-05 14:00:00 | 9.88 |
| 2012-10-05 15:00:00 | 9.88 |
| 2012-10-05 16:00:00 | 9.88 |
| 2012-10-05 17:00:00 | 9.88 |
| 2012-10-05 18:00:00 | 9.88 |
| 2012-10-05 19:00:00 | 10.14 |
| 2012-10-05 20:00:00 | 9.88 |
| 2012-10-05 21:00:00 | 10.14 |
| 2012-10-05 22:00:00 | 10.14 |
| 2012-10-05 23:00:00 | 9.88 |
| 2012-10-06 | 10.14 |
| 2012-10-06 01:00:00 | 10.14 |
| 2012-10-06 02:00:00 | 10.14 |
| 2012-10-06 03:00:00 | 10.14 |
| 2012-10-06 04:00:00 | 10.14 |
| 2012-10-06 05:00:00 | 10.14 |
| 2012-10-06 06:00:00 | 10.14 |
| 2012-10-06 07:00:00 | 9.88 |
| 2012-10-06 08:00:00 | 10.14 |
| 2012-10-06 09:00:00 | 9.62 |
| 2012-10-06 10:00:00 | 10.14 |
| 2012-10-06 11:00:00 | 9.88 |
| 2012-10-06 12:00:00 | 9.62 |
| 2012-10-06 13:00:00 | 9.62 |
| 2012-10-06 14:00:00 | 9.88 |
| 2012-10-06 15:00:00 | 9.62 |
| 2012-10-06 16:00:00 | 9.88 |
| 2012-10-06 17:00:00 | 9.88 |
| 2012-10-06 18:00:00 | 9.88 |
| 2012-10-06 19:00:00 | 9.88 |
| 2012-10-06 20:00:00 | 10.14 |
| 2012-10-06 21:00:00 | 9.88 |
| 2012-10-06 22:00:00 | 10.14 |
| 2012-10-06 23:00:00 | 9.88 |
| 2012-10-07 | 10.14 |
| 2012-10-07 01:00:00 | 10.14 |
| 2012-10-07 02:00:00 | 10.14 |
| 2012-10-07 03:00:00 | 9.88 |
| 2012-10-07 04:00:00 | 10.14 |
| 2012-10-07 05:00:00 | 10.14 |
| 2012-10-07 06:00:00 | 10.14 |
| 2012-10-07 07:00:00 | 10.14 |
| 2012-10-07 08:00:00 | 10.14 |
| 2012-10-07 09:00:00 | 9.88 |
| 2012-10-07 10:00:00 | 10.14 |
| 2012-10-07 11:00:00 | 10.14 |
| 2012-10-07 12:00:00 | 9.88 |
| 2012-10-07 13:00:00 | 10.14 |
| 2012-10-07 14:00:00 | 9.88 |
| 2012-10-07 15:00:00 | 9.88 |
| 2012-10-07 16:00:00 | 10.14 |
| 2012-10-07 17:00:00 | 10.14 |
| 2012-10-07 18:00:00 | 10.14 |
| 2012-10-07 19:00:00 | 10.4 |
| 2012-10-07 20:00:00 | 10.14 |
| 2012-10-07 21:00:00 | 10.14 |
| 2012-10-07 22:00:00 | 10.4 |
| 2012-10-07 23:00:00 | 10.4 |
| 2012-10-08 | 10.14 |
| 2012-10-08 01:00:00 | 10.4 |
| 2012-10-08 02:00:00 | 10.4 |
| 2012-10-08 03:00:00 | 10.4 |
| 2012-10-08 04:00:00 | 10.4 |
| 2012-10-08 05:00:00 | 10.4 |
| 2012-10-08 06:00:00 | 10.14 |
| 2012-10-08 07:00:00 | 10.4 |
| 2012-10-08 08:00:00 | 10.14 |
| 2012-10-08 09:00:00 | 10.14 |
| 2012-10-08 10:00:00 | 9.88 |
| 2012-10-08 11:00:00 | 10.14 |
| 2012-10-08 12:00:00 | 10.14 |
| 2012-10-08 13:00:00 | 10.14 |
| 2012-10-08 14:00:00 | 10.14 |
| 2012-10-08 15:00:00 | 10.14 |
| 2012-10-08 16:00:00 | 10.14 |
| 2012-10-08 17:00:00 | 10.14 |
| 2012-10-08 18:00:00 | 10.14 |
| 2012-10-08 19:00:00 | 10.14 |
| 2012-10-08 20:00:00 | 10.14 |
| 2012-10-08 21:00:00 | 10.4 |
| 2012-10-08 22:00:00 | 10.14 |
| 2012-10-08 23:00:00 | 10.4 |
| 2012-10-09 | 10.4 |
| 2012-10-09 01:00:00 | 10.14 |
| 2012-10-09 02:00:00 | 10.4 |
| 2012-10-09 03:00:00 | 10.4 |
| 2012-10-09 04:00:00 | 10.4 |
| 2012-10-09 05:00:00 | 10.4 |
| 2012-10-09 06:00:00 | 10.4 |
| 2012-10-09 07:00:00 | 10.4 |
| 2012-10-09 08:00:00 | 10.14 |
| 2012-10-09 09:00:00 | 10.14 |
| 2012-10-09 10:00:00 | 10.4 |
| 2012-10-09 11:00:00 | 10.66 |
| 2012-10-09 12:00:00 | 10.14 |
| 2012-10-09 13:00:00 | 10.14 |
| 2012-10-09 14:00:00 | 10.14 |
| 2012-10-09 15:00:00 | 10.14 |
| 2012-10-09 16:00:00 | 10.14 |
| 2012-10-09 17:00:00 | 10.14 |
| 2012-10-09 18:00:00 | 10.14 |
| 2012-10-09 19:00:00 | 10.4 |
| 2012-10-09 20:00:00 | 10.14 |
| 2012-10-09 21:00:00 | 10.4 |
| 2012-10-09 22:00:00 | 10.4 |
| 2012-10-09 23:00:00 | 10.4 |
| 2012-10-10 | 10.4 |
| 2012-10-10 01:00:00 | 10.66 |
| 2012-10-10 02:00:00 | 10.4 |
| 2012-10-10 03:00:00 | 10.4 |
| 2012-10-10 04:00:00 | 10.66 |
| 2012-10-10 05:00:00 | 10.4 |
| 2012-10-10 06:00:00 | 10.4 |
| 2012-10-10 07:00:00 | 10.4 |
| 2012-10-10 08:00:00 | 10.14 |
| 2012-10-10 09:00:00 | 10.4 |
| 2012-10-10 10:00:00 | 10.14 |
| 2012-10-10 11:00:00 | 10.14 |
| 2012-10-10 12:00:00 | 10.14 |
| 2012-10-10 13:00:00 | 10.14 |
| 2012-10-10 14:00:00 | 10.14 |
| 2012-10-10 15:00:00 | 10.14 |
| 2012-10-10 16:00:00 | 10.4 |
| 2012-10-10 17:00:00 | 9.88 |
| 2012-10-10 18:00:00 | 10.4 |
| 2012-10-10 19:00:00 | 10.4 |
| 2012-10-10 20:00:00 | 10.14 |
| 2012-10-10 21:00:00 | 10.4 |
| 2012-10-10 22:00:00 | 10.4 |
| 2012-10-10 23:00:00 | 10.4 |
| 2012-10-11 | 10.66 |
| 2012-10-11 01:00:00 | 10.4 |
| 2012-10-11 02:00:00 | 10.4 |
| 2012-10-11 03:00:00 | 10.4 |
| 2012-10-11 04:00:00 | 10.4 |
| 2012-10-11 05:00:00 | 10.66 |
| 2012-10-11 06:00:00 | 10.4 |
| 2012-10-11 07:00:00 | 10.4 |
| 2012-10-11 08:00:00 | 10.14 |
| 2012-10-11 09:00:00 | 10.14 |
| 2012-10-11 10:00:00 | 10.4 |
| 2012-10-11 11:00:00 | 11.18 |
| 2012-10-11 12:00:00 | 10.4 |
| 2012-10-11 13:00:00 | 10.14 |
| 2012-10-11 14:00:00 | 10.4 |
| 2012-10-11 15:00:00 | 10.14 |
| 2012-10-11 16:00:00 | 10.4 |
| 2012-10-11 17:00:00 | 10.14 |
| 2012-10-11 18:00:00 | 10.4 |
| 2012-10-11 19:00:00 | 10.4 |
| 2012-10-11 20:00:00 | 10.66 |
| 2012-10-11 21:00:00 | 10.66 |
| 2012-10-11 22:00:00 | 10.66 |
| 2012-10-11 23:00:00 | 10.66 |
| 2012-10-12 | 10.66 |
| 2012-10-12 01:00:00 | 10.66 |
| 2012-10-12 02:00:00 | 10.66 |
| 2012-10-12 03:00:00 | 10.66 |
| 2012-10-12 04:00:00 | 10.66 |
| 2012-10-12 05:00:00 | 10.92 |
| 2012-10-12 06:00:00 | 10.66 |
| 2012-10-12 07:00:00 | 10.66 |
| 2012-10-12 08:00:00 | 10.66 |
| 2012-10-12 09:00:00 | 10.4 |
| 2012-10-12 10:00:00 | 10.66 |
| 2012-10-12 11:00:00 | 10.66 |
| 2012-10-12 12:00:00 | 10.4 |
| 2012-10-12 13:00:00 | 10.4 |
| 2012-10-12 14:00:00 | 10.14 |
| 2012-10-12 15:00:00 | 10.4 |
| 2012-10-12 16:00:00 | 10.4 |
| 2012-10-12 17:00:00 | 10.4 |
| 2012-10-12 18:00:00 | 10.4 |
| 2012-10-12 19:00:00 | 10.66 |
| 2012-10-12 20:00:00 | 10.4 |
| 2012-10-12 21:00:00 | 10.66 |
| 2012-10-12 22:00:00 | 10.66 |
| 2012-10-12 23:00:00 | 10.66 |
| 2012-10-13 | 10.66 |
| 2012-10-13 01:00:00 | 10.66 |
| 2012-10-13 02:00:00 | 10.66 |
| 2012-10-13 03:00:00 | 10.66 |
| 2012-10-13 04:00:00 | 10.66 |
| 2012-10-13 05:00:00 | 10.66 |
| 2012-10-13 06:00:00 | 10.66 |
| 2012-10-13 07:00:00 | 10.4 |
| 2012-10-13 08:00:00 | 10.66 |
| 2012-10-13 09:00:00 | 10.4 |
| 2012-10-13 10:00:00 | 10.14 |
| 2012-10-13 11:00:00 | 13 |
| 2012-10-13 12:00:00 | 11.44 |
| 2012-10-13 13:00:00 | 9.62 |
| 2012-10-13 14:00:00 | 9.88 |
| 2012-10-13 15:00:00 | 9.88 |
| 2012-10-13 16:00:00 | 9.88 |
| 2012-10-13 17:00:00 | 9.88 |
| 2012-10-13 18:00:00 | 9.88 |
| 2012-10-13 19:00:00 | 10.4 |
| 2012-10-13 20:00:00 | 10.14 |
| 2012-10-13 21:00:00 | 10.14 |
| 2012-10-13 22:00:00 | 10.4 |
| 2012-10-13 23:00:00 | 10.14 |
| 2012-10-14 | 10.4 |
| 2012-10-14 01:00:00 | 10.14 |
| 2012-10-14 02:00:00 | 10.4 |
| 2012-10-14 03:00:00 | 10.14 |
| 2012-10-14 04:00:00 | 10.4 |
| 2012-10-14 05:00:00 | 10.4 |
| 2012-10-14 06:00:00 | 10.14 |
| 2012-10-14 07:00:00 | 10.14 |
| 2012-10-14 08:00:00 | 10.14 |
| 2012-10-14 09:00:00 | 9.88 |
| 2012-10-14 10:00:00 | 9.88 |
| 2012-10-14 11:00:00 | 10.14 |
| 2012-10-14 12:00:00 | 13 |
| 2012-10-14 13:00:00 | 10.66 |
| 2012-10-14 14:00:00 | 10.92 |
| 2012-10-14 15:00:00 | 10.4 |
| 2012-10-14 16:00:00 | 10.92 |
| 2012-10-14 17:00:00 | 10.66 |
| 2012-10-14 18:00:00 | 10.92 |
| 2012-10-14 19:00:00 | 10.66 |
| 2012-10-14 20:00:00 | 10.92 |
| 2012-10-14 21:00:00 | 10.66 |
| 2012-10-14 22:00:00 | 10.92 |
| 2012-10-14 23:00:00 | 10.66 |
| 2012-10-15 | 10.92 |
| 2012-10-15 01:00:00 | 10.92 |
| 2012-10-15 02:00:00 | 10.66 |
| 2012-10-15 03:00:00 | 10.92 |
| 2012-10-15 04:00:00 | 10.66 |
| 2012-10-15 05:00:00 | 10.92 |
| 2012-10-15 06:00:00 | 10.66 |
| 2012-10-15 07:00:00 | 10.66 |
| 2012-10-15 08:00:00 | 10.4 |
| 2012-10-15 09:00:00 | 10.4 |
| 2012-10-15 10:00:00 | 10.4 |
| 2012-10-15 11:00:00 | 10.14 |
| 2012-10-15 12:00:00 | 10.4 |
| 2012-10-15 13:00:00 | 10.14 |
| 2012-10-15 14:00:00 | 10.4 |
| 2012-10-15 15:00:00 | 10.14 |
| 2012-10-15 16:00:00 | 10.14 |
| 2012-10-15 17:00:00 | 10.4 |
| 2012-10-15 18:00:00 | 10.14 |
| 2012-10-15 19:00:00 | 10.4 |
| 2012-10-15 20:00:00 | 7.28 |
| 2012-10-15 21:00:00 | 7.8 |
| 2012-10-15 22:00:00 | 7.54 |
| 2012-10-15 23:00:00 | 7.54 |
| 2012-10-16 | 7.8 |
| 2012-10-16 01:00:00 | 7.54 |
| 2012-10-16 02:00:00 | 8.32 |
| 2012-10-16 03:00:00 | 7.28 |
| 2012-10-16 04:00:00 | 7.8 |
| 2012-10-16 05:00:00 | 7.54 |
| 2012-10-16 06:00:00 | 7.54 |
| 2012-10-16 07:00:00 | 7.28 |
| 2012-10-16 08:00:00 | 7.8 |
| 2012-10-16 09:00:00 | 11.96 |
| 2012-10-16 10:00:00 | 12.22 |
| 2012-10-16 11:00:00 | 11.18 |
| 2012-10-16 12:00:00 | 10.66 |
| 2012-10-16 13:00:00 | 10.66 |
| 2012-10-16 14:00:00 | 10.66 |
| 2012-10-16 15:00:00 | 10.4 |
| 2012-10-16 16:00:00 | 10.66 |
| 2012-10-16 17:00:00 | 10.66 |
| 2012-10-16 18:00:00 | 10.66 |
| 2012-10-16 19:00:00 | 10.66 |
| 2012-10-16 20:00:00 | 10.66 |
| 2012-10-16 21:00:00 | 10.66 |
| 2012-10-16 22:00:00 | 10.92 |
| 2012-10-16 23:00:00 | 10.66 |
| 2012-10-17 | 10.92 |
| 2012-10-17 01:00:00 | 10.66 |
| 2012-10-17 02:00:00 | 10.66 |
| 2012-10-17 03:00:00 | 10.92 |
| 2012-10-17 04:00:00 | 10.66 |
| 2012-10-17 05:00:00 | 10.66 |
| 2012-10-17 06:00:00 | 10.66 |
| 2012-10-17 07:00:00 | 10.66 |
| 2012-10-17 08:00:00 | 10.66 |
| 2012-10-17 09:00:00 | 10.66 |
| 2012-10-17 10:00:00 | 10.66 |
| 2012-10-17 11:00:00 | 11.18 |
| 2012-10-17 12:00:00 | 10.66 |
| 2012-10-17 13:00:00 | 10.66 |
| 2012-10-17 14:00:00 | 10.66 |
| 2012-10-17 15:00:00 | 10.4 |
| 2012-10-17 16:00:00 | 10.4 |
| 2012-10-17 17:00:00 | 10.66 |
| 2012-10-17 18:00:00 | 10.4 |
| 2012-10-17 19:00:00 | 10.66 |
| 2012-10-17 20:00:00 | 10.66 |
| 2012-10-17 21:00:00 | 10.66 |
| 2012-10-17 22:00:00 | 10.66 |
| 2012-10-17 23:00:00 | 10.66 |
| 2012-10-18 | 10.92 |
| 2012-10-18 01:00:00 | 10.92 |
| 2012-10-18 02:00:00 | 10.66 |
| 2012-10-18 03:00:00 | 10.66 |
| 2012-10-18 04:00:00 | 10.66 |
| 2012-10-18 05:00:00 | 10.92 |
| 2012-10-18 06:00:00 | 10.66 |
| 2012-10-18 07:00:00 | 10.66 |
| 2012-10-18 08:00:00 | 10.66 |
| 2012-10-18 09:00:00 | 10.4 |
| 2012-10-18 10:00:00 | 10.66 |
| 2012-10-18 11:00:00 | 10.66 |
| 2012-10-18 12:00:00 | 10.66 |
| 2012-10-18 13:00:00 | 10.14 |
| 2012-10-18 14:00:00 | 10.14 |
| 2012-10-18 15:00:00 | 10.14 |
| 2012-10-18 16:00:00 | 10.14 |
| 2012-10-18 17:00:00 | 10.14 |
| 2012-10-18 18:00:00 | 10.14 |
| 2012-10-18 19:00:00 | 10.66 |
| 2012-10-18 20:00:00 | 10.4 |
| 2012-10-18 21:00:00 | 10.4 |
| 2012-10-18 22:00:00 | 10.4 |
| 2012-10-18 23:00:00 | 10.66 |
| 2012-10-19 | 10.4 |
| 2012-10-19 01:00:00 | 10.66 |
| 2012-10-19 02:00:00 | 10.4 |
| 2012-10-19 03:00:00 | 10.66 |
| 2012-10-19 04:00:00 | 10.66 |
| 2012-10-19 05:00:00 | 10.4 |
| 2012-10-19 06:00:00 | 10.66 |
| 2012-10-19 07:00:00 | 10.4 |
| 2012-10-19 08:00:00 | 10.4 |
| 2012-10-19 09:00:00 | 10.4 |
| 2012-10-19 10:00:00 | 10.4 |
| 2012-10-19 11:00:00 | 10.14 |
| 2012-10-19 12:00:00 | 10.14 |
| 2012-10-19 13:00:00 | 10.4 |
| 2012-10-19 14:00:00 | 10.14 |
| 2012-10-19 15:00:00 | 10.14 |
| 2012-10-19 16:00:00 | 10.4 |
| 2012-10-19 17:00:00 | 10.14 |
| 2012-10-19 18:00:00 | 10.14 |
| 2012-10-19 19:00:00 | 10.66 |
| 2012-10-19 20:00:00 | 10.4 |
| 2012-10-19 21:00:00 | 10.4 |
| 2012-10-19 22:00:00 | 10.4 |
| 2012-10-19 23:00:00 | 10.66 |
| 2012-10-20 | 10.4 |
| 2012-10-20 01:00:00 | 10.66 |
| 2012-10-20 02:00:00 | 10.4 |
| 2012-10-20 03:00:00 | 10.66 |
| 2012-10-20 04:00:00 | 10.66 |
| 2012-10-20 05:00:00 | 10.4 |
| 2012-10-20 06:00:00 | 10.66 |
| 2012-10-20 07:00:00 | 10.66 |
| 2012-10-20 08:00:00 | 10.4 |
| 2012-10-20 09:00:00 | 10.14 |
| 2012-10-20 10:00:00 | 10.4 |
| 2012-10-20 11:00:00 | 10.14 |
| 2012-10-20 12:00:00 | 10.4 |
| 2012-10-20 13:00:00 | 9.88 |
| 2012-10-20 14:00:00 | 10.14 |
| 2012-10-20 15:00:00 | 10.14 |
| 2012-10-20 16:00:00 | 10.14 |
| 2012-10-20 17:00:00 | 10.14 |
| 2012-10-20 18:00:00 | 10.14 |
| 2012-10-20 19:00:00 | 10.4 |
| 2012-10-20 20:00:00 | 10.4 |
| 2012-10-20 21:00:00 | 10.4 |
| 2012-10-20 22:00:00 | 10.4 |
| 2012-10-20 23:00:00 | 10.4 |
| 2012-10-21 | 10.4 |
| 2012-10-21 01:00:00 | 10.4 |
| 2012-10-21 02:00:00 | 10.66 |
| 2012-10-21 03:00:00 | 10.4 |
| 2012-10-21 04:00:00 | 10.4 |
| 2012-10-21 05:00:00 | 10.66 |
| 2012-10-21 06:00:00 | 10.4 |
| 2012-10-21 07:00:00 | 10.4 |
| 2012-10-21 08:00:00 | 10.4 |
| 2012-10-21 09:00:00 | 10.4 |
| 2012-10-21 10:00:00 | 10.4 |
| 2012-10-21 11:00:00 | 10.4 |
| 2012-10-21 12:00:00 | 10.14 |
| 2012-10-21 13:00:00 | 10.14 |
| 2012-10-21 14:00:00 | 10.4 |
| 2012-10-21 15:00:00 | 10.4 |
| 2012-10-21 16:00:00 | 10.14 |
| 2012-10-21 17:00:00 | 10.14 |
| 2012-10-21 18:00:00 | 10.4 |
| 2012-10-21 19:00:00 | 10.4 |
| 2012-10-21 20:00:00 | 10.4 |
| 2012-10-21 21:00:00 | 10.66 |
| 2012-10-21 22:00:00 | 10.66 |
| 2012-10-21 23:00:00 | 10.66 |
| 2012-10-22 | 10.4 |
| 2012-10-22 01:00:00 | 10.66 |
| 2012-10-22 02:00:00 | 10.4 |
| 2012-10-22 03:00:00 | 10.66 |
| 2012-10-22 04:00:00 | 10.66 |
| 2012-10-22 05:00:00 | 10.66 |
| 2012-10-22 06:00:00 | 10.66 |
| 2012-10-22 07:00:00 | 10.4 |
| 2012-10-22 08:00:00 | 10.66 |
| 2012-10-22 09:00:00 | 10.4 |
| 2012-10-22 10:00:00 | 10.4 |
| 2012-10-22 11:00:00 | 10.4 |
| 2012-10-22 12:00:00 | 10.66 |
| 2012-10-22 13:00:00 | 10.14 |
| 2012-10-22 14:00:00 | 10.4 |
| 2012-10-22 15:00:00 | 10.4 |
| 2012-10-22 16:00:00 | 10.14 |
| 2012-10-22 17:00:00 | 10.66 |
| 2012-10-22 18:00:00 | 10.4 |
| 2012-10-22 19:00:00 | 10.4 |
| 2012-10-22 20:00:00 | 10.66 |
| 2012-10-22 21:00:00 | 10.66 |
| 2012-10-22 22:00:00 | 10.66 |
| 2012-10-22 23:00:00 | 10.66 |
| 2012-10-23 | 10.66 |
| 2012-10-23 01:00:00 | 10.66 |
| 2012-10-23 02:00:00 | 10.66 |
| 2012-10-23 03:00:00 | 10.66 |
| 2012-10-23 04:00:00 | 10.4 |
| 2012-10-23 05:00:00 | 10.66 |
| 2012-10-23 06:00:00 | 10.66 |
| 2012-10-23 07:00:00 | 10.4 |
| 2012-10-23 08:00:00 | 10.66 |
| 2012-10-23 09:00:00 | 10.4 |
| 2012-10-23 10:00:00 | 10.4 |
| 2012-10-23 11:00:00 | 10.66 |
| 2012-10-23 12:00:00 | 10.66 |
| 2012-10-23 13:00:00 | 10.14 |
| 2012-10-23 14:00:00 | 10.14 |
| 2012-10-23 15:00:00 | 10.14 |
| 2012-10-23 16:00:00 | 10.4 |
| 2012-10-23 17:00:00 | 10.14 |
| 2012-10-23 18:00:00 | 10.14 |
| 2012-10-23 19:00:00 | 10.4 |
| 2012-10-23 20:00:00 | 10.4 |
| 2012-10-23 21:00:00 | 10.4 |
| 2012-10-23 22:00:00 | 10.4 |
| 2012-10-23 23:00:00 | 10.66 |
| 2012-10-24 | 10.4 |
| 2012-10-24 01:00:00 | 10.66 |
| 2012-10-24 02:00:00 | 10.66 |
| 2012-10-24 03:00:00 | 10.4 |
| 2012-10-24 04:00:00 | 10.66 |
| 2012-10-24 05:00:00 | 10.4 |
| 2012-10-24 06:00:00 | 10.66 |
| 2012-10-24 07:00:00 | 10.4 |
| 2012-10-24 08:00:00 | 10.4 |
| 2012-10-24 09:00:00 | 10.4 |
| 2012-10-24 10:00:00 | 10.14 |
| 2012-10-24 11:00:00 | 10.14 |
| 2012-10-24 12:00:00 | 10.4 |
| 2012-10-24 13:00:00 | 10.14 |
| 2012-10-24 14:00:00 | 10.14 |
| 2012-10-24 15:00:00 | 10.4 |
| 2012-10-24 16:00:00 | 10.14 |
| 2012-10-24 17:00:00 | 10.4 |
| 2012-10-24 18:00:00 | 10.14 |
| 2012-10-24 19:00:00 | 10.66 |
| 2012-10-24 20:00:00 | 10.4 |
| 2012-10-24 21:00:00 | 10.4 |
| 2012-10-24 22:00:00 | 10.66 |
| 2012-10-24 23:00:00 | 10.4 |
| 2012-10-25 | 10.66 |
| 2012-10-25 01:00:00 | 10.4 |
| 2012-10-25 02:00:00 | 10.66 |
| 2012-10-25 03:00:00 | 10.66 |
| 2012-10-25 04:00:00 | 10.4 |
| 2012-10-25 05:00:00 | 10.66 |
| 2012-10-25 06:00:00 | 10.66 |
| 2012-10-25 07:00:00 | 10.4 |
| 2012-10-25 08:00:00 | 10.4 |
| 2012-10-25 09:00:00 | 10.4 |
| 2012-10-25 10:00:00 | 10.14 |
| 2012-10-25 11:00:00 | 10.4 |
| 2012-10-25 12:00:00 | 10.4 |
| 2012-10-25 13:00:00 | 10.14 |
| 2012-10-25 14:00:00 | 10.4 |
| 2012-10-25 15:00:00 | 10.4 |
| 2012-10-25 16:00:00 | 10.4 |
| 2012-10-25 17:00:00 | 10.14 |
| 2012-10-25 18:00:00 | 10.66 |
| 2012-10-25 19:00:00 | 10.4 |
| 2012-10-25 20:00:00 | 10.66 |
| 2012-10-25 21:00:00 | 10.4 |
| 2012-10-25 22:00:00 | 10.92 |
| 2012-10-25 23:00:00 | 10.4 |
| 2012-10-26 | 10.4 |
| 2012-10-26 01:00:00 | 10.66 |
| 2012-10-26 02:00:00 | 10.66 |
| 2012-10-26 03:00:00 | 10.66 |
| 2012-10-26 04:00:00 | 10.66 |
| 2012-10-26 05:00:00 | 10.4 |
| 2012-10-26 06:00:00 | 10.66 |
| 2012-10-26 07:00:00 | 10.4 |
| 2012-10-26 08:00:00 | 10.66 |
| 2012-10-26 09:00:00 | 10.14 |
| 2012-10-26 10:00:00 | 10.4 |
| 2012-10-26 11:00:00 | 10.4 |
| 2012-10-26 12:00:00 | 10.4 |
| 2012-10-26 13:00:00 | 10.14 |
| 2012-10-26 14:00:00 | 10.4 |
| 2012-10-26 15:00:00 | 10.4 |
| 2012-10-26 16:00:00 | 10.14 |
| 2012-10-26 17:00:00 | 10.4 |
| 2012-10-26 18:00:00 | 10.4 |
| 2012-10-26 19:00:00 | 10.66 |
| 2012-10-26 20:00:00 | 10.66 |
| 2012-10-26 21:00:00 | 10.4 |
| 2012-10-26 22:00:00 | 10.66 |
| 2012-10-26 23:00:00 | 10.66 |
| 2012-10-27 | 10.66 |
| 2012-10-27 01:00:00 | 10.66 |
| 2012-10-27 02:00:00 | 10.92 |
| 2012-10-27 03:00:00 | 10.66 |
| 2012-10-27 04:00:00 | 10.66 |
| 2012-10-27 05:00:00 | 10.66 |
| 2012-10-27 06:00:00 | 10.66 |
| 2012-10-27 07:00:00 | 10.66 |
| 2012-10-27 08:00:00 | 10.92 |
| 2012-10-27 09:00:00 | 11.44 |
| 2012-10-27 10:00:00 | 11.7 |
| 2012-10-27 11:00:00 | 9.88 |
| 2012-10-27 12:00:00 | 10.14 |
| 2012-10-27 13:00:00 | 9.88 |
| 2012-10-27 14:00:00 | 10.14 |
| 2012-10-27 15:00:00 | 10.14 |
| 2012-10-27 16:00:00 | 10.14 |
| 2012-10-27 17:00:00 | 10.14 |
| 2012-10-27 18:00:00 | 10.4 |
| 2012-10-27 19:00:00 | 10.66 |
| 2012-10-27 20:00:00 | 10.66 |
| 2012-10-27 21:00:00 | 10.66 |
| 2012-10-27 22:00:00 | 10.92 |
| 2012-10-27 23:00:00 | 10.66 |
| 2012-10-28 | 10.92 |
| 2012-10-28 01:00:00 | 10.92 |
| 2012-10-28 02:00:00 | 10.92 |
| 2012-10-28 02:00:00 | 11.18 |
| 2012-10-28 03:00:00 | 10.92 |
| 2012-10-28 04:00:00 | 11.18 |
| 2012-10-28 05:00:00 | 11.18 |
| 2012-10-28 06:00:00 | 11.18 |
| 2012-10-28 07:00:00 | 10.92 |
| 2012-10-28 08:00:00 | 10.92 |
| 2012-10-28 09:00:00 | 10.92 |
| 2012-10-28 10:00:00 | 10.92 |
| 2012-10-28 11:00:00 | 10.66 |
| 2012-10-28 12:00:00 | 10.92 |
| 2012-10-28 13:00:00 | 10.66 |
| 2012-10-28 14:00:00 | 10.66 |
| 2012-10-28 15:00:00 | 10.92 |
| 2012-10-28 16:00:00 | 10.92 |
| 2012-10-28 17:00:00 | 10.92 |
| 2012-10-28 18:00:00 | 11.18 |
| 2012-10-28 19:00:00 | 11.18 |
| 2012-10-28 20:00:00 | 11.18 |
| 2012-10-28 21:00:00 | 11.18 |
| 2012-10-28 22:00:00 | 11.44 |
| 2012-10-28 23:00:00 | 11.18 |
| 2012-10-29 | 11.44 |
| 2012-10-29 01:00:00 | 11.44 |
| 2012-10-29 02:00:00 | 11.44 |
| 2012-10-29 03:00:00 | 11.44 |
| 2012-10-29 04:00:00 | 11.18 |
| 2012-10-29 05:00:00 | 11.44 |
| 2012-10-29 06:00:00 | 11.44 |
| 2012-10-29 07:00:00 | 11.18 |
| 2012-10-29 08:00:00 | 11.18 |
| 2012-10-29 09:00:00 | 11.44 |
| 2012-10-29 10:00:00 | 11.18 |
| 2012-10-29 11:00:00 | 11.44 |
| 2012-10-29 12:00:00 | 11.18 |
| 2012-10-29 13:00:00 | 11.18 |
| 2012-10-29 14:00:00 | 11.18 |
| 2012-10-29 15:00:00 | 11.44 |
| 2012-10-29 16:00:00 | 11.18 |
| 2012-10-29 17:00:00 | 11.44 |
| 2012-10-29 18:00:00 | 11.44 |
| 2012-10-29 19:00:00 | 11.44 |
| 2012-10-29 20:00:00 | 11.7 |
| 2012-10-29 21:00:00 | 11.44 |
| 2012-10-29 22:00:00 | 11.7 |
| 2012-10-29 23:00:00 | 11.44 |
| 2012-10-30 | 11.7 |
| 2012-10-30 01:00:00 | 11.7 |
| 2012-10-30 02:00:00 | 11.7 |
| 2012-10-30 03:00:00 | 11.7 |
| 2012-10-30 04:00:00 | 11.44 |
| 2012-10-30 05:00:00 | 11.7 |
| 2012-10-30 06:00:00 | 11.7 |
| 2012-10-30 07:00:00 | 11.44 |
| 2012-10-30 08:00:00 | 11.44 |
| 2012-10-30 09:00:00 | 11.44 |
| 2012-10-30 10:00:00 | 11.44 |
| 2012-10-30 11:00:00 | 12.74 |
| 2012-10-30 12:00:00 | 15.08 |
| 2012-10-30 13:00:00 | 12.22 |
| 2012-10-30 14:00:00 | 11.44 |
| 2012-10-30 15:00:00 | 11.44 |
| 2012-10-30 16:00:00 | 11.7 |
| 2012-10-30 17:00:00 | 11.7 |
| 2012-10-30 18:00:00 | 11.7 |
| 2012-10-30 19:00:00 | 11.96 |
| 2012-10-30 20:00:00 | 11.7 |
| 2012-10-30 21:00:00 | 11.7 |
| 2012-10-30 22:00:00 | 11.96 |
| 2012-10-30 23:00:00 | 11.7 |
| 2012-10-31 | 11.7 |
| 2012-10-31 01:00:00 | 11.7 |
| 2012-10-31 02:00:00 | 11.7 |
| 2012-10-31 03:00:00 | 11.7 |
| 2012-10-31 04:00:00 | 11.96 |
| 2012-10-31 05:00:00 | 11.44 |
| 2012-10-31 06:00:00 | 11.96 |
| 2012-10-31 07:00:00 | 11.7 |
| 2012-10-31 08:00:00 | 11.44 |
| 2012-10-31 09:00:00 | 11.44 |
| 2012-10-31 10:00:00 | 11.44 |
| 2012-10-31 11:00:00 | 11.44 |
| 2012-10-31 12:00:00 | 11.44 |
| 2012-10-31 13:00:00 | 11.18 |
| 2012-10-31 14:00:00 | 11.18 |
| 2012-10-31 15:00:00 | 11.18 |
| 2012-10-31 16:00:00 | 11.44 |
| 2012-10-31 17:00:00 | 11.18 |
| 2012-10-31 18:00:00 | 11.44 |
| 2012-10-31 19:00:00 | 11.44 |
| 2012-10-31 20:00:00 | 11.7 |
| 2012-10-31 21:00:00 | 11.44 |
| 2012-10-31 22:00:00 | 11.7 |
| 2012-10-31 23:00:00 | 11.44 |
| 2012-11-01 | 11.7 |
| 2012-11-01 01:00:00 | 11.44 |
| 2012-11-01 02:00:00 | 11.7 |
| 2012-11-01 03:00:00 | 11.44 |
| 2012-11-01 04:00:00 | 11.7 |
| 2012-11-01 05:00:00 | 11.44 |
| 2012-11-01 06:00:00 | 11.44 |
| 2012-11-01 07:00:00 | 11.44 |
| 2012-11-01 08:00:00 | 11.18 |
| 2012-11-01 09:00:00 | 11.18 |
| 2012-11-01 10:00:00 | 11.44 |
| 2012-11-01 11:00:00 | 11.18 |
| 2012-11-01 12:00:00 | 11.18 |
| 2012-11-01 13:00:00 | 11.18 |
| 2012-11-01 14:00:00 | 11.44 |
| 2012-11-01 15:00:00 | 11.18 |
| 2012-11-01 16:00:00 | 11.18 |
| 2012-11-01 17:00:00 | 11.44 |
| 2012-11-01 18:00:00 | 11.44 |
| 2012-11-01 19:00:00 | 11.18 |
| 2012-11-01 20:00:00 | 11.44 |
| 2012-11-01 21:00:00 | 11.18 |
| 2012-11-01 22:00:00 | 11.44 |
| 2012-11-01 23:00:00 | 11.18 |
| 2012-11-02 | 11.44 |
| 2012-11-02 01:00:00 | 11.18 |
| 2012-11-02 02:00:00 | 11.44 |
| 2012-11-02 03:00:00 | 11.44 |
| 2012-11-02 04:00:00 | 11.18 |
| 2012-11-02 05:00:00 | 11.44 |
| 2012-11-02 06:00:00 | 11.18 |
| 2012-11-02 07:00:00 | 11.18 |
| 2012-11-02 08:00:00 | 11.18 |
| 2012-11-02 09:00:00 | 10.92 |
| 2012-11-02 10:00:00 | 11.18 |
| 2012-11-02 11:00:00 | 11.18 |
| 2012-11-02 12:00:00 | 10.92 |
| 2012-11-02 13:00:00 | 11.18 |
| 2012-11-02 14:00:00 | 10.66 |
| 2012-11-02 15:00:00 | 11.18 |
| 2012-11-02 16:00:00 | 10.92 |
| 2012-11-02 17:00:00 | 11.18 |
| 2012-11-02 18:00:00 | 11.18 |
| 2012-11-02 19:00:00 | 11.18 |
| 2012-11-02 20:00:00 | 11.18 |
| 2012-11-02 21:00:00 | 11.18 |
| 2012-11-02 22:00:00 | 11.44 |
| 2012-11-02 23:00:00 | 11.44 |
| 2012-11-03 | 11.18 |
| 2012-11-03 01:00:00 | 11.7 |
| 2012-11-03 02:00:00 | 11.44 |
| 2012-11-03 03:00:00 | 11.44 |
| 2012-11-03 04:00:00 | 11.44 |
| 2012-11-03 05:00:00 | 11.44 |
| 2012-11-03 06:00:00 | 11.44 |
| 2012-11-03 07:00:00 | 11.44 |
| 2012-11-03 08:00:00 | 11.18 |
| 2012-11-03 09:00:00 | 11.18 |
| 2012-11-03 10:00:00 | 10.92 |
| 2012-11-03 11:00:00 | 11.18 |
| 2012-11-03 12:00:00 | 10.92 |
| 2012-11-03 13:00:00 | 10.92 |
| 2012-11-03 14:00:00 | 10.92 |
| 2012-11-03 15:00:00 | 10.92 |
| 2012-11-03 16:00:00 | 10.92 |
| 2012-11-03 17:00:00 | 10.92 |
| 2012-11-03 18:00:00 | 10.92 |
| 2012-11-03 19:00:00 | 11.18 |
| 2012-11-03 20:00:00 | 11.18 |
| 2012-11-03 21:00:00 | 11.18 |
| 2012-11-03 22:00:00 | 10.92 |
| 2012-11-03 23:00:00 | 11.18 |
| 2012-11-04 | 11.18 |
| 2012-11-04 01:00:00 | 11.18 |
| 2012-11-04 02:00:00 | 10.92 |
| 2012-11-04 03:00:00 | 11.18 |
| 2012-11-04 04:00:00 | 11.18 |
| 2012-11-04 05:00:00 | 11.18 |
| 2012-11-04 06:00:00 | 11.18 |
| 2012-11-04 07:00:00 | 10.92 |
| 2012-11-04 08:00:00 | 10.92 |
| 2012-11-04 09:00:00 | 10.92 |
| 2012-11-04 10:00:00 | 11.44 |
| 2012-11-04 11:00:00 | 10.66 |
| 2012-11-04 12:00:00 | 10.92 |
| 2012-11-04 13:00:00 | 10.92 |
| 2012-11-04 14:00:00 | 10.66 |
| 2012-11-04 15:00:00 | 10.92 |
| 2012-11-04 16:00:00 | 10.66 |
| 2012-11-04 17:00:00 | 10.92 |
| 2012-11-04 18:00:00 | 10.92 |
| 2012-11-04 19:00:00 | 11.18 |
| 2012-11-04 20:00:00 | 10.92 |
| 2012-11-04 21:00:00 | 10.92 |
| 2012-11-04 22:00:00 | 11.18 |
| 2012-11-04 23:00:00 | 10.92 |
| 2012-11-05 | 10.92 |
| 2012-11-05 01:00:00 | 10.92 |
| 2012-11-05 02:00:00 | 10.92 |
| 2012-11-05 03:00:00 | 10.92 |
| 2012-11-05 04:00:00 | 10.92 |
| 2012-11-05 05:00:00 | 10.92 |
| 2012-11-05 06:00:00 | 10.92 |
| 2012-11-05 07:00:00 | 10.92 |
| 2012-11-05 08:00:00 | 10.66 |
| 2012-11-05 09:00:00 | 10.92 |
| 2012-11-05 10:00:00 | 12.48 |
| 2012-11-05 11:00:00 | 12.48 |
| 2012-11-05 12:00:00 | 12.74 |
| 2012-11-05 13:00:00 | 11.7 |
| 2012-11-05 14:00:00 | 10.66 |
| 2012-11-05 15:00:00 | 10.14 |
| 2012-11-05 16:00:00 | 10.4 |
| 2012-11-05 17:00:00 | 10.4 |
| 2012-11-05 18:00:00 | 10.4 |
| 2012-11-05 19:00:00 | 10.66 |
| 2012-11-05 20:00:00 | 10.4 |
| 2012-11-05 21:00:00 | 10.4 |
| 2012-11-05 22:00:00 | 10.66 |
| 2012-11-05 23:00:00 | 10.4 |
| 2012-11-06 | 10.66 |
| 2012-11-06 01:00:00 | 10.14 |
| 2012-11-06 02:00:00 | 10.66 |
| 2012-11-06 03:00:00 | 10.66 |
| 2012-11-06 04:00:00 | 10.4 |
| 2012-11-06 05:00:00 | 10.66 |
| 2012-11-06 06:00:00 | 10.4 |
| 2012-11-06 07:00:00 | 10.4 |
| 2012-11-06 08:00:00 | 10.14 |
| 2012-11-06 09:00:00 | 11.96 |
| 2012-11-06 10:00:00 | 13.26 |
| 2012-11-06 11:00:00 | 12.48 |
| 2012-11-06 12:00:00 | 10.92 |
| 2012-11-06 13:00:00 | 10.92 |
| 2012-11-06 14:00:00 | 10.92 |
| 2012-11-06 15:00:00 | 10.92 |
| 2012-11-06 16:00:00 | 11.18 |
| 2012-11-06 17:00:00 | 11.18 |
| 2012-11-06 18:00:00 | 11.18 |
| 2012-11-06 19:00:00 | 11.18 |
| 2012-11-06 20:00:00 | 11.44 |
| 2012-11-06 21:00:00 | 11.44 |
| 2012-11-06 22:00:00 | 11.44 |
| 2012-11-06 23:00:00 | 11.44 |
| 2012-11-07 | 11.44 |
| 2012-11-07 01:00:00 | 11.44 |
| 2012-11-07 02:00:00 | 11.7 |
| 2012-11-07 03:00:00 | 11.7 |
| 2012-11-07 04:00:00 | 11.7 |
| 2012-11-07 05:00:00 | 11.44 |
| 2012-11-07 06:00:00 | 11.44 |
| 2012-11-07 07:00:00 | 11.7 |
| 2012-11-07 08:00:00 | 11.44 |
| 2012-11-07 09:00:00 | 9.62 |
| 2012-11-07 10:00:00 | 1.56 |
| 2012-11-07 11:00:00 | 2.6 |
| 2012-11-07 12:00:00 | 8.06 |
| 2012-11-07 13:00:00 | 7.28 |
| 2012-11-07 14:00:00 | 16.64 |
| 2012-11-07 15:00:00 | 13 |
| 2012-11-07 16:00:00 | 12.22 |
| 2012-11-07 17:00:00 | 12.74 |
| 2012-11-07 18:00:00 | 12.48 |
| 2012-11-07 19:00:00 | 12.74 |
| 2012-11-07 20:00:00 | 12.74 |
| 2012-11-07 21:00:00 | 12.48 |
| 2012-11-07 22:00:00 | 13 |
| 2012-11-07 23:00:00 | 12.48 |
| 2012-11-08 | 12.74 |
| 2012-11-08 01:00:00 | 12.48 |
| 2012-11-08 02:00:00 | 12.74 |
| 2012-11-08 03:00:00 | 12.74 |
| 2012-11-08 04:00:00 | 12.74 |
| 2012-11-08 05:00:00 | 12.48 |
| 2012-11-08 06:00:00 | 12.74 |
| 2012-11-08 07:00:00 | 12.48 |
| 2012-11-08 08:00:00 | 12.48 |
| 2012-11-08 09:00:00 | 12.48 |
| 2012-11-08 10:00:00 | 12.48 |
| 2012-11-08 11:00:00 | 12.22 |
| 2012-11-08 12:00:00 | 12.22 |
| 2012-11-08 13:00:00 | 12.22 |
| 2012-11-08 14:00:00 | 12.22 |
| 2012-11-08 15:00:00 | 12.22 |
| 2012-11-08 16:00:00 | 11.96 |
| 2012-11-08 17:00:00 | 12.22 |
| 2012-11-08 18:00:00 | 12.48 |
| 2012-11-08 19:00:00 | 12.22 |
| 2012-11-08 20:00:00 | 12.22 |
| 2012-11-08 21:00:00 | 12.48 |
| 2012-11-08 22:00:00 | 12.22 |
| 2012-11-08 23:00:00 | 12.48 |
| 2012-11-09 | 12.22 |
| 2012-11-09 01:00:00 | 12.74 |
| 2012-11-09 02:00:00 | 12.22 |
| 2012-11-09 03:00:00 | 12.48 |
| 2012-11-09 04:00:00 | 12.22 |
| 2012-11-09 05:00:00 | 12.48 |
| 2012-11-09 06:00:00 | 12.22 |
| 2012-11-09 07:00:00 | 12.48 |
| 2012-11-09 08:00:00 | 11.96 |
| 2012-11-09 09:00:00 | 13.26 |
| 2012-11-09 10:00:00 | 13.26 |
| 2012-11-09 11:00:00 | 12.74 |
| 2012-11-09 12:00:00 | 13 |
| 2012-11-09 13:00:00 | 12.48 |
| 2012-11-09 14:00:00 | 13.26 |
| 2012-11-09 15:00:00 | 12.48 |
| 2012-11-09 16:00:00 | 13 |
| 2012-11-09 17:00:00 | 12.74 |
| 2012-11-09 18:00:00 | 13 |
| 2012-11-09 19:00:00 | 12.74 |
| 2012-11-09 20:00:00 | 13.26 |
| 2012-11-09 21:00:00 | 13 |
| 2012-11-09 22:00:00 | 13.26 |
| 2012-11-09 23:00:00 | 12.74 |
| 2012-11-10 | 13.52 |
| 2012-11-10 01:00:00 | 13.26 |
| 2012-11-10 02:00:00 | 13 |
| 2012-11-10 03:00:00 | 13.26 |
| 2012-11-10 04:00:00 | 13.26 |
| 2012-11-10 05:00:00 | 13.52 |
| 2012-11-10 06:00:00 | 13.26 |
| 2012-11-10 07:00:00 | 13.52 |
| 2012-11-10 08:00:00 | 13 |
| 2012-11-10 09:00:00 | 13.52 |
| 2012-11-10 10:00:00 | 13.78 |
| 2012-11-10 11:00:00 | 12.48 |
| 2012-11-10 12:00:00 | 12.48 |
| 2012-11-10 13:00:00 | 12.22 |
| 2012-11-10 14:00:00 | 12.22 |
| 2012-11-10 15:00:00 | 12.22 |
| 2012-11-10 16:00:00 | 12.22 |
| 2012-11-10 17:00:00 | 12.22 |
| 2012-11-10 18:00:00 | 12.74 |
| 2012-11-10 19:00:00 | 12.22 |
| 2012-11-10 20:00:00 | 12.74 |
| 2012-11-10 21:00:00 | 12.48 |
| 2012-11-10 22:00:00 | 12.48 |
| 2012-11-10 23:00:00 | 12.74 |
| 2012-11-11 | 12.22 |
| 2012-11-11 01:00:00 | 12.74 |
| 2012-11-11 02:00:00 | 12.48 |
| 2012-11-11 03:00:00 | 12.48 |
| 2012-11-11 04:00:00 | 12.48 |
| 2012-11-11 05:00:00 | 12.48 |
| 2012-11-11 06:00:00 | 12.22 |
| 2012-11-11 07:00:00 | 12.48 |
| 2012-11-11 08:00:00 | 12.22 |
| 2012-11-11 09:00:00 | 11.96 |
| 2012-11-11 10:00:00 | 11.7 |
| 2012-11-11 11:00:00 | 11.96 |
| 2012-11-11 12:00:00 | 11.96 |
| 2012-11-11 13:00:00 | 11.7 |
| 2012-11-11 14:00:00 | 11.96 |
| 2012-11-11 15:00:00 | 11.44 |
| 2012-11-11 16:00:00 | 11.96 |
| 2012-11-11 17:00:00 | 11.7 |
| 2012-11-11 18:00:00 | 12.22 |
| 2012-11-11 19:00:00 | 11.96 |
| 2012-11-11 20:00:00 | 11.96 |
| 2012-11-11 21:00:00 | 11.96 |
| 2012-11-11 22:00:00 | 12.22 |
| 2012-11-11 23:00:00 | 11.96 |
| 2012-11-12 | 11.96 |
| 2012-11-12 01:00:00 | 12.48 |
| 2012-11-12 02:00:00 | 11.7 |
| 2012-11-12 03:00:00 | 11.96 |
| 2012-11-12 04:00:00 | 12.48 |
| 2012-11-12 05:00:00 | 11.96 |
| 2012-11-12 06:00:00 | 11.7 |
| 2012-11-12 07:00:00 | 11.96 |
| 2012-11-12 08:00:00 | 11.96 |
| 2012-11-12 09:00:00 | 11.7 |
| 2012-11-12 10:00:00 | 11.44 |
| 2012-11-12 11:00:00 | 11.96 |
| 2012-11-12 12:00:00 | 11.96 |
| 2012-11-12 13:00:00 | 11.44 |
| 2012-11-12 14:00:00 | 11.7 |
| 2012-11-12 15:00:00 | 11.7 |
| 2012-11-12 16:00:00 | 11.96 |
| 2012-11-12 17:00:00 | 11.96 |
| 2012-11-12 18:00:00 | 11.7 |
| 2012-11-12 19:00:00 | 11.96 |
| 2012-11-12 20:00:00 | 12.22 |
| 2012-11-12 21:00:00 | 11.96 |
| 2012-11-12 22:00:00 | 11.96 |
| 2012-11-12 23:00:00 | 11.96 |
| 2012-11-13 | 12.48 |
| 2012-11-13 01:00:00 | 11.7 |
| 2012-11-13 02:00:00 | 12.22 |
| 2012-11-13 03:00:00 | 11.96 |
| 2012-11-13 04:00:00 | 12.48 |
| 2012-11-13 05:00:00 | 11.96 |
| 2012-11-13 06:00:00 | 12.22 |
| 2012-11-13 07:00:00 | 12.22 |
| 2012-11-13 08:00:00 | 11.7 |
| 2012-11-13 09:00:00 | 12.22 |
| 2012-11-13 10:00:00 | 13.52 |
| 2012-11-13 11:00:00 | 12.22 |
| 2012-11-13 12:00:00 | 11.7 |
| 2012-11-13 13:00:00 | 11.96 |
| 2012-11-13 14:00:00 | 12.22 |
| 2012-11-13 15:00:00 | 11.96 |
| 2012-11-13 16:00:00 | 11.96 |
| 2012-11-13 17:00:00 | 11.96 |
| 2012-11-13 18:00:00 | 12.48 |
| 2012-11-13 19:00:00 | 11.96 |
| 2012-11-13 20:00:00 | 12.22 |
| 2012-11-13 21:00:00 | 12.22 |
| 2012-11-13 22:00:00 | 12.22 |
| 2012-11-13 23:00:00 | 12.22 |
| 2012-11-14 | 12.48 |
| 2012-11-14 01:00:00 | 12.48 |
| 2012-11-14 02:00:00 | 12.22 |
| 2012-11-14 03:00:00 | 12.74 |
| 2012-11-14 04:00:00 | 12.74 |
| 2012-11-14 05:00:00 | 12.48 |
| 2012-11-14 06:00:00 | 12.74 |
| 2012-11-14 07:00:00 | 12.74 |
| 2012-11-14 08:00:00 | 12.48 |
| 2012-11-14 09:00:00 | 12.48 |
| 2012-11-14 10:00:00 | 12.74 |
| 2012-11-14 11:00:00 | 12.48 |
| 2012-11-14 12:00:00 | 12.48 |
| 2012-11-14 13:00:00 | 12.48 |
| 2012-11-14 14:00:00 | 12.48 |
| 2012-11-14 15:00:00 | 12.48 |
| 2012-11-14 16:00:00 | 12.22 |
| 2012-11-14 17:00:00 | 13 |
| 2012-11-14 18:00:00 | 12.48 |
| 2012-11-14 19:00:00 | 13.26 |
| 2012-11-14 20:00:00 | 13 |
| 2012-11-14 21:00:00 | 13 |
| 2012-11-14 22:00:00 | 13 |
| 2012-11-14 23:00:00 | 13.52 |
| 2012-11-15 | 12.74 |
| 2012-11-15 01:00:00 | 13.52 |
| 2012-11-15 02:00:00 | 13 |
| 2012-11-15 03:00:00 | 13.26 |
| 2012-11-15 04:00:00 | 13 |
| 2012-11-15 05:00:00 | 13.26 |
| 2012-11-15 06:00:00 | 13.26 |
| 2012-11-15 07:00:00 | 13.26 |
| 2012-11-15 08:00:00 | 13 |
| 2012-11-15 09:00:00 | 13 |
| 2012-11-15 10:00:00 | 13.26 |
| 2012-11-15 11:00:00 | 12.74 |
| 2012-11-15 12:00:00 | 14.04 |
| 2012-11-15 13:00:00 | 14.3 |
| 2012-11-15 14:00:00 | 13 |
| 2012-11-15 15:00:00 | 13.26 |
| 2012-11-15 16:00:00 | 13 |
| 2012-11-15 17:00:00 | 13.78 |
| 2012-11-15 18:00:00 | 13.52 |
| 2012-11-15 19:00:00 | 13.52 |
| 2012-11-15 20:00:00 | 13.52 |
| 2012-11-15 21:00:00 | 13.78 |
| 2012-11-15 22:00:00 | 13.52 |
| 2012-11-15 23:00:00 | 14.04 |
| 2012-11-16 | 13.78 |
| 2012-11-16 01:00:00 | 13.52 |
| 2012-11-16 02:00:00 | 13.78 |
| 2012-11-16 03:00:00 | 13.78 |
| 2012-11-16 04:00:00 | 13.78 |
| 2012-11-16 05:00:00 | 14.04 |
| 2012-11-16 06:00:00 | 13.52 |
| 2012-11-16 07:00:00 | 14.04 |
| 2012-11-16 08:00:00 | 13.52 |
| 2012-11-16 09:00:00 | 13.26 |
| 2012-11-16 10:00:00 | 13.78 |
| 2012-11-16 11:00:00 | 13.26 |
| 2012-11-16 12:00:00 | 13.26 |
| 2012-11-16 13:00:00 | 13.52 |
| 2012-11-16 14:00:00 | 13.26 |
| 2012-11-16 15:00:00 | 13 |
| 2012-11-16 16:00:00 | 13.26 |
| 2012-11-16 17:00:00 | 13.78 |
| 2012-11-16 18:00:00 | 13.26 |
| 2012-11-16 19:00:00 | 13.78 |
| 2012-11-16 20:00:00 | 13.78 |
| 2012-11-16 21:00:00 | 13.52 |
| 2012-11-16 22:00:00 | 13.78 |
| 2012-11-16 23:00:00 | 13.78 |
| 2012-11-17 | 13.78 |
| 2012-11-17 01:00:00 | 13.78 |
| 2012-11-17 02:00:00 | 13.78 |
| 2012-11-17 03:00:00 | 13.78 |
| 2012-11-17 04:00:00 | 13.78 |
| 2012-11-17 05:00:00 | 14.04 |
| 2012-11-17 06:00:00 | 13.52 |
| 2012-11-17 07:00:00 | 14.04 |
| 2012-11-17 08:00:00 | 13.52 |
| 2012-11-17 09:00:00 | 13.52 |
| 2012-11-17 10:00:00 | 13.78 |
| 2012-11-17 11:00:00 | 13.52 |
| 2012-11-17 12:00:00 | 13 |
| 2012-11-17 13:00:00 | 13.52 |
| 2012-11-17 14:00:00 | 13.26 |
| 2012-11-17 15:00:00 | 13.26 |
| 2012-11-17 16:00:00 | 13.26 |
| 2012-11-17 17:00:00 | 13.52 |
| 2012-11-17 18:00:00 | 13.26 |
| 2012-11-17 19:00:00 | 13.52 |
| 2012-11-17 20:00:00 | 14.04 |
| 2012-11-17 21:00:00 | 13.26 |
| 2012-11-17 22:00:00 | 13.78 |
| 2012-11-17 23:00:00 | 13.78 |
| 2012-11-18 | 13.26 |
| 2012-11-18 01:00:00 | 14.04 |
| 2012-11-18 02:00:00 | 13.52 |
| 2012-11-18 03:00:00 | 13.52 |
| 2012-11-18 04:00:00 | 13.78 |
| 2012-11-18 05:00:00 | 13.52 |
| 2012-11-18 06:00:00 | 13.52 |
| 2012-11-18 07:00:00 | 13.52 |
| 2012-11-18 08:00:00 | 13 |
| 2012-11-18 09:00:00 | 13.52 |
| 2012-11-18 10:00:00 | 13 |
| 2012-11-18 11:00:00 | 13.52 |
| 2012-11-18 12:00:00 | 13.26 |
| 2012-11-18 13:00:00 | 13 |
| 2012-11-18 14:00:00 | 13.26 |
| 2012-11-18 15:00:00 | 13 |
| 2012-11-18 16:00:00 | 13.26 |
| 2012-11-18 17:00:00 | 13.26 |
| 2012-11-18 18:00:00 | 13.26 |
| 2012-11-18 19:00:00 | 13.52 |
| 2012-11-18 20:00:00 | 13 |
| 2012-11-18 21:00:00 | 13.52 |
| 2012-11-18 22:00:00 | 13.26 |
| 2012-11-18 23:00:00 | 13.26 |
| 2012-11-19 | 13.52 |
| 2012-11-19 01:00:00 | 13.26 |
| 2012-11-19 02:00:00 | 13.26 |
| 2012-11-19 03:00:00 | 13.26 |
| 2012-11-19 04:00:00 | 13.52 |
| 2012-11-19 05:00:00 | 13.52 |
| 2012-11-19 06:00:00 | 13 |
| 2012-11-19 07:00:00 | 13.26 |
| 2012-11-19 08:00:00 | 13 |
| 2012-11-19 09:00:00 | 13 |
| 2012-11-19 10:00:00 | 13.26 |
| 2012-11-19 11:00:00 | 16.12 |
| 2012-11-19 12:00:00 | 15.08 |
| 2012-11-19 13:00:00 | 13 |
| 2012-11-19 14:00:00 | 13 |
| 2012-11-19 15:00:00 | 13 |
| 2012-11-19 16:00:00 | 12.74 |
| 2012-11-19 17:00:00 | 13.26 |
| 2012-11-19 18:00:00 | 13 |
| 2012-11-19 19:00:00 | 13.26 |
| 2012-11-19 20:00:00 | 13 |
| 2012-11-19 21:00:00 | 13.52 |
| 2012-11-19 22:00:00 | 13 |
| 2012-11-19 23:00:00 | 13.26 |
| 2012-11-20 | 13 |
| 2012-11-20 01:00:00 | 13.52 |
| 2012-11-20 02:00:00 | 13 |
| 2012-11-20 03:00:00 | 13.26 |
| 2012-11-20 04:00:00 | 13.26 |
| 2012-11-20 05:00:00 | 13 |
| 2012-11-20 06:00:00 | 13.26 |
| 2012-11-20 07:00:00 | 13 |
| 2012-11-20 08:00:00 | 13 |
| 2012-11-20 09:00:00 | 12.74 |
| 2012-11-20 10:00:00 | 13 |
| 2012-11-20 11:00:00 | 12.74 |
| 2012-11-20 12:00:00 | 13 |
| 2012-11-20 13:00:00 | 12.48 |
| 2012-11-20 14:00:00 | 12.48 |
| 2012-11-20 15:00:00 | 12.74 |
| 2012-11-20 16:00:00 | 12.22 |
| 2012-11-20 17:00:00 | 12.74 |
| 2012-11-20 18:00:00 | 13 |
| 2012-11-20 19:00:00 | 12.74 |
| 2012-11-20 20:00:00 | 13 |
| 2012-11-20 21:00:00 | 13 |
| 2012-11-20 22:00:00 | 12.74 |
| 2012-11-20 23:00:00 | 13.26 |
| 2012-11-21 | 12.74 |
| 2012-11-21 01:00:00 | 13 |
| 2012-11-21 02:00:00 | 13.26 |
| 2012-11-21 03:00:00 | 12.74 |
| 2012-11-21 04:00:00 | 13 |
| 2012-11-21 05:00:00 | 13 |
| 2012-11-21 06:00:00 | 13 |
| 2012-11-21 07:00:00 | 13 |
| 2012-11-21 08:00:00 | 12.74 |
| 2012-11-21 09:00:00 | 12.22 |
| 2012-11-21 10:00:00 | 12.48 |
| 2012-11-21 11:00:00 | 12.48 |
| 2012-11-21 12:00:00 | 12.22 |
| 2012-11-21 13:00:00 | 12.22 |
| 2012-11-21 14:00:00 | 11.96 |
| 2012-11-21 15:00:00 | 12.48 |
| 2012-11-21 16:00:00 | 11.96 |
| 2012-11-21 17:00:00 | 12.74 |
| 2012-11-21 18:00:00 | 12.22 |
| 2012-11-21 19:00:00 | 12.22 |
| 2012-11-21 20:00:00 | 12.48 |
| 2012-11-21 21:00:00 | 12.48 |
| 2012-11-21 22:00:00 | 12.48 |
| 2012-11-21 23:00:00 | 12.48 |
| 2012-11-22 | 12.74 |
| 2012-11-22 01:00:00 | 12.22 |
| 2012-11-22 02:00:00 | 12.74 |
| 2012-11-22 03:00:00 | 12.48 |
| 2012-11-22 04:00:00 | 12.74 |
| 2012-11-22 05:00:00 | 12.48 |
| 2012-11-22 06:00:00 | 12.48 |
| 2012-11-22 07:00:00 | 12.48 |
| 2012-11-22 08:00:00 | 12.48 |
| 2012-11-22 09:00:00 | 12.22 |
| 2012-11-22 10:00:00 | 12.22 |
| 2012-11-22 11:00:00 | 15.86 |
| 2012-11-22 12:00:00 | 14.56 |
| 2012-11-22 13:00:00 | 14.3 |
| 2012-11-22 14:00:00 | 14.3 |
| 2012-11-22 15:00:00 | 14.3 |
| 2012-11-22 16:00:00 | 14.04 |
| 2012-11-22 17:00:00 | 14.56 |
| 2012-11-22 18:00:00 | 14.04 |
| 2012-11-22 19:00:00 | 14.56 |
| 2012-11-22 20:00:00 | 14.3 |
| 2012-11-22 21:00:00 | 14.04 |
| 2012-11-22 22:00:00 | 14.56 |
| 2012-11-22 23:00:00 | 14.04 |
| 2012-11-23 | 14.56 |
| 2012-11-23 01:00:00 | 14.3 |
| 2012-11-23 02:00:00 | 14.04 |
| 2012-11-23 03:00:00 | 14.56 |
| 2012-11-23 04:00:00 | 14.04 |
| 2012-11-23 05:00:00 | 14.56 |
| 2012-11-23 06:00:00 | 14.04 |
| 2012-11-23 07:00:00 | 14.3 |
| 2012-11-23 08:00:00 | 14.04 |
| 2012-11-23 09:00:00 | 13.78 |
| 2012-11-23 10:00:00 | 14.3 |
| 2012-11-23 11:00:00 | 13.78 |
| 2012-11-23 12:00:00 | 13.78 |
| 2012-11-23 13:00:00 | 13.78 |
| 2012-11-23 14:00:00 | 14.04 |
| 2012-11-23 15:00:00 | 13.78 |
| 2012-11-23 16:00:00 | 13.52 |
| 2012-11-23 17:00:00 | 14.3 |
| 2012-11-23 18:00:00 | 13.78 |
| 2012-11-23 19:00:00 | 14.04 |
| 2012-11-23 20:00:00 | 13.78 |
| 2012-11-23 21:00:00 | 14.04 |
| 2012-11-23 22:00:00 | 14.04 |
| 2012-11-23 23:00:00 | 13.78 |
| 2012-11-24 | 14.3 |
| 2012-11-24 01:00:00 | 14.04 |
| 2012-11-24 02:00:00 | 14.04 |
| 2012-11-24 03:00:00 | 14.04 |
| 2012-11-24 04:00:00 | 13.78 |
| 2012-11-24 05:00:00 | 14.3 |
| 2012-11-24 06:00:00 | 14.04 |
| 2012-11-24 07:00:00 | 14.04 |
| 2012-11-24 08:00:00 | 14.04 |
| 2012-11-24 09:00:00 | 13.52 |
| 2012-11-24 10:00:00 | 14.82 |
| 2012-11-24 11:00:00 | 13.78 |
| 2012-11-24 12:00:00 | 13.78 |
| 2012-11-24 13:00:00 | 13.52 |
| 2012-11-24 14:00:00 | 13.52 |
| 2012-11-24 15:00:00 | 14.04 |
| 2012-11-24 16:00:00 | 13.52 |
| 2012-11-24 17:00:00 | 14.04 |
| 2012-11-24 18:00:00 | 14.04 |
| 2012-11-24 19:00:00 | 14.04 |
| 2012-11-24 20:00:00 | 14.3 |
| 2012-11-24 21:00:00 | 14.3 |
| 2012-11-24 22:00:00 | 14.56 |
| 2012-11-24 23:00:00 | 14.3 |
| 2012-11-25 | 14.56 |
| 2012-11-25 01:00:00 | 14.3 |
| 2012-11-25 02:00:00 | 14.56 |
| 2012-11-25 03:00:00 | 14.56 |
| 2012-11-25 04:00:00 | 14.3 |
| 2012-11-25 05:00:00 | 14.56 |
| 2012-11-25 06:00:00 | 14.3 |
| 2012-11-25 07:00:00 | 14.3 |
| 2012-11-25 08:00:00 | 14.56 |
| 2012-11-25 09:00:00 | 13.78 |
| 2012-11-25 10:00:00 | 14.04 |
| 2012-11-25 11:00:00 | 13.78 |
| 2012-11-25 12:00:00 | 14.04 |
| 2012-11-25 13:00:00 | 13.52 |
| 2012-11-25 14:00:00 | 14.04 |
| 2012-11-25 15:00:00 | 13.52 |
| 2012-11-25 16:00:00 | 13.78 |
| 2012-11-25 17:00:00 | 13.78 |
| 2012-11-25 18:00:00 | 14.3 |
| 2012-11-25 19:00:00 | 13.78 |
| 2012-11-25 20:00:00 | 14.04 |
| 2012-11-25 21:00:00 | 13.78 |
| 2012-11-25 22:00:00 | 14.3 |
| 2012-11-25 23:00:00 | 14.04 |
| 2012-11-26 | 14.3 |
| 2012-11-26 01:00:00 | 13.78 |
| 2012-11-26 02:00:00 | 14.3 |
| 2012-11-26 03:00:00 | 13.78 |
| 2012-11-26 04:00:00 | 14.04 |
| 2012-11-26 05:00:00 | 14.04 |
| 2012-11-26 06:00:00 | 13.78 |
| 2012-11-26 07:00:00 | 14.3 |
| 2012-11-26 08:00:00 | 13.52 |
| 2012-11-26 09:00:00 | 14.04 |
| 2012-11-26 10:00:00 | 12.74 |
| 2012-11-26 11:00:00 | 13.26 |
| 2012-11-26 12:00:00 | 13 |
| 2012-11-26 13:00:00 | 13 |
| 2012-11-26 14:00:00 | 12.74 |
| 2012-11-26 15:00:00 | 12.74 |
| 2012-11-26 16:00:00 | 13 |
| 2012-11-26 17:00:00 | 12.74 |
| 2012-11-26 18:00:00 | 13.26 |
| 2012-11-26 19:00:00 | 13.26 |
| 2012-11-26 20:00:00 | 13 |
| 2012-11-26 21:00:00 | 13 |
| 2012-11-26 22:00:00 | 13.26 |
| 2012-11-26 23:00:00 | 13 |
| 2012-11-27 | 13 |
| 2012-11-27 01:00:00 | 13.26 |
| 2012-11-27 02:00:00 | 13 |
| 2012-11-27 03:00:00 | 13.26 |
| 2012-11-27 04:00:00 | 13 |
| 2012-11-27 05:00:00 | 13 |
| 2012-11-27 06:00:00 | 13 |
| 2012-11-27 07:00:00 | 13.26 |
| 2012-11-27 08:00:00 | 13 |
| 2012-11-27 09:00:00 | 12.74 |
| 2012-11-27 10:00:00 | 13 |
| 2012-11-27 11:00:00 | 12.74 |
| 2012-11-27 12:00:00 | 12.48 |
| 2012-11-27 13:00:00 | 12.74 |
| 2012-11-27 14:00:00 | 12.48 |
| 2012-11-27 15:00:00 | 12.48 |
| 2012-11-27 16:00:00 | 12.48 |
| 2012-11-27 17:00:00 | 12.48 |
| 2012-11-27 18:00:00 | 13 |
| 2012-11-27 19:00:00 | 12.74 |
| 2012-11-27 20:00:00 | 12.74 |
| 2012-11-27 21:00:00 | 12.74 |
| 2012-11-27 22:00:00 | 12.48 |
| 2012-11-27 23:00:00 | 13 |
| 2012-11-28 | 12.74 |
| 2012-11-28 01:00:00 | 12.48 |
| 2012-11-28 02:00:00 | 13 |
| 2012-11-28 03:00:00 | 12.48 |
| 2012-11-28 04:00:00 | 12.74 |
| 2012-11-28 05:00:00 | 13 |
| 2012-11-28 06:00:00 | 13 |
| 2012-11-28 07:00:00 | 12.48 |
| 2012-11-28 08:00:00 | 13 |
| 2012-11-28 09:00:00 | 12.74 |
| 2012-11-28 10:00:00 | 12.22 |
| 2012-11-28 11:00:00 | 13 |
| 2012-11-28 12:00:00 | 12.74 |
| 2012-11-28 13:00:00 | 13 |
| 2012-11-28 14:00:00 | 13 |
| 2012-11-28 15:00:00 | 13 |
| 2012-11-28 16:00:00 | 12.74 |
| 2012-11-28 17:00:00 | 13.26 |
| 2012-11-28 18:00:00 | 13 |
| 2012-11-28 19:00:00 | 13 |
| 2012-11-28 20:00:00 | 13.26 |
| 2012-11-28 21:00:00 | 13.26 |
| 2012-11-28 22:00:00 | 13 |
| 2012-11-28 23:00:00 | 13.52 |
| 2012-11-29 | 13 |
| 2012-11-29 01:00:00 | 13.26 |
| 2012-11-29 02:00:00 | 13 |
| 2012-11-29 03:00:00 | 13.52 |
| 2012-11-29 04:00:00 | 13 |
| 2012-11-29 05:00:00 | 13 |
| 2012-11-29 06:00:00 | 13.26 |
| 2012-11-29 07:00:00 | 13.26 |
| 2012-11-29 08:00:00 | 13 |
| 2012-11-29 09:00:00 | 12.48 |
| 2012-11-29 10:00:00 | 13 |
| 2012-11-29 11:00:00 | 12.74 |
| 2012-11-29 12:00:00 | 12.74 |
| 2012-11-29 13:00:00 | 12.74 |
| 2012-11-29 14:00:00 | 12.74 |
| 2012-11-29 15:00:00 | 12.74 |
| 2012-11-29 16:00:00 | 12.74 |
| 2012-11-29 17:00:00 | 13.26 |
| 2012-11-29 18:00:00 | 12.74 |
| 2012-11-29 19:00:00 | 13.26 |
| 2012-11-29 20:00:00 | 13.26 |
| 2012-11-29 21:00:00 | 13 |
| 2012-11-29 22:00:00 | 13.52 |
| 2012-11-29 23:00:00 | 13.26 |
| 2012-11-30 | 13.26 |
| 2012-11-30 01:00:00 | 13.52 |
| 2012-11-30 02:00:00 | 13 |
| 2012-11-30 03:00:00 | 13.78 |
| 2012-11-30 04:00:00 | 13.52 |
| 2012-11-30 05:00:00 | 13 |
| 2012-11-30 06:00:00 | 13.78 |
| 2012-11-30 07:00:00 | 13.26 |
| 2012-11-30 08:00:00 | 13.52 |
| 2012-11-30 09:00:00 | 13.26 |
| 2012-11-30 10:00:00 | 13.52 |
| 2012-11-30 11:00:00 | 14.3 |
| 2012-11-30 12:00:00 | 13.26 |
| 2012-11-30 13:00:00 | 13.26 |
| 2012-11-30 14:00:00 | 13.26 |
| 2012-11-30 15:00:00 | 13.26 |
| 2012-11-30 16:00:00 | 13.52 |
| 2012-11-30 17:00:00 | 13.78 |
| 2012-11-30 18:00:00 | 13.78 |
| 2012-11-30 19:00:00 | 13.52 |
| 2012-11-30 20:00:00 | 14.04 |
| 2012-11-30 21:00:00 | 13.78 |
| 2012-11-30 22:00:00 | 14.04 |
| 2012-11-30 23:00:00 | 13.78 |
| 2012-12-01 | 14.04 |
| 2012-12-01 01:00:00 | 14.04 |
| 2012-12-01 02:00:00 | 14.04 |
| 2012-12-01 03:00:00 | 14.04 |
| 2012-12-01 04:00:00 | 14.3 |
| 2012-12-01 05:00:00 | 13.78 |
| 2012-12-01 06:00:00 | 14.56 |
| 2012-12-01 07:00:00 | 14.04 |
| 2012-12-01 08:00:00 | 14.3 |
| 2012-12-01 09:00:00 | 13.78 |
| 2012-12-01 10:00:00 | 14.04 |
| 2012-12-01 11:00:00 | 14.04 |
| 2012-12-01 12:00:00 | 13.78 |
| 2012-12-01 13:00:00 | 14.04 |
| 2012-12-01 14:00:00 | 13.78 |
| 2012-12-01 15:00:00 | 14.3 |
| 2012-12-01 16:00:00 | 14.04 |
| 2012-12-01 17:00:00 | 14.3 |
| 2012-12-01 18:00:00 | 14.56 |
| 2012-12-01 19:00:00 | 14.3 |
| 2012-12-01 20:00:00 | 14.56 |
| 2012-12-01 21:00:00 | 14.56 |
| 2012-12-01 22:00:00 | 14.56 |
| 2012-12-01 23:00:00 | 14.56 |
| 2012-12-02 | 14.56 |
| 2012-12-02 01:00:00 | 14.82 |
| 2012-12-02 02:00:00 | 15.08 |
| 2012-12-02 03:00:00 | 14.56 |
| 2012-12-02 04:00:00 | 14.82 |
| 2012-12-02 05:00:00 | 15.08 |
| 2012-12-02 06:00:00 | 14.82 |
| 2012-12-02 07:00:00 | 14.82 |
| 2012-12-02 08:00:00 | 14.82 |
| 2012-12-02 09:00:00 | 14.82 |
| 2012-12-02 10:00:00 | 15.86 |
| 2012-12-02 11:00:00 | 15.08 |
| 2012-12-02 12:00:00 | 14.56 |
| 2012-12-02 13:00:00 | 14.82 |
| 2012-12-02 14:00:00 | 14.82 |
| 2012-12-02 15:00:00 | 14.82 |
| 2012-12-02 16:00:00 | 14.82 |
| 2012-12-02 17:00:00 | 15.08 |
| 2012-12-02 18:00:00 | 14.82 |
| 2012-12-02 19:00:00 | 15.08 |
| 2012-12-02 20:00:00 | 14.82 |
| 2012-12-02 21:00:00 | 15.08 |
| 2012-12-02 22:00:00 | 15.08 |
| 2012-12-02 23:00:00 | 15.34 |
| 2012-12-03 | 14.82 |
| 2012-12-03 01:00:00 | 15.34 |
| 2012-12-03 02:00:00 | 15.34 |
| 2012-12-03 03:00:00 | 14.82 |
| 2012-12-03 04:00:00 | 15.08 |
| 2012-12-03 05:00:00 | 15.34 |
| 2012-12-03 06:00:00 | 15.34 |
| 2012-12-03 07:00:00 | 15.08 |
| 2012-12-03 08:00:00 | 15.08 |
| 2012-12-03 09:00:00 | 15.34 |
| 2012-12-03 10:00:00 | 15.08 |
| 2012-12-03 11:00:00 | 14.82 |
| 2012-12-03 12:00:00 | 15.08 |
| 2012-12-03 13:00:00 | 15.34 |
| 2012-12-03 14:00:00 | 15.08 |
| 2012-12-03 15:00:00 | 14.82 |
| 2012-12-03 16:00:00 | 15.34 |
| 2012-12-03 17:00:00 | 15.34 |
| 2012-12-03 18:00:00 | 15.34 |
| 2012-12-03 19:00:00 | 15.08 |
| 2012-12-03 20:00:00 | 15.34 |
| 2012-12-03 21:00:00 | 15.34 |
| 2012-12-03 22:00:00 | 15.34 |
| 2012-12-03 23:00:00 | 15.34 |
| 2012-12-04 | 15.34 |
| 2012-12-04 01:00:00 | 15.6 |
| 2012-12-04 02:00:00 | 15.6 |
| 2012-12-04 03:00:00 | 15.86 |
| 2012-12-04 04:00:00 | 15.34 |
| 2012-12-04 05:00:00 | 15.6 |
| 2012-12-04 06:00:00 | 15.6 |
| 2012-12-04 07:00:00 | 15.34 |
| 2012-12-04 08:00:00 | 15.6 |
| 2012-12-04 09:00:00 | 15.34 |
| 2012-12-04 10:00:00 | 15.08 |
| 2012-12-04 11:00:00 | 15.08 |
| 2012-12-04 12:00:00 | 15.34 |
| 2012-12-04 13:00:00 | 15.34 |
| 2012-12-04 14:00:00 | 15.08 |
| 2012-12-04 15:00:00 | 15.34 |
| 2012-12-04 16:00:00 | 15.34 |
| 2012-12-04 17:00:00 | 15.6 |
| 2012-12-04 18:00:00 | 15.6 |
| 2012-12-04 19:00:00 | 15.86 |
| 2012-12-04 20:00:00 | 15.34 |
| 2012-12-04 21:00:00 | 15.08 |
| 2012-12-04 22:00:00 | 15.34 |
| 2012-12-04 23:00:00 | 15.34 |
| 2012-12-05 | 15.6 |
| 2012-12-05 01:00:00 | 15.34 |
| 2012-12-05 02:00:00 | 15.34 |
| 2012-12-05 03:00:00 | 15.08 |
| 2012-12-05 04:00:00 | 15.6 |
| 2012-12-05 05:00:00 | 15.34 |
| 2012-12-05 06:00:00 | 15.6 |
| 2012-12-05 07:00:00 | 15.34 |
| 2012-12-05 08:00:00 | 15.08 |
| 2012-12-05 09:00:00 | 15.34 |
| 2012-12-05 10:00:00 | 15.34 |
| 2012-12-05 11:00:00 | 15.08 |
| 2012-12-05 12:00:00 | 14.82 |
| 2012-12-05 13:00:00 | 15.08 |
| 2012-12-05 14:00:00 | 15.08 |
| 2012-12-05 15:00:00 | 14.82 |
| 2012-12-05 16:00:00 | 15.34 |
| 2012-12-05 17:00:00 | 15.6 |
| 2012-12-05 18:00:00 | 15.34 |
| 2012-12-05 19:00:00 | 15.34 |
| 2012-12-05 20:00:00 | 15.86 |
| 2012-12-05 21:00:00 | 15.6 |
| 2012-12-05 22:00:00 | 15.86 |
| 2012-12-05 23:00:00 | 15.6 |
| 2012-12-06 | 15.6 |
| 2012-12-06 01:00:00 | 15.86 |
| 2012-12-06 02:00:00 | 15.86 |
| 2012-12-06 03:00:00 | 15.86 |
| 2012-12-06 04:00:00 | 15.86 |
| 2012-12-06 05:00:00 | 15.86 |
| 2012-12-06 06:00:00 | 15.86 |
| 2012-12-06 07:00:00 | 15.86 |
| 2012-12-06 08:00:00 | 15.86 |
| 2012-12-06 09:00:00 | 15.6 |
| 2012-12-06 10:00:00 | 15.86 |
| 2012-12-06 11:00:00 | 15.6 |
| 2012-12-06 12:00:00 | 15.6 |
| 2012-12-06 13:00:00 | 15.6 |
| 2012-12-06 14:00:00 | 15.86 |
| 2012-12-06 15:00:00 | 15.6 |
| 2012-12-06 16:00:00 | 15.86 |
| 2012-12-06 17:00:00 | 15.86 |
| 2012-12-06 18:00:00 | 16.12 |
| 2012-12-06 19:00:00 | 16.12 |
| 2012-12-06 20:00:00 | 15.86 |
| 2012-12-06 21:00:00 | 16.12 |
| 2012-12-06 22:00:00 | 16.38 |
| 2012-12-06 23:00:00 | 16.38 |
| 2012-12-07 | 16.38 |
| 2012-12-07 01:00:00 | 16.12 |
| 2012-12-07 02:00:00 | 16.38 |
| 2012-12-07 03:00:00 | 16.38 |
| 2012-12-07 04:00:00 | 16.38 |
| 2012-12-07 05:00:00 | 16.38 |
| 2012-12-07 06:00:00 | 16.38 |
| 2012-12-07 07:00:00 | 16.38 |
| 2012-12-07 08:00:00 | 16.12 |
| 2012-12-07 09:00:00 | 16.12 |
| 2012-12-07 10:00:00 | 16.12 |
| 2012-12-07 11:00:00 | 16.38 |
| 2012-12-07 12:00:00 | 16.12 |
| 2012-12-07 13:00:00 | 15.86 |
| 2012-12-07 14:00:00 | 15.86 |
| 2012-12-07 15:00:00 | 16.12 |
| 2012-12-07 16:00:00 | 16.12 |
| 2012-12-07 17:00:00 | 16.38 |
| 2012-12-07 18:00:00 | 16.38 |
| 2012-12-07 19:00:00 | 16.38 |
| 2012-12-07 20:00:00 | 16.38 |
| 2012-12-07 21:00:00 | 16.9 |
| 2012-12-07 22:00:00 | 16.38 |
| 2012-12-07 23:00:00 | 16.9 |
| 2012-12-08 | 16.64 |
| 2012-12-08 01:00:00 | 16.9 |
| 2012-12-08 02:00:00 | 17.16 |
| 2012-12-08 03:00:00 | 16.9 |
| 2012-12-08 04:00:00 | 16.9 |
| 2012-12-08 05:00:00 | 17.16 |
| 2012-12-08 06:00:00 | 17.42 |
| 2012-12-08 07:00:00 | 17.16 |
| 2012-12-08 08:00:00 | 17.16 |
| 2012-12-08 09:00:00 | 16.9 |
| 2012-12-08 10:00:00 | 18.98 |
| 2012-12-08 11:00:00 | 16.9 |
| 2012-12-08 12:00:00 | 16.64 |
| 2012-12-08 13:00:00 | 16.38 |
| 2012-12-08 14:00:00 | 16.9 |
| 2012-12-08 15:00:00 | 16.64 |
| 2012-12-08 16:00:00 | 16.64 |
| 2012-12-08 17:00:00 | 17.16 |
| 2012-12-08 18:00:00 | 17.16 |
| 2012-12-08 19:00:00 | 16.9 |
| 2012-12-08 20:00:00 | 17.16 |
| 2012-12-08 21:00:00 | 17.42 |
| 2012-12-08 22:00:00 | 17.42 |
| 2012-12-08 23:00:00 | 17.42 |
| 2012-12-09 | 17.42 |
| 2012-12-09 01:00:00 | 17.68 |
| 2012-12-09 02:00:00 | 17.42 |
| 2012-12-09 03:00:00 | 17.94 |
| 2012-12-09 04:00:00 | 17.68 |
| 2012-12-09 05:00:00 | 17.68 |
| 2012-12-09 06:00:00 | 17.94 |
| 2012-12-09 07:00:00 | 17.94 |
| 2012-12-09 08:00:00 | 17.68 |
| 2012-12-09 09:00:00 | 17.42 |
| 2012-12-09 10:00:00 | 17.16 |
| 2012-12-09 11:00:00 | 17.42 |
| 2012-12-09 12:00:00 | 17.16 |
| 2012-12-09 13:00:00 | 17.16 |
| 2012-12-09 14:00:00 | 17.16 |
| 2012-12-09 15:00:00 | 17.16 |
| 2012-12-09 16:00:00 | 17.16 |
| 2012-12-09 17:00:00 | 17.42 |
| 2012-12-09 18:00:00 | 17.42 |
| 2012-12-09 19:00:00 | 17.42 |
| 2012-12-09 20:00:00 | 17.42 |
| 2012-12-09 21:00:00 | 17.42 |
| 2012-12-09 22:00:00 | 17.42 |
| 2012-12-09 23:00:00 | 17.68 |
| 2012-12-10 | 17.42 |
| 2012-12-10 01:00:00 | 17.42 |
| 2012-12-10 02:00:00 | 17.42 |
| 2012-12-10 03:00:00 | 17.42 |
| 2012-12-10 04:00:00 | 17.16 |
| 2012-12-10 05:00:00 | 17.42 |
| 2012-12-10 06:00:00 | 17.16 |
| 2012-12-10 07:00:00 | 16.9 |
| 2012-12-10 08:00:00 | 16.9 |
| 2012-12-10 09:00:00 | 16.9 |
| 2012-12-10 10:00:00 | 16.64 |
| 2012-12-10 11:00:00 | 17.42 |
| 2012-12-10 12:00:00 | 17.94 |
| 2012-12-10 13:00:00 | 16.38 |
| 2012-12-10 14:00:00 | 16.9 |
| 2012-12-10 15:00:00 | 16.38 |
| 2012-12-10 16:00:00 | 16.64 |
| 2012-12-10 17:00:00 | 16.64 |
| 2012-12-10 18:00:00 | 16.64 |
| 2012-12-10 19:00:00 | 16.64 |
| 2012-12-10 20:00:00 | 16.64 |
| 2012-12-10 21:00:00 | 16.64 |
| 2012-12-10 22:00:00 | 16.64 |
| 2012-12-10 23:00:00 | 16.64 |
| 2012-12-11 | 16.64 |
| 2012-12-11 01:00:00 | 16.64 |
| 2012-12-11 02:00:00 | 16.64 |
| 2012-12-11 03:00:00 | 16.64 |
| 2012-12-11 04:00:00 | 16.64 |
| 2012-12-11 05:00:00 | 16.64 |
| 2012-12-11 06:00:00 | 16.38 |
| 2012-12-11 07:00:00 | 16.64 |
| 2012-12-11 08:00:00 | 16.12 |
| 2012-12-11 09:00:00 | 16.38 |
| 2012-12-11 10:00:00 | 16.12 |
| 2012-12-11 11:00:00 | 16.38 |
| 2012-12-11 12:00:00 | 16.12 |
| 2012-12-11 13:00:00 | 16.38 |
| 2012-12-11 14:00:00 | 16.38 |
| 2012-12-11 15:00:00 | 16.12 |
| 2012-12-11 16:00:00 | 16.38 |
| 2012-12-11 17:00:00 | 16.38 |
| 2012-12-11 18:00:00 | 16.64 |
| 2012-12-11 19:00:00 | 16.38 |
| 2012-12-11 20:00:00 | 16.64 |
| 2012-12-11 21:00:00 | 16.38 |
| 2012-12-11 22:00:00 | 16.64 |
| 2012-12-11 23:00:00 | 16.64 |
| 2012-12-12 | 16.64 |
| 2012-12-12 01:00:00 | 16.64 |
| 2012-12-12 02:00:00 | 16.64 |
| 2012-12-12 03:00:00 | 16.64 |
| 2012-12-12 04:00:00 | 16.64 |
| 2012-12-12 05:00:00 | 16.64 |
| 2012-12-12 06:00:00 | 16.38 |
| 2012-12-12 07:00:00 | 16.64 |
| 2012-12-12 08:00:00 | 16.12 |
| 2012-12-12 09:00:00 | 16.38 |
| 2012-12-12 10:00:00 | 16.12 |
| 2012-12-12 11:00:00 | 17.68 |
| 2012-12-12 12:00:00 | 17.16 |
| 2012-12-12 13:00:00 | 15.86 |
| 2012-12-12 14:00:00 | 16.12 |
| 2012-12-12 15:00:00 | 16.12 |
| 2012-12-12 16:00:00 | 16.12 |
| 2012-12-12 17:00:00 | 16.12 |
| 2012-12-12 18:00:00 | 16.38 |
| 2012-12-12 19:00:00 | 16.38 |
| 2012-12-12 20:00:00 | 16.12 |
| 2012-12-12 21:00:00 | 16.38 |
| 2012-12-12 22:00:00 | 16.38 |
| 2012-12-12 23:00:00 | 16.64 |
| 2012-12-13 | 16.64 |
| 2012-12-13 01:00:00 | 16.64 |
| 2012-12-13 02:00:00 | 16.38 |
| 2012-12-13 03:00:00 | 16.64 |
| 2012-12-13 04:00:00 | 16.9 |
| 2012-12-13 05:00:00 | 16.64 |
| 2012-12-13 06:00:00 | 16.64 |
| 2012-12-13 07:00:00 | 16.9 |
| 2012-12-13 08:00:00 | 16.64 |
| 2012-12-13 09:00:00 | 16.38 |
| 2012-12-13 10:00:00 | 16.64 |
| 2012-12-13 11:00:00 | 16.64 |
| 2012-12-13 12:00:00 | 16.64 |
| 2012-12-13 13:00:00 | 16.64 |
| 2012-12-13 14:00:00 | 16.38 |
| 2012-12-13 15:00:00 | 16.64 |
| 2012-12-13 16:00:00 | 16.64 |
| 2012-12-13 17:00:00 | 16.64 |
| 2012-12-13 18:00:00 | 16.9 |
| 2012-12-13 19:00:00 | 16.9 |
| 2012-12-13 20:00:00 | 16.9 |
| 2012-12-13 21:00:00 | 16.9 |
| 2012-12-13 22:00:00 | 16.9 |
| 2012-12-13 23:00:00 | 17.16 |
| 2012-12-14 | 16.9 |
| 2012-12-14 01:00:00 | 17.16 |
| 2012-12-14 02:00:00 | 17.16 |
| 2012-12-14 03:00:00 | 17.42 |
| 2012-12-14 04:00:00 | 17.42 |
| 2012-12-14 05:00:00 | 17.16 |
| 2012-12-14 06:00:00 | 17.42 |
| 2012-12-14 07:00:00 | 17.16 |
| 2012-12-14 08:00:00 | 16.9 |
| 2012-12-14 09:00:00 | 16.9 |
| 2012-12-14 10:00:00 | 16.9 |
| 2012-12-14 11:00:00 | 16.9 |
| 2012-12-14 12:00:00 | 16.9 |
| 2012-12-14 13:00:00 | 16.64 |
| 2012-12-14 14:00:00 | 16.9 |
| 2012-12-14 15:00:00 | 16.9 |
| 2012-12-14 16:00:00 | 16.64 |
| 2012-12-14 17:00:00 | 17.16 |
| 2012-12-14 18:00:00 | 16.9 |
| 2012-12-14 19:00:00 | 16.9 |
| 2012-12-14 20:00:00 | 16.9 |
| 2012-12-14 21:00:00 | 17.16 |
| 2012-12-14 22:00:00 | 16.9 |
| 2012-12-14 23:00:00 | 16.9 |
| 2012-12-15 | 17.16 |
| 2012-12-15 01:00:00 | 16.9 |
| 2012-12-15 02:00:00 | 16.9 |
| 2012-12-15 03:00:00 | 16.64 |
| 2012-12-15 04:00:00 | 16.9 |
| 2012-12-15 05:00:00 | 16.64 |
| 2012-12-15 06:00:00 | 16.64 |
| 2012-12-15 07:00:00 | 16.64 |
| 2012-12-15 08:00:00 | 16.38 |
| 2012-12-15 09:00:00 | 16.12 |
| 2012-12-15 10:00:00 | 16.38 |
| 2012-12-15 11:00:00 | 16.38 |
| 2012-12-15 12:00:00 | 16.12 |
| 2012-12-15 13:00:00 | 16.12 |
| 2012-12-15 14:00:00 | 16.12 |
| 2012-12-15 15:00:00 | 16.12 |
| 2012-12-15 16:00:00 | 15.86 |
| 2012-12-15 17:00:00 | 16.12 |
| 2012-12-15 18:00:00 | 15.86 |
| 2012-12-15 19:00:00 | 16.12 |
| 2012-12-15 20:00:00 | 16.12 |
| 2012-12-15 21:00:00 | 16.12 |
| 2012-12-15 22:00:00 | 16.12 |
| 2012-12-15 23:00:00 | 16.12 |
| 2012-12-16 | 15.86 |
| 2012-12-16 01:00:00 | 16.12 |
| 2012-12-16 02:00:00 | 16.12 |
| 2012-12-16 03:00:00 | 16.12 |
| 2012-12-16 04:00:00 | 15.86 |
| 2012-12-16 05:00:00 | 16.12 |
| 2012-12-16 06:00:00 | 16.12 |
| 2012-12-16 07:00:00 | 15.86 |
| 2012-12-16 08:00:00 | 15.86 |
| 2012-12-16 09:00:00 | 15.86 |
| 2012-12-16 10:00:00 | 15.6 |
| 2012-12-16 11:00:00 | 15.86 |
| 2012-12-16 12:00:00 | 15.6 |
| 2012-12-16 13:00:00 | 15.6 |
| 2012-12-16 14:00:00 | 15.6 |
| 2012-12-16 15:00:00 | 15.86 |
| 2012-12-16 16:00:00 | 15.34 |
| 2012-12-16 17:00:00 | 15.86 |
| 2012-12-16 18:00:00 | 15.6 |
| 2012-12-16 19:00:00 | 15.6 |
| 2012-12-16 20:00:00 | 15.6 |
| 2012-12-16 21:00:00 | 16.12 |
| 2012-12-16 22:00:00 | 15.6 |
| 2012-12-16 23:00:00 | 15.6 |
| 2012-12-17 | 15.6 |
| 2012-12-17 01:00:00 | 15.34 |
| 2012-12-17 02:00:00 | 15.6 |
| 2012-12-17 03:00:00 | 15.6 |
| 2012-12-17 04:00:00 | 15.6 |
| 2012-12-17 05:00:00 | 15.6 |
| 2012-12-17 06:00:00 | 15.34 |
| 2012-12-17 07:00:00 | 15.6 |
| 2012-12-17 08:00:00 | 15.6 |
| 2012-12-17 09:00:00 | 15.08 |
| 2012-12-17 10:00:00 | 15.6 |
| 2012-12-17 11:00:00 | 15.08 |
| 2012-12-17 12:00:00 | 14.82 |
| 2012-12-17 13:00:00 | 15.08 |
| 2012-12-17 14:00:00 | 15.08 |
| 2012-12-17 15:00:00 | 14.82 |
| 2012-12-17 16:00:00 | 15.08 |
| 2012-12-17 17:00:00 | 15.08 |
| 2012-12-17 18:00:00 | 15.34 |
| 2012-12-17 19:00:00 | 15.08 |
| 2012-12-17 20:00:00 | 15.08 |
| 2012-12-17 21:00:00 | 15.08 |
| 2012-12-17 22:00:00 | 15.08 |
| 2012-12-17 23:00:00 | 15.34 |
| 2012-12-18 | 15.08 |
| 2012-12-18 01:00:00 | 15.08 |
| 2012-12-18 02:00:00 | 15.08 |
| 2012-12-18 03:00:00 | 15.08 |
| 2012-12-18 04:00:00 | 15.34 |
| 2012-12-18 05:00:00 | 14.82 |
| 2012-12-18 06:00:00 | 15.34 |
| 2012-12-18 07:00:00 | 15.08 |
| 2012-12-18 08:00:00 | 15.08 |
| 2012-12-18 09:00:00 | 14.82 |
| 2012-12-18 10:00:00 | 15.08 |
| 2012-12-18 11:00:00 | 14.82 |
| 2012-12-18 12:00:00 | 14.56 |
| 2012-12-18 13:00:00 | 14.82 |
| 2012-12-18 14:00:00 | 15.08 |
| 2012-12-18 15:00:00 | 14.82 |
| 2012-12-18 16:00:00 | 14.56 |
| 2012-12-18 17:00:00 | 15.08 |
| 2012-12-18 18:00:00 | 15.08 |
| 2012-12-18 19:00:00 | 15.34 |
| 2012-12-18 20:00:00 | 14.82 |
| 2012-12-18 21:00:00 | 15.34 |
| 2012-12-18 22:00:00 | 15.08 |
| 2012-12-18 23:00:00 | 15.08 |
| 2012-12-19 | 15.08 |
| 2012-12-19 01:00:00 | 15.34 |
| 2012-12-19 02:00:00 | 15.34 |
| 2012-12-19 03:00:00 | 15.6 |
| 2012-12-19 04:00:00 | 15.6 |
| 2012-12-19 05:00:00 | 15.6 |
| 2012-12-19 06:00:00 | 15.34 |
| 2012-12-19 07:00:00 | 15.08 |
| 2012-12-19 08:00:00 | 15.34 |
| 2012-12-19 09:00:00 | 15.08 |
| 2012-12-19 10:00:00 | 15.34 |
| 2012-12-19 11:00:00 | 14.82 |
| 2012-12-19 12:00:00 | 15.34 |
| 2012-12-19 13:00:00 | 15.08 |
| 2012-12-19 14:00:00 | 15.08 |
| 2012-12-19 15:00:00 | 15.08 |
| 2012-12-19 16:00:00 | 15.34 |
| 2012-12-19 17:00:00 | 15.34 |
| 2012-12-19 18:00:00 | 15.34 |
| 2012-12-19 19:00:00 | 15.34 |
| 2012-12-19 20:00:00 | 15.6 |
| 2012-12-19 21:00:00 | 15.6 |
| 2012-12-19 22:00:00 | 15.34 |
| 2012-12-19 23:00:00 | 15.34 |
| 2012-12-20 | 15.6 |
| 2012-12-20 01:00:00 | 15.6 |
| 2012-12-20 02:00:00 | 15.6 |
| 2012-12-20 03:00:00 | 15.6 |
| 2012-12-20 04:00:00 | 15.6 |
| 2012-12-20 05:00:00 | 15.6 |
| 2012-12-20 06:00:00 | 15.6 |
| 2012-12-20 07:00:00 | 15.6 |
| 2012-12-20 08:00:00 | 15.86 |
| 2012-12-20 09:00:00 | 15.34 |
| 2012-12-20 10:00:00 | 15.6 |
| 2012-12-20 11:00:00 | 15.6 |
| 2012-12-20 12:00:00 | 15.6 |
| 2012-12-20 13:00:00 | 15.34 |
| 2012-12-20 14:00:00 | 15.6 |
| 2012-12-20 15:00:00 | 15.6 |
| 2012-12-20 16:00:00 | 15.34 |
| 2012-12-20 17:00:00 | 15.86 |
| 2012-12-20 18:00:00 | 16.12 |
| 2012-12-20 19:00:00 | 16.12 |
| 2012-12-20 20:00:00 | 15.86 |
| 2012-12-20 21:00:00 | 15.86 |
| 2012-12-20 22:00:00 | 16.12 |
| 2012-12-20 23:00:00 | 16.12 |
| 2012-12-21 | 16.38 |
| 2012-12-21 01:00:00 | 16.38 |
| 2012-12-21 02:00:00 | 16.38 |
| 2012-12-21 03:00:00 | 16.12 |
| 2012-12-21 04:00:00 | 16.38 |
| 2012-12-21 05:00:00 | 16.12 |
| 2012-12-21 06:00:00 | 16.38 |
| 2012-12-21 07:00:00 | 16.38 |
| 2012-12-21 08:00:00 | 16.38 |
| 2012-12-21 09:00:00 | 16.12 |
| 2012-12-21 10:00:00 | 16.12 |
| 2012-12-21 11:00:00 | 16.12 |
| 2012-12-21 12:00:00 | 16.12 |
| 2012-12-21 13:00:00 | 16.12 |
| 2012-12-21 14:00:00 | 16.12 |
| 2012-12-21 15:00:00 | 16.12 |
| 2012-12-21 16:00:00 | 16.38 |
| 2012-12-21 17:00:00 | 16.38 |
| 2012-12-21 18:00:00 | 16.38 |
| 2012-12-21 19:00:00 | 16.64 |
| 2012-12-21 20:00:00 | 16.38 |
| 2012-12-21 21:00:00 | 16.64 |
| 2012-12-21 22:00:00 | 16.38 |
| 2012-12-21 23:00:00 | 16.9 |
| 2012-12-22 | 16.38 |
| 2012-12-22 01:00:00 | 16.9 |
| 2012-12-22 02:00:00 | 16.64 |
| 2012-12-22 03:00:00 | 16.64 |
| 2012-12-22 04:00:00 | 16.9 |
| 2012-12-22 05:00:00 | 16.64 |
| 2012-12-22 06:00:00 | 16.64 |
| 2012-12-22 07:00:00 | 16.64 |
| 2012-12-22 08:00:00 | 16.9 |
| 2012-12-22 09:00:00 | 17.16 |
| 2012-12-22 10:00:00 | 17.68 |
| 2012-12-22 11:00:00 | 17.16 |
| 2012-12-22 12:00:00 | 16.38 |
| 2012-12-22 13:00:00 | 16.38 |
| 2012-12-22 14:00:00 | 16.38 |
| 2012-12-22 15:00:00 | 16.64 |
| 2012-12-22 16:00:00 | 16.38 |
| 2012-12-22 17:00:00 | 16.38 |
| 2012-12-22 18:00:00 | 16.64 |
| 2012-12-22 19:00:00 | 16.9 |
| 2012-12-22 20:00:00 | 16.64 |
| 2012-12-22 21:00:00 | 16.64 |
| 2012-12-22 22:00:00 | 16.9 |
| 2012-12-22 23:00:00 | 16.64 |
| 2012-12-23 | 16.9 |
| 2012-12-23 01:00:00 | 16.64 |
| 2012-12-23 02:00:00 | 16.9 |
| 2012-12-23 03:00:00 | 16.9 |
| 2012-12-23 04:00:00 | 16.64 |
| 2012-12-23 05:00:00 | 16.9 |
| 2012-12-23 06:00:00 | 16.64 |
| 2012-12-23 07:00:00 | 16.64 |
| 2012-12-23 08:00:00 | 16.64 |
| 2012-12-23 09:00:00 | 16.38 |
| 2012-12-23 10:00:00 | 16.38 |
| 2012-12-23 11:00:00 | 16.12 |
| 2012-12-23 12:00:00 | 16.12 |
| 2012-12-23 13:00:00 | 16.12 |
| 2012-12-23 14:00:00 | 16.38 |
| 2012-12-23 15:00:00 | 15.86 |
| 2012-12-23 16:00:00 | 16.12 |
| 2012-12-23 17:00:00 | 16.38 |
| 2012-12-23 18:00:00 | 16.12 |
| 2012-12-23 19:00:00 | 16.12 |
| 2012-12-23 20:00:00 | 16.38 |
| 2012-12-23 21:00:00 | 16.38 |
| 2012-12-23 22:00:00 | 16.12 |
| 2012-12-23 23:00:00 | 16.38 |
| 2012-12-24 | 16.12 |
| 2012-12-24 01:00:00 | 16.64 |
| 2012-12-24 02:00:00 | 16.12 |
| 2012-12-24 03:00:00 | 16.38 |
| 2012-12-24 04:00:00 | 16.38 |
| 2012-12-24 05:00:00 | 16.12 |
| 2012-12-24 06:00:00 | 16.38 |
| 2012-12-24 07:00:00 | 16.12 |
| 2012-12-24 08:00:00 | 16.12 |
| 2012-12-24 09:00:00 | 15.86 |
| 2012-12-24 10:00:00 | 15.86 |
| 2012-12-24 11:00:00 | 16.12 |
| 2012-12-24 12:00:00 | 16.12 |
| 2012-12-24 13:00:00 | 15.6 |
| 2012-12-24 14:00:00 | 15.86 |
| 2012-12-24 15:00:00 | 15.86 |
| 2012-12-24 16:00:00 | 15.86 |
| 2012-12-24 17:00:00 | 15.6 |
| 2012-12-24 18:00:00 | 15.86 |
| 2012-12-24 19:00:00 | 16.12 |
| 2012-12-24 20:00:00 | 15.86 |
| 2012-12-24 21:00:00 | 16.12 |
| 2012-12-24 22:00:00 | 16.12 |
| 2012-12-24 23:00:00 | 15.86 |
| 2012-12-25 | 16.12 |
| 2012-12-25 01:00:00 | 15.86 |
| 2012-12-25 02:00:00 | 16.12 |
| 2012-12-25 03:00:00 | 16.12 |
| 2012-12-25 04:00:00 | 15.86 |
| 2012-12-25 05:00:00 | 16.38 |
| 2012-12-25 06:00:00 | 15.86 |
| 2012-12-25 07:00:00 | 15.86 |
| 2012-12-25 08:00:00 | 15.86 |
| 2012-12-25 09:00:00 | 15.86 |
| 2012-12-25 10:00:00 | 16.12 |
| 2012-12-25 11:00:00 | 17.42 |
| 2012-12-25 12:00:00 | 16.38 |
| 2012-12-25 13:00:00 | 15.6 |
| 2012-12-25 14:00:00 | 15.6 |
| 2012-12-25 15:00:00 | 15.6 |
| 2012-12-25 16:00:00 | 15.6 |
| 2012-12-25 17:00:00 | 15.86 |
| 2012-12-25 18:00:00 | 15.6 |
| 2012-12-25 19:00:00 | 15.6 |
| 2012-12-25 20:00:00 | 15.6 |
| 2012-12-25 21:00:00 | 15.86 |
| 2012-12-25 22:00:00 | 15.86 |
| 2012-12-25 23:00:00 | 15.6 |
| 2012-12-26 | 15.86 |
| 2012-12-26 01:00:00 | 15.86 |
| 2012-12-26 02:00:00 | 15.6 |
| 2012-12-26 03:00:00 | 15.86 |
| 2012-12-26 04:00:00 | 15.86 |
| 2012-12-26 05:00:00 | 15.6 |
| 2012-12-26 06:00:00 | 15.86 |
| 2012-12-26 07:00:00 | 15.6 |
| 2012-12-26 08:00:00 | 15.6 |
| 2012-12-26 09:00:00 | 15.6 |
| 2012-12-26 10:00:00 | 15.34 |
| 2012-12-26 11:00:00 | 15.6 |
| 2012-12-26 12:00:00 | 15.08 |
| 2012-12-26 13:00:00 | 15.08 |
| 2012-12-26 14:00:00 | 15.08 |
| 2012-12-26 15:00:00 | 15.34 |
| 2012-12-26 16:00:00 | 15.34 |
| 2012-12-26 17:00:00 | 14.82 |
| 2012-12-26 18:00:00 | 15.34 |
| 2012-12-26 19:00:00 | 15.6 |
| 2012-12-26 20:00:00 | 15.34 |
| 2012-12-26 21:00:00 | 15.34 |
| 2012-12-26 22:00:00 | 15.08 |
| 2012-12-26 23:00:00 | 15.34 |
| 2012-12-27 | 15.6 |
| 2012-12-27 01:00:00 | 15.08 |
| 2012-12-27 02:00:00 | 15.34 |
| 2012-12-27 03:00:00 | 15.6 |
| 2012-12-27 04:00:00 | 15.34 |
| 2012-12-27 05:00:00 | 15.08 |
| 2012-12-27 06:00:00 | 15.34 |
| 2012-12-27 07:00:00 | 15.6 |
| 2012-12-27 08:00:00 | 15.08 |
| 2012-12-27 09:00:00 | 14.82 |
| 2012-12-27 10:00:00 | 15.08 |
| 2012-12-27 11:00:00 | 15.34 |
| 2012-12-27 12:00:00 | 15.08 |
| 2012-12-27 13:00:00 | 14.56 |
| 2012-12-27 14:00:00 | 14.82 |
| 2012-12-27 15:00:00 | 14.82 |
| 2012-12-27 16:00:00 | 14.82 |
| 2012-12-27 17:00:00 | 14.56 |
| 2012-12-27 18:00:00 | 15.08 |
| 2012-12-27 19:00:00 | 15.08 |
| 2012-12-27 20:00:00 | 14.56 |
| 2012-12-27 21:00:00 | 15.08 |
| 2012-12-27 22:00:00 | 15.08 |
| 2012-12-27 23:00:00 | 14.82 |
| 2012-12-28 | 14.56 |
| 2012-12-28 01:00:00 | 15.08 |
| 2012-12-28 02:00:00 | 15.08 |
| 2012-12-28 03:00:00 | 14.82 |
| 2012-12-28 04:00:00 | 15.08 |
| 2012-12-28 05:00:00 | 14.82 |
| 2012-12-28 06:00:00 | 15.08 |
| 2012-12-28 07:00:00 | 15.08 |
| 2012-12-28 08:00:00 | 14.56 |
| 2012-12-28 09:00:00 | 15.08 |
| 2012-12-28 10:00:00 | 15.08 |
| 2012-12-28 11:00:00 | 15.6 |
| 2012-12-28 12:00:00 | 15.34 |
| 2012-12-28 13:00:00 | 15.08 |
| 2012-12-28 14:00:00 | 15.08 |
| 2012-12-28 15:00:00 | 15.34 |
| 2012-12-28 16:00:00 | 15.08 |
| 2012-12-28 17:00:00 | 15.6 |
| 2012-12-28 18:00:00 | 15.86 |
| 2012-12-28 19:00:00 | 15.6 |
| 2012-12-28 20:00:00 | 15.86 |
| 2012-12-28 21:00:00 | 15.86 |
| 2012-12-28 22:00:00 | 15.86 |
| 2012-12-28 23:00:00 | 15.86 |
| 2012-12-29 | 16.12 |
| 2012-12-29 01:00:00 | 15.86 |
| 2012-12-29 02:00:00 | 16.38 |
| 2012-12-29 03:00:00 | 16.12 |
| 2012-12-29 04:00:00 | 16.38 |
| 2012-12-29 05:00:00 | 16.12 |
| 2012-12-29 06:00:00 | 16.64 |
| 2012-12-29 07:00:00 | 16.38 |
| 2012-12-29 08:00:00 | 16.64 |
| 2012-12-29 09:00:00 | 16.12 |
| 2012-12-29 10:00:00 | 16.38 |
| 2012-12-29 11:00:00 | 16.12 |
| 2012-12-29 12:00:00 | 16.12 |
| 2012-12-29 13:00:00 | 16.38 |
| 2012-12-29 14:00:00 | 15.86 |
| 2012-12-29 15:00:00 | 15.86 |
| 2012-12-29 16:00:00 | 16.38 |
| 2012-12-29 17:00:00 | 16.38 |
| 2012-12-29 18:00:00 | 16.64 |
| 2012-12-29 19:00:00 | 16.38 |
| 2012-12-29 20:00:00 | 16.9 |
| 2012-12-29 21:00:00 | 16.38 |
| 2012-12-29 22:00:00 | 16.9 |
| 2012-12-29 23:00:00 | 16.64 |
| 2012-12-30 | 16.64 |
| 2012-12-30 01:00:00 | 17.16 |
| 2012-12-30 02:00:00 | 16.9 |
| 2012-12-30 03:00:00 | 16.9 |
| 2012-12-30 04:00:00 | 16.9 |
| 2012-12-30 05:00:00 | 17.16 |
| 2012-12-30 06:00:00 | 16.9 |
| 2012-12-30 07:00:00 | 16.64 |
| 2012-12-30 08:00:00 | 16.64 |
| 2012-12-30 09:00:00 | 16.64 |
| 2012-12-30 10:00:00 | 16.9 |
| 2012-12-30 11:00:00 | 16.64 |
| 2012-12-30 12:00:00 | 16.64 |
| 2012-12-30 13:00:00 | 16.38 |
| 2012-12-30 14:00:00 | 16.38 |
| 2012-12-30 15:00:00 | 16.38 |
| 2012-12-30 16:00:00 | 16.38 |
| 2012-12-30 17:00:00 | 16.64 |
| 2012-12-30 18:00:00 | 16.64 |
| 2012-12-30 19:00:00 | 16.38 |
| 2012-12-30 20:00:00 | 16.64 |
| 2012-12-30 21:00:00 | 16.64 |
| 2012-12-30 22:00:00 | 16.9 |
| 2012-12-30 23:00:00 | 16.64 |
| 2012-12-31 | 16.64 |
| 2012-12-31 | 16.9 |
| 2012-12-31 | 16.38 |
| 2012-12-31 | 16.9 |
| 2012-12-31 | 16.38 |
| 2012-12-31 | 16.64 |
| 2012-12-31 | 16.9 |
| 2012-12-31 | 16.64 |
| 2012-12-31 | 16.64 |
| 2012-12-31 | 16.38 |
| 2012-12-31 | 16.12 |
| 2012-12-31 | 16.12 |
| 2012-12-31 | 16.12 |
| 2012-12-31 | 16.12 |
| 2012-12-31 | 15.86 |
| 2012-12-31 | 16.12 |
| 2012-12-31 | 15.86 |
| 2012-12-31 | 16.12 |
| 2012-12-31 | 16.12 |
| 2012-12-31 | 16.38 |
| 2012-12-31 | 16.12 |
| 2012-12-31 | 16.38 |
| 2012-12-31 | 16.38 |
| 2012-12-31 | 16.38 |
| 2013-01-01 | 16.12 |